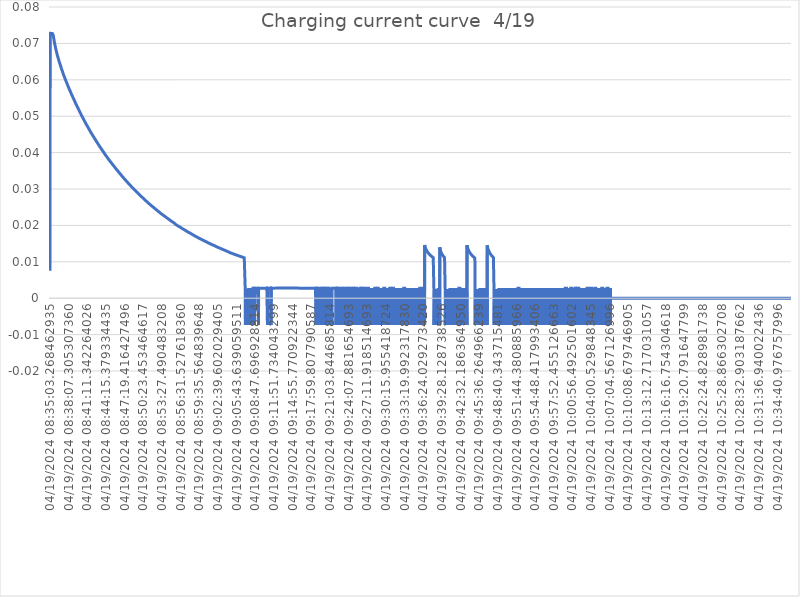
| Category | Series 0 |
|---|---|
| 04/19/2024 08:35:03.268462935 | 0.008 |
| 04/19/2024 08:35:04.285254481 | 0.073 |
| 04/19/2024 08:35:05.302024708 | 0.073 |
| 04/19/2024 08:35:06.318793132 | 0.073 |
| 04/19/2024 08:35:07.335560950 | 0.073 |
| 04/19/2024 08:35:08.352336647 | 0.073 |
| 04/19/2024 08:35:09.369111435 | 0.073 |
| 04/19/2024 08:35:10.385884587 | 0.073 |
| 04/19/2024 08:35:11.402660829 | 0.073 |
| 04/19/2024 08:35:12.419437223 | 0.073 |
| 04/19/2024 08:35:13.436207678 | 0.073 |
| 04/19/2024 08:35:14.452979950 | 0.073 |
| 04/19/2024 08:35:15.469751526 | 0.073 |
| 04/19/2024 08:35:16.486524617 | 0.073 |
| 04/19/2024 08:35:17.503297011 | 0.073 |
| 04/19/2024 08:35:18.520073799 | 0.073 |
| 04/19/2024 08:35:19.536838405 | 0.073 |
| 04/19/2024 08:35:20.553617041 | 0.073 |
| 04/19/2024 08:35:21.570386647 | 0.073 |
| 04/19/2024 08:35:22.587162102 | 0.073 |
| 04/19/2024 08:35:23.603941284 | 0.073 |
| 04/19/2024 08:35:24.620717738 | 0.073 |
| 04/19/2024 08:35:25.637512526 | 0.073 |
| 04/19/2024 08:35:26.654300950 | 0.073 |
| 04/19/2024 08:35:27.671077769 | 0.073 |
| 04/19/2024 08:35:28.687862496 | 0.073 |
| 04/19/2024 08:35:29.704645496 | 0.073 |
| 04/19/2024 08:35:30.721424193 | 0.073 |
| 04/19/2024 08:35:31.738205011 | 0.073 |
| 04/19/2024 08:35:32.754984072 | 0.073 |
| 04/19/2024 08:35:33.771765011 | 0.072 |
| 04/19/2024 08:35:34.788544405 | 0.072 |
| 04/19/2024 08:35:35.805323753 | 0.072 |
| 04/19/2024 08:35:36.822105874 | 0.072 |
| 04/19/2024 08:35:37.838877420 | 0.072 |
| 04/19/2024 08:35:38.855656480 | 0.072 |
| 04/19/2024 08:35:39.872435844 | 0.071 |
| 04/19/2024 08:35:40.889208996 | 0.071 |
| 04/19/2024 08:35:41.905987693 | 0.071 |
| 04/19/2024 08:35:42.922769268 | 0.071 |
| 04/19/2024 08:35:43.939541662 | 0.071 |
| 04/19/2024 08:35:44.956319390 | 0.07 |
| 04/19/2024 08:35:45.973093814 | 0.07 |
| 04/19/2024 08:35:46.989871420 | 0.07 |
| 04/19/2024 08:35:48.006648874 | 0.07 |
| 04/19/2024 08:35:49.023427723 | 0.07 |
| 04/19/2024 08:35:50.040206147 | 0.07 |
| 04/19/2024 08:35:51.056984511 | 0.07 |
| 04/19/2024 08:35:52.073766693 | 0.07 |
| 04/19/2024 08:35:53.090551783 | 0.069 |
| 04/19/2024 08:35:54.107332541 | 0.069 |
| 04/19/2024 08:35:55.124113814 | 0.069 |
| 04/19/2024 08:35:56.140887996 | 0.069 |
| 04/19/2024 08:35:57.157663420 | 0.069 |
| 04/19/2024 08:35:58.174444632 | 0.069 |
| 04/19/2024 08:35:59.191221935 | 0.069 |
| 04/19/2024 08:36:00.208007753 | 0.068 |
| 04/19/2024 08:36:01.224790086 | 0.068 |
| 04/19/2024 08:36:02.241565996 | 0.068 |
| 04/19/2024 08:36:03.258343420 | 0.068 |
| 04/19/2024 08:36:04.275117935 | 0.068 |
| 04/19/2024 08:36:05.291903193 | 0.068 |
| 04/19/2024 08:36:06.308674466 | 0.068 |
| 04/19/2024 08:36:07.325444466 | 0.068 |
| 04/19/2024 08:36:08.342216405 | 0.068 |
| 04/19/2024 08:36:09.358993678 | 0.067 |
| 04/19/2024 08:36:10.375769587 | 0.067 |
| 04/19/2024 08:36:11.392550951 | 0.067 |
| 04/19/2024 08:36:12.409332557 | 0.067 |
| 04/19/2024 08:36:13.426110042 | 0.067 |
| 04/19/2024 08:36:14.442882617 | 0.067 |
| 04/19/2024 08:36:15.459662678 | 0.067 |
| 04/19/2024 08:36:16.476443739 | 0.067 |
| 04/19/2024 08:36:17.493215345 | 0.067 |
| 04/19/2024 08:36:18.509994193 | 0.066 |
| 04/19/2024 08:36:19.526775405 | 0.066 |
| 04/19/2024 08:36:20.543556254 | 0.066 |
| 04/19/2024 08:36:21.560335314 | 0.066 |
| 04/19/2024 08:36:22.577110739 | 0.066 |
| 04/19/2024 08:36:23.593901133 | 0.066 |
| 04/19/2024 08:36:24.610684163 | 0.066 |
| 04/19/2024 08:36:25.627459799 | 0.066 |
| 04/19/2024 08:36:26.644245557 | 0.066 |
| 04/19/2024 08:36:27.661019314 | 0.066 |
| 04/19/2024 08:36:28.677795314 | 0.065 |
| 04/19/2024 08:36:29.694581890 | 0.065 |
| 04/19/2024 08:36:30.711358739 | 0.065 |
| 04/19/2024 08:36:31.728139284 | 0.065 |
| 04/19/2024 08:36:32.744916648 | 0.065 |
| 04/19/2024 08:36:33.761690708 | 0.065 |
| 04/19/2024 08:36:34.778468254 | 0.065 |
| 04/19/2024 08:36:35.795249571 | 0.065 |
| 04/19/2024 08:36:36.812031662 | 0.065 |
| 04/19/2024 08:36:37.828813420 | 0.065 |
| 04/19/2024 08:36:38.845588723 | 0.065 |
| 04/19/2024 08:36:39.862369480 | 0.064 |
| 04/19/2024 08:36:40.879144208 | 0.064 |
| 04/19/2024 08:36:41.895924662 | 0.064 |
| 04/19/2024 08:36:42.912706783 | 0.064 |
| 04/19/2024 08:36:43.929485753 | 0.064 |
| 04/19/2024 08:36:44.946273056 | 0.064 |
| 04/19/2024 08:36:45.963045753 | 0.064 |
| 04/19/2024 08:36:46.979824935 | 0.064 |
| 04/19/2024 08:36:47.996604905 | 0.064 |
| 04/19/2024 08:36:49.013381753 | 0.064 |
| 04/19/2024 08:36:50.030161783 | 0.064 |
| 04/19/2024 08:36:51.046947420 | 0.063 |
| 04/19/2024 08:36:52.063728480 | 0.063 |
| 04/19/2024 08:36:53.080519450 | 0.063 |
| 04/19/2024 08:36:54.097301905 | 0.063 |
| 04/19/2024 08:36:55.114085965 | 0.063 |
| 04/19/2024 08:36:56.130867783 | 0.063 |
| 04/19/2024 08:36:57.147643632 | 0.063 |
| 04/19/2024 08:36:58.164429208 | 0.063 |
| 04/19/2024 08:36:59.181203086 | 0.063 |
| 04/19/2024 08:37:00.197979693 | 0.063 |
| 04/19/2024 08:37:01.214759662 | 0.063 |
| 04/19/2024 08:37:02.231533874 | 0.063 |
| 04/19/2024 08:37:03.248314420 | 0.062 |
| 04/19/2024 08:37:04.265088359 | 0.062 |
| 04/19/2024 08:37:05.281863571 | 0.062 |
| 04/19/2024 08:37:06.298648965 | 0.062 |
| 04/19/2024 08:37:07.315421329 | 0.062 |
| 04/19/2024 08:37:08.332199147 | 0.062 |
| 04/19/2024 08:37:09.348975299 | 0.062 |
| 04/19/2024 08:37:10.365755844 | 0.062 |
| 04/19/2024 08:37:11.382533753 | 0.062 |
| 04/19/2024 08:37:12.399315511 | 0.062 |
| 04/19/2024 08:37:13.416092571 | 0.062 |
| 04/19/2024 08:37:14.432863602 | 0.062 |
| 04/19/2024 08:37:15.449641299 | 0.061 |
| 04/19/2024 08:37:16.466418935 | 0.061 |
| 04/19/2024 08:37:17.483193208 | 0.061 |
| 04/19/2024 08:37:18.499974359 | 0.061 |
| 04/19/2024 08:37:19.516751571 | 0.061 |
| 04/19/2024 08:37:20.533522965 | 0.061 |
| 04/19/2024 08:37:21.550304632 | 0.061 |
| 04/19/2024 08:37:22.567076056 | 0.061 |
| 04/19/2024 08:37:23.583856511 | 0.061 |
| 04/19/2024 08:37:24.600646026 | 0.061 |
| 04/19/2024 08:37:25.617424147 | 0.061 |
| 04/19/2024 08:37:26.634208602 | 0.061 |
| 04/19/2024 08:37:27.650992299 | 0.061 |
| 04/19/2024 08:37:28.667769874 | 0.061 |
| 04/19/2024 08:37:29.684552783 | 0.06 |
| 04/19/2024 08:37:30.701329420 | 0.06 |
| 04/19/2024 08:37:31.718103844 | 0.06 |
| 04/19/2024 08:37:32.734886783 | 0.06 |
| 04/19/2024 08:37:33.751663420 | 0.06 |
| 04/19/2024 08:37:34.768442026 | 0.06 |
| 04/19/2024 08:37:35.785215572 | 0.06 |
| 04/19/2024 08:37:36.801998875 | 0.06 |
| 04/19/2024 08:37:37.818778632 | 0.06 |
| 04/19/2024 08:37:38.835553663 | 0.06 |
| 04/19/2024 08:37:39.852333935 | 0.06 |
| 04/19/2024 08:37:40.869107541 | 0.06 |
| 04/19/2024 08:37:41.885877996 | 0.06 |
| 04/19/2024 08:37:42.902658602 | 0.06 |
| 04/19/2024 08:37:43.919430056 | 0.059 |
| 04/19/2024 08:37:44.936204875 | 0.059 |
| 04/19/2024 08:37:45.952990905 | 0.059 |
| 04/19/2024 08:37:46.969764420 | 0.059 |
| 04/19/2024 08:37:47.986543087 | 0.059 |
| 04/19/2024 08:37:49.003314390 | 0.059 |
| 04/19/2024 08:37:50.020092481 | 0.059 |
| 04/19/2024 08:37:51.036870935 | 0.059 |
| 04/19/2024 08:37:52.053650238 | 0.059 |
| 04/19/2024 08:37:53.070430905 | 0.059 |
| 04/19/2024 08:37:54.087205056 | 0.059 |
| 04/19/2024 08:37:55.103983026 | 0.059 |
| 04/19/2024 08:37:56.120762390 | 0.059 |
| 04/19/2024 08:37:57.137538511 | 0.058 |
| 04/19/2024 08:37:58.154319996 | 0.058 |
| 04/19/2024 08:37:59.171095147 | 0.058 |
| 04/19/2024 08:38:00.187867996 | 0.058 |
| 04/19/2024 08:38:01.204649875 | 0.058 |
| 04/19/2024 08:38:02.221423844 | 0.058 |
| 04/19/2024 08:38:03.238199632 | 0.058 |
| 04/19/2024 08:38:04.254980784 | 0.058 |
| 04/19/2024 08:38:05.271758178 | 0.058 |
| 04/19/2024 08:38:06.288534693 | 0.058 |
| 04/19/2024 08:38:07.305307360 | 0.058 |
| 04/19/2024 08:38:08.322081572 | 0.058 |
| 04/19/2024 08:38:09.338854754 | 0.058 |
| 04/19/2024 08:38:10.355625602 | 0.058 |
| 04/19/2024 08:38:11.372399148 | 0.058 |
| 04/19/2024 08:38:12.389174905 | 0.057 |
| 04/19/2024 08:38:13.405953724 | 0.057 |
| 04/19/2024 08:38:14.422733451 | 0.057 |
| 04/19/2024 08:38:15.439504724 | 0.057 |
| 04/19/2024 08:38:16.456286057 | 0.057 |
| 04/19/2024 08:38:17.473059118 | 0.057 |
| 04/19/2024 08:38:18.489836360 | 0.057 |
| 04/19/2024 08:38:19.506619996 | 0.057 |
| 04/19/2024 08:38:20.523394633 | 0.057 |
| 04/19/2024 08:38:21.540173239 | 0.057 |
| 04/19/2024 08:38:22.556955633 | 0.057 |
| 04/19/2024 08:38:23.573736360 | 0.057 |
| 04/19/2024 08:38:24.590521027 | 0.057 |
| 04/19/2024 08:38:25.607297269 | 0.057 |
| 04/19/2024 08:38:26.624078390 | 0.057 |
| 04/19/2024 08:38:27.640856511 | 0.056 |
| 04/19/2024 08:38:28.657632542 | 0.056 |
| 04/19/2024 08:38:29.674414693 | 0.056 |
| 04/19/2024 08:38:30.691189724 | 0.056 |
| 04/19/2024 08:38:31.707966118 | 0.056 |
| 04/19/2024 08:38:32.724745845 | 0.056 |
| 04/19/2024 08:38:33.741519845 | 0.056 |
| 04/19/2024 08:38:34.758293724 | 0.056 |
| 04/19/2024 08:38:35.775066860 | 0.056 |
| 04/19/2024 08:38:36.791843678 | 0.056 |
| 04/19/2024 08:38:37.808628254 | 0.056 |
| 04/19/2024 08:38:38.825399738 | 0.056 |
| 04/19/2024 08:38:39.842178223 | 0.056 |
| 04/19/2024 08:38:40.858961738 | 0.056 |
| 04/19/2024 08:38:41.875735254 | 0.056 |
| 04/19/2024 08:38:42.892517678 | 0.056 |
| 04/19/2024 08:38:43.909294890 | 0.055 |
| 04/19/2024 08:38:44.926072284 | 0.055 |
| 04/19/2024 08:38:45.942853829 | 0.055 |
| 04/19/2024 08:38:46.959629466 | 0.055 |
| 04/19/2024 08:38:47.976404102 | 0.055 |
| 04/19/2024 08:38:48.993178951 | 0.055 |
| 04/19/2024 08:38:50.009965223 | 0.055 |
| 04/19/2024 08:38:51.026745163 | 0.055 |
| 04/19/2024 08:38:52.043518890 | 0.055 |
| 04/19/2024 08:38:53.060299132 | 0.055 |
| 04/19/2024 08:38:54.077070284 | 0.055 |
| 04/19/2024 08:38:55.093853254 | 0.055 |
| 04/19/2024 08:38:56.110641314 | 0.055 |
| 04/19/2024 08:38:57.127420223 | 0.055 |
| 04/19/2024 08:38:58.144202951 | 0.055 |
| 04/19/2024 08:38:59.160985708 | 0.055 |
| 04/19/2024 08:39:00.177763920 | 0.055 |
| 04/19/2024 08:39:01.194545496 | 0.054 |
| 04/19/2024 08:39:02.211323284 | 0.054 |
| 04/19/2024 08:39:03.228102223 | 0.054 |
| 04/19/2024 08:39:04.244886011 | 0.054 |
| 04/19/2024 08:39:05.261660829 | 0.054 |
| 04/19/2024 08:39:06.278437981 | 0.054 |
| 04/19/2024 08:39:07.295218071 | 0.054 |
| 04/19/2024 08:39:08.311992617 | 0.054 |
| 04/19/2024 08:39:09.328766435 | 0.054 |
| 04/19/2024 08:39:10.345543799 | 0.054 |
| 04/19/2024 08:39:11.362318253 | 0.054 |
| 04/19/2024 08:39:12.379093556 | 0.054 |
| 04/19/2024 08:39:13.395872738 | 0.054 |
| 04/19/2024 08:39:14.412646981 | 0.054 |
| 04/19/2024 08:39:15.429422920 | 0.054 |
| 04/19/2024 08:39:16.446200647 | 0.053 |
| 04/19/2024 08:39:17.462982799 | 0.053 |
| 04/19/2024 08:39:18.479756617 | 0.053 |
| 04/19/2024 08:39:19.496539587 | 0.053 |
| 04/19/2024 08:39:20.513314435 | 0.053 |
| 04/19/2024 08:39:21.530096708 | 0.053 |
| 04/19/2024 08:39:22.546879950 | 0.053 |
| 04/19/2024 08:39:23.563663465 | 0.053 |
| 04/19/2024 08:39:24.580446768 | 0.053 |
| 04/19/2024 08:39:25.597226587 | 0.053 |
| 04/19/2024 08:39:26.614012768 | 0.053 |
| 04/19/2024 08:39:27.630795799 | 0.053 |
| 04/19/2024 08:39:28.647573344 | 0.053 |
| 04/19/2024 08:39:29.664354102 | 0.053 |
| 04/19/2024 08:39:30.681124284 | 0.053 |
| 04/19/2024 08:39:31.697907859 | 0.053 |
| 04/19/2024 08:39:32.714688647 | 0.053 |
| 04/19/2024 08:39:33.731468162 | 0.053 |
| 04/19/2024 08:39:34.748244405 | 0.052 |
| 04/19/2024 08:39:35.765027980 | 0.052 |
| 04/19/2024 08:39:36.781802314 | 0.052 |
| 04/19/2024 08:39:37.798579859 | 0.052 |
| 04/19/2024 08:39:38.815357738 | 0.052 |
| 04/19/2024 08:39:39.832133011 | 0.052 |
| 04/19/2024 08:39:40.848914587 | 0.052 |
| 04/19/2024 08:39:41.865695344 | 0.052 |
| 04/19/2024 08:39:42.882477677 | 0.052 |
| 04/19/2024 08:39:43.899256496 | 0.052 |
| 04/19/2024 08:39:44.916034405 | 0.052 |
| 04/19/2024 08:39:45.932813890 | 0.052 |
| 04/19/2024 08:39:46.949593708 | 0.052 |
| 04/19/2024 08:39:47.966374708 | 0.052 |
| 04/19/2024 08:39:48.983150556 | 0.052 |
| 04/19/2024 08:39:49.999930374 | 0.052 |
| 04/19/2024 08:39:51.016711496 | 0.052 |
| 04/19/2024 08:39:52.033483374 | 0.051 |
| 04/19/2024 08:39:53.050269890 | 0.051 |
| 04/19/2024 08:39:54.067050496 | 0.051 |
| 04/19/2024 08:39:55.083833496 | 0.051 |
| 04/19/2024 08:39:56.100622526 | 0.051 |
| 04/19/2024 08:39:57.117395587 | 0.051 |
| 04/19/2024 08:39:58.134177526 | 0.051 |
| 04/19/2024 08:39:59.150963102 | 0.051 |
| 04/19/2024 08:40:00.167756768 | 0.051 |
| 04/19/2024 08:40:01.184541617 | 0.051 |
| 04/19/2024 08:40:02.201317647 | 0.051 |
| 04/19/2024 08:40:03.218090102 | 0.051 |
| 04/19/2024 08:40:04.234872435 | 0.051 |
| 04/19/2024 08:40:05.251649087 | 0.051 |
| 04/19/2024 08:40:06.268428632 | 0.051 |
| 04/19/2024 08:40:07.285204723 | 0.051 |
| 04/19/2024 08:40:08.301983996 | 0.051 |
| 04/19/2024 08:40:09.318767238 | 0.05 |
| 04/19/2024 08:40:10.335545693 | 0.05 |
| 04/19/2024 08:40:11.352327602 | 0.05 |
| 04/19/2024 08:40:12.369111329 | 0.05 |
| 04/19/2024 08:40:13.385892965 | 0.05 |
| 04/19/2024 08:40:14.402677117 | 0.05 |
| 04/19/2024 08:40:15.419448875 | 0.05 |
| 04/19/2024 08:40:16.436233178 | 0.05 |
| 04/19/2024 08:40:17.453019178 | 0.05 |
| 04/19/2024 08:40:18.469793753 | 0.05 |
| 04/19/2024 08:40:19.486573541 | 0.05 |
| 04/19/2024 08:40:20.503354026 | 0.05 |
| 04/19/2024 08:40:21.520130693 | 0.05 |
| 04/19/2024 08:40:22.536913117 | 0.05 |
| 04/19/2024 08:40:23.553689965 | 0.05 |
| 04/19/2024 08:40:24.570470632 | 0.05 |
| 04/19/2024 08:40:25.587244147 | 0.05 |
| 04/19/2024 08:40:26.604027056 | 0.05 |
| 04/19/2024 08:40:27.620809087 | 0.049 |
| 04/19/2024 08:40:28.637581056 | 0.049 |
| 04/19/2024 08:40:29.654361541 | 0.049 |
| 04/19/2024 08:40:30.671140875 | 0.049 |
| 04/19/2024 08:40:31.687917905 | 0.049 |
| 04/19/2024 08:40:32.704696935 | 0.049 |
| 04/19/2024 08:40:33.721467147 | 0.049 |
| 04/19/2024 08:40:34.738244147 | 0.049 |
| 04/19/2024 08:40:35.755031799 | 0.049 |
| 04/19/2024 08:40:36.771807950 | 0.049 |
| 04/19/2024 08:40:37.788580769 | 0.049 |
| 04/19/2024 08:40:38.805358375 | 0.049 |
| 04/19/2024 08:40:39.822133678 | 0.049 |
| 04/19/2024 08:40:40.838914647 | 0.049 |
| 04/19/2024 08:40:41.855692375 | 0.049 |
| 04/19/2024 08:40:42.872469708 | 0.049 |
| 04/19/2024 08:40:43.889241526 | 0.049 |
| 04/19/2024 08:40:44.906022405 | 0.049 |
| 04/19/2024 08:40:45.922801193 | 0.049 |
| 04/19/2024 08:40:46.939573496 | 0.048 |
| 04/19/2024 08:40:47.956353193 | 0.048 |
| 04/19/2024 08:40:48.973134950 | 0.048 |
| 04/19/2024 08:40:49.989913920 | 0.048 |
| 04/19/2024 08:40:51.006697496 | 0.048 |
| 04/19/2024 08:40:52.023470102 | 0.048 |
| 04/19/2024 08:40:53.040253284 | 0.048 |
| 04/19/2024 08:40:54.057033678 | 0.048 |
| 04/19/2024 08:40:55.073805193 | 0.048 |
| 04/19/2024 08:40:56.090590647 | 0.048 |
| 04/19/2024 08:40:57.107366253 | 0.048 |
| 04/19/2024 08:40:58.124149223 | 0.048 |
| 04/19/2024 08:40:59.140929314 | 0.048 |
| 04/19/2024 08:41:00.157704617 | 0.048 |
| 04/19/2024 08:41:01.174484526 | 0.048 |
| 04/19/2024 08:41:02.191259344 | 0.048 |
| 04/19/2024 08:41:03.208034950 | 0.048 |
| 04/19/2024 08:41:04.224817405 | 0.048 |
| 04/19/2024 08:41:05.241593148 | 0.048 |
| 04/19/2024 08:41:06.258372693 | 0.047 |
| 04/19/2024 08:41:07.275155360 | 0.047 |
| 04/19/2024 08:41:08.291933814 | 0.047 |
| 04/19/2024 08:41:09.308710602 | 0.047 |
| 04/19/2024 08:41:10.325482542 | 0.047 |
| 04/19/2024 08:41:11.342264026 | 0.047 |
| 04/19/2024 08:41:12.359044663 | 0.047 |
| 04/19/2024 08:41:13.375822754 | 0.047 |
| 04/19/2024 08:41:14.392609572 | 0.047 |
| 04/19/2024 08:41:15.409388572 | 0.047 |
| 04/19/2024 08:41:16.426168542 | 0.047 |
| 04/19/2024 08:41:17.442954057 | 0.047 |
| 04/19/2024 08:41:18.459727178 | 0.047 |
| 04/19/2024 08:41:19.476510360 | 0.047 |
| 04/19/2024 08:41:20.493296360 | 0.047 |
| 04/19/2024 08:41:21.510077481 | 0.047 |
| 04/19/2024 08:41:22.526860996 | 0.047 |
| 04/19/2024 08:41:23.543634723 | 0.047 |
| 04/19/2024 08:41:24.560412117 | 0.047 |
| 04/19/2024 08:41:25.577192996 | 0.047 |
| 04/19/2024 08:41:26.593978026 | 0.047 |
| 04/19/2024 08:41:27.610761966 | 0.046 |
| 04/19/2024 08:41:28.627536905 | 0.046 |
| 04/19/2024 08:41:29.644322329 | 0.046 |
| 04/19/2024 08:41:30.661104087 | 0.046 |
| 04/19/2024 08:41:31.677878178 | 0.046 |
| 04/19/2024 08:41:32.694659511 | 0.046 |
| 04/19/2024 08:41:33.711433360 | 0.046 |
| 04/19/2024 08:41:34.728210178 | 0.046 |
| 04/19/2024 08:41:35.744995193 | 0.046 |
| 04/19/2024 08:41:36.761768647 | 0.046 |
| 04/19/2024 08:41:37.778545860 | 0.046 |
| 04/19/2024 08:41:38.795325132 | 0.046 |
| 04/19/2024 08:41:39.812100860 | 0.046 |
| 04/19/2024 08:41:40.828881375 | 0.046 |
| 04/19/2024 08:41:41.845665132 | 0.046 |
| 04/19/2024 08:41:42.862446314 | 0.046 |
| 04/19/2024 08:41:43.879229405 | 0.046 |
| 04/19/2024 08:41:44.896011647 | 0.046 |
| 04/19/2024 08:41:45.912789647 | 0.046 |
| 04/19/2024 08:41:46.929564041 | 0.046 |
| 04/19/2024 08:41:47.946350011 | 0.045 |
| 04/19/2024 08:41:48.963130163 | 0.045 |
| 04/19/2024 08:41:49.979904678 | 0.045 |
| 04/19/2024 08:41:50.996691496 | 0.045 |
| 04/19/2024 08:41:52.013461920 | 0.045 |
| 04/19/2024 08:41:53.030251102 | 0.045 |
| 04/19/2024 08:41:54.047037072 | 0.045 |
| 04/19/2024 08:41:55.063808799 | 0.045 |
| 04/19/2024 08:41:56.080588890 | 0.045 |
| 04/19/2024 08:41:57.097364102 | 0.045 |
| 04/19/2024 08:41:58.114147738 | 0.045 |
| 04/19/2024 08:41:59.130931163 | 0.045 |
| 04/19/2024 08:42:00.147721405 | 0.045 |
| 04/19/2024 08:42:01.164502496 | 0.045 |
| 04/19/2024 08:42:02.181281132 | 0.045 |
| 04/19/2024 08:42:03.198057223 | 0.045 |
| 04/19/2024 08:42:04.214841102 | 0.045 |
| 04/19/2024 08:42:05.231614936 | 0.045 |
| 04/19/2024 08:42:06.248391572 | 0.045 |
| 04/19/2024 08:42:07.265172814 | 0.045 |
| 04/19/2024 08:42:08.281949663 | 0.045 |
| 04/19/2024 08:42:09.298726966 | 0.044 |
| 04/19/2024 08:42:10.315502784 | 0.044 |
| 04/19/2024 08:42:11.332276693 | 0.044 |
| 04/19/2024 08:42:12.349063602 | 0.044 |
| 04/19/2024 08:42:13.365845148 | 0.044 |
| 04/19/2024 08:42:14.382622784 | 0.044 |
| 04/19/2024 08:42:15.399399814 | 0.044 |
| 04/19/2024 08:42:16.416178754 | 0.044 |
| 04/19/2024 08:42:17.432960572 | 0.044 |
| 04/19/2024 08:42:18.449738996 | 0.044 |
| 04/19/2024 08:42:19.466522178 | 0.044 |
| 04/19/2024 08:42:20.483301420 | 0.044 |
| 04/19/2024 08:42:21.500079966 | 0.044 |
| 04/19/2024 08:42:22.516859875 | 0.044 |
| 04/19/2024 08:42:23.533635269 | 0.044 |
| 04/19/2024 08:42:24.550413905 | 0.044 |
| 04/19/2024 08:42:25.567193329 | 0.044 |
| 04/19/2024 08:42:26.583968329 | 0.044 |
| 04/19/2024 08:42:27.600752269 | 0.044 |
| 04/19/2024 08:42:28.617525754 | 0.044 |
| 04/19/2024 08:42:29.634302936 | 0.044 |
| 04/19/2024 08:42:30.651083784 | 0.044 |
| 04/19/2024 08:42:31.667860905 | 0.043 |
| 04/19/2024 08:42:32.684640178 | 0.043 |
| 04/19/2024 08:42:33.701413239 | 0.043 |
| 04/19/2024 08:42:34.718185239 | 0.043 |
| 04/19/2024 08:42:35.734969071 | 0.043 |
| 04/19/2024 08:42:36.751747556 | 0.043 |
| 04/19/2024 08:42:37.768522768 | 0.043 |
| 04/19/2024 08:42:38.785306950 | 0.043 |
| 04/19/2024 08:42:39.802084193 | 0.043 |
| 04/19/2024 08:42:40.818857496 | 0.043 |
| 04/19/2024 08:42:41.835630859 | 0.043 |
| 04/19/2024 08:42:42.852415011 | 0.043 |
| 04/19/2024 08:42:43.869197617 | 0.043 |
| 04/19/2024 08:42:44.885978950 | 0.043 |
| 04/19/2024 08:42:45.902759738 | 0.043 |
| 04/19/2024 08:42:46.919533223 | 0.043 |
| 04/19/2024 08:42:47.936315102 | 0.043 |
| 04/19/2024 08:42:48.953098283 | 0.043 |
| 04/19/2024 08:42:49.969873314 | 0.043 |
| 04/19/2024 08:42:50.986652102 | 0.043 |
| 04/19/2024 08:42:52.003429465 | 0.043 |
| 04/19/2024 08:42:53.020211374 | 0.043 |
| 04/19/2024 08:42:54.036993132 | 0.042 |
| 04/19/2024 08:42:55.053768374 | 0.042 |
| 04/19/2024 08:42:56.070544132 | 0.042 |
| 04/19/2024 08:42:57.087327980 | 0.042 |
| 04/19/2024 08:42:58.104110253 | 0.042 |
| 04/19/2024 08:42:59.120889344 | 0.042 |
| 04/19/2024 08:43:00.137664223 | 0.042 |
| 04/19/2024 08:43:01.154448253 | 0.042 |
| 04/19/2024 08:43:02.171226283 | 0.042 |
| 04/19/2024 08:43:03.187999859 | 0.042 |
| 04/19/2024 08:43:04.204782223 | 0.042 |
| 04/19/2024 08:43:05.221555709 | 0.042 |
| 04/19/2024 08:43:06.238329375 | 0.042 |
| 04/19/2024 08:43:07.255112466 | 0.042 |
| 04/19/2024 08:43:08.271888193 | 0.042 |
| 04/19/2024 08:43:09.288673496 | 0.042 |
| 04/19/2024 08:43:10.305448830 | 0.042 |
| 04/19/2024 08:43:11.322217921 | 0.042 |
| 04/19/2024 08:43:12.338991648 | 0.042 |
| 04/19/2024 08:43:13.355770103 | 0.042 |
| 04/19/2024 08:43:14.372549830 | 0.042 |
| 04/19/2024 08:43:15.389333284 | 0.042 |
| 04/19/2024 08:43:16.406111406 | 0.042 |
| 04/19/2024 08:43:17.422889860 | 0.042 |
| 04/19/2024 08:43:18.439665315 | 0.041 |
| 04/19/2024 08:43:19.456452012 | 0.041 |
| 04/19/2024 08:43:20.473238042 | 0.041 |
| 04/19/2024 08:43:21.490014042 | 0.041 |
| 04/19/2024 08:43:22.506796648 | 0.041 |
| 04/19/2024 08:43:23.523571436 | 0.041 |
| 04/19/2024 08:43:24.540351981 | 0.041 |
| 04/19/2024 08:43:25.557137042 | 0.041 |
| 04/19/2024 08:43:26.573907860 | 0.041 |
| 04/19/2024 08:43:27.590685345 | 0.041 |
| 04/19/2024 08:43:28.607475951 | 0.041 |
| 04/19/2024 08:43:29.624254496 | 0.041 |
| 04/19/2024 08:43:30.641035193 | 0.041 |
| 04/19/2024 08:43:31.657810224 | 0.041 |
| 04/19/2024 08:43:32.674591769 | 0.041 |
| 04/19/2024 08:43:33.691373709 | 0.041 |
| 04/19/2024 08:43:34.708149890 | 0.041 |
| 04/19/2024 08:43:35.724930344 | 0.041 |
| 04/19/2024 08:43:36.741703829 | 0.041 |
| 04/19/2024 08:43:37.758481617 | 0.041 |
| 04/19/2024 08:43:38.775261102 | 0.041 |
| 04/19/2024 08:43:39.792037678 | 0.041 |
| 04/19/2024 08:43:40.808815102 | 0.041 |
| 04/19/2024 08:43:41.825589920 | 0.041 |
| 04/19/2024 08:43:42.842366738 | 0.04 |
| 04/19/2024 08:43:43.859153011 | 0.04 |
| 04/19/2024 08:43:44.875933587 | 0.04 |
| 04/19/2024 08:43:45.892718587 | 0.04 |
| 04/19/2024 08:43:46.909500860 | 0.04 |
| 04/19/2024 08:43:47.926280375 | 0.04 |
| 04/19/2024 08:43:48.943064890 | 0.04 |
| 04/19/2024 08:43:49.959838647 | 0.04 |
| 04/19/2024 08:43:50.976633799 | 0.04 |
| 04/19/2024 08:43:51.993421496 | 0.04 |
| 04/19/2024 08:43:53.010201587 | 0.04 |
| 04/19/2024 08:43:54.026981678 | 0.04 |
| 04/19/2024 08:43:55.043760708 | 0.04 |
| 04/19/2024 08:43:56.060537769 | 0.04 |
| 04/19/2024 08:43:57.077319890 | 0.04 |
| 04/19/2024 08:43:58.094095556 | 0.04 |
| 04/19/2024 08:43:59.110876890 | 0.04 |
| 04/19/2024 08:44:00.127651011 | 0.04 |
| 04/19/2024 08:44:01.144431829 | 0.04 |
| 04/19/2024 08:44:02.161210920 | 0.04 |
| 04/19/2024 08:44:03.177985526 | 0.04 |
| 04/19/2024 08:44:04.194771314 | 0.04 |
| 04/19/2024 08:44:05.211556102 | 0.04 |
| 04/19/2024 08:44:06.228336708 | 0.04 |
| 04/19/2024 08:44:07.245118981 | 0.039 |
| 04/19/2024 08:44:08.261895647 | 0.039 |
| 04/19/2024 08:44:09.278670496 | 0.039 |
| 04/19/2024 08:44:10.295455284 | 0.039 |
| 04/19/2024 08:44:11.312230344 | 0.039 |
| 04/19/2024 08:44:12.329001526 | 0.039 |
| 04/19/2024 08:44:13.345773799 | 0.039 |
| 04/19/2024 08:44:14.362551162 | 0.039 |
| 04/19/2024 08:44:15.379334435 | 0.039 |
| 04/19/2024 08:44:16.396120526 | 0.039 |
| 04/19/2024 08:44:17.412904920 | 0.039 |
| 04/19/2024 08:44:18.429680556 | 0.039 |
| 04/19/2024 08:44:19.446467284 | 0.039 |
| 04/19/2024 08:44:20.463252072 | 0.039 |
| 04/19/2024 08:44:21.480030496 | 0.039 |
| 04/19/2024 08:44:22.496814587 | 0.039 |
| 04/19/2024 08:44:23.513598102 | 0.039 |
| 04/19/2024 08:44:24.530378465 | 0.039 |
| 04/19/2024 08:44:25.547159981 | 0.039 |
| 04/19/2024 08:44:26.563933314 | 0.039 |
| 04/19/2024 08:44:27.580709465 | 0.039 |
| 04/19/2024 08:44:28.597494799 | 0.039 |
| 04/19/2024 08:44:29.614277920 | 0.039 |
| 04/19/2024 08:44:30.631056193 | 0.039 |
| 04/19/2024 08:44:31.647831890 | 0.039 |
| 04/19/2024 08:44:32.664613102 | 0.038 |
| 04/19/2024 08:44:33.681395950 | 0.038 |
| 04/19/2024 08:44:34.698174162 | 0.038 |
| 04/19/2024 08:44:35.714952814 | 0.038 |
| 04/19/2024 08:44:36.731727451 | 0.038 |
| 04/19/2024 08:44:37.748504511 | 0.038 |
| 04/19/2024 08:44:38.765284996 | 0.038 |
| 04/19/2024 08:44:39.782060966 | 0.038 |
| 04/19/2024 08:44:40.798840663 | 0.038 |
| 04/19/2024 08:44:41.815620814 | 0.038 |
| 04/19/2024 08:44:42.832397481 | 0.038 |
| 04/19/2024 08:44:43.849178178 | 0.038 |
| 04/19/2024 08:44:44.865958723 | 0.038 |
| 04/19/2024 08:44:45.882739542 | 0.038 |
| 04/19/2024 08:44:46.899525511 | 0.038 |
| 04/19/2024 08:44:47.916306905 | 0.038 |
| 04/19/2024 08:44:48.933087269 | 0.038 |
| 04/19/2024 08:44:49.949862299 | 0.038 |
| 04/19/2024 08:44:50.966645208 | 0.038 |
| 04/19/2024 08:44:51.983424481 | 0.038 |
| 04/19/2024 08:44:53.000212148 | 0.038 |
| 04/19/2024 08:44:54.016992632 | 0.038 |
| 04/19/2024 08:44:55.033768329 | 0.038 |
| 04/19/2024 08:44:56.050546905 | 0.038 |
| 04/19/2024 08:44:57.067324238 | 0.038 |
| 04/19/2024 08:44:58.084101238 | 0.038 |
| 04/19/2024 08:44:59.100882238 | 0.038 |
| 04/19/2024 08:45:00.117661784 | 0.037 |
| 04/19/2024 08:45:01.134442542 | 0.037 |
| 04/19/2024 08:45:02.151227814 | 0.037 |
| 04/19/2024 08:45:03.168003117 | 0.037 |
| 04/19/2024 08:45:04.184780148 | 0.037 |
| 04/19/2024 08:45:05.201564057 | 0.037 |
| 04/19/2024 08:45:06.218344238 | 0.037 |
| 04/19/2024 08:45:07.235124602 | 0.037 |
| 04/19/2024 08:45:08.251898420 | 0.037 |
| 04/19/2024 08:45:09.268674996 | 0.037 |
| 04/19/2024 08:45:10.285457147 | 0.037 |
| 04/19/2024 08:45:11.302235481 | 0.037 |
| 04/19/2024 08:45:12.319010632 | 0.037 |
| 04/19/2024 08:45:13.335783663 | 0.037 |
| 04/19/2024 08:45:14.352561178 | 0.037 |
| 04/19/2024 08:45:15.369334451 | 0.037 |
| 04/19/2024 08:45:16.386116511 | 0.037 |
| 04/19/2024 08:45:17.402900693 | 0.037 |
| 04/19/2024 08:45:18.419683693 | 0.037 |
| 04/19/2024 08:45:19.436467693 | 0.037 |
| 04/19/2024 08:45:20.453249299 | 0.037 |
| 04/19/2024 08:45:21.470025269 | 0.037 |
| 04/19/2024 08:45:22.486807390 | 0.037 |
| 04/19/2024 08:45:23.503593723 | 0.037 |
| 04/19/2024 08:45:24.520373844 | 0.037 |
| 04/19/2024 08:45:25.537154117 | 0.037 |
| 04/19/2024 08:45:26.553926814 | 0.037 |
| 04/19/2024 08:45:27.570702723 | 0.036 |
| 04/19/2024 08:45:28.587486269 | 0.036 |
| 04/19/2024 08:45:29.604262451 | 0.036 |
| 04/19/2024 08:45:30.621041451 | 0.036 |
| 04/19/2024 08:45:31.637817632 | 0.036 |
| 04/19/2024 08:45:32.654600723 | 0.036 |
| 04/19/2024 08:45:33.671382390 | 0.036 |
| 04/19/2024 08:45:34.688156663 | 0.036 |
| 04/19/2024 08:45:35.704942193 | 0.036 |
| 04/19/2024 08:45:36.721725314 | 0.036 |
| 04/19/2024 08:45:37.738497678 | 0.036 |
| 04/19/2024 08:45:38.755278132 | 0.036 |
| 04/19/2024 08:45:39.772050647 | 0.036 |
| 04/19/2024 08:45:40.788827981 | 0.036 |
| 04/19/2024 08:45:41.805610162 | 0.036 |
| 04/19/2024 08:45:42.822387768 | 0.036 |
| 04/19/2024 08:45:43.839169162 | 0.036 |
| 04/19/2024 08:45:44.855941890 | 0.036 |
| 04/19/2024 08:45:45.872719405 | 0.036 |
| 04/19/2024 08:45:46.889504950 | 0.036 |
| 04/19/2024 08:45:47.906287526 | 0.036 |
| 04/19/2024 08:45:48.923066496 | 0.036 |
| 04/19/2024 08:45:49.939838132 | 0.036 |
| 04/19/2024 08:45:50.956614253 | 0.036 |
| 04/19/2024 08:45:51.973393890 | 0.036 |
| 04/19/2024 08:45:52.990169041 | 0.036 |
| 04/19/2024 08:45:54.006954526 | 0.036 |
| 04/19/2024 08:45:55.023733768 | 0.036 |
| 04/19/2024 08:45:56.040511465 | 0.035 |
| 04/19/2024 08:45:57.057294890 | 0.035 |
| 04/19/2024 08:45:58.074070102 | 0.035 |
| 04/19/2024 08:45:59.090848314 | 0.035 |
| 04/19/2024 08:46:00.107628920 | 0.035 |
| 04/19/2024 08:46:01.124402253 | 0.035 |
| 04/19/2024 08:46:02.141183435 | 0.035 |
| 04/19/2024 08:46:03.157959678 | 0.035 |
| 04/19/2024 08:46:04.174739435 | 0.035 |
| 04/19/2024 08:46:05.191517905 | 0.035 |
| 04/19/2024 08:46:06.208296572 | 0.035 |
| 04/19/2024 08:46:07.225077754 | 0.035 |
| 04/19/2024 08:46:08.241850784 | 0.035 |
| 04/19/2024 08:46:09.258630542 | 0.035 |
| 04/19/2024 08:46:10.275412784 | 0.035 |
| 04/19/2024 08:46:11.292188845 | 0.035 |
| 04/19/2024 08:46:12.308963724 | 0.035 |
| 04/19/2024 08:46:13.325744087 | 0.035 |
| 04/19/2024 08:46:14.342519299 | 0.035 |
| 04/19/2024 08:46:15.359293542 | 0.035 |
| 04/19/2024 08:46:16.376064996 | 0.035 |
| 04/19/2024 08:46:17.392848299 | 0.035 |
| 04/19/2024 08:46:18.409629542 | 0.035 |
| 04/19/2024 08:46:19.426411451 | 0.035 |
| 04/19/2024 08:46:20.443191754 | 0.035 |
| 04/19/2024 08:46:21.459969693 | 0.035 |
| 04/19/2024 08:46:22.476750057 | 0.035 |
| 04/19/2024 08:46:23.493538390 | 0.035 |
| 04/19/2024 08:46:24.510327269 | 0.035 |
| 04/19/2024 08:46:25.527110057 | 0.034 |
| 04/19/2024 08:46:26.543886451 | 0.034 |
| 04/19/2024 08:46:27.560665239 | 0.034 |
| 04/19/2024 08:46:28.577459633 | 0.034 |
| 04/19/2024 08:46:29.594238724 | 0.034 |
| 04/19/2024 08:46:30.611019815 | 0.034 |
| 04/19/2024 08:46:31.627808239 | 0.034 |
| 04/19/2024 08:46:32.644589299 | 0.034 |
| 04/19/2024 08:46:33.661370996 | 0.034 |
| 04/19/2024 08:46:34.678147481 | 0.034 |
| 04/19/2024 08:46:35.694930617 | 0.034 |
| 04/19/2024 08:46:36.711715950 | 0.034 |
| 04/19/2024 08:46:37.728495829 | 0.034 |
| 04/19/2024 08:46:38.745279193 | 0.034 |
| 04/19/2024 08:46:39.762049829 | 0.034 |
| 04/19/2024 08:46:40.778829011 | 0.034 |
| 04/19/2024 08:46:41.795613405 | 0.034 |
| 04/19/2024 08:46:42.812389890 | 0.034 |
| 04/19/2024 08:46:43.829170708 | 0.034 |
| 04/19/2024 08:46:44.845945041 | 0.034 |
| 04/19/2024 08:46:45.862720193 | 0.034 |
| 04/19/2024 08:46:46.879496981 | 0.034 |
| 04/19/2024 08:46:47.896281829 | 0.034 |
| 04/19/2024 08:46:48.913060920 | 0.034 |
| 04/19/2024 08:46:49.929838193 | 0.034 |
| 04/19/2024 08:46:50.946622284 | 0.034 |
| 04/19/2024 08:46:51.963401890 | 0.034 |
| 04/19/2024 08:46:52.980174799 | 0.034 |
| 04/19/2024 08:46:53.996957102 | 0.034 |
| 04/19/2024 08:46:55.013741284 | 0.033 |
| 04/19/2024 08:46:56.030520041 | 0.033 |
| 04/19/2024 08:46:57.047304071 | 0.033 |
| 04/19/2024 08:46:58.064077556 | 0.033 |
| 04/19/2024 08:46:59.080851374 | 0.033 |
| 04/19/2024 08:47:00.097634526 | 0.033 |
| 04/19/2024 08:47:01.114406465 | 0.033 |
| 04/19/2024 08:47:02.131184981 | 0.033 |
| 04/19/2024 08:47:03.147959768 | 0.033 |
| 04/19/2024 08:47:04.164739890 | 0.033 |
| 04/19/2024 08:47:05.181518981 | 0.033 |
| 04/19/2024 08:47:06.198294496 | 0.033 |
| 04/19/2024 08:47:07.215073618 | 0.033 |
| 04/19/2024 08:47:08.231855163 | 0.033 |
| 04/19/2024 08:47:09.248631254 | 0.033 |
| 04/19/2024 08:47:10.265421375 | 0.033 |
| 04/19/2024 08:47:11.282198769 | 0.033 |
| 04/19/2024 08:47:12.298979042 | 0.033 |
| 04/19/2024 08:47:13.315763466 | 0.033 |
| 04/19/2024 08:47:14.332535284 | 0.033 |
| 04/19/2024 08:47:15.349312224 | 0.033 |
| 04/19/2024 08:47:16.366084981 | 0.033 |
| 04/19/2024 08:47:17.382859921 | 0.033 |
| 04/19/2024 08:47:18.399644072 | 0.033 |
| 04/19/2024 08:47:19.416427496 | 0.033 |
| 04/19/2024 08:47:20.433208769 | 0.033 |
| 04/19/2024 08:47:21.449987163 | 0.033 |
| 04/19/2024 08:47:22.466768133 | 0.033 |
| 04/19/2024 08:47:23.483555678 | 0.033 |
| 04/19/2024 08:47:24.500338163 | 0.033 |
| 04/19/2024 08:47:25.517121921 | 0.032 |
| 04/19/2024 08:47:26.533901557 | 0.032 |
| 04/19/2024 08:47:27.550684254 | 0.032 |
| 04/19/2024 08:47:28.567465951 | 0.032 |
| 04/19/2024 08:47:29.584237527 | 0.032 |
| 04/19/2024 08:47:30.601018284 | 0.032 |
| 04/19/2024 08:47:31.617803587 | 0.032 |
| 04/19/2024 08:47:32.634580527 | 0.032 |
| 04/19/2024 08:47:33.651364769 | 0.032 |
| 04/19/2024 08:47:34.668134708 | 0.032 |
| 04/19/2024 08:47:35.684913496 | 0.032 |
| 04/19/2024 08:47:36.701698618 | 0.032 |
| 04/19/2024 08:47:37.718475375 | 0.032 |
| 04/19/2024 08:47:38.735258163 | 0.032 |
| 04/19/2024 08:47:39.752032496 | 0.032 |
| 04/19/2024 08:47:40.768807405 | 0.032 |
| 04/19/2024 08:47:41.785587830 | 0.032 |
| 04/19/2024 08:47:42.802368799 | 0.032 |
| 04/19/2024 08:47:43.819145739 | 0.032 |
| 04/19/2024 08:47:44.835925921 | 0.032 |
| 04/19/2024 08:47:45.852705254 | 0.032 |
| 04/19/2024 08:47:46.869483557 | 0.032 |
| 04/19/2024 08:47:47.886254860 | 0.032 |
| 04/19/2024 08:47:48.903039102 | 0.032 |
| 04/19/2024 08:47:49.919816769 | 0.032 |
| 04/19/2024 08:47:50.936596769 | 0.032 |
| 04/19/2024 08:47:51.953377860 | 0.032 |
| 04/19/2024 08:47:52.970151072 | 0.032 |
| 04/19/2024 08:47:53.986930466 | 0.032 |
| 04/19/2024 08:47:55.003711618 | 0.032 |
| 04/19/2024 08:47:56.020491769 | 0.032 |
| 04/19/2024 08:47:57.037271678 | 0.032 |
| 04/19/2024 08:47:58.054046739 | 0.032 |
| 04/19/2024 08:47:59.070823254 | 0.031 |
| 04/19/2024 08:48:00.087601951 | 0.031 |
| 04/19/2024 08:48:01.104379345 | 0.031 |
| 04/19/2024 08:48:02.121155799 | 0.031 |
| 04/19/2024 08:48:03.137938345 | 0.031 |
| 04/19/2024 08:48:04.154721315 | 0.031 |
| 04/19/2024 08:48:05.171501662 | 0.031 |
| 04/19/2024 08:48:06.188276087 | 0.031 |
| 04/19/2024 08:48:07.205058056 | 0.031 |
| 04/19/2024 08:48:08.221837572 | 0.031 |
| 04/19/2024 08:48:09.238611814 | 0.031 |
| 04/19/2024 08:48:10.255396935 | 0.031 |
| 04/19/2024 08:48:11.272168662 | 0.031 |
| 04/19/2024 08:48:12.288943602 | 0.031 |
| 04/19/2024 08:48:13.305725662 | 0.031 |
| 04/19/2024 08:48:14.322497450 | 0.031 |
| 04/19/2024 08:48:15.339270390 | 0.031 |
| 04/19/2024 08:48:16.356043087 | 0.031 |
| 04/19/2024 08:48:17.372817905 | 0.031 |
| 04/19/2024 08:48:18.389594875 | 0.031 |
| 04/19/2024 08:48:19.406383268 | 0.031 |
| 04/19/2024 08:48:20.423163329 | 0.031 |
| 04/19/2024 08:48:21.439943390 | 0.031 |
| 04/19/2024 08:48:22.456723693 | 0.031 |
| 04/19/2024 08:48:23.473508905 | 0.031 |
| 04/19/2024 08:48:24.490284329 | 0.031 |
| 04/19/2024 08:48:25.507067965 | 0.031 |
| 04/19/2024 08:48:26.523849602 | 0.031 |
| 04/19/2024 08:48:27.540626238 | 0.031 |
| 04/19/2024 08:48:28.557407390 | 0.031 |
| 04/19/2024 08:48:29.574177450 | 0.031 |
| 04/19/2024 08:48:30.590954662 | 0.031 |
| 04/19/2024 08:48:31.607744572 | 0.031 |
| 04/19/2024 08:48:32.624519632 | 0.03 |
| 04/19/2024 08:48:33.641295450 | 0.03 |
| 04/19/2024 08:48:34.658075056 | 0.03 |
| 04/19/2024 08:48:35.674851072 | 0.03 |
| 04/19/2024 08:48:36.691632254 | 0.03 |
| 04/19/2024 08:48:37.708411345 | 0.03 |
| 04/19/2024 08:48:38.725192193 | 0.03 |
| 04/19/2024 08:48:39.741979890 | 0.03 |
| 04/19/2024 08:48:40.758755193 | 0.03 |
| 04/19/2024 08:48:41.775539617 | 0.03 |
| 04/19/2024 08:48:42.792318102 | 0.03 |
| 04/19/2024 08:48:43.809094739 | 0.03 |
| 04/19/2024 08:48:44.825877557 | 0.03 |
| 04/19/2024 08:48:45.842652223 | 0.03 |
| 04/19/2024 08:48:46.859429557 | 0.03 |
| 04/19/2024 08:48:47.876199375 | 0.03 |
| 04/19/2024 08:48:48.892977435 | 0.03 |
| 04/19/2024 08:48:49.909763678 | 0.03 |
| 04/19/2024 08:48:50.926543223 | 0.03 |
| 04/19/2024 08:48:51.943328072 | 0.03 |
| 04/19/2024 08:48:52.960103193 | 0.03 |
| 04/19/2024 08:48:53.976884799 | 0.03 |
| 04/19/2024 08:48:54.993669526 | 0.03 |
| 04/19/2024 08:48:56.010448011 | 0.03 |
| 04/19/2024 08:48:57.027228526 | 0.03 |
| 04/19/2024 08:48:58.044016223 | 0.03 |
| 04/19/2024 08:48:59.060795587 | 0.03 |
| 04/19/2024 08:49:00.077580981 | 0.03 |
| 04/19/2024 08:49:01.094361163 | 0.03 |
| 04/19/2024 08:49:02.111141617 | 0.03 |
| 04/19/2024 08:49:03.127924678 | 0.03 |
| 04/19/2024 08:49:04.144706557 | 0.03 |
| 04/19/2024 08:49:05.161485360 | 0.03 |
| 04/19/2024 08:49:06.178261148 | 0.03 |
| 04/19/2024 08:49:07.195043875 | 0.029 |
| 04/19/2024 08:49:08.211824996 | 0.029 |
| 04/19/2024 08:49:09.228603875 | 0.029 |
| 04/19/2024 08:49:10.245391572 | 0.029 |
| 04/19/2024 08:49:11.262161572 | 0.029 |
| 04/19/2024 08:49:12.278937330 | 0.029 |
| 04/19/2024 08:49:13.295723754 | 0.029 |
| 04/19/2024 08:49:14.312498572 | 0.029 |
| 04/19/2024 08:49:15.329274148 | 0.029 |
| 04/19/2024 08:49:16.346045784 | 0.029 |
| 04/19/2024 08:49:17.362821208 | 0.029 |
| 04/19/2024 08:49:18.379593996 | 0.029 |
| 04/19/2024 08:49:19.396376511 | 0.029 |
| 04/19/2024 08:49:20.413154208 | 0.029 |
| 04/19/2024 08:49:21.429937633 | 0.029 |
| 04/19/2024 08:49:22.446722057 | 0.029 |
| 04/19/2024 08:49:23.463505330 | 0.029 |
| 04/19/2024 08:49:24.480275117 | 0.029 |
| 04/19/2024 08:49:25.497059542 | 0.029 |
| 04/19/2024 08:49:26.513844754 | 0.029 |
| 04/19/2024 08:49:27.530624178 | 0.029 |
| 04/19/2024 08:49:28.547404178 | 0.029 |
| 04/19/2024 08:49:29.564174966 | 0.029 |
| 04/19/2024 08:49:30.580951420 | 0.029 |
| 04/19/2024 08:49:31.597738784 | 0.029 |
| 04/19/2024 08:49:32.614516936 | 0.029 |
| 04/19/2024 08:49:33.631297148 | 0.029 |
| 04/19/2024 08:49:34.648082239 | 0.029 |
| 04/19/2024 08:49:35.664859421 | 0.029 |
| 04/19/2024 08:49:36.681641330 | 0.029 |
| 04/19/2024 08:49:37.698421542 | 0.029 |
| 04/19/2024 08:49:38.715201542 | 0.029 |
| 04/19/2024 08:49:39.731982542 | 0.029 |
| 04/19/2024 08:49:40.748761511 | 0.029 |
| 04/19/2024 08:49:41.765544602 | 0.029 |
| 04/19/2024 08:49:42.782316239 | 0.028 |
| 04/19/2024 08:49:43.799095754 | 0.028 |
| 04/19/2024 08:49:44.815875511 | 0.028 |
| 04/19/2024 08:49:45.832651299 | 0.028 |
| 04/19/2024 08:49:46.849426966 | 0.028 |
| 04/19/2024 08:49:47.866201390 | 0.028 |
| 04/19/2024 08:49:48.882974542 | 0.028 |
| 04/19/2024 08:49:49.899756239 | 0.028 |
| 04/19/2024 08:49:50.916529784 | 0.028 |
| 04/19/2024 08:49:51.933311269 | 0.028 |
| 04/19/2024 08:49:52.950096663 | 0.028 |
| 04/19/2024 08:49:53.966876724 | 0.028 |
| 04/19/2024 08:49:54.983657481 | 0.028 |
| 04/19/2024 08:49:56.000433875 | 0.028 |
| 04/19/2024 08:49:57.017217663 | 0.028 |
| 04/19/2024 08:49:58.033998360 | 0.028 |
| 04/19/2024 08:49:59.050777299 | 0.028 |
| 04/19/2024 08:50:00.067557875 | 0.028 |
| 04/19/2024 08:50:01.084331663 | 0.028 |
| 04/19/2024 08:50:02.101110239 | 0.028 |
| 04/19/2024 08:50:03.117889724 | 0.028 |
| 04/19/2024 08:50:04.134668814 | 0.028 |
| 04/19/2024 08:50:05.151450132 | 0.028 |
| 04/19/2024 08:50:06.168220163 | 0.028 |
| 04/19/2024 08:50:07.185004253 | 0.028 |
| 04/19/2024 08:50:08.201788375 | 0.028 |
| 04/19/2024 08:50:09.218562466 | 0.028 |
| 04/19/2024 08:50:10.235340769 | 0.028 |
| 04/19/2024 08:50:11.252126041 | 0.028 |
| 04/19/2024 08:50:12.268899344 | 0.028 |
| 04/19/2024 08:50:13.285681253 | 0.028 |
| 04/19/2024 08:50:14.302456799 | 0.028 |
| 04/19/2024 08:50:15.319233375 | 0.028 |
| 04/19/2024 08:50:16.336016102 | 0.028 |
| 04/19/2024 08:50:17.352791708 | 0.028 |
| 04/19/2024 08:50:18.369563466 | 0.028 |
| 04/19/2024 08:50:19.386338647 | 0.028 |
| 04/19/2024 08:50:20.403120072 | 0.027 |
| 04/19/2024 08:50:21.419898193 | 0.027 |
| 04/19/2024 08:50:22.436679253 | 0.027 |
| 04/19/2024 08:50:23.453464617 | 0.027 |
| 04/19/2024 08:50:24.470252678 | 0.027 |
| 04/19/2024 08:50:25.487030617 | 0.027 |
| 04/19/2024 08:50:26.503814253 | 0.027 |
| 04/19/2024 08:50:27.520594435 | 0.027 |
| 04/19/2024 08:50:28.537377556 | 0.027 |
| 04/19/2024 08:50:29.554159193 | 0.027 |
| 04/19/2024 08:50:30.570936041 | 0.027 |
| 04/19/2024 08:50:31.587719860 | 0.027 |
| 04/19/2024 08:50:32.604497617 | 0.027 |
| 04/19/2024 08:50:33.621273253 | 0.027 |
| 04/19/2024 08:50:34.638055132 | 0.027 |
| 04/19/2024 08:50:35.654832845 | 0.027 |
| 04/19/2024 08:50:36.671609724 | 0.027 |
| 04/19/2024 08:50:37.688392360 | 0.027 |
| 04/19/2024 08:50:38.705172542 | 0.027 |
| 04/19/2024 08:50:39.721957390 | 0.027 |
| 04/19/2024 08:50:40.738733208 | 0.027 |
| 04/19/2024 08:50:41.755514421 | 0.027 |
| 04/19/2024 08:50:42.772295815 | 0.027 |
| 04/19/2024 08:50:43.789074693 | 0.027 |
| 04/19/2024 08:50:44.805857936 | 0.027 |
| 04/19/2024 08:50:45.822632239 | 0.027 |
| 04/19/2024 08:50:46.839410875 | 0.027 |
| 04/19/2024 08:50:47.856193512 | 0.027 |
| 04/19/2024 08:50:48.872968512 | 0.027 |
| 04/19/2024 08:50:49.889745027 | 0.027 |
| 04/19/2024 08:50:50.906519754 | 0.027 |
| 04/19/2024 08:50:51.923295087 | 0.027 |
| 04/19/2024 08:50:52.940080966 | 0.027 |
| 04/19/2024 08:50:53.956858663 | 0.027 |
| 04/19/2024 08:50:54.973640845 | 0.027 |
| 04/19/2024 08:50:55.990418784 | 0.027 |
| 04/19/2024 08:50:57.007201118 | 0.027 |
| 04/19/2024 08:50:58.023982421 | 0.027 |
| 04/19/2024 08:50:59.040753633 | 0.027 |
| 04/19/2024 08:51:00.057536724 | 0.026 |
| 04/19/2024 08:51:01.074322057 | 0.026 |
| 04/19/2024 08:51:02.091099693 | 0.026 |
| 04/19/2024 08:51:03.107880663 | 0.026 |
| 04/19/2024 08:51:04.124650996 | 0.026 |
| 04/19/2024 08:51:05.141436193 | 0.026 |
| 04/19/2024 08:51:06.158219163 | 0.026 |
| 04/19/2024 08:51:07.174990103 | 0.026 |
| 04/19/2024 08:51:08.191778648 | 0.026 |
| 04/19/2024 08:51:09.208553830 | 0.026 |
| 04/19/2024 08:51:10.225335587 | 0.026 |
| 04/19/2024 08:51:11.242117163 | 0.026 |
| 04/19/2024 08:51:12.258891254 | 0.026 |
| 04/19/2024 08:51:13.275674436 | 0.026 |
| 04/19/2024 08:51:14.292450072 | 0.026 |
| 04/19/2024 08:51:15.309224921 | 0.026 |
| 04/19/2024 08:51:16.326006466 | 0.026 |
| 04/19/2024 08:51:17.342779436 | 0.026 |
| 04/19/2024 08:51:18.359552224 | 0.026 |
| 04/19/2024 08:51:19.376327284 | 0.026 |
| 04/19/2024 08:51:20.393104830 | 0.026 |
| 04/19/2024 08:51:21.409883224 | 0.026 |
| 04/19/2024 08:51:22.426658951 | 0.026 |
| 04/19/2024 08:51:23.443449375 | 0.026 |
| 04/19/2024 08:51:24.460238527 | 0.026 |
| 04/19/2024 08:51:25.477018527 | 0.026 |
| 04/19/2024 08:51:26.493801618 | 0.026 |
| 04/19/2024 08:51:27.510581284 | 0.026 |
| 04/19/2024 08:51:28.527363587 | 0.026 |
| 04/19/2024 08:51:29.544149739 | 0.026 |
| 04/19/2024 08:51:30.560924193 | 0.026 |
| 04/19/2024 08:51:31.577708345 | 0.026 |
| 04/19/2024 08:51:32.594487799 | 0.026 |
| 04/19/2024 08:51:33.611268103 | 0.026 |
| 04/19/2024 08:51:34.628048678 | 0.026 |
| 04/19/2024 08:51:35.644825178 | 0.026 |
| 04/19/2024 08:51:36.661601936 | 0.026 |
| 04/19/2024 08:51:37.678381905 | 0.026 |
| 04/19/2024 08:51:38.695168633 | 0.026 |
| 04/19/2024 08:51:39.711949178 | 0.026 |
| 04/19/2024 08:51:40.728725451 | 0.025 |
| 04/19/2024 08:51:41.745509814 | 0.025 |
| 04/19/2024 08:51:42.762293996 | 0.025 |
| 04/19/2024 08:51:43.779069875 | 0.025 |
| 04/19/2024 08:51:44.795853330 | 0.025 |
| 04/19/2024 08:51:45.812628754 | 0.025 |
| 04/19/2024 08:51:46.829414299 | 0.025 |
| 04/19/2024 08:51:47.846200784 | 0.025 |
| 04/19/2024 08:51:48.862971966 | 0.025 |
| 04/19/2024 08:51:49.879749420 | 0.025 |
| 04/19/2024 08:51:50.896530784 | 0.025 |
| 04/19/2024 08:51:51.913306602 | 0.025 |
| 04/19/2024 08:51:52.930087481 | 0.025 |
| 04/19/2024 08:51:53.946873117 | 0.025 |
| 04/19/2024 08:51:54.963649208 | 0.025 |
| 04/19/2024 08:51:55.980429299 | 0.025 |
| 04/19/2024 08:51:56.997213875 | 0.025 |
| 04/19/2024 08:51:58.013992057 | 0.025 |
| 04/19/2024 08:51:59.030764178 | 0.025 |
| 04/19/2024 08:52:00.047549542 | 0.025 |
| 04/19/2024 08:52:01.064333784 | 0.025 |
| 04/19/2024 08:52:02.081106269 | 0.025 |
| 04/19/2024 08:52:03.097888390 | 0.025 |
| 04/19/2024 08:52:04.114660390 | 0.025 |
| 04/19/2024 08:52:05.131437769 | 0.025 |
| 04/19/2024 08:52:06.148220981 | 0.025 |
| 04/19/2024 08:52:07.164993830 | 0.025 |
| 04/19/2024 08:52:08.181766557 | 0.025 |
| 04/19/2024 08:52:09.198555102 | 0.025 |
| 04/19/2024 08:52:10.215334436 | 0.025 |
| 04/19/2024 08:52:11.232115193 | 0.025 |
| 04/19/2024 08:52:12.248889314 | 0.025 |
| 04/19/2024 08:52:13.265671254 | 0.025 |
| 04/19/2024 08:52:14.282454617 | 0.025 |
| 04/19/2024 08:52:15.299234769 | 0.025 |
| 04/19/2024 08:52:16.316014072 | 0.025 |
| 04/19/2024 08:52:17.332786345 | 0.025 |
| 04/19/2024 08:52:18.349559436 | 0.025 |
| 04/19/2024 08:52:19.366330133 | 0.025 |
| 04/19/2024 08:52:20.383101102 | 0.025 |
| 04/19/2024 08:52:21.399882496 | 0.025 |
| 04/19/2024 08:52:22.416659739 | 0.025 |
| 04/19/2024 08:52:23.433435921 | 0.024 |
| 04/19/2024 08:52:24.450230011 | 0.024 |
| 04/19/2024 08:52:25.467007375 | 0.024 |
| 04/19/2024 08:52:26.483785830 | 0.024 |
| 04/19/2024 08:52:27.500567951 | 0.024 |
| 04/19/2024 08:52:28.517348799 | 0.024 |
| 04/19/2024 08:52:29.534130436 | 0.024 |
| 04/19/2024 08:52:30.550904193 | 0.024 |
| 04/19/2024 08:52:31.567685678 | 0.024 |
| 04/19/2024 08:52:32.584468617 | 0.024 |
| 04/19/2024 08:52:33.601246860 | 0.024 |
| 04/19/2024 08:52:34.618026921 | 0.024 |
| 04/19/2024 08:52:35.634798057 | 0.024 |
| 04/19/2024 08:52:36.651573269 | 0.024 |
| 04/19/2024 08:52:37.668356360 | 0.024 |
| 04/19/2024 08:52:38.685130451 | 0.024 |
| 04/19/2024 08:52:39.701914724 | 0.024 |
| 04/19/2024 08:52:40.718689845 | 0.024 |
| 04/19/2024 08:52:41.735470390 | 0.024 |
| 04/19/2024 08:52:42.752255390 | 0.024 |
| 04/19/2024 08:52:43.769029208 | 0.024 |
| 04/19/2024 08:52:44.785812845 | 0.024 |
| 04/19/2024 08:52:45.802592724 | 0.024 |
| 04/19/2024 08:52:46.819367390 | 0.024 |
| 04/19/2024 08:52:47.836147148 | 0.024 |
| 04/19/2024 08:52:48.852924966 | 0.024 |
| 04/19/2024 08:52:49.869701754 | 0.024 |
| 04/19/2024 08:52:50.886485269 | 0.024 |
| 04/19/2024 08:52:51.903262693 | 0.024 |
| 04/19/2024 08:52:52.920057117 | 0.024 |
| 04/19/2024 08:52:53.936829996 | 0.024 |
| 04/19/2024 08:52:54.953606057 | 0.024 |
| 04/19/2024 08:52:55.970386693 | 0.024 |
| 04/19/2024 08:52:56.987165875 | 0.024 |
| 04/19/2024 08:52:58.003946057 | 0.024 |
| 04/19/2024 08:52:59.020719784 | 0.024 |
| 04/19/2024 08:53:00.037501027 | 0.024 |
| 04/19/2024 08:53:01.054283299 | 0.024 |
| 04/19/2024 08:53:02.071055451 | 0.024 |
| 04/19/2024 08:53:03.087836996 | 0.024 |
| 04/19/2024 08:53:04.104607481 | 0.024 |
| 04/19/2024 08:53:05.121383966 | 0.024 |
| 04/19/2024 08:53:06.138162905 | 0.024 |
| 04/19/2024 08:53:07.154935875 | 0.024 |
| 04/19/2024 08:53:08.171713330 | 0.023 |
| 04/19/2024 08:53:09.188492602 | 0.023 |
| 04/19/2024 08:53:10.205271330 | 0.023 |
| 04/19/2024 08:53:11.222051542 | 0.023 |
| 04/19/2024 08:53:12.238826754 | 0.023 |
| 04/19/2024 08:53:13.255606269 | 0.023 |
| 04/19/2024 08:53:14.272386905 | 0.023 |
| 04/19/2024 08:53:15.289163602 | 0.023 |
| 04/19/2024 08:53:16.305946057 | 0.023 |
| 04/19/2024 08:53:17.322720421 | 0.023 |
| 04/19/2024 08:53:18.339495905 | 0.023 |
| 04/19/2024 08:53:19.356266299 | 0.023 |
| 04/19/2024 08:53:20.373035875 | 0.023 |
| 04/19/2024 08:53:21.389812451 | 0.023 |
| 04/19/2024 08:53:22.406587784 | 0.023 |
| 04/19/2024 08:53:23.423367663 | 0.023 |
| 04/19/2024 08:53:24.440141451 | 0.023 |
| 04/19/2024 08:53:25.456914936 | 0.023 |
| 04/19/2024 08:53:26.473697208 | 0.023 |
| 04/19/2024 08:53:27.490483208 | 0.023 |
| 04/19/2024 08:53:28.507263602 | 0.023 |
| 04/19/2024 08:53:29.524048299 | 0.023 |
| 04/19/2024 08:53:30.540822117 | 0.023 |
| 04/19/2024 08:53:31.557607814 | 0.023 |
| 04/19/2024 08:53:32.574391875 | 0.023 |
| 04/19/2024 08:53:33.591171784 | 0.023 |
| 04/19/2024 08:53:34.607959451 | 0.023 |
| 04/19/2024 08:53:35.624733162 | 0.023 |
| 04/19/2024 08:53:36.641508344 | 0.023 |
| 04/19/2024 08:53:37.658295223 | 0.023 |
| 04/19/2024 08:53:38.675082980 | 0.023 |
| 04/19/2024 08:53:39.691861738 | 0.023 |
| 04/19/2024 08:53:40.708638647 | 0.023 |
| 04/19/2024 08:53:41.725421829 | 0.023 |
| 04/19/2024 08:53:42.742205253 | 0.023 |
| 04/19/2024 08:53:43.758986041 | 0.023 |
| 04/19/2024 08:53:44.775767799 | 0.023 |
| 04/19/2024 08:53:45.792551708 | 0.023 |
| 04/19/2024 08:53:46.809329556 | 0.023 |
| 04/19/2024 08:53:47.826109011 | 0.023 |
| 04/19/2024 08:53:48.842879556 | 0.023 |
| 04/19/2024 08:53:49.859662314 | 0.023 |
| 04/19/2024 08:53:50.876443011 | 0.023 |
| 04/19/2024 08:53:51.893220586 | 0.023 |
| 04/19/2024 08:53:52.910008344 | 0.023 |
| 04/19/2024 08:53:53.926782586 | 0.023 |
| 04/19/2024 08:53:54.943564647 | 0.022 |
| 04/19/2024 08:53:55.960347223 | 0.022 |
| 04/19/2024 08:53:56.977132283 | 0.022 |
| 04/19/2024 08:53:57.993918496 | 0.022 |
| 04/19/2024 08:53:59.010692011 | 0.022 |
| 04/19/2024 08:54:00.027476132 | 0.022 |
| 04/19/2024 08:54:01.044262465 | 0.022 |
| 04/19/2024 08:54:02.061038465 | 0.022 |
| 04/19/2024 08:54:03.077818132 | 0.022 |
| 04/19/2024 08:54:04.094599799 | 0.022 |
| 04/19/2024 08:54:05.111378451 | 0.022 |
| 04/19/2024 08:54:06.128160329 | 0.022 |
| 04/19/2024 08:54:07.144935238 | 0.022 |
| 04/19/2024 08:54:08.161710784 | 0.022 |
| 04/19/2024 08:54:09.178490632 | 0.022 |
| 04/19/2024 08:54:10.195266329 | 0.022 |
| 04/19/2024 08:54:11.212046784 | 0.022 |
| 04/19/2024 08:54:12.228826663 | 0.022 |
| 04/19/2024 08:54:13.245605451 | 0.022 |
| 04/19/2024 08:54:14.262383905 | 0.022 |
| 04/19/2024 08:54:15.279164420 | 0.022 |
| 04/19/2024 08:54:16.295950784 | 0.022 |
| 04/19/2024 08:54:17.312725845 | 0.022 |
| 04/19/2024 08:54:18.329510602 | 0.022 |
| 04/19/2024 08:54:19.346294087 | 0.022 |
| 04/19/2024 08:54:20.363070299 | 0.022 |
| 04/19/2024 08:54:21.379843481 | 0.022 |
| 04/19/2024 08:54:22.396620511 | 0.022 |
| 04/19/2024 08:54:23.413400814 | 0.022 |
| 04/19/2024 08:54:24.430182481 | 0.022 |
| 04/19/2024 08:54:25.446959572 | 0.022 |
| 04/19/2024 08:54:26.463733329 | 0.022 |
| 04/19/2024 08:54:27.480521905 | 0.022 |
| 04/19/2024 08:54:28.497307845 | 0.022 |
| 04/19/2024 08:54:29.514088420 | 0.022 |
| 04/19/2024 08:54:30.530857935 | 0.022 |
| 04/19/2024 08:54:31.547646117 | 0.022 |
| 04/19/2024 08:54:32.564431299 | 0.022 |
| 04/19/2024 08:54:33.581205966 | 0.022 |
| 04/19/2024 08:54:34.597990632 | 0.022 |
| 04/19/2024 08:54:35.614761329 | 0.022 |
| 04/19/2024 08:54:36.631538148 | 0.022 |
| 04/19/2024 08:54:37.648321542 | 0.022 |
| 04/19/2024 08:54:38.665097026 | 0.022 |
| 04/19/2024 08:54:39.681872026 | 0.022 |
| 04/19/2024 08:54:40.698655117 | 0.022 |
| 04/19/2024 08:54:41.715434632 | 0.022 |
| 04/19/2024 08:54:42.732215299 | 0.022 |
| 04/19/2024 08:54:43.748997420 | 0.022 |
| 04/19/2024 08:54:44.765778026 | 0.021 |
| 04/19/2024 08:54:45.782559026 | 0.021 |
| 04/19/2024 08:54:46.799343238 | 0.021 |
| 04/19/2024 08:54:47.816124784 | 0.021 |
| 04/19/2024 08:54:48.832896693 | 0.021 |
| 04/19/2024 08:54:49.849682754 | 0.021 |
| 04/19/2024 08:54:50.866462784 | 0.021 |
| 04/19/2024 08:54:51.883237451 | 0.021 |
| 04/19/2024 08:54:52.900023754 | 0.021 |
| 04/19/2024 08:54:53.916798996 | 0.021 |
| 04/19/2024 08:54:54.933574451 | 0.021 |
| 04/19/2024 08:54:55.950364511 | 0.021 |
| 04/19/2024 08:54:56.967139784 | 0.021 |
| 04/19/2024 08:54:57.983924754 | 0.021 |
| 04/19/2024 08:54:59.000706996 | 0.021 |
| 04/19/2024 08:55:00.017487329 | 0.021 |
| 04/19/2024 08:55:01.034267572 | 0.021 |
| 04/19/2024 08:55:02.051040663 | 0.021 |
| 04/19/2024 08:55:03.067820632 | 0.021 |
| 04/19/2024 08:55:04.084601754 | 0.021 |
| 04/19/2024 08:55:05.101380633 | 0.021 |
| 04/19/2024 08:55:06.118159845 | 0.021 |
| 04/19/2024 08:55:07.134931087 | 0.021 |
| 04/19/2024 08:55:08.151707057 | 0.021 |
| 04/19/2024 08:55:09.168487754 | 0.021 |
| 04/19/2024 08:55:10.185259451 | 0.021 |
| 04/19/2024 08:55:11.202035269 | 0.021 |
| 04/19/2024 08:55:12.218810875 | 0.021 |
| 04/19/2024 08:55:13.235591572 | 0.021 |
| 04/19/2024 08:55:14.252372208 | 0.021 |
| 04/19/2024 08:55:15.269153390 | 0.021 |
| 04/19/2024 08:55:16.285934269 | 0.021 |
| 04/19/2024 08:55:17.302719208 | 0.021 |
| 04/19/2024 08:55:18.319497057 | 0.021 |
| 04/19/2024 08:55:19.336279875 | 0.021 |
| 04/19/2024 08:55:20.353058511 | 0.021 |
| 04/19/2024 08:55:21.369829390 | 0.021 |
| 04/19/2024 08:55:22.386600845 | 0.021 |
| 04/19/2024 08:55:23.403379118 | 0.021 |
| 04/19/2024 08:55:24.420154572 | 0.021 |
| 04/19/2024 08:55:25.436928784 | 0.021 |
| 04/19/2024 08:55:26.453708148 | 0.021 |
| 04/19/2024 08:55:27.470482784 | 0.021 |
| 04/19/2024 08:55:28.487266633 | 0.021 |
| 04/19/2024 08:55:29.504046754 | 0.021 |
| 04/19/2024 08:55:30.520816936 | 0.021 |
| 04/19/2024 08:55:31.537602875 | 0.021 |
| 04/19/2024 08:55:32.554384451 | 0.02 |
| 04/19/2024 08:55:33.571154784 | 0.02 |
| 04/19/2024 08:55:34.587936693 | 0.02 |
| 04/19/2024 08:55:35.604720360 | 0.02 |
| 04/19/2024 08:55:36.621496208 | 0.02 |
| 04/19/2024 08:55:37.638282723 | 0.02 |
| 04/19/2024 08:55:38.655062905 | 0.02 |
| 04/19/2024 08:55:39.671837451 | 0.02 |
| 04/19/2024 08:55:40.688619935 | 0.02 |
| 04/19/2024 08:55:41.705396087 | 0.02 |
| 04/19/2024 08:55:42.722176602 | 0.02 |
| 04/19/2024 08:55:43.738957966 | 0.02 |
| 04/19/2024 08:55:44.755737875 | 0.02 |
| 04/19/2024 08:55:45.772518087 | 0.02 |
| 04/19/2024 08:55:46.789301784 | 0.02 |
| 04/19/2024 08:55:47.806083754 | 0.02 |
| 04/19/2024 08:55:48.822857663 | 0.02 |
| 04/19/2024 08:55:49.839641935 | 0.02 |
| 04/19/2024 08:55:50.856422329 | 0.02 |
| 04/19/2024 08:55:51.873195602 | 0.02 |
| 04/19/2024 08:55:52.889977208 | 0.02 |
| 04/19/2024 08:55:53.906762178 | 0.02 |
| 04/19/2024 08:55:54.923536057 | 0.02 |
| 04/19/2024 08:55:55.940318208 | 0.02 |
| 04/19/2024 08:55:56.957095845 | 0.02 |
| 04/19/2024 08:55:57.973870966 | 0.02 |
| 04/19/2024 08:55:58.990657238 | 0.02 |
| 04/19/2024 08:56:00.007441208 | 0.02 |
| 04/19/2024 08:56:01.024224693 | 0.02 |
| 04/19/2024 08:56:02.040997117 | 0.02 |
| 04/19/2024 08:56:03.057782602 | 0.02 |
| 04/19/2024 08:56:04.074564663 | 0.02 |
| 04/19/2024 08:56:05.091342087 | 0.02 |
| 04/19/2024 08:56:06.108128299 | 0.02 |
| 04/19/2024 08:56:07.124901572 | 0.02 |
| 04/19/2024 08:56:08.141677966 | 0.02 |
| 04/19/2024 08:56:09.158461178 | 0.02 |
| 04/19/2024 08:56:10.175234542 | 0.02 |
| 04/19/2024 08:56:11.192011723 | 0.02 |
| 04/19/2024 08:56:12.208796360 | 0.02 |
| 04/19/2024 08:56:13.225574299 | 0.02 |
| 04/19/2024 08:56:14.242357814 | 0.02 |
| 04/19/2024 08:56:15.259138663 | 0.02 |
| 04/19/2024 08:56:16.275920572 | 0.02 |
| 04/19/2024 08:56:17.292702057 | 0.02 |
| 04/19/2024 08:56:18.309485087 | 0.02 |
| 04/19/2024 08:56:19.326268814 | 0.02 |
| 04/19/2024 08:56:20.343043845 | 0.02 |
| 04/19/2024 08:56:21.359820996 | 0.02 |
| 04/19/2024 08:56:22.376600602 | 0.02 |
| 04/19/2024 08:56:23.393384239 | 0.02 |
| 04/19/2024 08:56:24.410165936 | 0.02 |
| 04/19/2024 08:56:25.426943087 | 0.02 |
| 04/19/2024 08:56:26.443722360 | 0.02 |
| 04/19/2024 08:56:27.460496905 | 0.019 |
| 04/19/2024 08:56:28.477266360 | 0.019 |
| 04/19/2024 08:56:29.494057451 | 0.019 |
| 04/19/2024 08:56:30.510835693 | 0.019 |
| 04/19/2024 08:56:31.527618360 | 0.019 |
| 04/19/2024 08:56:32.544401420 | 0.019 |
| 04/19/2024 08:56:33.561175542 | 0.019 |
| 04/19/2024 08:56:34.577955117 | 0.019 |
| 04/19/2024 08:56:35.594744254 | 0.019 |
| 04/19/2024 08:56:36.611520102 | 0.019 |
| 04/19/2024 08:56:37.628300405 | 0.019 |
| 04/19/2024 08:56:38.645073284 | 0.019 |
| 04/19/2024 08:56:39.661850011 | 0.019 |
| 04/19/2024 08:56:40.678635102 | 0.019 |
| 04/19/2024 08:56:41.695415193 | 0.019 |
| 04/19/2024 08:56:42.712189587 | 0.019 |
| 04/19/2024 08:56:43.728960981 | 0.019 |
| 04/19/2024 08:56:44.745747466 | 0.019 |
| 04/19/2024 08:56:45.762529617 | 0.019 |
| 04/19/2024 08:56:46.779311617 | 0.019 |
| 04/19/2024 08:56:47.796096193 | 0.019 |
| 04/19/2024 08:56:48.812875981 | 0.019 |
| 04/19/2024 08:56:49.829655829 | 0.019 |
| 04/19/2024 08:56:50.846437920 | 0.019 |
| 04/19/2024 08:56:51.863214557 | 0.019 |
| 04/19/2024 08:56:52.879996678 | 0.019 |
| 04/19/2024 08:56:53.896778920 | 0.019 |
| 04/19/2024 08:56:54.913553072 | 0.019 |
| 04/19/2024 08:56:55.930338193 | 0.019 |
| 04/19/2024 08:56:56.947114193 | 0.019 |
| 04/19/2024 08:56:57.963887435 | 0.019 |
| 04/19/2024 08:56:58.980668375 | 0.019 |
| 04/19/2024 08:56:59.997451617 | 0.019 |
| 04/19/2024 08:57:01.014231981 | 0.019 |
| 04/19/2024 08:57:02.031004072 | 0.019 |
| 04/19/2024 08:57:03.047787193 | 0.019 |
| 04/19/2024 08:57:04.064566769 | 0.019 |
| 04/19/2024 08:57:05.081340042 | 0.019 |
| 04/19/2024 08:57:06.098125436 | 0.019 |
| 04/19/2024 08:57:07.114913163 | 0.019 |
| 04/19/2024 08:57:08.131686254 | 0.019 |
| 04/19/2024 08:57:09.148471799 | 0.019 |
| 04/19/2024 08:57:10.165246436 | 0.019 |
| 04/19/2024 08:57:11.182019284 | 0.019 |
| 04/19/2024 08:57:12.198803224 | 0.019 |
| 04/19/2024 08:57:13.215578951 | 0.019 |
| 04/19/2024 08:57:14.232353830 | 0.019 |
| 04/19/2024 08:57:15.249139011 | 0.019 |
| 04/19/2024 08:57:16.265923072 | 0.019 |
| 04/19/2024 08:57:17.282707011 | 0.019 |
| 04/19/2024 08:57:18.299489951 | 0.019 |
| 04/19/2024 08:57:19.316270405 | 0.019 |
| 04/19/2024 08:57:20.333052739 | 0.019 |
| 04/19/2024 08:57:21.349833527 | 0.019 |
| 04/19/2024 08:57:22.366602496 | 0.019 |
| 04/19/2024 08:57:23.383374951 | 0.019 |
| 04/19/2024 08:57:24.400158890 | 0.019 |
| 04/19/2024 08:57:25.416938102 | 0.019 |
| 04/19/2024 08:57:26.433715890 | 0.018 |
| 04/19/2024 08:57:27.450495375 | 0.018 |
| 04/19/2024 08:57:28.467270557 | 0.018 |
| 04/19/2024 08:57:29.484054981 | 0.018 |
| 04/19/2024 08:57:30.500836799 | 0.018 |
| 04/19/2024 08:57:31.517620648 | 0.018 |
| 04/19/2024 08:57:32.534403739 | 0.018 |
| 04/19/2024 08:57:33.551176284 | 0.018 |
| 04/19/2024 08:57:34.567955133 | 0.018 |
| 04/19/2024 08:57:35.584735072 | 0.018 |
| 04/19/2024 08:57:36.601512648 | 0.018 |
| 04/19/2024 08:57:37.618292496 | 0.018 |
| 04/19/2024 08:57:38.635077527 | 0.018 |
| 04/19/2024 08:57:39.651851284 | 0.018 |
| 04/19/2024 08:57:40.668631951 | 0.018 |
| 04/19/2024 08:57:41.685407102 | 0.018 |
| 04/19/2024 08:57:42.702182799 | 0.018 |
| 04/19/2024 08:57:43.718961678 | 0.018 |
| 04/19/2024 08:57:44.735745072 | 0.018 |
| 04/19/2024 08:57:45.752527648 | 0.018 |
| 04/19/2024 08:57:46.769305284 | 0.018 |
| 04/19/2024 08:57:47.786084678 | 0.018 |
| 04/19/2024 08:57:48.802869284 | 0.018 |
| 04/19/2024 08:57:49.819648648 | 0.018 |
| 04/19/2024 08:57:50.836430951 | 0.018 |
| 04/19/2024 08:57:51.853205133 | 0.018 |
| 04/19/2024 08:57:52.869986951 | 0.018 |
| 04/19/2024 08:57:53.886770496 | 0.018 |
| 04/19/2024 08:57:54.903546314 | 0.018 |
| 04/19/2024 08:57:55.920328102 | 0.018 |
| 04/19/2024 08:57:56.937111163 | 0.018 |
| 04/19/2024 08:57:57.953886163 | 0.018 |
| 04/19/2024 08:57:58.970669890 | 0.018 |
| 04/19/2024 08:57:59.987444557 | 0.018 |
| 04/19/2024 08:58:01.004225587 | 0.018 |
| 04/19/2024 08:58:02.021010739 | 0.018 |
| 04/19/2024 08:58:03.037795042 | 0.018 |
| 04/19/2024 08:58:04.054580011 | 0.018 |
| 04/19/2024 08:58:05.071357299 | 0.018 |
| 04/19/2024 08:58:06.088135875 | 0.018 |
| 04/19/2024 08:58:07.104917996 | 0.018 |
| 04/19/2024 08:58:08.121694662 | 0.018 |
| 04/19/2024 08:58:09.138473996 | 0.018 |
| 04/19/2024 08:58:10.155248329 | 0.018 |
| 04/19/2024 08:58:11.172034935 | 0.018 |
| 04/19/2024 08:58:12.188819420 | 0.018 |
| 04/19/2024 08:58:13.205594905 | 0.018 |
| 04/19/2024 08:58:14.222374299 | 0.018 |
| 04/19/2024 08:58:15.239161693 | 0.018 |
| 04/19/2024 08:58:16.255944238 | 0.018 |
| 04/19/2024 08:58:17.272728784 | 0.018 |
| 04/19/2024 08:58:18.289511693 | 0.018 |
| 04/19/2024 08:58:19.306296450 | 0.018 |
| 04/19/2024 08:58:20.323078450 | 0.018 |
| 04/19/2024 08:58:21.339861056 | 0.018 |
| 04/19/2024 08:58:22.356644571 | 0.018 |
| 04/19/2024 08:58:23.373417965 | 0.018 |
| 04/19/2024 08:58:24.390197299 | 0.018 |
| 04/19/2024 08:58:25.406973723 | 0.018 |
| 04/19/2024 08:58:26.423752632 | 0.018 |
| 04/19/2024 08:58:27.440540268 | 0.018 |
| 04/19/2024 08:58:28.457315268 | 0.017 |
| 04/19/2024 08:58:29.474093208 | 0.017 |
| 04/19/2024 08:58:30.490873329 | 0.017 |
| 04/19/2024 08:58:31.507650905 | 0.017 |
| 04/19/2024 08:58:32.524439268 | 0.017 |
| 04/19/2024 08:58:33.541219784 | 0.017 |
| 04/19/2024 08:58:34.558001056 | 0.017 |
| 04/19/2024 08:58:35.574781875 | 0.017 |
| 04/19/2024 08:58:36.591557784 | 0.017 |
| 04/19/2024 08:58:37.608340117 | 0.017 |
| 04/19/2024 08:58:38.625121208 | 0.017 |
| 04/19/2024 08:58:39.641900238 | 0.017 |
| 04/19/2024 08:58:40.658680299 | 0.017 |
| 04/19/2024 08:58:41.675450026 | 0.017 |
| 04/19/2024 08:58:42.692228814 | 0.017 |
| 04/19/2024 08:58:43.709013511 | 0.017 |
| 04/19/2024 08:58:44.725790572 | 0.017 |
| 04/19/2024 08:58:45.742568238 | 0.017 |
| 04/19/2024 08:58:46.759342784 | 0.017 |
| 04/19/2024 08:58:47.776125602 | 0.017 |
| 04/19/2024 08:58:48.792911541 | 0.017 |
| 04/19/2024 08:58:49.809694572 | 0.017 |
| 04/19/2024 08:58:50.826470602 | 0.017 |
| 04/19/2024 08:58:51.843254632 | 0.017 |
| 04/19/2024 08:58:52.860036844 | 0.017 |
| 04/19/2024 08:58:53.876819178 | 0.017 |
| 04/19/2024 08:58:54.893599662 | 0.017 |
| 04/19/2024 08:58:55.910378117 | 0.017 |
| 04/19/2024 08:58:56.927169117 | 0.017 |
| 04/19/2024 08:58:57.943947541 | 0.017 |
| 04/19/2024 08:58:58.960725117 | 0.017 |
| 04/19/2024 08:58:59.977499541 | 0.017 |
| 04/19/2024 08:59:00.994278632 | 0.017 |
| 04/19/2024 08:59:02.011058359 | 0.017 |
| 04/19/2024 08:59:03.027844966 | 0.017 |
| 04/19/2024 08:59:04.044627753 | 0.017 |
| 04/19/2024 08:59:05.061402632 | 0.017 |
| 04/19/2024 08:59:06.078183117 | 0.017 |
| 04/19/2024 08:59:07.094968480 | 0.017 |
| 04/19/2024 08:59:08.111746177 | 0.017 |
| 04/19/2024 08:59:09.128532935 | 0.017 |
| 04/19/2024 08:59:10.145321905 | 0.017 |
| 04/19/2024 08:59:11.162097571 | 0.017 |
| 04/19/2024 08:59:12.178882268 | 0.017 |
| 04/19/2024 08:59:13.195664965 | 0.017 |
| 04/19/2024 08:59:14.212443571 | 0.017 |
| 04/19/2024 08:59:15.229231299 | 0.017 |
| 04/19/2024 08:59:16.246014965 | 0.017 |
| 04/19/2024 08:59:17.262793632 | 0.017 |
| 04/19/2024 08:59:18.279575086 | 0.017 |
| 04/19/2024 08:59:19.296360844 | 0.017 |
| 04/19/2024 08:59:20.313142996 | 0.017 |
| 04/19/2024 08:59:21.329923177 | 0.017 |
| 04/19/2024 08:59:22.346705026 | 0.017 |
| 04/19/2024 08:59:23.363477965 | 0.017 |
| 04/19/2024 08:59:24.380254450 | 0.017 |
| 04/19/2024 08:59:25.397036329 | 0.017 |
| 04/19/2024 08:59:26.413813238 | 0.017 |
| 04/19/2024 08:59:27.430596874 | 0.017 |
| 04/19/2024 08:59:28.447374056 | 0.017 |
| 04/19/2024 08:59:29.464154086 | 0.017 |
| 04/19/2024 08:59:30.480933147 | 0.017 |
| 04/19/2024 08:59:31.497714420 | 0.016 |
| 04/19/2024 08:59:32.514495086 | 0.017 |
| 04/19/2024 08:59:33.531275844 | 0.016 |
| 04/19/2024 08:59:34.548058814 | 0.016 |
| 04/19/2024 08:59:35.564839648 | 0.016 |
| 04/19/2024 08:59:36.581612314 | 0.016 |
| 04/19/2024 08:59:37.598394496 | 0.016 |
| 04/19/2024 08:59:38.615175314 | 0.016 |
| 04/19/2024 08:59:39.631950223 | 0.016 |
| 04/19/2024 08:59:40.648734799 | 0.016 |
| 04/19/2024 08:59:41.665511678 | 0.016 |
| 04/19/2024 08:59:42.682288466 | 0.016 |
| 04/19/2024 08:59:43.699070436 | 0.016 |
| 04/19/2024 08:59:44.715848345 | 0.016 |
| 04/19/2024 08:59:45.732624829 | 0.016 |
| 04/19/2024 08:59:46.749407193 | 0.016 |
| 04/19/2024 08:59:47.766184739 | 0.016 |
| 04/19/2024 08:59:48.782967436 | 0.016 |
| 04/19/2024 08:59:49.799748163 | 0.016 |
| 04/19/2024 08:59:50.816531072 | 0.016 |
| 04/19/2024 08:59:51.833312163 | 0.016 |
| 04/19/2024 08:59:52.850097254 | 0.016 |
| 04/19/2024 08:59:53.866879496 | 0.016 |
| 04/19/2024 08:59:54.883655981 | 0.016 |
| 04/19/2024 08:59:55.900436466 | 0.016 |
| 04/19/2024 08:59:56.917217526 | 0.016 |
| 04/19/2024 08:59:57.933991436 | 0.016 |
| 04/19/2024 08:59:58.950771526 | 0.016 |
| 04/19/2024 08:59:59.967546769 | 0.016 |
| 04/19/2024 09:00:00.984320375 | 0.016 |
| 04/19/2024 09:00:02.001097769 | 0.016 |
| 04/19/2024 09:00:03.017883132 | 0.016 |
| 04/19/2024 09:00:04.034666526 | 0.016 |
| 04/19/2024 09:00:05.051450511 | 0.016 |
| 04/19/2024 09:00:06.068226905 | 0.016 |
| 04/19/2024 09:00:07.085010966 | 0.016 |
| 04/19/2024 09:00:08.101787875 | 0.016 |
| 04/19/2024 09:00:09.118566723 | 0.016 |
| 04/19/2024 09:00:10.135348481 | 0.016 |
| 04/19/2024 09:00:11.152126451 | 0.016 |
| 04/19/2024 09:00:12.168907087 | 0.016 |
| 04/19/2024 09:00:13.185682784 | 0.016 |
| 04/19/2024 09:00:14.202462754 | 0.016 |
| 04/19/2024 09:00:15.219245057 | 0.016 |
| 04/19/2024 09:00:16.236021238 | 0.016 |
| 04/19/2024 09:00:17.252802420 | 0.016 |
| 04/19/2024 09:00:18.269573602 | 0.016 |
| 04/19/2024 09:00:19.286356935 | 0.016 |
| 04/19/2024 09:00:20.303139178 | 0.016 |
| 04/19/2024 09:00:21.319915996 | 0.016 |
| 04/19/2024 09:00:22.336697814 | 0.016 |
| 04/19/2024 09:00:23.353484026 | 0.016 |
| 04/19/2024 09:00:24.370256511 | 0.016 |
| 04/19/2024 09:00:25.387028208 | 0.016 |
| 04/19/2024 09:00:26.403807269 | 0.016 |
| 04/19/2024 09:00:27.420588875 | 0.016 |
| 04/19/2024 09:00:28.437366147 | 0.016 |
| 04/19/2024 09:00:29.454150147 | 0.016 |
| 04/19/2024 09:00:30.470928178 | 0.016 |
| 04/19/2024 09:00:31.487703087 | 0.016 |
| 04/19/2024 09:00:32.504482117 | 0.016 |
| 04/19/2024 09:00:33.521261269 | 0.016 |
| 04/19/2024 09:00:34.538044602 | 0.016 |
| 04/19/2024 09:00:35.554826951 | 0.016 |
| 04/19/2024 09:00:36.571600617 | 0.016 |
| 04/19/2024 09:00:37.588378193 | 0.016 |
| 04/19/2024 09:00:38.605159981 | 0.016 |
| 04/19/2024 09:00:39.621938223 | 0.016 |
| 04/19/2024 09:00:40.638720254 | 0.016 |
| 04/19/2024 09:00:41.655501648 | 0.016 |
| 04/19/2024 09:00:42.672277648 | 0.015 |
| 04/19/2024 09:00:43.689060617 | 0.015 |
| 04/19/2024 09:00:44.705841466 | 0.015 |
| 04/19/2024 09:00:45.722615375 | 0.015 |
| 04/19/2024 09:00:46.739398163 | 0.015 |
| 04/19/2024 09:00:47.756178011 | 0.015 |
| 04/19/2024 09:00:48.772963617 | 0.015 |
| 04/19/2024 09:00:49.789742223 | 0.015 |
| 04/19/2024 09:00:50.806523951 | 0.015 |
| 04/19/2024 09:00:51.823302951 | 0.015 |
| 04/19/2024 09:00:52.840085890 | 0.015 |
| 04/19/2024 09:00:53.856870405 | 0.015 |
| 04/19/2024 09:00:54.873642678 | 0.015 |
| 04/19/2024 09:00:55.890425375 | 0.015 |
| 04/19/2024 09:00:56.907216375 | 0.015 |
| 04/19/2024 09:00:57.923995496 | 0.015 |
| 04/19/2024 09:00:58.940779072 | 0.015 |
| 04/19/2024 09:00:59.957569678 | 0.015 |
| 04/19/2024 09:01:00.974345890 | 0.015 |
| 04/19/2024 09:01:01.991129739 | 0.015 |
| 04/19/2024 09:01:03.007908163 | 0.015 |
| 04/19/2024 09:01:04.024684739 | 0.015 |
| 04/19/2024 09:01:05.041470889 | 0.015 |
| 04/19/2024 09:01:06.058251859 | 0.015 |
| 04/19/2024 09:01:07.075033708 | 0.015 |
| 04/19/2024 09:01:08.091812405 | 0.015 |
| 04/19/2024 09:01:09.108596920 | 0.015 |
| 04/19/2024 09:01:10.125377496 | 0.015 |
| 04/19/2024 09:01:11.142156799 | 0.015 |
| 04/19/2024 09:01:12.158939677 | 0.015 |
| 04/19/2024 09:01:13.175708405 | 0.015 |
| 04/19/2024 09:01:14.192486071 | 0.015 |
| 04/19/2024 09:01:15.209269647 | 0.015 |
| 04/19/2024 09:01:16.226041708 | 0.015 |
| 04/19/2024 09:01:17.242816829 | 0.015 |
| 04/19/2024 09:01:18.259603192 | 0.015 |
| 04/19/2024 09:01:19.276380132 | 0.015 |
| 04/19/2024 09:01:20.293162041 | 0.015 |
| 04/19/2024 09:01:21.309948677 | 0.015 |
| 04/19/2024 09:01:22.326731192 | 0.015 |
| 04/19/2024 09:01:23.343518556 | 0.015 |
| 04/19/2024 09:01:24.360300980 | 0.015 |
| 04/19/2024 09:01:25.377071617 | 0.015 |
| 04/19/2024 09:01:26.393854889 | 0.015 |
| 04/19/2024 09:01:27.410633465 | 0.015 |
| 04/19/2024 09:01:28.427412617 | 0.015 |
| 04/19/2024 09:01:29.444191435 | 0.015 |
| 04/19/2024 09:01:30.460977465 | 0.015 |
| 04/19/2024 09:01:31.477751283 | 0.015 |
| 04/19/2024 09:01:32.494528647 | 0.015 |
| 04/19/2024 09:01:33.511306283 | 0.015 |
| 04/19/2024 09:01:34.528086223 | 0.015 |
| 04/19/2024 09:01:35.544872541 | 0.015 |
| 04/19/2024 09:01:36.561650511 | 0.015 |
| 04/19/2024 09:01:37.578430026 | 0.015 |
| 04/19/2024 09:01:38.595212905 | 0.015 |
| 04/19/2024 09:01:39.611986814 | 0.015 |
| 04/19/2024 09:01:40.628765935 | 0.015 |
| 04/19/2024 09:01:41.645547450 | 0.015 |
| 04/19/2024 09:01:42.662323299 | 0.015 |
| 04/19/2024 09:01:43.679112602 | 0.015 |
| 04/19/2024 09:01:44.695893390 | 0.015 |
| 04/19/2024 09:01:45.712672208 | 0.015 |
| 04/19/2024 09:01:46.729455208 | 0.015 |
| 04/19/2024 09:01:47.746233117 | 0.015 |
| 04/19/2024 09:01:48.763012087 | 0.015 |
| 04/19/2024 09:01:49.779791087 | 0.015 |
| 04/19/2024 09:01:50.796577511 | 0.015 |
| 04/19/2024 09:01:51.813358360 | 0.015 |
| 04/19/2024 09:01:52.830140693 | 0.015 |
| 04/19/2024 09:01:53.846925329 | 0.015 |
| 04/19/2024 09:01:54.863707087 | 0.015 |
| 04/19/2024 09:01:55.880485723 | 0.015 |
| 04/19/2024 09:01:56.897270753 | 0.015 |
| 04/19/2024 09:01:57.914047511 | 0.015 |
| 04/19/2024 09:01:58.930826057 | 0.014 |
| 04/19/2024 09:01:59.947610420 | 0.014 |
| 04/19/2024 09:02:00.964387087 | 0.014 |
| 04/19/2024 09:02:01.981165087 | 0.014 |
| 04/19/2024 09:02:02.997941693 | 0.014 |
| 04/19/2024 09:02:04.014720450 | 0.014 |
| 04/19/2024 09:02:05.031500450 | 0.014 |
| 04/19/2024 09:02:06.048287571 | 0.014 |
| 04/19/2024 09:02:07.065071753 | 0.014 |
| 04/19/2024 09:02:08.081855571 | 0.014 |
| 04/19/2024 09:02:09.098637965 | 0.014 |
| 04/19/2024 09:02:10.115417632 | 0.014 |
| 04/19/2024 09:02:11.132192208 | 0.014 |
| 04/19/2024 09:02:12.148977359 | 0.014 |
| 04/19/2024 09:02:13.165757026 | 0.014 |
| 04/19/2024 09:02:14.182533511 | 0.014 |
| 04/19/2024 09:02:15.199321996 | 0.014 |
| 04/19/2024 09:02:16.216100359 | 0.014 |
| 04/19/2024 09:02:17.232880208 | 0.014 |
| 04/19/2024 09:02:18.249662178 | 0.014 |
| 04/19/2024 09:02:19.266444238 | 0.014 |
| 04/19/2024 09:02:20.283225693 | 0.014 |
| 04/19/2024 09:02:21.300005268 | 0.014 |
| 04/19/2024 09:02:22.316789087 | 0.014 |
| 04/19/2024 09:02:23.333571511 | 0.014 |
| 04/19/2024 09:02:24.350356481 | 0.014 |
| 04/19/2024 09:02:25.367138056 | 0.014 |
| 04/19/2024 09:02:26.383914026 | 0.014 |
| 04/19/2024 09:02:27.400692329 | 0.014 |
| 04/19/2024 09:02:28.417471056 | 0.014 |
| 04/19/2024 09:02:29.434247268 | 0.014 |
| 04/19/2024 09:02:30.451026329 | 0.014 |
| 04/19/2024 09:02:31.467806662 | 0.014 |
| 04/19/2024 09:02:32.484584147 | 0.014 |
| 04/19/2024 09:02:33.501362935 | 0.014 |
| 04/19/2024 09:02:34.518136844 | 0.014 |
| 04/19/2024 09:02:35.534916253 | 0.014 |
| 04/19/2024 09:02:36.551693102 | 0.014 |
| 04/19/2024 09:02:37.568472587 | 0.014 |
| 04/19/2024 09:02:38.585252496 | 0.014 |
| 04/19/2024 09:02:39.602029405 | 0.014 |
| 04/19/2024 09:02:40.618810950 | 0.014 |
| 04/19/2024 09:02:41.635593071 | 0.014 |
| 04/19/2024 09:02:42.652368405 | 0.014 |
| 04/19/2024 09:02:43.669145647 | 0.014 |
| 04/19/2024 09:02:44.685927314 | 0.014 |
| 04/19/2024 09:02:45.702705829 | 0.014 |
| 04/19/2024 09:02:46.719487678 | 0.014 |
| 04/19/2024 09:02:47.736260162 | 0.014 |
| 04/19/2024 09:02:48.753034920 | 0.014 |
| 04/19/2024 09:02:49.769815738 | 0.014 |
| 04/19/2024 09:02:50.786594647 | 0.014 |
| 04/19/2024 09:02:51.803383071 | 0.014 |
| 04/19/2024 09:02:52.820162102 | 0.014 |
| 04/19/2024 09:02:53.836940102 | 0.014 |
| 04/19/2024 09:02:54.853722859 | 0.014 |
| 04/19/2024 09:02:55.870499950 | 0.014 |
| 04/19/2024 09:02:56.887282223 | 0.014 |
| 04/19/2024 09:02:57.904054859 | 0.014 |
| 04/19/2024 09:02:58.920832799 | 0.014 |
| 04/19/2024 09:02:59.937617041 | 0.014 |
| 04/19/2024 09:03:00.954394011 | 0.014 |
| 04/19/2024 09:03:01.971173374 | 0.014 |
| 04/19/2024 09:03:02.987954314 | 0.014 |
| 04/19/2024 09:03:04.004733496 | 0.014 |
| 04/19/2024 09:03:05.021511708 | 0.014 |
| 04/19/2024 09:03:06.038280223 | 0.014 |
| 04/19/2024 09:03:07.055058829 | 0.014 |
| 04/19/2024 09:03:08.071846799 | 0.014 |
| 04/19/2024 09:03:09.088625526 | 0.014 |
| 04/19/2024 09:03:10.105410284 | 0.014 |
| 04/19/2024 09:03:11.122183042 | 0.014 |
| 04/19/2024 09:03:12.138963345 | 0.014 |
| 04/19/2024 09:03:13.155747042 | 0.014 |
| 04/19/2024 09:03:14.172520557 | 0.014 |
| 04/19/2024 09:03:15.189305072 | 0.014 |
| 04/19/2024 09:03:16.206078708 | 0.014 |
| 04/19/2024 09:03:17.222855042 | 0.014 |
| 04/19/2024 09:03:18.239635769 | 0.014 |
| 04/19/2024 09:03:19.256414345 | 0.013 |
| 04/19/2024 09:03:20.273192254 | 0.013 |
| 04/19/2024 09:03:21.289973193 | 0.013 |
| 04/19/2024 09:03:22.306752617 | 0.013 |
| 04/19/2024 09:03:23.323533708 | 0.013 |
| 04/19/2024 09:03:24.340310435 | 0.013 |
| 04/19/2024 09:03:25.357094526 | 0.013 |
| 04/19/2024 09:03:26.373874345 | 0.013 |
| 04/19/2024 09:03:27.390648254 | 0.013 |
| 04/19/2024 09:03:28.407428648 | 0.013 |
| 04/19/2024 09:03:29.424202617 | 0.013 |
| 04/19/2024 09:03:30.440981587 | 0.013 |
| 04/19/2024 09:03:31.457760557 | 0.013 |
| 04/19/2024 09:03:32.474536708 | 0.013 |
| 04/19/2024 09:03:33.491316648 | 0.013 |
| 04/19/2024 09:03:34.508089920 | 0.013 |
| 04/19/2024 09:03:35.524869314 | 0.013 |
| 04/19/2024 09:03:36.541650284 | 0.013 |
| 04/19/2024 09:03:37.558427648 | 0.013 |
| 04/19/2024 09:03:38.575212436 | 0.013 |
| 04/19/2024 09:03:39.591992466 | 0.013 |
| 04/19/2024 09:03:40.608771163 | 0.013 |
| 04/19/2024 09:03:41.625548254 | 0.013 |
| 04/19/2024 09:03:42.642322042 | 0.013 |
| 04/19/2024 09:03:43.659104830 | 0.013 |
| 04/19/2024 09:03:44.675884860 | 0.013 |
| 04/19/2024 09:03:45.692661102 | 0.013 |
| 04/19/2024 09:03:46.709444284 | 0.013 |
| 04/19/2024 09:03:47.726220254 | 0.013 |
| 04/19/2024 09:03:48.742993284 | 0.013 |
| 04/19/2024 09:03:49.759775496 | 0.013 |
| 04/19/2024 09:03:50.776553436 | 0.013 |
| 04/19/2024 09:03:51.793333224 | 0.013 |
| 04/19/2024 09:03:52.810108284 | 0.013 |
| 04/19/2024 09:03:53.826893708 | 0.013 |
| 04/19/2024 09:03:54.843676102 | 0.013 |
| 04/19/2024 09:03:55.860452890 | 0.013 |
| 04/19/2024 09:03:56.877233466 | 0.013 |
| 04/19/2024 09:03:57.894017648 | 0.013 |
| 04/19/2024 09:03:58.910800102 | 0.013 |
| 04/19/2024 09:03:59.927582708 | 0.013 |
| 04/19/2024 09:04:00.944361224 | 0.013 |
| 04/19/2024 09:04:01.961139466 | 0.013 |
| 04/19/2024 09:04:02.977923163 | 0.013 |
| 04/19/2024 09:04:03.994703042 | 0.013 |
| 04/19/2024 09:04:05.011488163 | 0.013 |
| 04/19/2024 09:04:06.028263087 | 0.013 |
| 04/19/2024 09:04:07.045044117 | 0.013 |
| 04/19/2024 09:04:08.061823117 | 0.013 |
| 04/19/2024 09:04:09.078604330 | 0.013 |
| 04/19/2024 09:04:10.095385633 | 0.013 |
| 04/19/2024 09:04:11.112157117 | 0.013 |
| 04/19/2024 09:04:12.128936814 | 0.013 |
| 04/19/2024 09:04:13.145720572 | 0.013 |
| 04/19/2024 09:04:14.162491724 | 0.013 |
| 04/19/2024 09:04:15.179276936 | 0.013 |
| 04/19/2024 09:04:16.196062420 | 0.013 |
| 04/19/2024 09:04:17.212849269 | 0.013 |
| 04/19/2024 09:04:18.229635905 | 0.013 |
| 04/19/2024 09:04:19.246414542 | 0.013 |
| 04/19/2024 09:04:20.263193299 | 0.013 |
| 04/19/2024 09:04:21.279976936 | 0.013 |
| 04/19/2024 09:04:22.296755663 | 0.013 |
| 04/19/2024 09:04:23.313532663 | 0.013 |
| 04/19/2024 09:04:24.330312905 | 0.013 |
| 04/19/2024 09:04:25.347098693 | 0.013 |
| 04/19/2024 09:04:26.363881845 | 0.013 |
| 04/19/2024 09:04:27.380650875 | 0.013 |
| 04/19/2024 09:04:28.397434330 | 0.013 |
| 04/19/2024 09:04:29.414208966 | 0.013 |
| 04/19/2024 09:04:30.430986330 | 0.013 |
| 04/19/2024 09:04:31.447763330 | 0.013 |
| 04/19/2024 09:04:32.464536481 | 0.013 |
| 04/19/2024 09:04:33.481316299 | 0.013 |
| 04/19/2024 09:04:34.498098451 | 0.013 |
| 04/19/2024 09:04:35.514877693 | 0.013 |
| 04/19/2024 09:04:36.531656602 | 0.013 |
| 04/19/2024 09:04:37.548431147 | 0.013 |
| 04/19/2024 09:04:38.565207572 | 0.012 |
| 04/19/2024 09:04:39.581995875 | 0.012 |
| 04/19/2024 09:04:40.598780299 | 0.012 |
| 04/19/2024 09:04:41.615559450 | 0.012 |
| 04/19/2024 09:04:42.632334541 | 0.012 |
| 04/19/2024 09:04:43.649113450 | 0.012 |
| 04/19/2024 09:04:44.665891147 | 0.012 |
| 04/19/2024 09:04:45.682663026 | 0.012 |
| 04/19/2024 09:04:46.699446935 | 0.012 |
| 04/19/2024 09:04:47.716216420 | 0.012 |
| 04/19/2024 09:04:48.732994117 | 0.012 |
| 04/19/2024 09:04:49.749776117 | 0.012 |
| 04/19/2024 09:04:50.766552602 | 0.012 |
| 04/19/2024 09:04:51.783328117 | 0.012 |
| 04/19/2024 09:04:52.800111087 | 0.012 |
| 04/19/2024 09:04:53.816887208 | 0.012 |
| 04/19/2024 09:04:54.833671935 | 0.012 |
| 04/19/2024 09:04:55.850452753 | 0.012 |
| 04/19/2024 09:04:56.867232056 | 0.012 |
| 04/19/2024 09:04:57.884011481 | 0.012 |
| 04/19/2024 09:04:58.900793784 | 0.012 |
| 04/19/2024 09:04:59.917575178 | 0.012 |
| 04/19/2024 09:05:00.934349511 | 0.012 |
| 04/19/2024 09:05:01.951129299 | 0.012 |
| 04/19/2024 09:05:02.967913935 | 0.012 |
| 04/19/2024 09:05:03.984689481 | 0.012 |
| 04/19/2024 09:05:05.001469208 | 0.012 |
| 04/19/2024 09:05:06.018240299 | 0.012 |
| 04/19/2024 09:05:07.035020117 | 0.012 |
| 04/19/2024 09:05:08.051801784 | 0.012 |
| 04/19/2024 09:05:09.068575844 | 0.012 |
| 04/19/2024 09:05:10.085359087 | 0.012 |
| 04/19/2024 09:05:11.102142541 | 0.012 |
| 04/19/2024 09:05:12.118922147 | 0.012 |
| 04/19/2024 09:05:13.135703965 | 0.012 |
| 04/19/2024 09:05:14.152481390 | 0.012 |
| 04/19/2024 09:05:15.169262602 | 0.012 |
| 04/19/2024 09:05:16.186046632 | 0.012 |
| 04/19/2024 09:05:17.202826905 | 0.012 |
| 04/19/2024 09:05:18.219606996 | 0.012 |
| 04/19/2024 09:05:19.236379875 | 0.012 |
| 04/19/2024 09:05:20.253158693 | 0.012 |
| 04/19/2024 09:05:21.269947844 | 0.012 |
| 04/19/2024 09:05:22.286729026 | 0.012 |
| 04/19/2024 09:05:23.303506965 | 0.012 |
| 04/19/2024 09:05:24.320276996 | 0.012 |
| 04/19/2024 09:05:25.337059390 | 0.012 |
| 04/19/2024 09:05:26.353844147 | 0.012 |
| 04/19/2024 09:05:27.370624541 | 0.012 |
| 04/19/2024 09:05:28.387395965 | 0.012 |
| 04/19/2024 09:05:29.404176299 | 0.012 |
| 04/19/2024 09:05:30.420952965 | 0.012 |
| 04/19/2024 09:05:31.437728875 | 0.012 |
| 04/19/2024 09:05:32.454505814 | 0.012 |
| 04/19/2024 09:05:33.471281844 | 0.012 |
| 04/19/2024 09:05:34.488061602 | 0.012 |
| 04/19/2024 09:05:35.504840117 | 0.012 |
| 04/19/2024 09:05:36.521617966 | 0.012 |
| 04/19/2024 09:05:37.538391754 | 0.012 |
| 04/19/2024 09:05:38.555169087 | 0.012 |
| 04/19/2024 09:05:39.571948511 | 0.012 |
| 04/19/2024 09:05:40.588730663 | 0.012 |
| 04/19/2024 09:05:41.605510026 | 0.012 |
| 04/19/2024 09:05:42.622281935 | 0.012 |
| 04/19/2024 09:05:43.639059511 | 0.012 |
| 04/19/2024 09:05:44.655842299 | 0.012 |
| 04/19/2024 09:05:45.672616966 | 0.012 |
| 04/19/2024 09:05:46.689402026 | 0.012 |
| 04/19/2024 09:05:47.706187299 | 0.012 |
| 04/19/2024 09:05:48.722963420 | 0.012 |
| 04/19/2024 09:05:49.739740905 | 0.012 |
| 04/19/2024 09:05:50.756514390 | 0.012 |
| 04/19/2024 09:05:51.773292754 | 0.012 |
| 04/19/2024 09:05:52.790077360 | 0.012 |
| 04/19/2024 09:05:53.806860420 | 0.012 |
| 04/19/2024 09:05:54.823637663 | 0.012 |
| 04/19/2024 09:05:55.840416329 | 0.012 |
| 04/19/2024 09:05:56.857197754 | 0.012 |
| 04/19/2024 09:05:57.873977208 | 0.012 |
| 04/19/2024 09:05:58.890755602 | 0.012 |
| 04/19/2024 09:05:59.907541845 | 0.012 |
| 04/19/2024 09:06:00.924313390 | 0.012 |
| 04/19/2024 09:06:01.941092269 | 0.012 |
| 04/19/2024 09:06:02.957876420 | 0.012 |
| 04/19/2024 09:06:03.974669026 | 0.012 |
| 04/19/2024 09:06:04.991451996 | 0.012 |
| 04/19/2024 09:06:06.008233481 | 0.012 |
| 04/19/2024 09:06:07.025009723 | 0.012 |
| 04/19/2024 09:06:08.041790208 | 0.012 |
| 04/19/2024 09:06:09.058565875 | 0.012 |
| 04/19/2024 09:06:10.075342875 | 0.012 |
| 04/19/2024 09:06:11.092127662 | 0.012 |
| 04/19/2024 09:06:12.108912723 | 0.012 |
| 04/19/2024 09:06:13.125693329 | 0.012 |
| 04/19/2024 09:06:14.142466329 | 0.012 |
| 04/19/2024 09:06:15.159248026 | 0.012 |
| 04/19/2024 09:06:16.176029814 | 0.012 |
| 04/19/2024 09:06:17.192807662 | 0.012 |
| 04/19/2024 09:06:18.209589208 | 0.011 |
| 04/19/2024 09:06:19.226373814 | 0.011 |
| 04/19/2024 09:06:20.243155481 | 0.011 |
| 04/19/2024 09:06:21.259943875 | 0.011 |
| 04/19/2024 09:06:22.276718511 | 0.011 |
| 04/19/2024 09:06:23.293502299 | 0.011 |
| 04/19/2024 09:06:24.310283996 | 0.011 |
| 04/19/2024 09:06:25.327067087 | 0.011 |
| 04/19/2024 09:06:26.343852572 | 0.011 |
| 04/19/2024 09:06:27.360632390 | 0.011 |
| 04/19/2024 09:06:28.377411269 | 0.011 |
| 04/19/2024 09:06:29.394190269 | 0.011 |
| 04/19/2024 09:06:30.410965814 | 0.011 |
| 04/19/2024 09:06:31.427742269 | 0.011 |
| 04/19/2024 09:06:32.444518208 | 0.011 |
| 04/19/2024 09:06:33.461296602 | 0.011 |
| 04/19/2024 09:06:34.478073935 | 0.011 |
| 04/19/2024 09:06:35.494856768 | 0.011 |
| 04/19/2024 09:06:36.511632768 | 0.011 |
| 04/19/2024 09:06:37.528410647 | 0.011 |
| 04/19/2024 09:06:38.545191890 | 0.011 |
| 04/19/2024 09:06:39.561970223 | 0.011 |
| 04/19/2024 09:06:40.578748950 | 0.011 |
| 04/19/2024 09:06:41.595527526 | 0.011 |
| 04/19/2024 09:06:42.612315253 | 0.011 |
| 04/19/2024 09:06:43.629096102 | 0.011 |
| 04/19/2024 09:06:44.645876587 | 0.011 |
| 04/19/2024 09:06:45.662649890 | 0.011 |
| 04/19/2024 09:06:46.679432223 | 0.011 |
| 04/19/2024 09:06:47.696218374 | 0.011 |
| 04/19/2024 09:06:48.712993799 | 0.011 |
| 04/19/2024 09:06:49.729773102 | 0.011 |
| 04/19/2024 09:06:50.746550041 | 0.011 |
| 04/19/2024 09:06:51.763324314 | 0.011 |
| 04/19/2024 09:06:52.780103405 | 0.011 |
| 04/19/2024 09:06:53.796883920 | 0.011 |
| 04/19/2024 09:06:54.813663738 | 0.011 |
| 04/19/2024 09:06:55.830449283 | 0.011 |
| 04/19/2024 09:06:56.847229738 | 0.011 |
| 04/19/2024 09:06:57.864011071 | 0.011 |
| 04/19/2024 09:06:58.880791223 | 0.011 |
| 04/19/2024 09:06:59.897572011 | 0.011 |
| 04/19/2024 09:07:00.914354647 | 0.011 |
| 04/19/2024 09:07:01.931138132 | 0.011 |
| 04/19/2024 09:07:02.947926132 | 0.011 |
| 04/19/2024 09:07:03.964702526 | 0.011 |
| 04/19/2024 09:07:04.981481859 | 0.011 |
| 04/19/2024 09:07:05.998269208 | 0.011 |
| 04/19/2024 09:07:07.015044571 | 0.011 |
| 04/19/2024 09:07:08.031824359 | 0.011 |
| 04/19/2024 09:07:09.069332693 | 0.002 |
| 04/19/2024 09:07:10.086123693 | -0.007 |
| 04/19/2024 09:07:11.102911814 | -0.007 |
| 04/19/2024 09:07:12.119692147 | -0.007 |
| 04/19/2024 09:07:13.136478329 | -0.007 |
| 04/19/2024 09:07:14.153250723 | 0.002 |
| 04/19/2024 09:07:15.170035208 | -0.007 |
| 04/19/2024 09:07:16.186817753 | -0.007 |
| 04/19/2024 09:07:17.203596329 | -0.007 |
| 04/19/2024 09:07:18.220375571 | -0.007 |
| 04/19/2024 09:07:19.237150602 | 0.002 |
| 04/19/2024 09:07:20.253926268 | -0.007 |
| 04/19/2024 09:07:21.270706056 | -0.007 |
| 04/19/2024 09:07:22.287483996 | -0.007 |
| 04/19/2024 09:07:23.304261359 | -0.007 |
| 04/19/2024 09:07:24.321045268 | 0.002 |
| 04/19/2024 09:07:25.337824935 | -0.007 |
| 04/19/2024 09:07:26.354608965 | -0.007 |
| 04/19/2024 09:07:27.371384935 | -0.007 |
| 04/19/2024 09:07:28.388165208 | -0.007 |
| 04/19/2024 09:07:29.404942299 | 0.002 |
| 04/19/2024 09:07:30.421716723 | -0.007 |
| 04/19/2024 09:07:31.438491935 | -0.007 |
| 04/19/2024 09:07:32.455265874 | -0.007 |
| 04/19/2024 09:07:33.472039268 | -0.007 |
| 04/19/2024 09:07:34.488814723 | 0.003 |
| 04/19/2024 09:07:35.505593572 | -0.007 |
| 04/19/2024 09:07:36.522370451 | -0.007 |
| 04/19/2024 09:07:37.539150360 | -0.007 |
| 04/19/2024 09:07:38.555927390 | -0.007 |
| 04/19/2024 09:07:39.572704511 | 0.003 |
| 04/19/2024 09:07:40.589480633 | -0.007 |
| 04/19/2024 09:07:41.606259208 | -0.007 |
| 04/19/2024 09:07:42.623042511 | -0.007 |
| 04/19/2024 09:07:43.639824996 | -0.007 |
| 04/19/2024 09:07:44.656606723 | 0.003 |
| 04/19/2024 09:07:45.673379633 | -0.007 |
| 04/19/2024 09:07:46.690159390 | -0.007 |
| 04/19/2024 09:07:47.706942784 | -0.007 |
| 04/19/2024 09:07:48.723716390 | -0.007 |
| 04/19/2024 09:07:49.740494511 | 0.003 |
| 04/19/2024 09:07:50.757271633 | -0.007 |
| 04/19/2024 09:07:51.774047481 | -0.007 |
| 04/19/2024 09:07:52.790830693 | -0.007 |
| 04/19/2024 09:07:53.807611602 | -0.002 |
| 04/19/2024 09:07:54.824397026 | -0.007 |
| 04/19/2024 09:07:55.841180572 | -0.007 |
| 04/19/2024 09:07:56.857959360 | 0.003 |
| 04/19/2024 09:07:57.874745936 | -0.007 |
| 04/19/2024 09:07:58.891523330 | -0.007 |
| 04/19/2024 09:07:59.908303420 | 0.003 |
| 04/19/2024 09:08:00.925084572 | 0.003 |
| 04/19/2024 09:08:01.941863966 | 0.003 |
| 04/19/2024 09:08:02.958645996 | -0.007 |
| 04/19/2024 09:08:03.975418360 | 0.003 |
| 04/19/2024 09:08:04.992197148 | -0.007 |
| 04/19/2024 09:08:06.008982405 | -0.007 |
| 04/19/2024 09:08:07.025762102 | -0.007 |
| 04/19/2024 09:08:08.042543405 | -0.007 |
| 04/19/2024 09:08:09.059317465 | 0.003 |
| 04/19/2024 09:08:10.076092738 | -0.007 |
| 04/19/2024 09:08:11.092872314 | 0.003 |
| 04/19/2024 09:08:12.109650708 | 0.003 |
| 04/19/2024 09:08:13.126432617 | 0.003 |
| 04/19/2024 09:08:14.143213647 | -0.007 |
| 04/19/2024 09:08:15.159999799 | 0.003 |
| 04/19/2024 09:08:16.176785041 | -0.007 |
| 04/19/2024 09:08:17.193564072 | -0.007 |
| 04/19/2024 09:08:18.210348405 | 0.003 |
| 04/19/2024 09:08:19.227132284 | -0.007 |
| 04/19/2024 09:08:20.243912132 | 0.003 |
| 04/19/2024 09:08:21.260693072 | 0.003 |
| 04/19/2024 09:08:22.277467647 | 0.003 |
| 04/19/2024 09:08:23.294250768 | 0.003 |
| 04/19/2024 09:08:24.311031768 | 0.003 |
| 04/19/2024 09:08:25.327811496 | -0.007 |
| 04/19/2024 09:08:26.344590132 | 0.003 |
| 04/19/2024 09:08:27.361362799 | 0.003 |
| 04/19/2024 09:08:28.378148799 | 0.003 |
| 04/19/2024 09:08:29.394928223 | 0.003 |
| 04/19/2024 09:08:30.411702617 | 0.003 |
| 04/19/2024 09:08:31.428471617 | 0.003 |
| 04/19/2024 09:08:32.445246647 | 0.003 |
| 04/19/2024 09:08:33.462020587 | 0.003 |
| 04/19/2024 09:08:34.478794375 | 0.003 |
| 04/19/2024 09:08:35.495578541 | 0.003 |
| 04/19/2024 09:08:36.512357571 | 0.003 |
| 04/19/2024 09:08:37.529136208 | -0.007 |
| 04/19/2024 09:08:38.545914086 | 0.003 |
| 04/19/2024 09:08:39.562694359 | 0.003 |
| 04/19/2024 09:08:40.579466693 | 0.003 |
| 04/19/2024 09:08:41.596247511 | 0.003 |
| 04/19/2024 09:08:42.613025056 | 0.003 |
| 04/19/2024 09:08:43.629806905 | 0.003 |
| 04/19/2024 09:08:44.646586874 | 0.003 |
| 04/19/2024 09:08:45.663361147 | 0.003 |
| 04/19/2024 09:08:46.680144389 | 0.003 |
| 04/19/2024 09:08:47.696928814 | 0.003 |
| 04/19/2024 09:08:48.713705238 | 0.003 |
| 04/19/2024 09:08:49.730483965 | 0.003 |
| 04/19/2024 09:08:50.747269753 | 0.003 |
| 04/19/2024 09:08:51.764045844 | 0.003 |
| 04/19/2024 09:08:52.780825268 | 0.003 |
| 04/19/2024 09:08:53.797606177 | 0.003 |
| 04/19/2024 09:08:54.814384844 | 0.003 |
| 04/19/2024 09:08:55.831167359 | 0.003 |
| 04/19/2024 09:08:56.847950329 | 0.003 |
| 04/19/2024 09:08:57.864730086 | 0.003 |
| 04/19/2024 09:08:58.881511299 | 0.003 |
| 04/19/2024 09:08:59.898293602 | 0.003 |
| 04/19/2024 09:09:00.915076056 | 0.003 |
| 04/19/2024 09:09:01.931858329 | 0.003 |
| 04/19/2024 09:09:02.948644086 | 0.003 |
| 04/19/2024 09:09:03.965415632 | 0.003 |
| 04/19/2024 09:09:04.982196723 | 0.003 |
| 04/19/2024 09:09:05.998979769 | 0.003 |
| 04/19/2024 09:09:07.015759435 | 0.003 |
| 04/19/2024 09:09:08.032538132 | 0.003 |
| 04/19/2024 09:09:09.049320799 | 0.003 |
| 04/19/2024 09:09:10.066103193 | 0.003 |
| 04/19/2024 09:09:11.082886587 | 0.003 |
| 04/19/2024 09:09:12.099664223 | 0.003 |
| 04/19/2024 09:09:13.116443708 | 0.003 |
| 04/19/2024 09:09:14.133229647 | 0.003 |
| 04/19/2024 09:09:15.150012223 | 0.003 |
| 04/19/2024 09:09:16.166795617 | 0.003 |
| 04/19/2024 09:09:17.183571041 | 0.003 |
| 04/19/2024 09:09:18.200353405 | 0.003 |
| 04/19/2024 09:09:19.217135526 | -0.007 |
| 04/19/2024 09:09:20.233912769 | 0.003 |
| 04/19/2024 09:09:21.250691496 | 0.003 |
| 04/19/2024 09:09:22.267463223 | 0.003 |
| 04/19/2024 09:09:23.284241708 | 0.003 |
| 04/19/2024 09:09:24.301026860 | 0.003 |
| 04/19/2024 09:09:25.317803496 | 0.003 |
| 04/19/2024 09:09:26.334582375 | 0.003 |
| 04/19/2024 09:09:27.351373314 | 0.003 |
| 04/19/2024 09:09:28.368154769 | 0.003 |
| 04/19/2024 09:09:29.384937405 | 0.003 |
| 04/19/2024 09:09:30.401709132 | 0.003 |
| 04/19/2024 09:09:31.418484557 | 0.003 |
| 04/19/2024 09:09:32.435255223 | 0.003 |
| 04/19/2024 09:09:33.452028314 | 0.003 |
| 04/19/2024 09:09:34.468798708 | 0.003 |
| 04/19/2024 09:09:35.485575768 | 0.003 |
| 04/19/2024 09:09:36.502355011 | 0.003 |
| 04/19/2024 09:09:37.519134041 | 0.003 |
| 04/19/2024 09:09:38.535912799 | 0.003 |
| 04/19/2024 09:09:39.552693677 | 0.003 |
| 04/19/2024 09:09:40.569463981 | 0.003 |
| 04/19/2024 09:09:41.586241496 | 0.003 |
| 04/19/2024 09:09:42.603021556 | 0.003 |
| 04/19/2024 09:09:43.619794587 | 0.003 |
| 04/19/2024 09:09:44.636578071 | 0.003 |
| 04/19/2024 09:09:45.653364677 | 0.003 |
| 04/19/2024 09:09:46.670137768 | 0.003 |
| 04/19/2024 09:09:47.686930768 | 0.003 |
| 04/19/2024 09:09:48.703717587 | 0.003 |
| 04/19/2024 09:09:49.720508859 | 0.003 |
| 04/19/2024 09:09:50.737299768 | 0.003 |
| 04/19/2024 09:09:51.754083344 | 0.003 |
| 04/19/2024 09:09:52.770881102 | 0.003 |
| 04/19/2024 09:09:53.787684829 | 0.003 |
| 04/19/2024 09:09:54.804465253 | 0.003 |
| 04/19/2024 09:09:55.821241465 | 0.003 |
| 04/19/2024 09:09:56.838023223 | 0.003 |
| 04/19/2024 09:09:57.854798344 | 0.003 |
| 04/19/2024 09:09:58.871570556 | 0.003 |
| 04/19/2024 09:09:59.888350768 | 0.003 |
| 04/19/2024 09:10:00.905135950 | 0.003 |
| 04/19/2024 09:10:01.921917102 | 0.003 |
| 04/19/2024 09:10:02.938697768 | 0.003 |
| 04/19/2024 09:10:03.955478223 | 0.003 |
| 04/19/2024 09:10:04.972258465 | 0.003 |
| 04/19/2024 09:10:05.989034678 | 0.003 |
| 04/19/2024 09:10:07.005818132 | 0.003 |
| 04/19/2024 09:10:08.022602102 | 0.003 |
| 04/19/2024 09:10:09.039383314 | 0.003 |
| 04/19/2024 09:10:10.056163496 | 0.003 |
| 04/19/2024 09:10:11.072940011 | 0.003 |
| 04/19/2024 09:10:12.089712314 | 0.003 |
| 04/19/2024 09:10:13.106494314 | 0.003 |
| 04/19/2024 09:10:14.123270314 | 0.003 |
| 04/19/2024 09:10:15.140054981 | 0.003 |
| 04/19/2024 09:10:16.156830617 | 0.003 |
| 04/19/2024 09:10:17.173602769 | 0.003 |
| 04/19/2024 09:10:18.190382496 | 0.003 |
| 04/19/2024 09:10:19.207157647 | 0.003 |
| 04/19/2024 09:10:20.223934678 | 0.003 |
| 04/19/2024 09:10:21.240717314 | 0.003 |
| 04/19/2024 09:10:22.257493920 | 0.003 |
| 04/19/2024 09:10:23.274270617 | 0.003 |
| 04/19/2024 09:10:24.291049738 | 0.003 |
| 04/19/2024 09:10:25.307831526 | 0.003 |
| 04/19/2024 09:10:26.324609162 | 0.003 |
| 04/19/2024 09:10:27.341391738 | 0.003 |
| 04/19/2024 09:10:28.358179556 | 0.003 |
| 04/19/2024 09:10:29.374953678 | 0.003 |
| 04/19/2024 09:10:30.391742284 | 0.003 |
| 04/19/2024 09:10:31.408515738 | 0.003 |
| 04/19/2024 09:10:32.425299799 | 0.003 |
| 04/19/2024 09:10:33.442071647 | 0.003 |
| 04/19/2024 09:10:34.458847344 | 0.003 |
| 04/19/2024 09:10:35.475619587 | 0.003 |
| 04/19/2024 09:10:36.492401436 | 0.003 |
| 04/19/2024 09:10:37.509184284 | 0.003 |
| 04/19/2024 09:10:38.525959405 | 0.003 |
| 04/19/2024 09:10:39.542740314 | 0.003 |
| 04/19/2024 09:10:40.559519133 | 0.003 |
| 04/19/2024 09:10:41.576295193 | 0.003 |
| 04/19/2024 09:10:42.593068587 | 0.003 |
| 04/19/2024 09:10:43.609844254 | 0.003 |
| 04/19/2024 09:10:44.626630436 | 0.003 |
| 04/19/2024 09:10:45.643415587 | 0.003 |
| 04/19/2024 09:10:46.660201254 | 0.003 |
| 04/19/2024 09:10:47.676974072 | -0.007 |
| 04/19/2024 09:10:48.693751254 | 0.003 |
| 04/19/2024 09:10:49.710538618 | 0.003 |
| 04/19/2024 09:10:50.727321405 | 0.003 |
| 04/19/2024 09:10:51.744102496 | 0.003 |
| 04/19/2024 09:10:52.760877708 | 0.003 |
| 04/19/2024 09:10:53.777658527 | 0.003 |
| 04/19/2024 09:10:54.794438527 | 0.003 |
| 04/19/2024 09:10:55.811213496 | 0.003 |
| 04/19/2024 09:10:56.827989042 | 0.003 |
| 04/19/2024 09:10:57.844772739 | 0.003 |
| 04/19/2024 09:10:58.861547618 | 0.003 |
| 04/19/2024 09:10:59.878323405 | 0.003 |
| 04/19/2024 09:11:00.895104345 | 0.003 |
| 04/19/2024 09:11:01.911885405 | 0.003 |
| 04/19/2024 09:11:02.928670527 | 0.003 |
| 04/19/2024 09:11:03.945456618 | 0.003 |
| 04/19/2024 09:11:04.962239587 | 0.003 |
| 04/19/2024 09:11:05.979012557 | 0.003 |
| 04/19/2024 09:11:06.995793496 | 0.003 |
| 04/19/2024 09:11:08.012574041 | 0.003 |
| 04/19/2024 09:11:09.029357041 | 0.003 |
| 04/19/2024 09:11:10.046138708 | 0.003 |
| 04/19/2024 09:11:11.062907951 | 0.003 |
| 04/19/2024 09:11:12.079679951 | 0.003 |
| 04/19/2024 09:11:13.096463193 | 0.003 |
| 04/19/2024 09:11:14.113248860 | 0.003 |
| 04/19/2024 09:11:15.130024708 | 0.003 |
| 04/19/2024 09:11:16.146812405 | 0.003 |
| 04/19/2024 09:11:17.163589981 | 0.003 |
| 04/19/2024 09:11:18.180372254 | 0.003 |
| 04/19/2024 09:11:19.197150526 | 0.003 |
| 04/19/2024 09:11:20.213924951 | 0.003 |
| 04/19/2024 09:11:21.230707617 | 0.003 |
| 04/19/2024 09:11:22.247487132 | 0.003 |
| 04/19/2024 09:11:23.264264708 | -0.007 |
| 04/19/2024 09:11:24.281038193 | 0.003 |
| 04/19/2024 09:11:25.297818557 | 0.003 |
| 04/19/2024 09:11:26.314597284 | 0.003 |
| 04/19/2024 09:11:27.331375829 | 0.003 |
| 04/19/2024 09:11:28.348158072 | 0.003 |
| 04/19/2024 09:11:29.364940890 | 0.003 |
| 04/19/2024 09:11:30.381713163 | 0.003 |
| 04/19/2024 09:11:31.398498890 | 0.003 |
| 04/19/2024 09:11:32.415271526 | 0.003 |
| 04/19/2024 09:11:33.432046011 | 0.003 |
| 04/19/2024 09:11:34.448822769 | 0.003 |
| 04/19/2024 09:11:35.465595874 | 0.003 |
| 04/19/2024 09:11:36.482372359 | 0.003 |
| 04/19/2024 09:11:37.499154268 | 0.003 |
| 04/19/2024 09:11:38.515931723 | 0.003 |
| 04/19/2024 09:11:39.532707662 | 0.003 |
| 04/19/2024 09:11:40.549488117 | 0.003 |
| 04/19/2024 09:11:41.566264268 | 0.003 |
| 04/19/2024 09:11:42.583039420 | 0.003 |
| 04/19/2024 09:11:43.599817814 | 0.003 |
| 04/19/2024 09:11:44.616595086 | 0.003 |
| 04/19/2024 09:11:45.633371329 | 0.003 |
| 04/19/2024 09:11:46.650154511 | 0.003 |
| 04/19/2024 09:11:47.666932844 | 0.003 |
| 04/19/2024 09:11:48.683705056 | 0.003 |
| 04/19/2024 09:11:49.700489935 | 0.003 |
| 04/19/2024 09:11:50.717265571 | 0.003 |
| 04/19/2024 09:11:51.734043299 | 0.003 |
| 04/19/2024 09:11:52.750823086 | 0.003 |
| 04/19/2024 09:11:53.767599056 | 0.003 |
| 04/19/2024 09:11:54.784375329 | 0.003 |
| 04/19/2024 09:11:55.801151662 | 0.003 |
| 04/19/2024 09:11:56.817928086 | 0.003 |
| 04/19/2024 09:11:57.834704480 | 0.003 |
| 04/19/2024 09:11:58.851482480 | 0.003 |
| 04/19/2024 09:11:59.868260480 | 0.003 |
| 04/19/2024 09:12:00.885034450 | 0.003 |
| 04/19/2024 09:12:01.901812056 | 0.003 |
| 04/19/2024 09:12:02.918592692 | 0.003 |
| 04/19/2024 09:12:03.935373783 | 0.003 |
| 04/19/2024 09:12:04.952157299 | 0.003 |
| 04/19/2024 09:12:05.968937814 | 0.003 |
| 04/19/2024 09:12:06.985708117 | 0.003 |
| 04/19/2024 09:12:08.002491905 | 0.003 |
| 04/19/2024 09:12:09.019268844 | 0.003 |
| 04/19/2024 09:12:10.036042632 | 0.003 |
| 04/19/2024 09:12:11.052825026 | 0.003 |
| 04/19/2024 09:12:12.069599693 | 0.003 |
| 04/19/2024 09:12:13.086374814 | 0.003 |
| 04/19/2024 09:12:14.103151632 | 0.003 |
| 04/19/2024 09:12:15.119927693 | 0.003 |
| 04/19/2024 09:12:16.136707268 | 0.003 |
| 04/19/2024 09:12:17.153485905 | 0.003 |
| 04/19/2024 09:12:18.170271117 | 0.003 |
| 04/19/2024 09:12:19.187042359 | 0.003 |
| 04/19/2024 09:12:20.203821299 | 0.003 |
| 04/19/2024 09:12:21.220605420 | 0.003 |
| 04/19/2024 09:12:22.237379662 | 0.003 |
| 04/19/2024 09:12:23.254158844 | 0.003 |
| 04/19/2024 09:12:24.270944450 | 0.003 |
| 04/19/2024 09:12:25.287719420 | 0.003 |
| 04/19/2024 09:12:26.304499026 | 0.003 |
| 04/19/2024 09:12:27.321277087 | 0.003 |
| 04/19/2024 09:12:28.338055480 | 0.003 |
| 04/19/2024 09:12:29.354836117 | 0.003 |
| 04/19/2024 09:12:30.371613723 | 0.003 |
| 04/19/2024 09:12:31.388390147 | 0.003 |
| 04/19/2024 09:12:32.405171450 | 0.003 |
| 04/19/2024 09:12:33.421953450 | 0.003 |
| 04/19/2024 09:12:34.438729299 | 0.003 |
| 04/19/2024 09:12:35.455511041 | 0.003 |
| 04/19/2024 09:12:36.472287950 | 0.003 |
| 04/19/2024 09:12:37.489063435 | 0.003 |
| 04/19/2024 09:12:38.505836708 | 0.003 |
| 04/19/2024 09:12:39.522616314 | 0.003 |
| 04/19/2024 09:12:40.539398466 | 0.003 |
| 04/19/2024 09:12:41.556175132 | 0.003 |
| 04/19/2024 09:12:42.572957011 | 0.003 |
| 04/19/2024 09:12:43.589731435 | 0.003 |
| 04/19/2024 09:12:44.606509860 | 0.003 |
| 04/19/2024 09:12:45.623284435 | 0.003 |
| 04/19/2024 09:12:46.640060557 | 0.003 |
| 04/19/2024 09:12:47.656836132 | 0.003 |
| 04/19/2024 09:12:48.673617102 | 0.003 |
| 04/19/2024 09:12:49.690401678 | 0.003 |
| 04/19/2024 09:12:50.707180435 | 0.003 |
| 04/19/2024 09:12:51.723954860 | 0.003 |
| 04/19/2024 09:12:52.740738102 | 0.003 |
| 04/19/2024 09:12:53.757518829 | 0.003 |
| 04/19/2024 09:12:54.774290981 | 0.003 |
| 04/19/2024 09:12:55.791067284 | 0.003 |
| 04/19/2024 09:12:56.807843223 | 0.003 |
| 04/19/2024 09:12:57.824623375 | 0.003 |
| 04/19/2024 09:12:58.841403738 | 0.003 |
| 04/19/2024 09:12:59.858185496 | 0.003 |
| 04/19/2024 09:13:00.874968344 | 0.003 |
| 04/19/2024 09:13:01.891740223 | 0.003 |
| 04/19/2024 09:13:02.908520284 | 0.003 |
| 04/19/2024 09:13:03.925303011 | 0.003 |
| 04/19/2024 09:13:04.942081678 | 0.003 |
| 04/19/2024 09:13:05.958864042 | 0.003 |
| 04/19/2024 09:13:06.975645163 | 0.003 |
| 04/19/2024 09:13:07.992425314 | 0.003 |
| 04/19/2024 09:13:09.009202254 | 0.003 |
| 04/19/2024 09:13:10.025978072 | 0.003 |
| 04/19/2024 09:13:11.042761224 | 0.003 |
| 04/19/2024 09:13:12.059540739 | 0.003 |
| 04/19/2024 09:13:13.076319557 | 0.003 |
| 04/19/2024 09:13:14.093094739 | 0.003 |
| 04/19/2024 09:13:15.109872587 | 0.003 |
| 04/19/2024 09:13:16.126655133 | 0.003 |
| 04/19/2024 09:13:17.143435920 | 0.003 |
| 04/19/2024 09:13:18.160211799 | 0.003 |
| 04/19/2024 09:13:19.176997739 | 0.003 |
| 04/19/2024 09:13:20.193773920 | 0.003 |
| 04/19/2024 09:13:21.210558314 | 0.003 |
| 04/19/2024 09:13:22.227336920 | 0.003 |
| 04/19/2024 09:13:23.244116648 | 0.003 |
| 04/19/2024 09:13:24.260897739 | 0.003 |
| 04/19/2024 09:13:25.277674436 | 0.003 |
| 04/19/2024 09:13:26.294453254 | 0.003 |
| 04/19/2024 09:13:27.311232951 | 0.003 |
| 04/19/2024 09:13:28.328007496 | 0.003 |
| 04/19/2024 09:13:29.344787011 | 0.003 |
| 04/19/2024 09:13:30.361560951 | 0.003 |
| 04/19/2024 09:13:31.378337405 | 0.003 |
| 04/19/2024 09:13:32.395116193 | 0.003 |
| 04/19/2024 09:13:33.411890617 | 0.003 |
| 04/19/2024 09:13:34.428669951 | 0.003 |
| 04/19/2024 09:13:35.445453344 | 0.003 |
| 04/19/2024 09:13:36.462232617 | 0.003 |
| 04/19/2024 09:13:37.479013011 | 0.003 |
| 04/19/2024 09:13:38.495789314 | 0.003 |
| 04/19/2024 09:13:39.512570526 | 0.003 |
| 04/19/2024 09:13:40.529346496 | 0.003 |
| 04/19/2024 09:13:41.546125617 | 0.003 |
| 04/19/2024 09:13:42.562904102 | 0.003 |
| 04/19/2024 09:13:43.579677132 | 0.003 |
| 04/19/2024 09:13:44.596452132 | 0.003 |
| 04/19/2024 09:13:45.613228435 | 0.003 |
| 04/19/2024 09:13:46.630005011 | 0.003 |
| 04/19/2024 09:13:47.646782435 | 0.003 |
| 04/19/2024 09:13:48.663559193 | 0.003 |
| 04/19/2024 09:13:49.680341829 | 0.003 |
| 04/19/2024 09:13:50.697120405 | 0.003 |
| 04/19/2024 09:13:51.713894435 | 0.003 |
| 04/19/2024 09:13:52.730673738 | 0.003 |
| 04/19/2024 09:13:53.747452799 | 0.003 |
| 04/19/2024 09:13:54.764228344 | 0.003 |
| 04/19/2024 09:13:55.781007284 | 0.003 |
| 04/19/2024 09:13:56.797785223 | 0.003 |
| 04/19/2024 09:13:57.814564253 | 0.003 |
| 04/19/2024 09:13:58.831345314 | 0.003 |
| 04/19/2024 09:13:59.848123223 | 0.003 |
| 04/19/2024 09:14:00.864907556 | 0.003 |
| 04/19/2024 09:14:01.881684647 | 0.003 |
| 04/19/2024 09:14:02.898469132 | 0.003 |
| 04/19/2024 09:14:03.915241981 | 0.003 |
| 04/19/2024 09:14:04.932025981 | 0.003 |
| 04/19/2024 09:14:05.948808269 | 0.003 |
| 04/19/2024 09:14:06.965584602 | 0.003 |
| 04/19/2024 09:14:07.982364330 | 0.003 |
| 04/19/2024 09:14:08.999139754 | 0.003 |
| 04/19/2024 09:14:10.015913087 | 0.003 |
| 04/19/2024 09:14:11.032694451 | 0.003 |
| 04/19/2024 09:14:12.049471087 | 0.003 |
| 04/19/2024 09:14:13.066242754 | 0.003 |
| 04/19/2024 09:14:14.083024208 | 0.003 |
| 04/19/2024 09:14:15.099801966 | 0.003 |
| 04/19/2024 09:14:16.116580511 | 0.003 |
| 04/19/2024 09:14:17.133353087 | 0.003 |
| 04/19/2024 09:14:18.150129754 | 0.003 |
| 04/19/2024 09:14:19.166908602 | 0.003 |
| 04/19/2024 09:14:20.183693633 | 0.003 |
| 04/19/2024 09:14:21.200476875 | 0.003 |
| 04/19/2024 09:14:22.217252693 | 0.003 |
| 04/19/2024 09:14:23.234027572 | 0.003 |
| 04/19/2024 09:14:24.250811572 | 0.003 |
| 04/19/2024 09:14:25.267587208 | 0.003 |
| 04/19/2024 09:14:26.284362996 | 0.003 |
| 04/19/2024 09:14:27.301135996 | 0.003 |
| 04/19/2024 09:14:28.317909693 | 0.003 |
| 04/19/2024 09:14:29.334686451 | 0.003 |
| 04/19/2024 09:14:30.351465420 | 0.003 |
| 04/19/2024 09:14:31.368243269 | 0.003 |
| 04/19/2024 09:14:32.385022633 | 0.003 |
| 04/19/2024 09:14:33.401804693 | 0.003 |
| 04/19/2024 09:14:34.418576330 | 0.003 |
| 04/19/2024 09:14:35.435357405 | 0.003 |
| 04/19/2024 09:14:36.452137041 | 0.003 |
| 04/19/2024 09:14:37.468917314 | 0.003 |
| 04/19/2024 09:14:38.485697890 | 0.003 |
| 04/19/2024 09:14:39.502479738 | 0.003 |
| 04/19/2024 09:14:40.519253859 | 0.003 |
| 04/19/2024 09:14:41.536030193 | 0.003 |
| 04/19/2024 09:14:42.552811435 | 0.003 |
| 04/19/2024 09:14:43.569585193 | 0.003 |
| 04/19/2024 09:14:44.586359465 | 0.003 |
| 04/19/2024 09:14:45.603132980 | 0.003 |
| 04/19/2024 09:14:46.619909223 | 0.003 |
| 04/19/2024 09:14:47.636683799 | 0.003 |
| 04/19/2024 09:14:48.653459829 | 0.003 |
| 04/19/2024 09:14:49.670237102 | 0.003 |
| 04/19/2024 09:14:50.687019980 | 0.003 |
| 04/19/2024 09:14:51.703798768 | 0.003 |
| 04/19/2024 09:14:52.720586617 | 0.003 |
| 04/19/2024 09:14:53.737364041 | 0.003 |
| 04/19/2024 09:14:54.754140950 | 0.003 |
| 04/19/2024 09:14:55.770922344 | 0.003 |
| 04/19/2024 09:14:56.787700132 | 0.003 |
| 04/19/2024 09:14:57.804475102 | 0.003 |
| 04/19/2024 09:14:58.821250405 | 0.003 |
| 04/19/2024 09:14:59.838026435 | 0.003 |
| 04/19/2024 09:15:00.854807132 | 0.003 |
| 04/19/2024 09:15:01.871584405 | 0.003 |
| 04/19/2024 09:15:02.888366586 | 0.003 |
| 04/19/2024 09:15:03.905141283 | 0.003 |
| 04/19/2024 09:15:04.921912526 | 0.003 |
| 04/19/2024 09:15:05.938698420 | 0.003 |
| 04/19/2024 09:15:06.955480420 | 0.003 |
| 04/19/2024 09:15:07.972256723 | 0.003 |
| 04/19/2024 09:15:08.989044693 | 0.003 |
| 04/19/2024 09:15:10.005823693 | 0.003 |
| 04/19/2024 09:15:11.022606238 | 0.003 |
| 04/19/2024 09:15:12.039382723 | 0.003 |
| 04/19/2024 09:15:13.056157269 | 0.003 |
| 04/19/2024 09:15:14.072933723 | 0.003 |
| 04/19/2024 09:15:15.089706602 | 0.003 |
| 04/19/2024 09:15:16.106486844 | 0.003 |
| 04/19/2024 09:15:17.123261360 | 0.003 |
| 04/19/2024 09:15:18.140033057 | 0.003 |
| 04/19/2024 09:15:19.156809147 | 0.003 |
| 04/19/2024 09:15:20.173583481 | 0.003 |
| 04/19/2024 09:15:21.190367208 | 0.003 |
| 04/19/2024 09:15:22.207139541 | 0.003 |
| 04/19/2024 09:15:23.223908814 | 0.003 |
| 04/19/2024 09:15:24.240689329 | 0.003 |
| 04/19/2024 09:15:25.257466784 | 0.003 |
| 04/19/2024 09:15:26.274239057 | 0.003 |
| 04/19/2024 09:15:27.291023541 | 0.003 |
| 04/19/2024 09:15:28.307798451 | 0.003 |
| 04/19/2024 09:15:29.324577057 | 0.003 |
| 04/19/2024 09:15:30.341352208 | 0.003 |
| 04/19/2024 09:15:31.358129602 | 0.003 |
| 04/19/2024 09:15:32.374906875 | 0.003 |
| 04/19/2024 09:15:33.391686329 | 0.003 |
| 04/19/2024 09:15:34.408469238 | 0.003 |
| 04/19/2024 09:15:35.425241541 | 0.003 |
| 04/19/2024 09:15:36.442011693 | 0.003 |
| 04/19/2024 09:15:37.458794874 | 0.003 |
| 04/19/2024 09:15:38.475573147 | 0.003 |
| 04/19/2024 09:15:39.492355238 | 0.003 |
| 04/19/2024 09:15:40.509126329 | 0.003 |
| 04/19/2024 09:15:41.525904632 | 0.003 |
| 04/19/2024 09:15:42.542684480 | 0.003 |
| 04/19/2024 09:15:43.559458965 | 0.003 |
| 04/19/2024 09:15:44.576227117 | 0.003 |
| 04/19/2024 09:15:45.593011662 | 0.003 |
| 04/19/2024 09:15:46.609787480 | 0.003 |
| 04/19/2024 09:15:47.626567844 | 0.003 |
| 04/19/2024 09:15:48.643344299 | 0.003 |
| 04/19/2024 09:15:49.660115996 | 0.003 |
| 04/19/2024 09:15:50.676903450 | 0.003 |
| 04/19/2024 09:15:51.693681723 | 0.003 |
| 04/19/2024 09:15:52.710465056 | 0.003 |
| 04/19/2024 09:15:53.727236420 | 0.003 |
| 04/19/2024 09:15:54.744013541 | 0.003 |
| 04/19/2024 09:15:55.760791480 | 0.003 |
| 04/19/2024 09:15:56.777565390 | 0.003 |
| 04/19/2024 09:15:57.794346814 | 0.003 |
| 04/19/2024 09:15:58.811120814 | 0.003 |
| 04/19/2024 09:15:59.827897208 | 0.003 |
| 04/19/2024 09:16:00.844680359 | 0.003 |
| 04/19/2024 09:16:01.861457965 | 0.003 |
| 04/19/2024 09:16:02.878235874 | 0.003 |
| 04/19/2024 09:16:03.895019390 | 0.003 |
| 04/19/2024 09:16:04.911798329 | 0.003 |
| 04/19/2024 09:16:05.928580314 | 0.003 |
| 04/19/2024 09:16:06.945354527 | 0.003 |
| 04/19/2024 09:16:07.962135739 | 0.003 |
| 04/19/2024 09:16:08.978918284 | 0.003 |
| 04/19/2024 09:16:09.995703769 | 0.003 |
| 04/19/2024 09:16:11.012483072 | 0.003 |
| 04/19/2024 09:16:12.029260527 | 0.003 |
| 04/19/2024 09:16:13.046037011 | 0.003 |
| 04/19/2024 09:16:14.062815921 | 0.003 |
| 04/19/2024 09:16:15.079590193 | 0.003 |
| 04/19/2024 09:16:16.096368527 | 0.003 |
| 04/19/2024 09:16:17.113154072 | 0.003 |
| 04/19/2024 09:16:18.129926648 | 0.003 |
| 04/19/2024 09:16:19.146702830 | 0.003 |
| 04/19/2024 09:16:20.163478133 | 0.003 |
| 04/19/2024 09:16:21.180251496 | 0.003 |
| 04/19/2024 09:16:22.197029951 | 0.003 |
| 04/19/2024 09:16:23.213819011 | 0.003 |
| 04/19/2024 09:16:24.230602102 | 0.003 |
| 04/19/2024 09:16:25.247379587 | 0.003 |
| 04/19/2024 09:16:26.264152254 | 0.003 |
| 04/19/2024 09:16:27.280939678 | 0.003 |
| 04/19/2024 09:16:28.297718860 | 0.003 |
| 04/19/2024 09:16:29.314493254 | 0.003 |
| 04/19/2024 09:16:30.331270072 | 0.003 |
| 04/19/2024 09:16:31.348047678 | 0.003 |
| 04/19/2024 09:16:32.364824102 | 0.003 |
| 04/19/2024 09:16:33.381603254 | 0.003 |
| 04/19/2024 09:16:34.398387587 | 0.003 |
| 04/19/2024 09:16:35.415169587 | 0.003 |
| 04/19/2024 09:16:36.431946708 | 0.003 |
| 04/19/2024 09:16:37.448721193 | 0.003 |
| 04/19/2024 09:16:38.465501162 | 0.003 |
| 04/19/2024 09:16:39.482282981 | 0.003 |
| 04/19/2024 09:16:40.499070496 | 0.003 |
| 04/19/2024 09:16:41.515852132 | 0.003 |
| 04/19/2024 09:16:42.532632526 | 0.003 |
| 04/19/2024 09:16:43.549411556 | 0.003 |
| 04/19/2024 09:16:44.566186435 | 0.003 |
| 04/19/2024 09:16:45.582969556 | 0.003 |
| 04/19/2024 09:16:46.599747799 | 0.003 |
| 04/19/2024 09:16:47.616522193 | 0.003 |
| 04/19/2024 09:16:48.633293344 | 0.003 |
| 04/19/2024 09:16:49.650069223 | 0.003 |
| 04/19/2024 09:16:50.666841465 | 0.003 |
| 04/19/2024 09:16:51.683615617 | 0.003 |
| 04/19/2024 09:16:52.700392678 | 0.003 |
| 04/19/2024 09:16:53.717175799 | 0.003 |
| 04/19/2024 09:16:54.733947920 | 0.003 |
| 04/19/2024 09:16:55.750733526 | 0.003 |
| 04/19/2024 09:16:56.767519738 | 0.003 |
| 04/19/2024 09:16:57.784294041 | 0.003 |
| 04/19/2024 09:16:58.801080041 | 0.003 |
| 04/19/2024 09:16:59.817855132 | 0.003 |
| 04/19/2024 09:17:00.834629617 | 0.003 |
| 04/19/2024 09:17:01.851408102 | 0.003 |
| 04/19/2024 09:17:02.868184526 | 0.003 |
| 04/19/2024 09:17:03.884959587 | 0.003 |
| 04/19/2024 09:17:04.901741920 | 0.003 |
| 04/19/2024 09:17:05.918521648 | 0.003 |
| 04/19/2024 09:17:06.935296769 | 0.003 |
| 04/19/2024 09:17:07.952072041 | 0.003 |
| 04/19/2024 09:17:08.968856405 | 0.003 |
| 04/19/2024 09:17:09.985635345 | 0.003 |
| 04/19/2024 09:17:11.002416587 | 0.003 |
| 04/19/2024 09:17:12.019197617 | 0.003 |
| 04/19/2024 09:17:13.035973951 | 0.003 |
| 04/19/2024 09:17:14.052758041 | 0.003 |
| 04/19/2024 09:17:15.069530981 | 0.003 |
| 04/19/2024 09:17:16.086305223 | 0.003 |
| 04/19/2024 09:17:17.103084920 | 0.003 |
| 04/19/2024 09:17:18.119861587 | 0.003 |
| 04/19/2024 09:17:19.136639405 | 0.003 |
| 04/19/2024 09:17:20.153418102 | 0.003 |
| 04/19/2024 09:17:21.170198345 | 0.003 |
| 04/19/2024 09:17:22.186978587 | 0.003 |
| 04/19/2024 09:17:23.203758375 | 0.003 |
| 04/19/2024 09:17:24.220547435 | 0.003 |
| 04/19/2024 09:17:25.237317678 | 0.003 |
| 04/19/2024 09:17:26.254092648 | 0.003 |
| 04/19/2024 09:17:27.270874375 | 0.003 |
| 04/19/2024 09:17:28.287652799 | 0.003 |
| 04/19/2024 09:17:29.304431496 | 0.003 |
| 04/19/2024 09:17:30.321212557 | 0.003 |
| 04/19/2024 09:17:31.337985466 | 0.003 |
| 04/19/2024 09:17:32.354764223 | 0.003 |
| 04/19/2024 09:17:33.371543496 | 0.003 |
| 04/19/2024 09:17:34.388321041 | 0.003 |
| 04/19/2024 09:17:35.405106708 | 0.003 |
| 04/19/2024 09:17:36.421878496 | 0.003 |
| 04/19/2024 09:17:37.438654920 | 0.003 |
| 04/19/2024 09:17:38.455432102 | 0.003 |
| 04/19/2024 09:17:39.472216223 | 0.003 |
| 04/19/2024 09:17:40.489000920 | 0.003 |
| 04/19/2024 09:17:41.505783708 | 0.003 |
| 04/19/2024 09:17:42.522571799 | 0.003 |
| 04/19/2024 09:17:43.539346375 | 0.003 |
| 04/19/2024 09:17:44.556123041 | 0.003 |
| 04/19/2024 09:17:45.572902193 | 0.003 |
| 04/19/2024 09:17:46.589678011 | 0.003 |
| 04/19/2024 09:17:47.606457435 | 0.003 |
| 04/19/2024 09:17:48.623240981 | 0.003 |
| 04/19/2024 09:17:49.640013799 | 0.003 |
| 04/19/2024 09:17:50.656791951 | 0.003 |
| 04/19/2024 09:17:51.673563981 | 0.003 |
| 04/19/2024 09:17:52.690340163 | 0.003 |
| 04/19/2024 09:17:53.707119829 | 0.003 |
| 04/19/2024 09:17:54.723903102 | 0.003 |
| 04/19/2024 09:17:55.740686132 | 0.003 |
| 04/19/2024 09:17:56.757460526 | 0.003 |
| 04/19/2024 09:17:57.774233557 | 0.003 |
| 04/19/2024 09:17:58.791011526 | 0.003 |
| 04/19/2024 09:17:59.807790587 | 0.003 |
| 04/19/2024 09:18:00.824568223 | 0.003 |
| 04/19/2024 09:18:01.841342375 | 0.003 |
| 04/19/2024 09:18:02.858120132 | 0.003 |
| 04/19/2024 09:18:03.874896951 | 0.003 |
| 04/19/2024 09:18:04.891676617 | 0.003 |
| 04/19/2024 09:18:05.908459950 | 0.003 |
| 04/19/2024 09:18:06.925238223 | 0.003 |
| 04/19/2024 09:18:07.942010314 | 0.003 |
| 04/19/2024 09:18:08.958785950 | 0.003 |
| 04/19/2024 09:18:09.975565435 | 0.003 |
| 04/19/2024 09:18:10.992344950 | 0.003 |
| 04/19/2024 09:18:12.009128738 | 0.003 |
| 04/19/2024 09:18:13.025911283 | 0.003 |
| 04/19/2024 09:18:14.042693435 | 0.003 |
| 04/19/2024 09:18:15.059468859 | 0.003 |
| 04/19/2024 09:18:16.076244162 | 0.003 |
| 04/19/2024 09:18:17.093028193 | 0.003 |
| 04/19/2024 09:18:18.109804708 | 0.003 |
| 04/19/2024 09:18:19.126582708 | 0.003 |
| 04/19/2024 09:18:20.143359465 | 0.003 |
| 04/19/2024 09:18:21.160135344 | 0.003 |
| 04/19/2024 09:18:22.176910526 | 0.003 |
| 04/19/2024 09:18:23.193688465 | 0.003 |
| 04/19/2024 09:18:24.210477193 | 0.003 |
| 04/19/2024 09:18:25.227264435 | 0.003 |
| 04/19/2024 09:18:26.244044041 | 0.003 |
| 04/19/2024 09:18:27.260828162 | 0.003 |
| 04/19/2024 09:18:28.277601283 | 0.003 |
| 04/19/2024 09:18:29.294379253 | 0.003 |
| 04/19/2024 09:18:30.311162132 | 0.003 |
| 04/19/2024 09:18:31.327939768 | 0.003 |
| 04/19/2024 09:18:32.344721344 | 0.003 |
| 04/19/2024 09:18:33.361498465 | 0.003 |
| 04/19/2024 09:18:34.378277314 | 0.003 |
| 04/19/2024 09:18:35.395059208 | 0.003 |
| 04/19/2024 09:18:36.411841087 | 0.003 |
| 04/19/2024 09:18:37.428617966 | 0.003 |
| 04/19/2024 09:18:38.445394542 | 0.003 |
| 04/19/2024 09:18:39.462166451 | 0.003 |
| 04/19/2024 09:18:40.478946936 | 0.003 |
| 04/19/2024 09:18:41.495730118 | 0.003 |
| 04/19/2024 09:18:42.512511633 | 0.003 |
| 04/19/2024 09:18:43.529293269 | 0.003 |
| 04/19/2024 09:18:44.546068784 | 0.003 |
| 04/19/2024 09:18:45.562851693 | 0.003 |
| 04/19/2024 09:18:46.579624572 | 0.003 |
| 04/19/2024 09:18:47.596405087 | -0.007 |
| 04/19/2024 09:18:48.613188299 | 0.003 |
| 04/19/2024 09:18:49.629962754 | 0.003 |
| 04/19/2024 09:18:50.646742481 | 0.003 |
| 04/19/2024 09:18:51.663519451 | 0.003 |
| 04/19/2024 09:18:52.680296875 | 0.003 |
| 04/19/2024 09:18:53.697077542 | 0.003 |
| 04/19/2024 09:18:54.713854057 | 0.003 |
| 04/19/2024 09:18:55.730638299 | 0.003 |
| 04/19/2024 09:18:56.747416572 | 0.003 |
| 04/19/2024 09:18:57.764186815 | 0.003 |
| 04/19/2024 09:18:58.780966602 | 0.003 |
| 04/19/2024 09:18:59.797746602 | 0.003 |
| 04/19/2024 09:19:00.814523451 | 0.003 |
| 04/19/2024 09:19:01.831305542 | 0.003 |
| 04/19/2024 09:19:02.848082299 | 0.003 |
| 04/19/2024 09:19:03.864858936 | -0.007 |
| 04/19/2024 09:19:04.881634542 | 0.003 |
| 04/19/2024 09:19:05.898415678 | 0.003 |
| 04/19/2024 09:19:06.915198769 | 0.003 |
| 04/19/2024 09:19:07.931978072 | 0.003 |
| 04/19/2024 09:19:08.948758254 | 0.003 |
| 04/19/2024 09:19:09.965530708 | 0.003 |
| 04/19/2024 09:19:10.982311981 | 0.003 |
| 04/19/2024 09:19:11.999102981 | 0.003 |
| 04/19/2024 09:19:13.015886648 | 0.003 |
| 04/19/2024 09:19:14.032667254 | 0.003 |
| 04/19/2024 09:19:15.049443829 | 0.003 |
| 04/19/2024 09:19:16.066220648 | 0.003 |
| 04/19/2024 09:19:17.083000405 | 0.003 |
| 04/19/2024 09:19:18.099779344 | 0.003 |
| 04/19/2024 09:19:19.116555708 | 0.003 |
| 04/19/2024 09:19:20.133333557 | 0.003 |
| 04/19/2024 09:19:21.150107375 | 0.003 |
| 04/19/2024 09:19:22.166884860 | 0.003 |
| 04/19/2024 09:19:23.183660799 | 0.003 |
| 04/19/2024 09:19:24.200437435 | 0.003 |
| 04/19/2024 09:19:25.217213254 | 0.003 |
| 04/19/2024 09:19:26.233995132 | 0.003 |
| 04/19/2024 09:19:27.250779860 | 0.003 |
| 04/19/2024 09:19:28.267552860 | 0.003 |
| 04/19/2024 09:19:29.284323738 | 0.003 |
| 04/19/2024 09:19:30.301106981 | 0.003 |
| 04/19/2024 09:19:31.317886951 | 0.003 |
| 04/19/2024 09:19:32.334662617 | 0.003 |
| 04/19/2024 09:19:33.351436435 | 0.003 |
| 04/19/2024 09:19:34.368216102 | 0.003 |
| 04/19/2024 09:19:35.384993799 | -0.007 |
| 04/19/2024 09:19:36.401776920 | 0.003 |
| 04/19/2024 09:19:37.418557950 | 0.003 |
| 04/19/2024 09:19:38.435332829 | 0.003 |
| 04/19/2024 09:19:39.452107768 | 0.003 |
| 04/19/2024 09:19:40.468883162 | 0.003 |
| 04/19/2024 09:19:41.485659647 | -0.007 |
| 04/19/2024 09:19:42.502445859 | 0.003 |
| 04/19/2024 09:19:43.519226496 | 0.003 |
| 04/19/2024 09:19:44.536008314 | 0.003 |
| 04/19/2024 09:19:45.552790193 | 0.003 |
| 04/19/2024 09:19:46.569562496 | 0.003 |
| 04/19/2024 09:19:47.586339344 | 0.003 |
| 04/19/2024 09:19:48.603123374 | 0.003 |
| 04/19/2024 09:19:49.619895374 | 0.003 |
| 04/19/2024 09:19:50.636674344 | 0.003 |
| 04/19/2024 09:19:51.653446374 | 0.003 |
| 04/19/2024 09:19:52.670225223 | 0.003 |
| 04/19/2024 09:19:53.687003496 | 0.003 |
| 04/19/2024 09:19:54.703783102 | 0.003 |
| 04/19/2024 09:19:55.720563041 | 0.003 |
| 04/19/2024 09:19:56.737338708 | 0.003 |
| 04/19/2024 09:19:57.754113344 | 0.003 |
| 04/19/2024 09:19:58.770893980 | 0.003 |
| 04/19/2024 09:19:59.787667708 | -0.007 |
| 04/19/2024 09:20:00.804444556 | 0.003 |
| 04/19/2024 09:20:01.821225799 | 0.003 |
| 04/19/2024 09:20:02.837998768 | 0.003 |
| 04/19/2024 09:20:03.854778314 | 0.003 |
| 04/19/2024 09:20:04.871554617 | 0.003 |
| 04/19/2024 09:20:05.888329239 | 0.003 |
| 04/19/2024 09:20:06.905110572 | 0.003 |
| 04/19/2024 09:20:07.921890390 | 0.003 |
| 04/19/2024 09:20:08.938667905 | 0.003 |
| 04/19/2024 09:20:09.955445602 | 0.003 |
| 04/19/2024 09:20:10.972218815 | 0.003 |
| 04/19/2024 09:20:11.988999239 | 0.003 |
| 04/19/2024 09:20:13.005782966 | 0.003 |
| 04/19/2024 09:20:14.022561118 | 0.003 |
| 04/19/2024 09:20:15.039345572 | 0.003 |
| 04/19/2024 09:20:16.056116693 | 0.003 |
| 04/19/2024 09:20:17.072898966 | 0.003 |
| 04/19/2024 09:20:18.089676057 | 0.003 |
| 04/19/2024 09:20:19.106453057 | 0.003 |
| 04/19/2024 09:20:20.123237754 | -0.007 |
| 04/19/2024 09:20:21.140012239 | 0.003 |
| 04/19/2024 09:20:22.156789905 | 0.003 |
| 04/19/2024 09:20:23.173562905 | 0.003 |
| 04/19/2024 09:20:24.190335815 | 0.003 |
| 04/19/2024 09:20:25.207115815 | 0.003 |
| 04/19/2024 09:20:26.223894693 | 0.003 |
| 04/19/2024 09:20:27.240672602 | 0.003 |
| 04/19/2024 09:20:28.257449360 | 0.003 |
| 04/19/2024 09:20:29.274226724 | 0.003 |
| 04/19/2024 09:20:30.291007360 | 0.003 |
| 04/19/2024 09:20:31.307782905 | 0.003 |
| 04/19/2024 09:20:32.324552633 | 0.003 |
| 04/19/2024 09:20:33.341332209 | 0.003 |
| 04/19/2024 09:20:34.358104815 | 0.003 |
| 04/19/2024 09:20:35.374879390 | 0.003 |
| 04/19/2024 09:20:36.391662329 | 0.003 |
| 04/19/2024 09:20:37.408444784 | 0.003 |
| 04/19/2024 09:20:38.425228329 | 0.003 |
| 04/19/2024 09:20:39.442002117 | 0.003 |
| 04/19/2024 09:20:40.458776965 | 0.003 |
| 04/19/2024 09:20:41.475548662 | 0.003 |
| 04/19/2024 09:20:42.492328299 | 0.003 |
| 04/19/2024 09:20:43.509112905 | 0.003 |
| 04/19/2024 09:20:44.525894420 | -0.007 |
| 04/19/2024 09:20:45.542675844 | 0.003 |
| 04/19/2024 09:20:46.559450965 | 0.003 |
| 04/19/2024 09:20:47.576225541 | 0.003 |
| 04/19/2024 09:20:48.593008026 | 0.003 |
| 04/19/2024 09:20:49.609786087 | 0.003 |
| 04/19/2024 09:20:50.626564238 | 0.003 |
| 04/19/2024 09:20:51.643346753 | 0.003 |
| 04/19/2024 09:20:52.660120965 | 0.003 |
| 04/19/2024 09:20:53.676897662 | 0.003 |
| 04/19/2024 09:20:54.693677147 | 0.003 |
| 04/19/2024 09:20:55.710449965 | 0.003 |
| 04/19/2024 09:20:56.727230390 | 0.003 |
| 04/19/2024 09:20:57.744009511 | 0.003 |
| 04/19/2024 09:20:58.760796693 | 0.003 |
| 04/19/2024 09:20:59.777569269 | 0.003 |
| 04/19/2024 09:21:00.794349481 | 0.003 |
| 04/19/2024 09:21:01.811127662 | -0.007 |
| 04/19/2024 09:21:02.827905602 | 0.003 |
| 04/19/2024 09:21:03.844685814 | 0.003 |
| 04/19/2024 09:21:04.861460814 | 0.003 |
| 04/19/2024 09:21:05.878235981 | 0.003 |
| 04/19/2024 09:21:06.895017163 | 0.003 |
| 04/19/2024 09:21:07.911796526 | 0.003 |
| 04/19/2024 09:21:08.928578769 | 0.003 |
| 04/19/2024 09:21:09.945361102 | 0.003 |
| 04/19/2024 09:21:10.962132708 | -0.007 |
| 04/19/2024 09:21:11.978913466 | 0.003 |
| 04/19/2024 09:21:12.995691648 | 0.003 |
| 04/19/2024 09:21:14.012473254 | 0.003 |
| 04/19/2024 09:21:15.029256314 | 0.003 |
| 04/19/2024 09:21:16.046037769 | 0.003 |
| 04/19/2024 09:21:17.062819769 | 0.003 |
| 04/19/2024 09:21:18.079597466 | 0.003 |
| 04/19/2024 09:21:19.096375890 | 0.003 |
| 04/19/2024 09:21:20.113156526 | 0.003 |
| 04/19/2024 09:21:21.129935223 | 0.003 |
| 04/19/2024 09:21:22.146713860 | -0.007 |
| 04/19/2024 09:21:23.163495951 | 0.003 |
| 04/19/2024 09:21:24.180271496 | 0.003 |
| 04/19/2024 09:21:25.197051890 | 0.003 |
| 04/19/2024 09:21:26.213827102 | 0.003 |
| 04/19/2024 09:21:27.230604405 | 0.003 |
| 04/19/2024 09:21:28.247383132 | 0.003 |
| 04/19/2024 09:21:29.264157587 | 0.003 |
| 04/19/2024 09:21:30.280937254 | 0.003 |
| 04/19/2024 09:21:31.297717375 | 0.003 |
| 04/19/2024 09:21:32.314492587 | 0.003 |
| 04/19/2024 09:21:33.331280920 | 0.003 |
| 04/19/2024 09:21:34.348059254 | 0.003 |
| 04/19/2024 09:21:35.364833662 | 0.003 |
| 04/19/2024 09:21:36.381614269 | 0.003 |
| 04/19/2024 09:21:37.398398905 | 0.003 |
| 04/19/2024 09:21:38.415177238 | 0.003 |
| 04/19/2024 09:21:39.431948723 | 0.003 |
| 04/19/2024 09:21:40.448729269 | 0.003 |
| 04/19/2024 09:21:41.465506693 | 0.003 |
| 04/19/2024 09:21:42.482282662 | 0.003 |
| 04/19/2024 09:21:43.499063238 | 0.003 |
| 04/19/2024 09:21:44.515847511 | 0.003 |
| 04/19/2024 09:21:45.532629178 | 0.003 |
| 04/19/2024 09:21:46.549412723 | 0.003 |
| 04/19/2024 09:21:47.566186632 | 0.003 |
| 04/19/2024 09:21:48.582967905 | 0.003 |
| 04/19/2024 09:21:49.599744511 | 0.003 |
| 04/19/2024 09:21:50.616520481 | 0.003 |
| 04/19/2024 09:21:51.633300147 | 0.003 |
| 04/19/2024 09:21:52.650075662 | 0.003 |
| 04/19/2024 09:21:53.666853511 | 0.003 |
| 04/19/2024 09:21:54.683626147 | 0.003 |
| 04/19/2024 09:21:55.700401753 | 0.003 |
| 04/19/2024 09:21:56.717179299 | 0.003 |
| 04/19/2024 09:21:57.733956935 | 0.003 |
| 04/19/2024 09:21:58.750734026 | 0.003 |
| 04/19/2024 09:21:59.767517117 | 0.003 |
| 04/19/2024 09:22:00.784293723 | 0.003 |
| 04/19/2024 09:22:01.801076784 | 0.003 |
| 04/19/2024 09:22:02.817854935 | 0.003 |
| 04/19/2024 09:22:03.834631875 | 0.003 |
| 04/19/2024 09:22:04.851414784 | -0.007 |
| 04/19/2024 09:22:05.868191027 | 0.003 |
| 04/19/2024 09:22:06.884974269 | 0.003 |
| 04/19/2024 09:22:07.901755057 | 0.003 |
| 04/19/2024 09:22:08.918536299 | 0.003 |
| 04/19/2024 09:22:09.935314148 | 0.003 |
| 04/19/2024 09:22:10.952092784 | 0.003 |
| 04/19/2024 09:22:11.968872360 | 0.003 |
| 04/19/2024 09:22:12.985648936 | 0.003 |
| 04/19/2024 09:22:14.002426027 | 0.003 |
| 04/19/2024 09:22:15.019211815 | 0.003 |
| 04/19/2024 09:22:16.035994451 | 0.003 |
| 04/19/2024 09:22:17.052779815 | 0.003 |
| 04/19/2024 09:22:18.069562996 | 0.003 |
| 04/19/2024 09:22:19.086339269 | 0.003 |
| 04/19/2024 09:22:20.103124572 | -0.007 |
| 04/19/2024 09:22:21.119902208 | 0.003 |
| 04/19/2024 09:22:22.136681178 | 0.003 |
| 04/19/2024 09:22:23.153466511 | 0.003 |
| 04/19/2024 09:22:24.170240784 | 0.003 |
| 04/19/2024 09:22:25.187014057 | 0.003 |
| 04/19/2024 09:22:26.203789693 | 0.003 |
| 04/19/2024 09:22:27.220571027 | 0.003 |
| 04/19/2024 09:22:28.237345724 | 0.003 |
| 04/19/2024 09:22:29.254124269 | 0.003 |
| 04/19/2024 09:22:30.270908905 | 0.003 |
| 04/19/2024 09:22:31.287682845 | 0.003 |
| 04/19/2024 09:22:32.304459633 | 0.003 |
| 04/19/2024 09:22:33.321240087 | 0.003 |
| 04/19/2024 09:22:34.338018208 | 0.003 |
| 04/19/2024 09:22:35.354797905 | 0.003 |
| 04/19/2024 09:22:36.371581390 | 0.003 |
| 04/19/2024 09:22:37.388354299 | 0.003 |
| 04/19/2024 09:22:38.405139632 | 0.003 |
| 04/19/2024 09:22:39.421917874 | 0.003 |
| 04/19/2024 09:22:40.438687905 | 0.003 |
| 04/19/2024 09:22:41.455462450 | -0.007 |
| 04/19/2024 09:22:42.472234329 | 0.003 |
| 04/19/2024 09:22:43.489012753 | 0.003 |
| 04/19/2024 09:22:44.505790996 | 0.003 |
| 04/19/2024 09:22:45.522574480 | 0.003 |
| 04/19/2024 09:22:46.539352753 | 0.003 |
| 04/19/2024 09:22:47.556133723 | 0.003 |
| 04/19/2024 09:22:48.572916450 | 0.003 |
| 04/19/2024 09:22:49.589688602 | 0.003 |
| 04/19/2024 09:22:50.606467965 | -0.002 |
| 04/19/2024 09:22:51.623246480 | 0.003 |
| 04/19/2024 09:22:52.640018935 | 0.003 |
| 04/19/2024 09:22:53.656798147 | 0.003 |
| 04/19/2024 09:22:54.673577480 | 0.003 |
| 04/19/2024 09:22:55.690353238 | -0.007 |
| 04/19/2024 09:22:56.707125935 | 0.003 |
| 04/19/2024 09:22:57.723901087 | 0.003 |
| 04/19/2024 09:22:58.740679056 | 0.003 |
| 04/19/2024 09:22:59.757458844 | 0.003 |
| 04/19/2024 09:23:00.774231299 | 0.003 |
| 04/19/2024 09:23:01.791015996 | 0.003 |
| 04/19/2024 09:23:02.807794511 | 0.003 |
| 04/19/2024 09:23:03.824571238 | 0.003 |
| 04/19/2024 09:23:04.841351420 | 0.003 |
| 04/19/2024 09:23:05.858128269 | 0.003 |
| 04/19/2024 09:23:06.874903148 | 0.003 |
| 04/19/2024 09:23:07.891680663 | 0.003 |
| 04/19/2024 09:23:08.908459299 | 0.003 |
| 04/19/2024 09:23:09.925234330 | 0.003 |
| 04/19/2024 09:23:10.942009421 | 0.003 |
| 04/19/2024 09:23:11.958789299 | 0.003 |
| 04/19/2024 09:23:12.975568542 | 0.003 |
| 04/19/2024 09:23:13.992346148 | 0.003 |
| 04/19/2024 09:23:15.009125966 | -0.007 |
| 04/19/2024 09:23:16.025908572 | 0.003 |
| 04/19/2024 09:23:17.042691815 | 0.003 |
| 04/19/2024 09:23:18.059477178 | -0.007 |
| 04/19/2024 09:23:19.076251360 | 0.003 |
| 04/19/2024 09:23:20.093033269 | 0.003 |
| 04/19/2024 09:23:21.109812451 | 0.003 |
| 04/19/2024 09:23:22.126589209 | 0.003 |
| 04/19/2024 09:23:23.143374784 | 0.003 |
| 04/19/2024 09:23:24.160160209 | 0.003 |
| 04/19/2024 09:23:25.176932239 | 0.003 |
| 04/19/2024 09:23:26.193711936 | 0.003 |
| 04/19/2024 09:23:27.210485845 | 0.003 |
| 04/19/2024 09:23:28.227262542 | 0.003 |
| 04/19/2024 09:23:29.244042481 | 0.003 |
| 04/19/2024 09:23:30.260817178 | 0.003 |
| 04/19/2024 09:23:31.277605421 | 0.003 |
| 04/19/2024 09:23:32.294383815 | 0.003 |
| 04/19/2024 09:23:33.311161299 | 0.003 |
| 04/19/2024 09:23:34.327938209 | 0.003 |
| 04/19/2024 09:23:35.344716162 | 0.003 |
| 04/19/2024 09:23:36.361497768 | 0.003 |
| 04/19/2024 09:23:37.378276617 | 0.003 |
| 04/19/2024 09:23:38.395062284 | 0.003 |
| 04/19/2024 09:23:39.411841102 | 0.003 |
| 04/19/2024 09:23:40.428624435 | 0.003 |
| 04/19/2024 09:23:41.445402344 | 0.003 |
| 04/19/2024 09:23:42.462175950 | 0.003 |
| 04/19/2024 09:23:43.478949890 | 0.003 |
| 04/19/2024 09:23:44.495744071 | -0.007 |
| 04/19/2024 09:23:45.512522011 | 0.003 |
| 04/19/2024 09:23:46.529304193 | 0.003 |
| 04/19/2024 09:23:47.546085344 | 0.003 |
| 04/19/2024 09:23:48.562863859 | 0.003 |
| 04/19/2024 09:23:49.579642011 | 0.003 |
| 04/19/2024 09:23:50.596419829 | 0.003 |
| 04/19/2024 09:23:51.613201768 | 0.003 |
| 04/19/2024 09:23:52.629980041 | -0.003 |
| 04/19/2024 09:23:53.646757041 | 0.003 |
| 04/19/2024 09:23:54.663535011 | 0.003 |
| 04/19/2024 09:23:55.680309950 | 0.003 |
| 04/19/2024 09:23:56.697089859 | 0.003 |
| 04/19/2024 09:23:57.713867102 | 0.003 |
| 04/19/2024 09:23:58.730640314 | 0.003 |
| 04/19/2024 09:23:59.747418738 | 0.003 |
| 04/19/2024 09:24:00.764192344 | 0.003 |
| 04/19/2024 09:24:01.780971920 | 0.003 |
| 04/19/2024 09:24:02.797750768 | 0.003 |
| 04/19/2024 09:24:03.814524890 | 0.003 |
| 04/19/2024 09:24:04.831306950 | 0.003 |
| 04/19/2024 09:24:05.848081814 | 0.003 |
| 04/19/2024 09:24:06.864870542 | 0.003 |
| 04/19/2024 09:24:07.881654693 | 0.003 |
| 04/19/2024 09:24:08.898429693 | 0.003 |
| 04/19/2024 09:24:09.915211511 | -0.004 |
| 04/19/2024 09:24:10.931987390 | 0.003 |
| 04/19/2024 09:24:11.948769845 | 0.003 |
| 04/19/2024 09:24:12.965549814 | -0.007 |
| 04/19/2024 09:24:13.982325936 | 0.003 |
| 04/19/2024 09:24:14.999109511 | 0.003 |
| 04/19/2024 09:24:16.015882087 | 0.003 |
| 04/19/2024 09:24:17.032655572 | 0.003 |
| 04/19/2024 09:24:18.049442481 | 0.003 |
| 04/19/2024 09:24:19.066223936 | 0.003 |
| 04/19/2024 09:24:20.083002027 | 0.003 |
| 04/19/2024 09:24:21.099777208 | 0.003 |
| 04/19/2024 09:24:22.116552451 | 0.003 |
| 04/19/2024 09:24:23.133333208 | 0.003 |
| 04/19/2024 09:24:24.150106693 | 0.003 |
| 04/19/2024 09:24:25.166879814 | 0.003 |
| 04/19/2024 09:24:26.183661754 | 0.003 |
| 04/19/2024 09:24:27.200439087 | 0.003 |
| 04/19/2024 09:24:28.217214451 | 0.003 |
| 04/19/2024 09:24:29.233991269 | 0.003 |
| 04/19/2024 09:24:30.250768451 | 0.003 |
| 04/19/2024 09:24:31.267545966 | 0.003 |
| 04/19/2024 09:24:32.284319117 | 0.003 |
| 04/19/2024 09:24:33.301104420 | 0.003 |
| 04/19/2024 09:24:34.317878633 | 0.003 |
| 04/19/2024 09:24:35.334652753 | 0.003 |
| 04/19/2024 09:24:36.351436481 | 0.003 |
| 04/19/2024 09:24:37.368209965 | 0.003 |
| 04/19/2024 09:24:38.384987905 | 0.003 |
| 04/19/2024 09:24:39.401762087 | 0.003 |
| 04/19/2024 09:24:40.418541844 | 0.003 |
| 04/19/2024 09:24:41.435319511 | 0.003 |
| 04/19/2024 09:24:42.452096450 | 0.003 |
| 04/19/2024 09:24:43.468870996 | 0.003 |
| 04/19/2024 09:24:44.485647935 | 0.003 |
| 04/19/2024 09:24:45.502424723 | -0.007 |
| 04/19/2024 09:24:46.519204571 | 0.003 |
| 04/19/2024 09:24:47.535975056 | 0.003 |
| 04/19/2024 09:24:48.552763390 | -0.007 |
| 04/19/2024 09:24:49.569545087 | 0.003 |
| 04/19/2024 09:24:50.586322875 | 0.003 |
| 04/19/2024 09:24:51.603104268 | 0.003 |
| 04/19/2024 09:24:52.619879602 | 0.003 |
| 04/19/2024 09:24:53.636654420 | 0.003 |
| 04/19/2024 09:24:54.653440753 | 0.003 |
| 04/19/2024 09:24:55.670219299 | 0.003 |
| 04/19/2024 09:24:56.686992844 | 0.003 |
| 04/19/2024 09:24:57.703766571 | 0.003 |
| 04/19/2024 09:24:58.720544450 | 0.003 |
| 04/19/2024 09:24:59.737323390 | 0.003 |
| 04/19/2024 09:25:00.754097481 | 0.003 |
| 04/19/2024 09:25:01.770874420 | 0.003 |
| 04/19/2024 09:25:02.787650359 | 0.003 |
| 04/19/2024 09:25:03.804428693 | 0.003 |
| 04/19/2024 09:25:04.821212238 | 0.003 |
| 04/19/2024 09:25:05.837982284 | 0.003 |
| 04/19/2024 09:25:06.854762435 | -0.007 |
| 04/19/2024 09:25:07.871544011 | 0.003 |
| 04/19/2024 09:25:08.888320678 | 0.003 |
| 04/19/2024 09:25:09.905105981 | 0.003 |
| 04/19/2024 09:25:10.921881738 | 0.003 |
| 04/19/2024 09:25:11.938658556 | 0.003 |
| 04/19/2024 09:25:12.955440859 | 0.003 |
| 04/19/2024 09:25:13.972215526 | 0.003 |
| 04/19/2024 09:25:14.988996556 | 0.003 |
| 04/19/2024 09:25:16.005773071 | 0.003 |
| 04/19/2024 09:25:17.022547708 | -0.007 |
| 04/19/2024 09:25:18.039327162 | 0.003 |
| 04/19/2024 09:25:19.056106587 | 0.003 |
| 04/19/2024 09:25:20.072882981 | 0.003 |
| 04/19/2024 09:25:21.089661950 | 0.003 |
| 04/19/2024 09:25:22.106429768 | 0.003 |
| 04/19/2024 09:25:23.123209768 | 0.003 |
| 04/19/2024 09:25:24.139986223 | 0.003 |
| 04/19/2024 09:25:25.156762071 | 0.003 |
| 04/19/2024 09:25:26.173540193 | 0.003 |
| 04/19/2024 09:25:27.190313496 | 0.003 |
| 04/19/2024 09:25:28.207092465 | 0.003 |
| 04/19/2024 09:25:29.223866829 | 0.003 |
| 04/19/2024 09:25:30.240638799 | -0.007 |
| 04/19/2024 09:25:31.257413617 | 0.003 |
| 04/19/2024 09:25:32.274187344 | -0.007 |
| 04/19/2024 09:25:33.290961284 | 0.003 |
| 04/19/2024 09:25:34.307735465 | 0.003 |
| 04/19/2024 09:25:35.324515618 | 0.003 |
| 04/19/2024 09:25:36.341296799 | -0.004 |
| 04/19/2024 09:25:37.358075648 | 0.003 |
| 04/19/2024 09:25:38.374855648 | 0.003 |
| 04/19/2024 09:25:39.391674708 | 0.003 |
| 04/19/2024 09:25:40.408452951 | 0.003 |
| 04/19/2024 09:25:41.425232466 | 0.003 |
| 04/19/2024 09:25:42.442007163 | 0.003 |
| 04/19/2024 09:25:43.458783708 | 0.003 |
| 04/19/2024 09:25:44.475558072 | 0.003 |
| 04/19/2024 09:25:45.492338254 | 0.003 |
| 04/19/2024 09:25:46.509116618 | -0.007 |
| 04/19/2024 09:25:47.525889527 | 0.003 |
| 04/19/2024 09:25:48.542661436 | 0.003 |
| 04/19/2024 09:25:49.559445739 | 0.003 |
| 04/19/2024 09:25:50.576223799 | -0.007 |
| 04/19/2024 09:25:51.593005951 | 0.003 |
| 04/19/2024 09:25:52.609797921 | 0.003 |
| 04/19/2024 09:25:53.626576314 | 0.003 |
| 04/19/2024 09:25:54.643359072 | 0.003 |
| 04/19/2024 09:25:55.660136739 | 0.003 |
| 04/19/2024 09:25:56.676912648 | 0.003 |
| 04/19/2024 09:25:57.693694921 | 0.003 |
| 04/19/2024 09:25:58.710465739 | -0.007 |
| 04/19/2024 09:25:59.727241769 | 0.003 |
| 04/19/2024 09:26:00.744017254 | 0.003 |
| 04/19/2024 09:26:01.760794436 | 0.003 |
| 04/19/2024 09:26:02.777572981 | 0.003 |
| 04/19/2024 09:26:03.794352769 | 0.003 |
| 04/19/2024 09:26:04.811133011 | 0.003 |
| 04/19/2024 09:26:05.827904935 | 0.003 |
| 04/19/2024 09:26:06.844686511 | 0.003 |
| 04/19/2024 09:26:07.861465147 | 0.003 |
| 04/19/2024 09:26:08.878240814 | 0.003 |
| 04/19/2024 09:26:09.895024723 | 0.003 |
| 04/19/2024 09:26:10.911808966 | 0.003 |
| 04/19/2024 09:26:11.928585966 | 0.003 |
| 04/19/2024 09:26:12.945371572 | 0.003 |
| 04/19/2024 09:26:13.962147996 | -0.007 |
| 04/19/2024 09:26:14.978923602 | 0.003 |
| 04/19/2024 09:26:15.995709390 | 0.003 |
| 04/19/2024 09:26:17.012480299 | 0.003 |
| 04/19/2024 09:26:18.029258329 | 0.003 |
| 04/19/2024 09:26:19.046036208 | 0.003 |
| 04/19/2024 09:26:20.062815450 | 0.003 |
| 04/19/2024 09:26:21.079597238 | 0.003 |
| 04/19/2024 09:26:22.096382420 | 0.003 |
| 04/19/2024 09:26:23.113165450 | 0.003 |
| 04/19/2024 09:26:24.129940390 | 0.003 |
| 04/19/2024 09:26:25.146719966 | 0.003 |
| 04/19/2024 09:26:26.163502632 | 0.003 |
| 04/19/2024 09:26:27.180275269 | 0.003 |
| 04/19/2024 09:26:28.197054117 | 0.003 |
| 04/19/2024 09:26:29.213834117 | 0.003 |
| 04/19/2024 09:26:30.230606602 | 0.003 |
| 04/19/2024 09:26:31.247381026 | 0.003 |
| 04/19/2024 09:26:32.264156723 | 0.003 |
| 04/19/2024 09:26:33.280931511 | 0.003 |
| 04/19/2024 09:26:34.297707511 | 0.003 |
| 04/19/2024 09:26:35.314489481 | 0.003 |
| 04/19/2024 09:26:36.331271814 | -0.007 |
| 04/19/2024 09:26:37.348044814 | 0.003 |
| 04/19/2024 09:26:38.364825359 | 0.003 |
| 04/19/2024 09:26:39.381606238 | 0.003 |
| 04/19/2024 09:26:40.398388602 | 0.003 |
| 04/19/2024 09:26:41.415174814 | 0.003 |
| 04/19/2024 09:26:42.431949602 | 0.003 |
| 04/19/2024 09:26:43.448722511 | -0.007 |
| 04/19/2024 09:26:44.465497208 | 0.003 |
| 04/19/2024 09:26:45.482274056 | 0.003 |
| 04/19/2024 09:26:46.499057753 | 0.003 |
| 04/19/2024 09:26:47.515837026 | 0.003 |
| 04/19/2024 09:26:48.532608390 | 0.003 |
| 04/19/2024 09:26:49.549390390 | 0.003 |
| 04/19/2024 09:26:50.566167087 | 0.003 |
| 04/19/2024 09:26:51.582949208 | -0.007 |
| 04/19/2024 09:26:52.599731511 | 0.003 |
| 04/19/2024 09:26:53.616506844 | 0.003 |
| 04/19/2024 09:26:54.633289874 | 0.003 |
| 04/19/2024 09:26:55.650066693 | 0.003 |
| 04/19/2024 09:26:56.666841571 | 0.003 |
| 04/19/2024 09:26:57.683622359 | 0.003 |
| 04/19/2024 09:26:58.700400390 | -0.007 |
| 04/19/2024 09:26:59.717173571 | 0.003 |
| 04/19/2024 09:27:00.733947632 | 0.003 |
| 04/19/2024 09:27:01.750722511 | 0.003 |
| 04/19/2024 09:27:02.767498056 | -0.007 |
| 04/19/2024 09:27:03.784271693 | 0.003 |
| 04/19/2024 09:27:04.801051056 | 0.003 |
| 04/19/2024 09:27:05.817833117 | 0.003 |
| 04/19/2024 09:27:06.834616269 | 0.003 |
| 04/19/2024 09:27:07.851398390 | 0.003 |
| 04/19/2024 09:27:08.868173451 | 0.003 |
| 04/19/2024 09:27:09.884950905 | 0.003 |
| 04/19/2024 09:27:10.901739360 | 0.003 |
| 04/19/2024 09:27:11.918514693 | 0.003 |
| 04/19/2024 09:27:12.935298481 | 0.003 |
| 04/19/2024 09:27:13.952077087 | 0.003 |
| 04/19/2024 09:27:14.968851541 | 0.003 |
| 04/19/2024 09:27:15.985631451 | 0.003 |
| 04/19/2024 09:27:17.002413663 | 0.003 |
| 04/19/2024 09:27:18.019194299 | 0.003 |
| 04/19/2024 09:27:19.035967057 | 0.003 |
| 04/19/2024 09:27:20.052743117 | 0.003 |
| 04/19/2024 09:27:21.069526269 | 0.003 |
| 04/19/2024 09:27:22.086306602 | 0.003 |
| 04/19/2024 09:27:23.103091451 | 0.003 |
| 04/19/2024 09:27:24.119874360 | 0.003 |
| 04/19/2024 09:27:25.136649511 | 0.003 |
| 04/19/2024 09:27:26.153433208 | 0.003 |
| 04/19/2024 09:27:27.170215420 | -0.003 |
| 04/19/2024 09:27:28.186990329 | 0.003 |
| 04/19/2024 09:27:29.203775147 | 0.003 |
| 04/19/2024 09:27:30.220552360 | 0.003 |
| 04/19/2024 09:27:31.237327147 | 0.003 |
| 04/19/2024 09:27:32.254104269 | 0.003 |
| 04/19/2024 09:27:33.270878511 | -0.007 |
| 04/19/2024 09:27:34.287666147 | 0.003 |
| 04/19/2024 09:27:35.304448344 | 0.003 |
| 04/19/2024 09:27:36.321228375 | 0.003 |
| 04/19/2024 09:27:37.338000071 | 0.003 |
| 04/19/2024 09:27:38.354784314 | 0.003 |
| 04/19/2024 09:27:39.371564405 | 0.003 |
| 04/19/2024 09:27:40.388340162 | -0.007 |
| 04/19/2024 09:27:41.405127465 | 0.003 |
| 04/19/2024 09:27:42.421912496 | 0.003 |
| 04/19/2024 09:27:43.438686193 | 0.003 |
| 04/19/2024 09:27:44.455461920 | 0.003 |
| 04/19/2024 09:27:45.472232920 | -0.007 |
| 04/19/2024 09:27:46.489009223 | -0.007 |
| 04/19/2024 09:27:47.505789829 | 0.003 |
| 04/19/2024 09:27:48.522563981 | 0.003 |
| 04/19/2024 09:27:49.539344162 | 0.003 |
| 04/19/2024 09:27:50.556118678 | 0.003 |
| 04/19/2024 09:27:51.572901314 | 0.003 |
| 04/19/2024 09:27:52.589681708 | 0.003 |
| 04/19/2024 09:27:53.606461465 | 0.003 |
| 04/19/2024 09:27:54.623241920 | -0.007 |
| 04/19/2024 09:27:55.640016314 | 0.003 |
| 04/19/2024 09:27:56.656790981 | 0.003 |
| 04/19/2024 09:27:57.673572799 | 0.003 |
| 04/19/2024 09:27:58.690347071 | 0.003 |
| 04/19/2024 09:27:59.707126223 | 0.003 |
| 04/19/2024 09:28:00.723906375 | 0.003 |
| 04/19/2024 09:28:01.740679738 | -0.007 |
| 04/19/2024 09:28:02.757455738 | 0.003 |
| 04/19/2024 09:28:03.774229859 | 0.003 |
| 04/19/2024 09:28:04.791003405 | 0.003 |
| 04/19/2024 09:28:05.807779708 | 0.003 |
| 04/19/2024 09:28:06.824559465 | 0.003 |
| 04/19/2024 09:28:07.841348829 | 0.003 |
| 04/19/2024 09:28:08.858124374 | 0.003 |
| 04/19/2024 09:28:09.874907526 | 0.003 |
| 04/19/2024 09:28:10.891688950 | 0.003 |
| 04/19/2024 09:28:11.908464344 | 0.003 |
| 04/19/2024 09:28:12.925246890 | -0.007 |
| 04/19/2024 09:28:13.942015981 | 0.003 |
| 04/19/2024 09:28:14.958789859 | -0.007 |
| 04/19/2024 09:28:15.975570738 | 0.003 |
| 04/19/2024 09:28:16.992348587 | 0.003 |
| 04/19/2024 09:28:18.009126253 | 0.003 |
| 04/19/2024 09:28:19.025906768 | 0.003 |
| 04/19/2024 09:28:20.042678981 | 0.003 |
| 04/19/2024 09:28:21.059463041 | 0.003 |
| 04/19/2024 09:28:22.076243708 | 0.003 |
| 04/19/2024 09:28:23.093022981 | 0.003 |
| 04/19/2024 09:28:24.109807344 | -0.007 |
| 04/19/2024 09:28:25.126585223 | 0.003 |
| 04/19/2024 09:28:26.143365981 | 0.003 |
| 04/19/2024 09:28:27.160140859 | 0.003 |
| 04/19/2024 09:28:28.176916435 | 0.003 |
| 04/19/2024 09:28:29.193699465 | 0.003 |
| 04/19/2024 09:28:30.210478708 | 0.003 |
| 04/19/2024 09:28:31.227253738 | 0.003 |
| 04/19/2024 09:28:32.244029284 | 0.003 |
| 04/19/2024 09:28:33.260801647 | 0.003 |
| 04/19/2024 09:28:34.277575587 | 0.003 |
| 04/19/2024 09:28:35.294354647 | 0.003 |
| 04/19/2024 09:28:36.311130344 | 0.003 |
| 04/19/2024 09:28:37.327904375 | 0.003 |
| 04/19/2024 09:28:38.344687496 | 0.003 |
| 04/19/2024 09:28:39.361467556 | 0.003 |
| 04/19/2024 09:28:40.378241253 | 0.003 |
| 04/19/2024 09:28:41.395028011 | 0.003 |
| 04/19/2024 09:28:42.411812647 | 0.003 |
| 04/19/2024 09:28:43.428589920 | 0.003 |
| 04/19/2024 09:28:44.445372890 | 0.003 |
| 04/19/2024 09:28:45.462143920 | -0.007 |
| 04/19/2024 09:28:46.478915890 | 0.003 |
| 04/19/2024 09:28:47.495695466 | 0.003 |
| 04/19/2024 09:28:48.512473344 | -0.007 |
| 04/19/2024 09:28:49.529251435 | 0.003 |
| 04/19/2024 09:28:50.546028496 | 0.003 |
| 04/19/2024 09:28:51.562802344 | 0.003 |
| 04/19/2024 09:28:52.579584223 | 0.003 |
| 04/19/2024 09:28:53.596367981 | 0.003 |
| 04/19/2024 09:28:54.613146708 | 0.003 |
| 04/19/2024 09:28:55.629928799 | 0.003 |
| 04/19/2024 09:28:56.646705011 | 0.003 |
| 04/19/2024 09:28:57.663484314 | 0.003 |
| 04/19/2024 09:28:58.680256799 | 0.003 |
| 04/19/2024 09:28:59.697036284 | 0.003 |
| 04/19/2024 09:29:00.713818496 | 0.003 |
| 04/19/2024 09:29:01.730593799 | -0.007 |
| 04/19/2024 09:29:02.747368041 | 0.003 |
| 04/19/2024 09:29:03.764140647 | 0.003 |
| 04/19/2024 09:29:04.780913193 | 0.003 |
| 04/19/2024 09:29:05.797689072 | 0.003 |
| 04/19/2024 09:29:06.814465041 | -0.007 |
| 04/19/2024 09:29:07.831240072 | 0.003 |
| 04/19/2024 09:29:08.848018435 | 0.003 |
| 04/19/2024 09:29:09.864794708 | 0.003 |
| 04/19/2024 09:29:10.881576011 | 0.003 |
| 04/19/2024 09:29:11.898353738 | 0.003 |
| 04/19/2024 09:29:12.915135860 | 0.003 |
| 04/19/2024 09:29:13.931916708 | 0.003 |
| 04/19/2024 09:29:14.948691708 | -0.007 |
| 04/19/2024 09:29:15.965475738 | 0.003 |
| 04/19/2024 09:29:16.982253284 | 0.003 |
| 04/19/2024 09:29:17.999033890 | 0.003 |
| 04/19/2024 09:29:19.015815132 | 0.003 |
| 04/19/2024 09:29:20.032590829 | 0.003 |
| 04/19/2024 09:29:21.049372860 | 0.003 |
| 04/19/2024 09:29:22.066144981 | 0.003 |
| 04/19/2024 09:29:23.082920556 | 0.003 |
| 04/19/2024 09:29:24.099704163 | -0.007 |
| 04/19/2024 09:29:25.116487799 | 0.003 |
| 04/19/2024 09:29:26.133269647 | 0.003 |
| 04/19/2024 09:29:27.150040223 | 0.003 |
| 04/19/2024 09:29:28.166811435 | 0.003 |
| 04/19/2024 09:29:29.183601344 | 0.003 |
| 04/19/2024 09:29:30.200384587 | 0.003 |
| 04/19/2024 09:29:31.217158617 | 0.003 |
| 04/19/2024 09:29:32.233937890 | -0.007 |
| 04/19/2024 09:29:33.250712860 | 0.003 |
| 04/19/2024 09:29:34.267488253 | 0.003 |
| 04/19/2024 09:29:35.284261905 | 0.003 |
| 04/19/2024 09:29:36.301043450 | 0.003 |
| 04/19/2024 09:29:37.317822935 | 0.003 |
| 04/19/2024 09:29:38.334596996 | 0.003 |
| 04/19/2024 09:29:39.351384844 | -0.007 |
| 04/19/2024 09:29:40.368157784 | 0.003 |
| 04/19/2024 09:29:41.384936208 | 0.003 |
| 04/19/2024 09:29:42.401722844 | -0.007 |
| 04/19/2024 09:29:43.418500238 | 0.003 |
| 04/19/2024 09:29:44.435279844 | 0.003 |
| 04/19/2024 09:29:45.452057814 | 0.003 |
| 04/19/2024 09:29:46.468831147 | 0.003 |
| 04/19/2024 09:29:47.485607541 | 0.003 |
| 04/19/2024 09:29:48.502387269 | 0.003 |
| 04/19/2024 09:29:49.519167329 | 0.003 |
| 04/19/2024 09:29:50.535944026 | 0.003 |
| 04/19/2024 09:29:51.552717966 | -0.007 |
| 04/19/2024 09:29:52.569497147 | -0.007 |
| 04/19/2024 09:29:53.586272057 | 0.003 |
| 04/19/2024 09:29:54.603052572 | 0.003 |
| 04/19/2024 09:29:55.619836784 | 0.003 |
| 04/19/2024 09:29:56.636612208 | 0.003 |
| 04/19/2024 09:29:57.653396541 | 0.003 |
| 04/19/2024 09:29:58.670177178 | 0.003 |
| 04/19/2024 09:29:59.686953693 | 0.003 |
| 04/19/2024 09:30:00.703737238 | 0.003 |
| 04/19/2024 09:30:01.720520087 | 0.003 |
| 04/19/2024 09:30:02.737295814 | 0.003 |
| 04/19/2024 09:30:03.754069602 | 0.003 |
| 04/19/2024 09:30:04.770847117 | 0.003 |
| 04/19/2024 09:30:05.787622663 | 0.003 |
| 04/19/2024 09:30:06.804406784 | 0.003 |
| 04/19/2024 09:30:07.821190602 | -0.007 |
| 04/19/2024 09:30:08.837964542 | 0.003 |
| 04/19/2024 09:30:09.854741239 | 0.003 |
| 04/19/2024 09:30:10.871523754 | 0.003 |
| 04/19/2024 09:30:11.888298572 | 0.003 |
| 04/19/2024 09:30:12.905081208 | 0.003 |
| 04/19/2024 09:30:13.921866148 | -0.007 |
| 04/19/2024 09:30:14.938637239 | 0.003 |
| 04/19/2024 09:30:15.955418724 | 0.003 |
| 04/19/2024 09:30:16.972193481 | 0.003 |
| 04/19/2024 09:30:17.988969875 | -0.007 |
| 04/19/2024 09:30:19.005754269 | 0.003 |
| 04/19/2024 09:30:20.022532451 | 0.003 |
| 04/19/2024 09:30:21.039309936 | 0.003 |
| 04/19/2024 09:30:22.056085269 | 0.003 |
| 04/19/2024 09:30:23.072855208 | 0.003 |
| 04/19/2024 09:30:24.089634572 | 0.003 |
| 04/19/2024 09:30:25.106415845 | 0.003 |
| 04/19/2024 09:30:26.123192360 | -0.007 |
| 04/19/2024 09:30:27.139974845 | 0.003 |
| 04/19/2024 09:30:28.156747663 | -0.007 |
| 04/19/2024 09:30:29.173525421 | 0.003 |
| 04/19/2024 09:30:30.190301784 | 0.003 |
| 04/19/2024 09:30:31.207080481 | 0.003 |
| 04/19/2024 09:30:32.223860602 | 0.003 |
| 04/19/2024 09:30:33.240634178 | -0.007 |
| 04/19/2024 09:30:34.257411602 | 0.003 |
| 04/19/2024 09:30:35.274183147 | 0.003 |
| 04/19/2024 09:30:36.290963360 | 0.003 |
| 04/19/2024 09:30:37.307740360 | -0.007 |
| 04/19/2024 09:30:38.324516269 | 0.003 |
| 04/19/2024 09:30:39.341293935 | 0.003 |
| 04/19/2024 09:30:40.358078814 | -0.007 |
| 04/19/2024 09:30:41.374860117 | 0.003 |
| 04/19/2024 09:30:42.391670784 | -0.007 |
| 04/19/2024 09:30:43.408445996 | 0.003 |
| 04/19/2024 09:30:44.425231390 | 0.003 |
| 04/19/2024 09:30:45.442015147 | 0.003 |
| 04/19/2024 09:30:46.458787632 | 0.003 |
| 04/19/2024 09:30:47.475565450 | 0.003 |
| 04/19/2024 09:30:48.492344602 | 0.003 |
| 04/19/2024 09:30:49.509124208 | 0.003 |
| 04/19/2024 09:30:50.525904360 | 0.003 |
| 04/19/2024 09:30:51.542672572 | 0.003 |
| 04/19/2024 09:30:52.559450329 | -0.007 |
| 04/19/2024 09:30:53.576217753 | 0.003 |
| 04/19/2024 09:30:54.593007632 | 0.003 |
| 04/19/2024 09:30:55.609790753 | 0.003 |
| 04/19/2024 09:30:56.626572299 | 0.003 |
| 04/19/2024 09:30:57.643353844 | 0.003 |
| 04/19/2024 09:30:58.660132663 | 0.003 |
| 04/19/2024 09:30:59.676908723 | 0.003 |
| 04/19/2024 09:31:00.693692663 | 0.003 |
| 04/19/2024 09:31:01.710470632 | 0.003 |
| 04/19/2024 09:31:02.727246572 | 0.003 |
| 04/19/2024 09:31:03.744028905 | 0.003 |
| 04/19/2024 09:31:04.760804208 | 0.003 |
| 04/19/2024 09:31:05.777578360 | 0.003 |
| 04/19/2024 09:31:06.794356330 | 0.003 |
| 04/19/2024 09:31:07.811131451 | 0.003 |
| 04/19/2024 09:31:08.827909512 | 0.003 |
| 04/19/2024 09:31:09.844683633 | -0.007 |
| 04/19/2024 09:31:10.861466360 | 0.003 |
| 04/19/2024 09:31:11.878241512 | 0.003 |
| 04/19/2024 09:31:12.895026572 | -0.007 |
| 04/19/2024 09:31:13.911811178 | 0.003 |
| 04/19/2024 09:31:14.928586178 | 0.003 |
| 04/19/2024 09:31:15.945367996 | 0.003 |
| 04/19/2024 09:31:16.962156542 | -0.007 |
| 04/19/2024 09:31:17.978930027 | 0.003 |
| 04/19/2024 09:31:18.995712754 | -0.007 |
| 04/19/2024 09:31:20.012492633 | 0.003 |
| 04/19/2024 09:31:21.029268390 | 0.003 |
| 04/19/2024 09:31:22.046054754 | 0.003 |
| 04/19/2024 09:31:23.062827239 | 0.003 |
| 04/19/2024 09:31:24.079605451 | 0.003 |
| 04/19/2024 09:31:25.096381784 | 0.003 |
| 04/19/2024 09:31:26.113164633 | 0.003 |
| 04/19/2024 09:31:27.129946451 | 0.003 |
| 04/19/2024 09:31:28.146722148 | 0.003 |
| 04/19/2024 09:31:29.163504208 | 0.003 |
| 04/19/2024 09:31:30.180279724 | 0.003 |
| 04/19/2024 09:31:31.197060602 | 0.003 |
| 04/19/2024 09:31:32.213841118 | 0.003 |
| 04/19/2024 09:31:33.230619148 | 0.003 |
| 04/19/2024 09:31:34.247397663 | 0.003 |
| 04/19/2024 09:31:35.264179057 | 0.003 |
| 04/19/2024 09:31:36.280955633 | 0.003 |
| 04/19/2024 09:31:37.297733360 | 0.003 |
| 04/19/2024 09:31:38.314508572 | -0.007 |
| 04/19/2024 09:31:39.331285269 | 0.003 |
| 04/19/2024 09:31:40.348061905 | 0.003 |
| 04/19/2024 09:31:41.364841390 | 0.003 |
| 04/19/2024 09:31:42.381620360 | 0.003 |
| 04/19/2024 09:31:43.398400027 | 0.003 |
| 04/19/2024 09:31:44.415182178 | 0.003 |
| 04/19/2024 09:31:45.431967027 | 0.003 |
| 04/19/2024 09:31:46.448744663 | -0.007 |
| 04/19/2024 09:31:47.465516390 | 0.003 |
| 04/19/2024 09:31:48.482291602 | 0.003 |
| 04/19/2024 09:31:49.499075087 | 0.003 |
| 04/19/2024 09:31:50.515854572 | -0.007 |
| 04/19/2024 09:31:51.532634481 | 0.003 |
| 04/19/2024 09:31:52.549415572 | 0.003 |
| 04/19/2024 09:31:53.566194572 | 0.003 |
| 04/19/2024 09:31:54.582971511 | -0.007 |
| 04/19/2024 09:31:55.599753239 | 0.003 |
| 04/19/2024 09:31:56.616532269 | 0.003 |
| 04/19/2024 09:31:57.633312117 | -0.007 |
| 04/19/2024 09:31:58.650102178 | 0.003 |
| 04/19/2024 09:31:59.666878027 | 0.003 |
| 04/19/2024 09:32:00.683660451 | -0.007 |
| 04/19/2024 09:32:01.700440451 | 0.003 |
| 04/19/2024 09:32:02.717225421 | 0.003 |
| 04/19/2024 09:32:03.734006057 | 0.003 |
| 04/19/2024 09:32:04.750783421 | 0.003 |
| 04/19/2024 09:32:05.767557360 | -0.007 |
| 04/19/2024 09:32:06.784330663 | 0.003 |
| 04/19/2024 09:32:07.801109481 | 0.003 |
| 04/19/2024 09:32:08.817890027 | 0.003 |
| 04/19/2024 09:32:09.834662269 | 0.003 |
| 04/19/2024 09:32:10.851438451 | 0.003 |
| 04/19/2024 09:32:11.868224087 | 0.003 |
| 04/19/2024 09:32:12.885001481 | 0.003 |
| 04/19/2024 09:32:13.901785542 | 0.003 |
| 04/19/2024 09:32:14.918558572 | 0.003 |
| 04/19/2024 09:32:15.935340663 | -0.007 |
| 04/19/2024 09:32:16.952123299 | 0.003 |
| 04/19/2024 09:32:17.968895330 | 0.003 |
| 04/19/2024 09:32:18.985676239 | 0.003 |
| 04/19/2024 09:32:20.002458754 | 0.003 |
| 04/19/2024 09:32:21.019238178 | 0.003 |
| 04/19/2024 09:32:22.036018057 | 0.003 |
| 04/19/2024 09:32:23.052788512 | 0.003 |
| 04/19/2024 09:32:24.069569845 | 0.003 |
| 04/19/2024 09:32:25.086345087 | 0.003 |
| 04/19/2024 09:32:26.103122663 | -0.007 |
| 04/19/2024 09:32:27.119902360 | 0.003 |
| 04/19/2024 09:32:28.136684481 | 0.003 |
| 04/19/2024 09:32:29.153463633 | 0.003 |
| 04/19/2024 09:32:30.170243481 | 0.003 |
| 04/19/2024 09:32:31.187021906 | -0.007 |
| 04/19/2024 09:32:32.203801299 | 0.003 |
| 04/19/2024 09:32:33.220571602 | 0.003 |
| 04/19/2024 09:32:34.237343572 | 0.003 |
| 04/19/2024 09:32:35.254125648 | 0.003 |
| 04/19/2024 09:32:36.270897436 | 0.003 |
| 04/19/2024 09:32:37.287673587 | 0.003 |
| 04/19/2024 09:32:38.304453224 | 0.003 |
| 04/19/2024 09:32:39.321228375 | 0.003 |
| 04/19/2024 09:32:40.338000678 | -0.007 |
| 04/19/2024 09:32:41.354774739 | 0.003 |
| 04/19/2024 09:32:42.371551072 | 0.003 |
| 04/19/2024 09:32:43.388326072 | 0.003 |
| 04/19/2024 09:32:44.405112527 | -0.007 |
| 04/19/2024 09:32:45.421895678 | 0.003 |
| 04/19/2024 09:32:46.438671133 | 0.003 |
| 04/19/2024 09:32:47.455452890 | 0.003 |
| 04/19/2024 09:32:48.472225405 | -0.007 |
| 04/19/2024 09:32:49.489000799 | 0.003 |
| 04/19/2024 09:32:50.505776951 | 0.003 |
| 04/19/2024 09:32:51.522555193 | 0.003 |
| 04/19/2024 09:32:52.539331496 | 0.003 |
| 04/19/2024 09:32:53.556112102 | 0.003 |
| 04/19/2024 09:32:54.572886193 | 0.003 |
| 04/19/2024 09:32:55.589665405 | 0.003 |
| 04/19/2024 09:32:56.606443254 | 0.003 |
| 04/19/2024 09:32:57.623219284 | 0.003 |
| 04/19/2024 09:32:58.640001436 | 0.003 |
| 04/19/2024 09:32:59.656772345 | -0.007 |
| 04/19/2024 09:33:00.673549951 | 0.003 |
| 04/19/2024 09:33:01.690318708 | 0.003 |
| 04/19/2024 09:33:02.707094042 | 0.003 |
| 04/19/2024 09:33:03.723877436 | 0.003 |
| 04/19/2024 09:33:04.740654587 | -0.007 |
| 04/19/2024 09:33:05.757428739 | 0.003 |
| 04/19/2024 09:33:06.774207496 | 0.003 |
| 04/19/2024 09:33:07.790983042 | 0.003 |
| 04/19/2024 09:33:08.807759163 | 0.003 |
| 04/19/2024 09:33:09.824534799 | 0.003 |
| 04/19/2024 09:33:10.841310375 | -0.007 |
| 04/19/2024 09:33:11.858089042 | 0.003 |
| 04/19/2024 09:33:12.874862011 | 0.003 |
| 04/19/2024 09:33:13.891649617 | 0.003 |
| 04/19/2024 09:33:14.908423587 | 0.003 |
| 04/19/2024 09:33:15.925205920 | 0.003 |
| 04/19/2024 09:33:16.941988557 | 0.003 |
| 04/19/2024 09:33:17.958760830 | 0.003 |
| 04/19/2024 09:33:18.975542254 | 0.003 |
| 04/19/2024 09:33:19.992317830 | 0.003 |
| 04/19/2024 09:33:21.009099951 | 0.003 |
| 04/19/2024 09:33:22.025879072 | 0.003 |
| 04/19/2024 09:33:23.042654587 | 0.003 |
| 04/19/2024 09:33:24.059434708 | 0.003 |
| 04/19/2024 09:33:25.076215436 | 0.003 |
| 04/19/2024 09:33:26.092993072 | 0.003 |
| 04/19/2024 09:33:27.109774890 | 0.003 |
| 04/19/2024 09:33:28.126547436 | -0.007 |
| 04/19/2024 09:33:29.143331648 | 0.003 |
| 04/19/2024 09:33:30.160112345 | 0.003 |
| 04/19/2024 09:33:31.176884284 | 0.003 |
| 04/19/2024 09:33:32.193664981 | 0.003 |
| 04/19/2024 09:33:33.210441739 | 0.003 |
| 04/19/2024 09:33:34.227217163 | 0.003 |
| 04/19/2024 09:33:35.243998830 | 0.003 |
| 04/19/2024 09:33:36.260771769 | 0.003 |
| 04/19/2024 09:33:37.277546799 | 0.003 |
| 04/19/2024 09:33:38.294322830 | 0.003 |
| 04/19/2024 09:33:39.311100012 | -0.007 |
| 04/19/2024 09:33:40.327878405 | 0.003 |
| 04/19/2024 09:33:41.344657769 | -0.007 |
| 04/19/2024 09:33:42.361433163 | 0.003 |
| 04/19/2024 09:33:43.378214012 | -0.007 |
| 04/19/2024 09:33:44.395001951 | 0.003 |
| 04/19/2024 09:33:45.411783587 | 0.003 |
| 04/19/2024 09:33:46.428560678 | 0.003 |
| 04/19/2024 09:33:47.445345799 | -0.007 |
| 04/19/2024 09:33:48.462131102 | 0.003 |
| 04/19/2024 09:33:49.478907587 | 0.003 |
| 04/19/2024 09:33:50.495690739 | 0.003 |
| 04/19/2024 09:33:51.512464375 | 0.003 |
| 04/19/2024 09:33:52.529244133 | 0.003 |
| 04/19/2024 09:33:53.546023405 | -0.007 |
| 04/19/2024 09:33:54.562797981 | 0.003 |
| 04/19/2024 09:33:55.579575527 | 0.003 |
| 04/19/2024 09:33:56.596353799 | 0.003 |
| 04/19/2024 09:33:57.613132224 | 0.003 |
| 04/19/2024 09:33:58.629911436 | 0.003 |
| 04/19/2024 09:33:59.646694527 | 0.003 |
| 04/19/2024 09:34:00.663470618 | 0.003 |
| 04/19/2024 09:34:01.680251405 | 0.003 |
| 04/19/2024 09:34:02.697031527 | -0.007 |
| 04/19/2024 09:34:03.713811133 | 0.003 |
| 04/19/2024 09:34:04.730584254 | 0.003 |
| 04/19/2024 09:34:05.747363071 | -0.007 |
| 04/19/2024 09:34:06.764141253 | 0.003 |
| 04/19/2024 09:34:07.780916435 | -0.007 |
| 04/19/2024 09:34:08.797693405 | 0.003 |
| 04/19/2024 09:34:09.814463435 | 0.003 |
| 04/19/2024 09:34:10.831236071 | 0.003 |
| 04/19/2024 09:34:11.848016132 | -0.007 |
| 04/19/2024 09:34:12.864792859 | -0.007 |
| 04/19/2024 09:34:13.881570405 | 0.003 |
| 04/19/2024 09:34:14.898345556 | 0.003 |
| 04/19/2024 09:34:15.915124617 | -0.007 |
| 04/19/2024 09:34:16.931907586 | 0.003 |
| 04/19/2024 09:34:17.948682405 | 0.003 |
| 04/19/2024 09:34:18.965466859 | 0.003 |
| 04/19/2024 09:34:19.982248102 | -0.007 |
| 04/19/2024 09:34:20.999026102 | 0.003 |
| 04/19/2024 09:34:22.015805465 | 0.003 |
| 04/19/2024 09:34:23.032578920 | 0.003 |
| 04/19/2024 09:34:24.049360405 | 0.003 |
| 04/19/2024 09:34:25.066140859 | 0.003 |
| 04/19/2024 09:34:26.082914738 | 0.003 |
| 04/19/2024 09:34:27.099693586 | -0.007 |
| 04/19/2024 09:34:28.116464890 | 0.003 |
| 04/19/2024 09:34:29.133240253 | 0.003 |
| 04/19/2024 09:34:30.150028374 | 0.003 |
| 04/19/2024 09:34:31.166809223 | 0.003 |
| 04/19/2024 09:34:32.183604102 | 0.003 |
| 04/19/2024 09:34:33.200377405 | -0.007 |
| 04/19/2024 09:34:34.217152617 | 0.003 |
| 04/19/2024 09:34:35.233933875 | 0.003 |
| 04/19/2024 09:34:36.250729571 | 0.003 |
| 04/19/2024 09:34:37.267504450 | -0.007 |
| 04/19/2024 09:34:38.284284693 | 0.003 |
| 04/19/2024 09:34:39.301060268 | 0.003 |
| 04/19/2024 09:34:40.317839481 | 0.003 |
| 04/19/2024 09:34:41.334610026 | -0.007 |
| 04/19/2024 09:34:42.351386844 | 0.003 |
| 04/19/2024 09:34:43.368162329 | -0.002 |
| 04/19/2024 09:34:44.384935541 | 0.003 |
| 04/19/2024 09:34:45.401721905 | 0.003 |
| 04/19/2024 09:34:46.418494511 | 0.003 |
| 04/19/2024 09:34:47.435275844 | -0.007 |
| 04/19/2024 09:34:48.452061208 | 0.003 |
| 04/19/2024 09:34:49.468833723 | -0.007 |
| 04/19/2024 09:34:50.485608268 | 0.003 |
| 04/19/2024 09:34:51.502378723 | 0.003 |
| 04/19/2024 09:34:52.519158511 | -0.004 |
| 04/19/2024 09:34:53.535936814 | 0.003 |
| 04/19/2024 09:34:54.552714602 | 0.003 |
| 04/19/2024 09:34:55.569492087 | 0.003 |
| 04/19/2024 09:34:56.586266996 | 0.003 |
| 04/19/2024 09:34:57.603040420 | 0.003 |
| 04/19/2024 09:34:58.619816329 | -0.007 |
| 04/19/2024 09:34:59.636589481 | 0.003 |
| 04/19/2024 09:35:00.653374632 | 0.003 |
| 04/19/2024 09:35:01.670161450 | 0.003 |
| 04/19/2024 09:35:02.686932087 | 0.003 |
| 04/19/2024 09:35:03.703715087 | 0.003 |
| 04/19/2024 09:35:04.720493056 | -0.002 |
| 04/19/2024 09:35:05.737265103 | 0.003 |
| 04/19/2024 09:35:06.754049345 | 0.003 |
| 04/19/2024 09:35:07.770824527 | -0.007 |
| 04/19/2024 09:35:08.787599739 | 0.003 |
| 04/19/2024 09:35:09.804375587 | 0.003 |
| 04/19/2024 09:35:10.821148254 | 0.003 |
| 04/19/2024 09:35:11.837922587 | -0.007 |
| 04/19/2024 09:35:12.854700709 | 0.003 |
| 04/19/2024 09:35:13.871471921 | 0.003 |
| 04/19/2024 09:35:14.888246163 | 0.003 |
| 04/19/2024 09:35:15.905026254 | -0.007 |
| 04/19/2024 09:35:16.921805739 | 0.003 |
| 04/19/2024 09:35:17.938590406 | 0.003 |
| 04/19/2024 09:35:18.955371769 | 0.003 |
| 04/19/2024 09:35:19.972155406 | 0.003 |
| 04/19/2024 09:35:20.988937466 | 0.003 |
| 04/19/2024 09:35:22.005718890 | -0.007 |
| 04/19/2024 09:35:23.022492890 | 0.003 |
| 04/19/2024 09:35:24.039274466 | 0.003 |
| 04/19/2024 09:35:25.056058163 | 0.003 |
| 04/19/2024 09:35:26.072830830 | -0.007 |
| 04/19/2024 09:35:27.089608163 | 0.003 |
| 04/19/2024 09:35:28.106388860 | 0.003 |
| 04/19/2024 09:35:29.123165739 | 0.003 |
| 04/19/2024 09:35:30.139942496 | 0.003 |
| 04/19/2024 09:35:31.156726042 | 0.003 |
| 04/19/2024 09:35:32.173505951 | -0.007 |
| 04/19/2024 09:35:33.190287678 | 0.003 |
| 04/19/2024 09:35:34.207063709 | 0.003 |
| 04/19/2024 09:35:35.223842162 | 0.003 |
| 04/19/2024 09:35:36.240615859 | 0.003 |
| 04/19/2024 09:35:37.257393041 | 0.003 |
| 04/19/2024 09:35:38.274173374 | 0.003 |
| 04/19/2024 09:35:39.290950162 | -0.007 |
| 04/19/2024 09:35:40.307728556 | -0.007 |
| 04/19/2024 09:35:41.324504708 | 0.003 |
| 04/19/2024 09:35:42.341281799 | 0.003 |
| 04/19/2024 09:35:43.358058102 | 0.003 |
| 04/19/2024 09:35:44.374831011 | 0.003 |
| 04/19/2024 09:35:45.391648465 | 0.003 |
| 04/19/2024 09:35:46.408432011 | 0.003 |
| 04/19/2024 09:35:47.425216374 | -0.007 |
| 04/19/2024 09:35:48.441999193 | 0.003 |
| 04/19/2024 09:35:49.458774708 | -0.007 |
| 04/19/2024 09:35:50.475551435 | 0.003 |
| 04/19/2024 09:35:51.492328859 | 0.003 |
| 04/19/2024 09:35:52.509107829 | 0.003 |
| 04/19/2024 09:35:53.525887677 | 0.003 |
| 04/19/2024 09:35:54.542661071 | 0.003 |
| 04/19/2024 09:35:55.559439102 | 0.003 |
| 04/19/2024 09:35:56.576215617 | 0.003 |
| 04/19/2024 09:35:57.592988556 | 0.003 |
| 04/19/2024 09:35:58.609769890 | 0.003 |
| 04/19/2024 09:35:59.626539193 | 0.003 |
| 04/19/2024 09:36:00.643319132 | 0.003 |
| 04/19/2024 09:36:01.660106829 | 0.003 |
| 04/19/2024 09:36:02.676887465 | 0.003 |
| 04/19/2024 09:36:03.693668465 | 0.003 |
| 04/19/2024 09:36:04.710452617 | 0.003 |
| 04/19/2024 09:36:05.727228330 | 0.003 |
| 04/19/2024 09:36:06.744011451 | 0.003 |
| 04/19/2024 09:36:07.760785269 | 0.003 |
| 04/19/2024 09:36:08.777563420 | 0.003 |
| 04/19/2024 09:36:09.794344087 | 0.003 |
| 04/19/2024 09:36:10.811119420 | 0.003 |
| 04/19/2024 09:36:11.827901572 | 0.003 |
| 04/19/2024 09:36:12.844681754 | 0.003 |
| 04/19/2024 09:36:13.861460239 | 0.003 |
| 04/19/2024 09:36:14.878240208 | 0.003 |
| 04/19/2024 09:36:15.895020663 | 0.003 |
| 04/19/2024 09:36:16.911806633 | 0.003 |
| 04/19/2024 09:36:17.928580542 | 0.003 |
| 04/19/2024 09:36:18.945364542 | 0.003 |
| 04/19/2024 09:36:19.962147572 | -0.007 |
| 04/19/2024 09:36:20.978928572 | 0.003 |
| 04/19/2024 09:36:21.995711936 | 0.003 |
| 04/19/2024 09:36:23.012497360 | 0.003 |
| 04/19/2024 09:36:24.029273420 | 0.003 |
| 04/19/2024 09:36:25.046061269 | -0.007 |
| 04/19/2024 09:36:26.062832784 | 0.003 |
| 04/19/2024 09:36:27.079608117 | 0.003 |
| 04/19/2024 09:36:28.096394330 | 0.003 |
| 04/19/2024 09:36:29.113171572 | -0.007 |
| 04/19/2024 09:36:30.129952057 | 0.003 |
| 04/19/2024 09:36:31.146727936 | 0.003 |
| 04/19/2024 09:36:32.163510451 | -0.007 |
| 04/19/2024 09:36:33.180289299 | 0.003 |
| 04/19/2024 09:36:34.197067420 | 0.003 |
| 04/19/2024 09:36:35.213852451 | 0.003 |
| 04/19/2024 09:36:36.247379148 | 0 |
| 04/19/2024 09:36:37.268322148 | -0.007 |
| 04/19/2024 09:36:38.285116845 | 0.015 |
| 04/19/2024 09:36:39.301895966 | 0.014 |
| 04/19/2024 09:36:40.318673784 | 0.014 |
| 04/19/2024 09:36:41.335449057 | 0.014 |
| 04/19/2024 09:36:42.352227633 | 0.014 |
| 04/19/2024 09:36:43.369004572 | 0.014 |
| 04/19/2024 09:36:44.385779966 | 0.014 |
| 04/19/2024 09:36:45.402561087 | 0.014 |
| 04/19/2024 09:36:46.419344845 | 0.014 |
| 04/19/2024 09:36:47.436132663 | 0.014 |
| 04/19/2024 09:36:48.452916905 | 0.014 |
| 04/19/2024 09:36:49.469696178 | 0.014 |
| 04/19/2024 09:36:50.486472633 | 0.014 |
| 04/19/2024 09:36:51.503252875 | 0.013 |
| 04/19/2024 09:36:52.520029390 | 0.013 |
| 04/19/2024 09:36:53.536811360 | 0.013 |
| 04/19/2024 09:36:54.553585905 | 0.013 |
| 04/19/2024 09:36:55.570362239 | 0.013 |
| 04/19/2024 09:36:56.587138178 | 0.013 |
| 04/19/2024 09:36:57.603915815 | 0.013 |
| 04/19/2024 09:36:58.620690996 | 0.013 |
| 04/19/2024 09:36:59.637465087 | 0.013 |
| 04/19/2024 09:37:00.654243118 | 0.013 |
| 04/19/2024 09:37:01.671022481 | 0.013 |
| 04/19/2024 09:37:02.687790299 | 0.013 |
| 04/19/2024 09:37:03.704575693 | 0.013 |
| 04/19/2024 09:37:04.721356875 | 0.013 |
| 04/19/2024 09:37:05.738132906 | 0.013 |
| 04/19/2024 09:37:06.754916178 | 0.013 |
| 04/19/2024 09:37:07.771686724 | 0.013 |
| 04/19/2024 09:37:08.788464906 | 0.013 |
| 04/19/2024 09:37:09.805247784 | 0.013 |
| 04/19/2024 09:37:10.822024542 | 0.013 |
| 04/19/2024 09:37:11.838801299 | 0.013 |
| 04/19/2024 09:37:12.855575906 | 0.012 |
| 04/19/2024 09:37:13.872353724 | 0.012 |
| 04/19/2024 09:37:14.889131815 | 0.012 |
| 04/19/2024 09:37:15.905909512 | 0.012 |
| 04/19/2024 09:37:16.922692178 | 0.012 |
| 04/19/2024 09:37:17.939463299 | 0.012 |
| 04/19/2024 09:37:18.956246481 | 0.012 |
| 04/19/2024 09:37:19.973030451 | 0.012 |
| 04/19/2024 09:37:20.989801118 | 0.012 |
| 04/19/2024 09:37:22.006588330 | 0.012 |
| 04/19/2024 09:37:23.023370481 | 0.012 |
| 04/19/2024 09:37:24.040150724 | 0.012 |
| 04/19/2024 09:37:25.056928269 | 0.012 |
| 04/19/2024 09:37:26.073702057 | 0.012 |
| 04/19/2024 09:37:27.090479148 | 0.012 |
| 04/19/2024 09:37:28.107263057 | 0.012 |
| 04/19/2024 09:37:29.124038451 | 0.012 |
| 04/19/2024 09:37:30.140817754 | 0.012 |
| 04/19/2024 09:37:31.157594330 | 0.012 |
| 04/19/2024 09:37:32.174376724 | 0.012 |
| 04/19/2024 09:37:33.191159602 | 0.012 |
| 04/19/2024 09:37:34.207938663 | 0.012 |
| 04/19/2024 09:37:35.224720405 | 0.012 |
| 04/19/2024 09:37:36.241491042 | 0.012 |
| 04/19/2024 09:37:37.258268345 | 0.012 |
| 04/19/2024 09:37:38.275046526 | 0.012 |
| 04/19/2024 09:37:39.291821375 | 0.012 |
| 04/19/2024 09:37:40.308598102 | 0.012 |
| 04/19/2024 09:37:41.325379193 | 0.012 |
| 04/19/2024 09:37:42.342154860 | 0.012 |
| 04/19/2024 09:37:43.358929405 | 0.012 |
| 04/19/2024 09:37:44.375704617 | 0.012 |
| 04/19/2024 09:37:45.392481405 | 0.012 |
| 04/19/2024 09:37:46.409258769 | 0.012 |
| 04/19/2024 09:37:47.426031799 | 0.011 |
| 04/19/2024 09:37:48.442818617 | 0.011 |
| 04/19/2024 09:37:49.459591648 | 0.011 |
| 04/19/2024 09:37:50.476359648 | 0.011 |
| 04/19/2024 09:37:51.493136617 | 0.011 |
| 04/19/2024 09:37:52.509919799 | 0.011 |
| 04/19/2024 09:37:53.526700769 | 0.011 |
| 04/19/2024 09:37:54.543481860 | 0.011 |
| 04/19/2024 09:37:55.560252042 | 0.011 |
| 04/19/2024 09:37:56.577030102 | 0.011 |
| 04/19/2024 09:37:57.593808193 | 0.011 |
| 04/19/2024 09:37:58.610581951 | 0.011 |
| 04/19/2024 09:37:59.627360890 | 0.011 |
| 04/19/2024 09:38:00.644133829 | 0.011 |
| 04/19/2024 09:38:01.660910102 | 0.011 |
| 04/19/2024 09:38:02.677685132 | 0.011 |
| 04/19/2024 09:38:03.694470314 | 0.011 |
| 04/19/2024 09:38:04.711258345 | 0.011 |
| 04/19/2024 09:38:05.728031708 | 0.011 |
| 04/19/2024 09:38:06.744812678 | 0.011 |
| 04/19/2024 09:38:07.761584708 | 0.011 |
| 04/19/2024 09:38:08.778358375 | 0.011 |
| 04/19/2024 09:38:09.815872223 | 0.002 |
| 04/19/2024 09:38:10.832658526 | -0.007 |
| 04/19/2024 09:38:11.849437920 | -0.007 |
| 04/19/2024 09:38:12.866214829 | -0.007 |
| 04/19/2024 09:38:13.882991375 | -0.007 |
| 04/19/2024 09:38:14.899768739 | 0.002 |
| 04/19/2024 09:38:15.916540435 | -0.007 |
| 04/19/2024 09:38:16.933324678 | -0.007 |
| 04/19/2024 09:38:17.950104557 | -0.007 |
| 04/19/2024 09:38:18.966881314 | -0.007 |
| 04/19/2024 09:38:19.983662102 | 0.002 |
| 04/19/2024 09:38:21.000434557 | -0.007 |
| 04/19/2024 09:38:22.017213708 | -0.007 |
| 04/19/2024 09:38:23.033995769 | -0.007 |
| 04/19/2024 09:38:24.050773193 | -0.007 |
| 04/19/2024 09:38:25.067552284 | 0.002 |
| 04/19/2024 09:38:26.084325163 | -0.007 |
| 04/19/2024 09:38:27.101104102 | -0.007 |
| 04/19/2024 09:38:28.117886860 | -0.007 |
| 04/19/2024 09:38:29.134656860 | -0.007 |
| 04/19/2024 09:38:30.151438466 | 0.002 |
| 04/19/2024 09:38:31.168211617 | -0.007 |
| 04/19/2024 09:38:32.184985981 | -0.007 |
| 04/19/2024 09:38:33.201770617 | -0.007 |
| 04/19/2024 09:38:34.218544526 | -0.007 |
| 04/19/2024 09:38:35.235322814 | 0.002 |
| 04/19/2024 09:38:36.252101481 | -0.007 |
| 04/19/2024 09:38:37.268878451 | -0.007 |
| 04/19/2024 09:38:38.285658966 | -0.007 |
| 04/19/2024 09:38:39.302429723 | -0.007 |
| 04/19/2024 09:38:40.319204814 | 0.003 |
| 04/19/2024 09:38:41.335987875 | -0.007 |
| 04/19/2024 09:38:42.352764723 | -0.007 |
| 04/19/2024 09:38:43.369542451 | -0.007 |
| 04/19/2024 09:38:44.386317390 | -0.007 |
| 04/19/2024 09:38:45.403095511 | 0.003 |
| 04/19/2024 09:38:46.419873602 | -0.007 |
| 04/19/2024 09:38:47.436649087 | -0.007 |
| 04/19/2024 09:38:48.453431481 | -0.007 |
| 04/19/2024 09:38:49.470207269 | -0.007 |
| 04/19/2024 09:38:50.486981814 | 0.003 |
| 04/19/2024 09:38:51.503761269 | -0.007 |
| 04/19/2024 09:38:52.520539602 | -0.007 |
| 04/19/2024 09:38:53.537316542 | -0.007 |
| 04/19/2024 09:38:54.554091208 | -0.007 |
| 04/19/2024 09:38:55.570863966 | 0.003 |
| 04/19/2024 09:38:56.587641511 | -0.007 |
| 04/19/2024 09:38:57.604415602 | -0.007 |
| 04/19/2024 09:38:58.621191784 | -0.007 |
| 04/19/2024 09:38:59.637973451 | -0.007 |
| 04/19/2024 09:39:00.654750663 | 0.003 |
| 04/19/2024 09:39:01.671525693 | -0.007 |
| 04/19/2024 09:39:02.688299602 | -0.007 |
| 04/19/2024 09:39:03.705081936 | -0.007 |
| 04/19/2024 09:39:04.721862117 | -0.007 |
| 04/19/2024 09:39:05.755386223 | 0 |
| 04/19/2024 09:39:06.776334223 | -0.007 |
| 04/19/2024 09:39:07.793124556 | 0.014 |
| 04/19/2024 09:39:08.809904405 | 0.014 |
| 04/19/2024 09:39:09.826688223 | 0.014 |
| 04/19/2024 09:39:10.843467890 | 0.013 |
| 04/19/2024 09:39:11.860242738 | 0.013 |
| 04/19/2024 09:39:12.877019405 | 0.013 |
| 04/19/2024 09:39:13.893798981 | 0.013 |
| 04/19/2024 09:39:14.910579132 | 0.013 |
| 04/19/2024 09:39:15.927356950 | 0.013 |
| 04/19/2024 09:39:16.944147465 | 0.013 |
| 04/19/2024 09:39:17.960922344 | 0.013 |
| 04/19/2024 09:39:18.977704344 | 0.013 |
| 04/19/2024 09:39:19.994489890 | 0.013 |
| 04/19/2024 09:39:21.011264072 | 0.013 |
| 04/19/2024 09:39:22.028051253 | 0.013 |
| 04/19/2024 09:39:23.044836587 | 0.012 |
| 04/19/2024 09:39:24.061612556 | 0.012 |
| 04/19/2024 09:39:25.078397132 | 0.012 |
| 04/19/2024 09:39:26.095179041 | 0.012 |
| 04/19/2024 09:39:27.111956496 | 0.012 |
| 04/19/2024 09:39:28.128738526 | 0.012 |
| 04/19/2024 09:39:29.145514435 | 0.012 |
| 04/19/2024 09:39:30.162293193 | 0.012 |
| 04/19/2024 09:39:31.179069859 | 0.012 |
| 04/19/2024 09:39:32.195847162 | 0.012 |
| 04/19/2024 09:39:33.212628526 | 0.012 |
| 04/19/2024 09:39:34.229402405 | 0.012 |
| 04/19/2024 09:39:35.246189799 | 0.012 |
| 04/19/2024 09:39:36.262962708 | 0.012 |
| 04/19/2024 09:39:37.279736526 | 0.012 |
| 04/19/2024 09:39:38.296521223 | 0.012 |
| 04/19/2024 09:39:39.313291526 | 0.012 |
| 04/19/2024 09:39:40.330074041 | 0.012 |
| 04/19/2024 09:39:41.346859799 | 0.012 |
| 04/19/2024 09:39:42.363636253 | 0.012 |
| 04/19/2024 09:39:43.380413011 | 0.012 |
| 04/19/2024 09:39:44.397194223 | 0.011 |
| 04/19/2024 09:39:45.413973223 | 0.011 |
| 04/19/2024 09:39:46.430751465 | 0.011 |
| 04/19/2024 09:39:47.447529011 | 0.011 |
| 04/19/2024 09:39:48.464314920 | 0.011 |
| 04/19/2024 09:39:49.481120677 | 0.011 |
| 04/19/2024 09:39:50.497899374 | 0.011 |
| 04/19/2024 09:39:51.514683768 | 0.011 |
| 04/19/2024 09:39:52.531460374 | 0.011 |
| 04/19/2024 09:39:53.548241162 | 0.011 |
| 04/19/2024 09:39:54.565013374 | 0.011 |
| 04/19/2024 09:39:55.581783920 | 0.011 |
| 04/19/2024 09:39:56.598558374 | 0.011 |
| 04/19/2024 09:39:57.615328526 | 0.011 |
| 04/19/2024 09:39:58.632104041 | 0.011 |
| 04/19/2024 09:39:59.648886041 | 0.011 |
| 04/19/2024 09:40:00.686387223 | 0.002 |
| 04/19/2024 09:40:01.703184920 | -0.007 |
| 04/19/2024 09:40:02.719952768 | -0.007 |
| 04/19/2024 09:40:03.736733647 | -0.007 |
| 04/19/2024 09:40:04.753518162 | -0.007 |
| 04/19/2024 09:40:05.770290102 | 0.002 |
| 04/19/2024 09:40:06.787072435 | -0.007 |
| 04/19/2024 09:40:07.803852405 | -0.007 |
| 04/19/2024 09:40:08.820627738 | -0.007 |
| 04/19/2024 09:40:09.837405981 | -0.007 |
| 04/19/2024 09:40:10.854185011 | 0.002 |
| 04/19/2024 09:40:11.870962375 | -0.007 |
| 04/19/2024 09:40:12.887736405 | -0.007 |
| 04/19/2024 09:40:13.904511496 | -0.007 |
| 04/19/2024 09:40:14.921287526 | -0.007 |
| 04/19/2024 09:40:15.938061829 | 0.002 |
| 04/19/2024 09:40:16.954845162 | -0.007 |
| 04/19/2024 09:40:17.971616738 | -0.007 |
| 04/19/2024 09:40:18.988393799 | -0.007 |
| 04/19/2024 09:40:20.005176375 | -0.007 |
| 04/19/2024 09:40:21.021950829 | 0.002 |
| 04/19/2024 09:40:22.038731253 | -0.007 |
| 04/19/2024 09:40:23.055516193 | -0.007 |
| 04/19/2024 09:40:24.072291829 | -0.007 |
| 04/19/2024 09:40:25.089073981 | -0.007 |
| 04/19/2024 09:40:26.105849829 | 0.002 |
| 04/19/2024 09:40:27.122629496 | -0.007 |
| 04/19/2024 09:40:28.139412708 | -0.007 |
| 04/19/2024 09:40:29.156186647 | -0.007 |
| 04/19/2024 09:40:30.172960132 | -0.007 |
| 04/19/2024 09:40:31.189736072 | 0.002 |
| 04/19/2024 09:40:32.206513738 | -0.007 |
| 04/19/2024 09:40:33.223298162 | -0.007 |
| 04/19/2024 09:40:34.240071041 | -0.007 |
| 04/19/2024 09:40:35.256850072 | -0.007 |
| 04/19/2024 09:40:36.273622102 | 0.003 |
| 04/19/2024 09:40:37.290399436 | -0.007 |
| 04/19/2024 09:40:38.307187102 | -0.007 |
| 04/19/2024 09:40:39.323957860 | -0.007 |
| 04/19/2024 09:40:40.340731951 | -0.007 |
| 04/19/2024 09:40:41.357513769 | 0.003 |
| 04/19/2024 09:40:42.374289345 | -0.007 |
| 04/19/2024 09:40:43.391064587 | -0.007 |
| 04/19/2024 09:40:44.407843981 | -0.007 |
| 04/19/2024 09:40:45.424621284 | -0.007 |
| 04/19/2024 09:40:46.441398981 | 0.003 |
| 04/19/2024 09:40:47.458176830 | -0.007 |
| 04/19/2024 09:40:48.474962375 | -0.007 |
| 04/19/2024 09:40:49.491738830 | -0.007 |
| 04/19/2024 09:40:50.508518072 | -0.007 |
| 04/19/2024 09:40:51.525291254 | 0.003 |
| 04/19/2024 09:40:52.542062981 | -0.007 |
| 04/19/2024 09:40:53.558839224 | -0.007 |
| 04/19/2024 09:40:54.575611951 | -0.007 |
| 04/19/2024 09:40:55.592385284 | -0.007 |
| 04/19/2024 09:40:56.609162557 | 0.003 |
| 04/19/2024 09:40:57.625932345 | -0.007 |
| 04/19/2024 09:40:58.642707527 | -0.007 |
| 04/19/2024 09:40:59.659485102 | -0.007 |
| 04/19/2024 09:41:00.676261739 | -0.007 |
| 04/19/2024 09:41:01.693036557 | 0.002 |
| 04/19/2024 09:41:02.709815345 | -0.007 |
| 04/19/2024 09:41:03.726603618 | -0.007 |
| 04/19/2024 09:41:04.743387496 | -0.007 |
| 04/19/2024 09:41:05.760167648 | -0.007 |
| 04/19/2024 09:41:06.776950133 | -0.003 |
| 04/19/2024 09:41:07.793729830 | -0.007 |
| 04/19/2024 09:41:08.810509405 | -0.007 |
| 04/19/2024 09:41:09.827293830 | -0.007 |
| 04/19/2024 09:41:10.844074133 | -0.007 |
| 04/19/2024 09:41:11.860849739 | -0.007 |
| 04/19/2024 09:41:12.877628708 | -0.007 |
| 04/19/2024 09:41:13.894407254 | -0.007 |
| 04/19/2024 09:41:14.911185739 | 0.003 |
| 04/19/2024 09:41:15.927962466 | -0.007 |
| 04/19/2024 09:41:16.944741254 | -0.007 |
| 04/19/2024 09:41:17.961519072 | 0.003 |
| 04/19/2024 09:41:18.978299830 | -0.007 |
| 04/19/2024 09:41:19.995086890 | -0.007 |
| 04/19/2024 09:41:21.011866860 | 0.003 |
| 04/19/2024 09:41:22.028647617 | -0.007 |
| 04/19/2024 09:41:23.045434193 | -0.007 |
| 04/19/2024 09:41:24.062206254 | -0.007 |
| 04/19/2024 09:41:25.078988042 | 0.003 |
| 04/19/2024 09:41:26.095765860 | -0.007 |
| 04/19/2024 09:41:27.112539102 | 0.003 |
| 04/19/2024 09:41:28.129324314 | -0.007 |
| 04/19/2024 09:41:29.146100708 | -0.007 |
| 04/19/2024 09:41:30.162875345 | -0.007 |
| 04/19/2024 09:41:31.179652739 | -0.007 |
| 04/19/2024 09:41:32.196432648 | -0.007 |
| 04/19/2024 09:41:33.213208496 | 0.003 |
| 04/19/2024 09:41:34.229986708 | 0.003 |
| 04/19/2024 09:41:35.246774330 | -0.007 |
| 04/19/2024 09:41:36.263553572 | -0.007 |
| 04/19/2024 09:41:37.280328724 | 0.003 |
| 04/19/2024 09:41:38.297114481 | -0.007 |
| 04/19/2024 09:41:39.313887572 | -0.007 |
| 04/19/2024 09:41:40.330665936 | 0.003 |
| 04/19/2024 09:41:41.347449633 | 0.003 |
| 04/19/2024 09:41:42.364221693 | 0.003 |
| 04/19/2024 09:41:43.381000451 | 0.003 |
| 04/19/2024 09:41:44.397782724 | -0.005 |
| 04/19/2024 09:41:45.414559936 | 0.003 |
| 04/19/2024 09:41:46.431349542 | -0.007 |
| 04/19/2024 09:41:47.448128118 | -0.007 |
| 04/19/2024 09:41:48.464904451 | -0.007 |
| 04/19/2024 09:41:49.481678875 | -0.007 |
| 04/19/2024 09:41:50.498454754 | 0.003 |
| 04/19/2024 09:41:51.515230148 | -0.007 |
| 04/19/2024 09:41:52.532000208 | -0.007 |
| 04/19/2024 09:41:53.548778602 | 0.003 |
| 04/19/2024 09:41:54.565554693 | 0.003 |
| 04/19/2024 09:41:55.582331511 | -0.007 |
| 04/19/2024 09:41:56.599107693 | -0.007 |
| 04/19/2024 09:41:57.615882118 | 0.003 |
| 04/19/2024 09:41:58.632660875 | -0.007 |
| 04/19/2024 09:41:59.649442936 | 0.003 |
| 04/19/2024 09:42:00.666214875 | -0.007 |
| 04/19/2024 09:42:01.682992390 | 0.003 |
| 04/19/2024 09:42:02.699772269 | 0.003 |
| 04/19/2024 09:42:03.716547905 | -0.007 |
| 04/19/2024 09:42:04.733330421 | 0.003 |
| 04/19/2024 09:42:05.750107859 | -0.007 |
| 04/19/2024 09:42:06.766889496 | 0.003 |
| 04/19/2024 09:42:07.783666496 | 0.003 |
| 04/19/2024 09:42:08.800442162 | 0.003 |
| 04/19/2024 09:42:09.817225072 | 0.003 |
| 04/19/2024 09:42:10.834002253 | 0.003 |
| 04/19/2024 09:42:11.850782223 | 0.003 |
| 04/19/2024 09:42:12.867565617 | -0.007 |
| 04/19/2024 09:42:13.884345708 | -0.007 |
| 04/19/2024 09:42:14.901126435 | -0.007 |
| 04/19/2024 09:42:15.917902435 | 0.003 |
| 04/19/2024 09:42:16.934684011 | 0.003 |
| 04/19/2024 09:42:17.951458708 | 0.003 |
| 04/19/2024 09:42:18.968236041 | 0.003 |
| 04/19/2024 09:42:19.985019526 | 0.003 |
| 04/19/2024 09:42:21.001800465 | 0.003 |
| 04/19/2024 09:42:22.018581132 | 0.003 |
| 04/19/2024 09:42:23.035361859 | 0.003 |
| 04/19/2024 09:42:24.052136738 | 0.003 |
| 04/19/2024 09:42:25.068918193 | 0.003 |
| 04/19/2024 09:42:26.085689132 | 0.003 |
| 04/19/2024 09:42:27.102467950 | 0.003 |
| 04/19/2024 09:42:28.119255314 | 0.003 |
| 04/19/2024 09:42:29.136030102 | -0.007 |
| 04/19/2024 09:42:30.152806223 | 0.003 |
| 04/19/2024 09:42:31.169589496 | 0.003 |
| 04/19/2024 09:42:32.186364950 | 0.003 |
| 04/19/2024 09:42:33.203142102 | 0.003 |
| 04/19/2024 09:42:34.219916405 | 0.003 |
| 04/19/2024 09:42:35.236697314 | 0.003 |
| 04/19/2024 09:42:36.253477647 | 0.003 |
| 04/19/2024 09:42:37.270247556 | 0.001 |
| 04/19/2024 09:42:38.287031072 | -0.007 |
| 04/19/2024 09:42:39.303809435 | -0.007 |
| 04/19/2024 09:42:40.320586890 | 0.003 |
| 04/19/2024 09:42:41.337367799 | 0.003 |
| 04/19/2024 09:42:42.354142011 | -0.007 |
| 04/19/2024 09:42:43.370916314 | 0.003 |
| 04/19/2024 09:42:44.387689769 | 0.003 |
| 04/19/2024 09:42:45.404467708 | 0.003 |
| 04/19/2024 09:42:46.421244981 | -0.007 |
| 04/19/2024 09:42:47.438017829 | 0.003 |
| 04/19/2024 09:42:48.454793859 | 0.003 |
| 04/19/2024 09:42:49.471575132 | -0.007 |
| 04/19/2024 09:42:50.488358708 | 0.003 |
| 04/19/2024 09:42:51.505136072 | -0.007 |
| 04/19/2024 09:42:52.521911102 | -0.007 |
| 04/19/2024 09:42:53.538686859 | 0.003 |
| 04/19/2024 09:42:54.555467072 | -0.007 |
| 04/19/2024 09:42:55.572238041 | 0.003 |
| 04/19/2024 09:42:56.589018253 | -0.007 |
| 04/19/2024 09:42:57.605791799 | -0.007 |
| 04/19/2024 09:42:58.622567193 | 0.003 |
| 04/19/2024 09:42:59.639347799 | 0.003 |
| 04/19/2024 09:43:00.656124678 | 0.003 |
| 04/19/2024 09:43:01.672901223 | -0.007 |
| 04/19/2024 09:43:02.689673859 | -0.007 |
| 04/19/2024 09:43:03.706451041 | -0.007 |
| 04/19/2024 09:43:04.723226678 | 0.003 |
| 04/19/2024 09:43:05.739996769 | -0.007 |
| 04/19/2024 09:43:06.756775951 | 0.003 |
| 04/19/2024 09:43:07.773556284 | -0.007 |
| 04/19/2024 09:43:08.790329254 | -0.007 |
| 04/19/2024 09:43:09.807108890 | -0.007 |
| 04/19/2024 09:43:10.823882708 | 0.003 |
| 04/19/2024 09:43:11.840660557 | -0.007 |
| 04/19/2024 09:43:12.857446042 | 0.003 |
| 04/19/2024 09:43:13.874221890 | 0.003 |
| 04/19/2024 09:43:14.890996314 | 0.003 |
| 04/19/2024 09:43:15.907776254 | 0.003 |
| 04/19/2024 09:43:16.924553981 | -0.007 |
| 04/19/2024 09:43:17.941331163 | 0.003 |
| 04/19/2024 09:43:18.958108738 | 0.003 |
| 04/19/2024 09:43:19.974885223 | 0.003 |
| 04/19/2024 09:43:20.991665829 | -0.007 |
| 04/19/2024 09:43:22.008448738 | 0.003 |
| 04/19/2024 09:43:23.025229345 | -0.007 |
| 04/19/2024 09:43:24.042002829 | 0.003 |
| 04/19/2024 09:43:25.058785769 | 0.003 |
| 04/19/2024 09:43:26.075566466 | 0.003 |
| 04/19/2024 09:43:27.092346072 | -0.007 |
| 04/19/2024 09:43:28.109128920 | 0.003 |
| 04/19/2024 09:43:29.125904799 | 0.003 |
| 04/19/2024 09:43:30.142680799 | -0.007 |
| 04/19/2024 09:43:31.159465920 | 0.003 |
| 04/19/2024 09:43:32.176242526 | 0.003 |
| 04/19/2024 09:43:33.193019011 | 0.003 |
| 04/19/2024 09:43:34.226557223 | 0 |
| 04/19/2024 09:43:35.247511223 | -0.007 |
| 04/19/2024 09:43:36.264300981 | 0.015 |
| 04/19/2024 09:43:37.281080253 | 0.014 |
| 04/19/2024 09:43:38.297865647 | 0.014 |
| 04/19/2024 09:43:39.314639647 | 0.014 |
| 04/19/2024 09:43:40.331421859 | 0.014 |
| 04/19/2024 09:43:41.348204405 | 0.014 |
| 04/19/2024 09:43:42.364980162 | 0.014 |
| 04/19/2024 09:43:43.381759223 | 0.014 |
| 04/19/2024 09:43:44.398537526 | 0.014 |
| 04/19/2024 09:43:45.415317859 | 0.014 |
| 04/19/2024 09:43:46.432100314 | 0.013 |
| 04/19/2024 09:43:47.448875496 | 0.013 |
| 04/19/2024 09:43:48.465650981 | 0.013 |
| 04/19/2024 09:43:49.482430314 | 0.013 |
| 04/19/2024 09:43:50.499205041 | 0.013 |
| 04/19/2024 09:43:51.515983102 | 0.013 |
| 04/19/2024 09:43:52.532757253 | 0.013 |
| 04/19/2024 09:43:53.549535556 | 0.013 |
| 04/19/2024 09:43:54.566315041 | 0.013 |
| 04/19/2024 09:43:55.583091405 | 0.013 |
| 04/19/2024 09:43:56.599872647 | 0.013 |
| 04/19/2024 09:43:57.616646162 | 0.013 |
| 04/19/2024 09:43:58.633425162 | 0.013 |
| 04/19/2024 09:43:59.650208193 | 0.013 |
| 04/19/2024 09:44:00.666986314 | 0.013 |
| 04/19/2024 09:44:01.683765041 | 0.013 |
| 04/19/2024 09:44:02.700542102 | 0.013 |
| 04/19/2024 09:44:03.717317162 | 0.013 |
| 04/19/2024 09:44:04.734094284 | 0.012 |
| 04/19/2024 09:44:05.750872420 | 0.012 |
| 04/19/2024 09:44:06.767654541 | 0.012 |
| 04/19/2024 09:44:07.784433087 | 0.012 |
| 04/19/2024 09:44:08.801211238 | 0.012 |
| 04/19/2024 09:44:09.817994481 | 0.012 |
| 04/19/2024 09:44:10.834767844 | 0.012 |
| 04/19/2024 09:44:11.851549420 | 0.012 |
| 04/19/2024 09:44:12.868333238 | 0.012 |
| 04/19/2024 09:44:13.885110178 | 0.012 |
| 04/19/2024 09:44:14.901896481 | 0.012 |
| 04/19/2024 09:44:15.918668572 | 0.012 |
| 04/19/2024 09:44:16.935447784 | 0.012 |
| 04/19/2024 09:44:17.952231178 | 0.012 |
| 04/19/2024 09:44:18.969006814 | 0.012 |
| 04/19/2024 09:44:19.985789238 | 0.012 |
| 04/19/2024 09:44:21.002568935 | 0.012 |
| 04/19/2024 09:44:22.019351178 | 0.012 |
| 04/19/2024 09:44:23.036136935 | 0.012 |
| 04/19/2024 09:44:24.052908420 | 0.012 |
| 04/19/2024 09:44:25.069692057 | 0.012 |
| 04/19/2024 09:44:26.086473905 | 0.012 |
| 04/19/2024 09:44:27.103249602 | 0.012 |
| 04/19/2024 09:44:28.120038481 | 0.012 |
| 04/19/2024 09:44:29.136816784 | 0.012 |
| 04/19/2024 09:44:30.153596784 | 0.012 |
| 04/19/2024 09:44:31.170382360 | 0.012 |
| 04/19/2024 09:44:32.187159269 | 0.012 |
| 04/19/2024 09:44:33.203938935 | 0.012 |
| 04/19/2024 09:44:34.220711117 | 0.011 |
| 04/19/2024 09:44:35.237488026 | 0.011 |
| 04/19/2024 09:44:36.254273299 | 0.011 |
| 04/19/2024 09:44:37.271048238 | 0.011 |
| 04/19/2024 09:44:38.287827026 | 0.011 |
| 04/19/2024 09:44:39.304602117 | 0.011 |
| 04/19/2024 09:44:40.321382814 | 0.011 |
| 04/19/2024 09:44:41.338166784 | 0.011 |
| 04/19/2024 09:44:42.354941360 | 0.011 |
| 04/19/2024 09:44:43.371719117 | 0.011 |
| 04/19/2024 09:44:44.388498602 | 0.011 |
| 04/19/2024 09:44:45.405275057 | 0.011 |
| 04/19/2024 09:44:46.422060057 | 0.011 |
| 04/19/2024 09:44:47.438832087 | 0.011 |
| 04/19/2024 09:44:48.455611693 | 0.011 |
| 04/19/2024 09:44:49.472389905 | 0.011 |
| 04/19/2024 09:44:50.489166844 | 0.011 |
| 04/19/2024 09:44:51.505945572 | 0.011 |
| 04/19/2024 09:44:52.522720511 | 0.011 |
| 04/19/2024 09:44:53.539500420 | 0.011 |
| 04/19/2024 09:44:54.556285178 | 0.011 |
| 04/19/2024 09:44:55.593784238 | 0.002 |
| 04/19/2024 09:44:56.610583208 | -0.007 |
| 04/19/2024 09:44:57.627361875 | -0.007 |
| 04/19/2024 09:44:58.644140420 | -0.007 |
| 04/19/2024 09:44:59.660923178 | -0.007 |
| 04/19/2024 09:45:00.677696602 | 0.002 |
| 04/19/2024 09:45:01.694485996 | -0.007 |
| 04/19/2024 09:45:02.711258390 | -0.007 |
| 04/19/2024 09:45:03.728033360 | -0.007 |
| 04/19/2024 09:45:04.744809905 | -0.007 |
| 04/19/2024 09:45:05.761587768 | 0.002 |
| 04/19/2024 09:45:06.778371738 | -0.007 |
| 04/19/2024 09:45:07.795154587 | -0.007 |
| 04/19/2024 09:45:08.811933617 | -0.007 |
| 04/19/2024 09:45:09.828716647 | -0.007 |
| 04/19/2024 09:45:10.845494556 | 0.002 |
| 04/19/2024 09:45:11.862275011 | -0.007 |
| 04/19/2024 09:45:12.879054647 | -0.007 |
| 04/19/2024 09:45:13.895829496 | -0.007 |
| 04/19/2024 09:45:14.912612980 | -0.007 |
| 04/19/2024 09:45:15.929390374 | 0.002 |
| 04/19/2024 09:45:16.946164465 | -0.007 |
| 04/19/2024 09:45:17.962944102 | -0.007 |
| 04/19/2024 09:45:18.979719405 | -0.007 |
| 04/19/2024 09:45:19.996502284 | -0.007 |
| 04/19/2024 09:45:21.013279071 | 0.002 |
| 04/19/2024 09:45:22.030062193 | -0.007 |
| 04/19/2024 09:45:23.046848496 | -0.007 |
| 04/19/2024 09:45:24.063619708 | -0.007 |
| 04/19/2024 09:45:25.080404465 | -0.007 |
| 04/19/2024 09:45:26.097189708 | 0.002 |
| 04/19/2024 09:45:27.113963496 | -0.007 |
| 04/19/2024 09:45:28.130746132 | -0.007 |
| 04/19/2024 09:45:29.147523132 | -0.007 |
| 04/19/2024 09:45:30.164296859 | -0.007 |
| 04/19/2024 09:45:31.181079587 | 0.003 |
| 04/19/2024 09:45:32.197859496 | -0.007 |
| 04/19/2024 09:45:33.214631768 | -0.007 |
| 04/19/2024 09:45:34.231405738 | -0.007 |
| 04/19/2024 09:45:35.248185451 | -0.007 |
| 04/19/2024 09:45:36.264966239 | 0.003 |
| 04/19/2024 09:45:37.281746451 | -0.007 |
| 04/19/2024 09:45:38.298528420 | -0.007 |
| 04/19/2024 09:45:39.315302178 | -0.007 |
| 04/19/2024 09:45:40.332082390 | -0.007 |
| 04/19/2024 09:45:41.348865299 | 0.003 |
| 04/19/2024 09:45:42.365640239 | -0.007 |
| 04/19/2024 09:45:43.382420572 | -0.007 |
| 04/19/2024 09:45:44.399207299 | -0.007 |
| 04/19/2024 09:45:45.415985936 | -0.007 |
| 04/19/2024 09:45:46.432765299 | 0.003 |
| 04/19/2024 09:45:47.449543966 | -0.007 |
| 04/19/2024 09:45:48.466321723 | -0.007 |
| 04/19/2024 09:45:49.483103420 | -0.007 |
| 04/19/2024 09:45:50.499887117 | -0.007 |
| 04/19/2024 09:45:51.516667693 | 0.003 |
| 04/19/2024 09:45:52.533439875 | -0.007 |
| 04/19/2024 09:45:53.550225329 | -0.007 |
| 04/19/2024 09:45:54.567003723 | -0.007 |
| 04/19/2024 09:45:55.583776087 | -0.007 |
| 04/19/2024 09:45:56.600559632 | 0.003 |
| 04/19/2024 09:45:57.617334663 | -0.007 |
| 04/19/2024 09:45:58.634107239 | -0.007 |
| 04/19/2024 09:45:59.650889057 | -0.007 |
| 04/19/2024 09:46:00.667660663 | -0.007 |
| 04/19/2024 09:46:01.684437481 | 0.003 |
| 04/19/2024 09:46:02.701224511 | -0.007 |
| 04/19/2024 09:46:03.718000390 | -0.007 |
| 04/19/2024 09:46:04.734777057 | -0.007 |
| 04/19/2024 09:46:05.751555754 | 0.003 |
| 04/19/2024 09:46:06.768340329 | -0.007 |
| 04/19/2024 09:46:07.785119996 | -0.007 |
| 04/19/2024 09:46:08.801906178 | 0.003 |
| 04/19/2024 09:46:09.818687329 | -0.007 |
| 04/19/2024 09:46:10.835460057 | -0.007 |
| 04/19/2024 09:46:11.852243269 | 0.003 |
| 04/19/2024 09:46:12.869025572 | -0.007 |
| 04/19/2024 09:46:13.885799299 | 0.003 |
| 04/19/2024 09:46:14.902584057 | -0.007 |
| 04/19/2024 09:46:15.919358178 | -0.007 |
| 04/19/2024 09:46:16.936132996 | -0.007 |
| 04/19/2024 09:46:17.952914875 | -0.007 |
| 04/19/2024 09:46:18.969691117 | -0.007 |
| 04/19/2024 09:46:19.986469511 | -0.007 |
| 04/19/2024 09:46:21.003247905 | 0.003 |
| 04/19/2024 09:46:22.020030541 | 0.003 |
| 04/19/2024 09:46:23.036817541 | -0.007 |
| 04/19/2024 09:46:24.053592360 | -0.007 |
| 04/19/2024 09:46:25.070376390 | -0.007 |
| 04/19/2024 09:46:26.087159784 | -0.007 |
| 04/19/2024 09:46:27.103934481 | 0.003 |
| 04/19/2024 09:46:28.120719996 | -0.007 |
| 04/19/2024 09:46:29.137494117 | -0.007 |
| 04/19/2024 09:46:30.154269905 | -0.007 |
| 04/19/2024 09:46:31.171054905 | -0.007 |
| 04/19/2024 09:46:32.187829208 | 0.003 |
| 04/19/2024 09:46:33.204606420 | 0.003 |
| 04/19/2024 09:46:34.221376572 | 0.002 |
| 04/19/2024 09:46:35.238148209 | -0.007 |
| 04/19/2024 09:46:36.254923481 | -0.007 |
| 04/19/2024 09:46:37.271699754 | -0.007 |
| 04/19/2024 09:46:38.288479815 | 0.003 |
| 04/19/2024 09:46:39.305263209 | 0.003 |
| 04/19/2024 09:46:40.322043845 | 0.003 |
| 04/19/2024 09:46:41.338820603 | 0.003 |
| 04/19/2024 09:46:42.355599299 | 0.003 |
| 04/19/2024 09:46:43.372381269 | -0.007 |
| 04/19/2024 09:46:44.389163633 | -0.007 |
| 04/19/2024 09:46:45.405940239 | -0.007 |
| 04/19/2024 09:46:46.422722754 | 0.003 |
| 04/19/2024 09:46:47.439496390 | -0.007 |
| 04/19/2024 09:46:48.456276542 | -0.007 |
| 04/19/2024 09:46:49.473064784 | -0.007 |
| 04/19/2024 09:46:50.489839178 | -0.007 |
| 04/19/2024 09:46:51.506609512 | -0.007 |
| 04/19/2024 09:46:52.523386148 | -0.007 |
| 04/19/2024 09:46:53.556934209 | 0 |
| 04/19/2024 09:46:54.577884209 | -0.007 |
| 04/19/2024 09:46:55.594676572 | 0.014 |
| 04/19/2024 09:46:56.611459057 | 0.014 |
| 04/19/2024 09:46:57.628234087 | 0.014 |
| 04/19/2024 09:46:58.645014754 | 0.014 |
| 04/19/2024 09:46:59.661799815 | 0.014 |
| 04/19/2024 09:47:00.678572693 | 0.014 |
| 04/19/2024 09:47:01.695363724 | 0.014 |
| 04/19/2024 09:47:02.712147572 | 0.014 |
| 04/19/2024 09:47:03.728921299 | 0.014 |
| 04/19/2024 09:47:04.745704118 | 0.013 |
| 04/19/2024 09:47:05.762476224 | 0.013 |
| 04/19/2024 09:47:06.779261254 | 0.013 |
| 04/19/2024 09:47:07.796043618 | 0.013 |
| 04/19/2024 09:47:08.812821739 | 0.013 |
| 04/19/2024 09:47:09.829601557 | 0.013 |
| 04/19/2024 09:47:10.846379709 | 0.013 |
| 04/19/2024 09:47:11.863162799 | 0.013 |
| 04/19/2024 09:47:12.879945284 | 0.013 |
| 04/19/2024 09:47:13.896723860 | 0.013 |
| 04/19/2024 09:47:14.913502557 | 0.013 |
| 04/19/2024 09:47:15.930269406 | 0.013 |
| 04/19/2024 09:47:16.947048769 | 0.013 |
| 04/19/2024 09:47:17.963832072 | 0.013 |
| 04/19/2024 09:47:18.980607527 | 0.013 |
| 04/19/2024 09:47:19.997386102 | 0.012 |
| 04/19/2024 09:47:21.014167224 | 0.012 |
| 04/19/2024 09:47:22.030946496 | 0.012 |
| 04/19/2024 09:47:23.047733496 | 0.012 |
| 04/19/2024 09:47:24.064512587 | 0.012 |
| 04/19/2024 09:47:25.081296769 | 0.012 |
| 04/19/2024 09:47:26.098082254 | 0.012 |
| 04/19/2024 09:47:27.114857496 | 0.012 |
| 04/19/2024 09:47:28.131638618 | 0.012 |
| 04/19/2024 09:47:29.148415890 | 0.012 |
| 04/19/2024 09:47:30.165191739 | 0.012 |
| 04/19/2024 09:47:31.181976163 | 0.012 |
| 04/19/2024 09:47:32.198755193 | 0.012 |
| 04/19/2024 09:47:33.215533890 | 0.012 |
| 04/19/2024 09:47:34.232307042 | 0.012 |
| 04/19/2024 09:47:35.249097041 | 0.012 |
| 04/19/2024 09:47:36.265871647 | 0.012 |
| 04/19/2024 09:47:37.282653162 | 0.012 |
| 04/19/2024 09:47:38.299437768 | 0.012 |
| 04/19/2024 09:47:39.316217768 | 0.012 |
| 04/19/2024 09:47:40.332995011 | 0.012 |
| 04/19/2024 09:47:41.349774284 | 0.012 |
| 04/19/2024 09:47:42.366550011 | 0.012 |
| 04/19/2024 09:47:43.383331253 | 0.012 |
| 04/19/2024 09:47:44.400126465 | 0.012 |
| 04/19/2024 09:47:45.416906253 | 0.011 |
| 04/19/2024 09:47:46.433687647 | 0.011 |
| 04/19/2024 09:47:47.450466799 | 0.011 |
| 04/19/2024 09:47:48.467241253 | 0.011 |
| 04/19/2024 09:47:49.484020678 | 0.011 |
| 04/19/2024 09:47:50.500801890 | 0.011 |
| 04/19/2024 09:47:51.517577162 | 0.011 |
| 04/19/2024 09:47:52.534360617 | 0.011 |
| 04/19/2024 09:47:53.551143465 | 0.011 |
| 04/19/2024 09:47:54.567922465 | 0.011 |
| 04/19/2024 09:47:55.584696162 | 0.011 |
| 04/19/2024 09:47:56.601479647 | 0.011 |
| 04/19/2024 09:47:57.618264374 | 0.011 |
| 04/19/2024 09:47:58.635037920 | 0.011 |
| 04/19/2024 09:47:59.651822132 | 0.011 |
| 04/19/2024 09:48:00.668598799 | 0.011 |
| 04/19/2024 09:48:01.685376981 | 0.011 |
| 04/19/2024 09:48:02.722890223 | 0.002 |
| 04/19/2024 09:48:03.739677344 | -0.007 |
| 04/19/2024 09:48:04.756455647 | -0.007 |
| 04/19/2024 09:48:05.773227132 | -0.007 |
| 04/19/2024 09:48:06.790008587 | -0.007 |
| 04/19/2024 09:48:07.806787587 | 0.002 |
| 04/19/2024 09:48:08.823567981 | -0.007 |
| 04/19/2024 09:48:09.840351557 | -0.007 |
| 04/19/2024 09:48:10.857128223 | -0.007 |
| 04/19/2024 09:48:11.873903284 | -0.007 |
| 04/19/2024 09:48:12.890684920 | 0.002 |
| 04/19/2024 09:48:13.907460041 | -0.007 |
| 04/19/2024 09:48:14.924236647 | -0.007 |
| 04/19/2024 09:48:15.941007102 | -0.007 |
| 04/19/2024 09:48:16.957782617 | -0.007 |
| 04/19/2024 09:48:17.974561526 | 0.002 |
| 04/19/2024 09:48:18.991340829 | -0.007 |
| 04/19/2024 09:48:20.008118920 | -0.007 |
| 04/19/2024 09:48:21.024901799 | -0.007 |
| 04/19/2024 09:48:22.041684284 | -0.007 |
| 04/19/2024 09:48:23.058471647 | 0.002 |
| 04/19/2024 09:48:24.075244526 | -0.007 |
| 04/19/2024 09:48:25.092026072 | -0.007 |
| 04/19/2024 09:48:26.108807890 | -0.007 |
| 04/19/2024 09:48:27.125580041 | -0.007 |
| 04/19/2024 09:48:28.142363223 | 0.002 |
| 04/19/2024 09:48:29.159139799 | -0.007 |
| 04/19/2024 09:48:30.175911314 | -0.007 |
| 04/19/2024 09:48:31.192697708 | -0.007 |
| 04/19/2024 09:48:32.209477557 | -0.007 |
| 04/19/2024 09:48:33.226255829 | 0.002 |
| 04/19/2024 09:48:34.243027829 | -0.007 |
| 04/19/2024 09:48:35.259803390 | -0.007 |
| 04/19/2024 09:48:36.276586390 | -0.007 |
| 04/19/2024 09:48:37.293369420 | -0.007 |
| 04/19/2024 09:48:38.310152996 | 0.003 |
| 04/19/2024 09:48:39.326936693 | -0.007 |
| 04/19/2024 09:48:40.343715481 | -0.007 |
| 04/19/2024 09:48:41.360499451 | -0.007 |
| 04/19/2024 09:48:42.377272784 | -0.007 |
| 04/19/2024 09:48:43.394058026 | 0.003 |
| 04/19/2024 09:48:44.410840723 | -0.007 |
| 04/19/2024 09:48:45.427622360 | -0.007 |
| 04/19/2024 09:48:46.444407966 | -0.007 |
| 04/19/2024 09:48:47.461181390 | -0.007 |
| 04/19/2024 09:48:48.477962117 | 0.003 |
| 04/19/2024 09:48:49.494748663 | -0.007 |
| 04/19/2024 09:48:50.511521723 | -0.007 |
| 04/19/2024 09:48:51.528300996 | -0.007 |
| 04/19/2024 09:48:52.545074178 | -0.007 |
| 04/19/2024 09:48:53.561855239 | 0.003 |
| 04/19/2024 09:48:54.578638299 | -0.007 |
| 04/19/2024 09:48:55.595418481 | -0.007 |
| 04/19/2024 09:48:56.612198481 | -0.007 |
| 04/19/2024 09:48:57.628980451 | -0.007 |
| 04/19/2024 09:48:58.645757269 | 0.003 |
| 04/19/2024 09:48:59.662536178 | -0.007 |
| 04/19/2024 09:49:00.679310754 | -0.007 |
| 04/19/2024 09:49:01.696086996 | -0.007 |
| 04/19/2024 09:49:02.712867663 | -0.007 |
| 04/19/2024 09:49:03.729645360 | 0.003 |
| 04/19/2024 09:49:04.746423420 | -0.007 |
| 04/19/2024 09:49:05.763199450 | -0.007 |
| 04/19/2024 09:49:06.779975875 | -0.007 |
| 04/19/2024 09:49:07.796758026 | -0.007 |
| 04/19/2024 09:49:08.813542208 | 0.003 |
| 04/19/2024 09:49:09.830321875 | -0.007 |
| 04/19/2024 09:49:10.847106693 | -0.007 |
| 04/19/2024 09:49:11.863887632 | -0.007 |
| 04/19/2024 09:49:12.880668026 | -0.007 |
| 04/19/2024 09:49:13.897446905 | -0.007 |
| 04/19/2024 09:49:14.914228844 | -0.007 |
| 04/19/2024 09:49:15.931011693 | -0.007 |
| 04/19/2024 09:49:16.947786572 | -0.001 |
| 04/19/2024 09:49:17.964570511 | -0.007 |
| 04/19/2024 09:49:18.981347208 | -0.007 |
| 04/19/2024 09:49:19.998127238 | -0.007 |
| 04/19/2024 09:49:21.014911117 | -0.007 |
| 04/19/2024 09:49:22.031685753 | -0.007 |
| 04/19/2024 09:49:23.048466178 | -0.007 |
| 04/19/2024 09:49:24.065250269 | -0.004 |
| 04/19/2024 09:49:25.082032026 | -0.007 |
| 04/19/2024 09:49:26.098817329 | 0.003 |
| 04/19/2024 09:49:27.115594753 | -0.007 |
| 04/19/2024 09:49:28.132380935 | 0.003 |
| 04/19/2024 09:49:29.149164117 | -0.007 |
| 04/19/2024 09:49:30.165941147 | -0.007 |
| 04/19/2024 09:49:31.182724905 | -0.007 |
| 04/19/2024 09:49:32.199503784 | -0.002 |
| 04/19/2024 09:49:33.216282299 | -0.007 |
| 04/19/2024 09:49:34.233065481 | 0.003 |
| 04/19/2024 09:49:35.249843920 | 0.003 |
| 04/19/2024 09:49:36.266624890 | -0.007 |
| 04/19/2024 09:49:37.283396375 | -0.007 |
| 04/19/2024 09:49:38.300183405 | 0.003 |
| 04/19/2024 09:49:39.316967344 | 0.003 |
| 04/19/2024 09:49:40.333750102 | -0.007 |
| 04/19/2024 09:49:41.350538708 | -0.007 |
| 04/19/2024 09:49:42.367315193 | 0.003 |
| 04/19/2024 09:49:43.384095193 | 0.003 |
| 04/19/2024 09:49:44.400882950 | 0.003 |
| 04/19/2024 09:49:45.417657617 | 0.003 |
| 04/19/2024 09:49:46.434438041 | -0.007 |
| 04/19/2024 09:49:47.451219557 | -0.007 |
| 04/19/2024 09:49:48.467997284 | -0.007 |
| 04/19/2024 09:49:49.484780163 | 0.003 |
| 04/19/2024 09:49:50.501556708 | -0.007 |
| 04/19/2024 09:49:51.518329557 | -0.007 |
| 04/19/2024 09:49:52.535106526 | -0.007 |
| 04/19/2024 09:49:53.551884920 | -0.007 |
| 04/19/2024 09:49:54.568666284 | 0.003 |
| 04/19/2024 09:49:55.585447375 | 0.003 |
| 04/19/2024 09:49:56.602230526 | 0.003 |
| 04/19/2024 09:49:57.619011102 | 0.003 |
| 04/19/2024 09:49:58.635783678 | -0.007 |
| 04/19/2024 09:49:59.652570041 | 0.003 |
| 04/19/2024 09:50:00.669342557 | 0.003 |
| 04/19/2024 09:50:01.686118193 | 0.003 |
| 04/19/2024 09:50:02.702902466 | 0.003 |
| 04/19/2024 09:50:03.719675920 | 0.003 |
| 04/19/2024 09:50:04.736449314 | 0.003 |
| 04/19/2024 09:50:05.753231632 | -0.007 |
| 04/19/2024 09:50:06.770009783 | -0.007 |
| 04/19/2024 09:50:07.786783511 | -0.007 |
| 04/19/2024 09:50:08.803577814 | 0.003 |
| 04/19/2024 09:50:09.820363329 | 0.003 |
| 04/19/2024 09:50:10.837144905 | 0.003 |
| 04/19/2024 09:50:11.853926996 | -0.007 |
| 04/19/2024 09:50:12.870708117 | 0.003 |
| 04/19/2024 09:50:13.887480359 | -0.007 |
| 04/19/2024 09:50:14.904265147 | -0.007 |
| 04/19/2024 09:50:15.921046056 | 0.003 |
| 04/19/2024 09:50:16.937823389 | -0.007 |
| 04/19/2024 09:50:17.954603450 | 0.003 |
| 04/19/2024 09:50:18.971380753 | 0.003 |
| 04/19/2024 09:50:19.988157844 | 0.003 |
| 04/19/2024 09:50:21.004936844 | 0.003 |
| 04/19/2024 09:50:22.021714086 | 0.003 |
| 04/19/2024 09:50:23.038494511 | 0.003 |
| 04/19/2024 09:50:24.055277814 | -0.007 |
| 04/19/2024 09:50:25.072061692 | 0.003 |
| 04/19/2024 09:50:26.088842359 | -0.007 |
| 04/19/2024 09:50:27.105617238 | -0.007 |
| 04/19/2024 09:50:28.122398329 | 0.003 |
| 04/19/2024 09:50:29.139180480 | 0.003 |
| 04/19/2024 09:50:30.155955935 | 0.003 |
| 04/19/2024 09:50:31.172737299 | 0.003 |
| 04/19/2024 09:50:32.189512935 | 0.003 |
| 04/19/2024 09:50:33.206289814 | 0.003 |
| 04/19/2024 09:50:34.223071783 | -0.007 |
| 04/19/2024 09:50:35.239847466 | 0.003 |
| 04/19/2024 09:50:36.256622314 | -0.007 |
| 04/19/2024 09:50:37.273393860 | -0.007 |
| 04/19/2024 09:50:38.290175314 | -0.007 |
| 04/19/2024 09:50:39.306951648 | -0.007 |
| 04/19/2024 09:50:40.323736345 | -0.007 |
| 04/19/2024 09:50:41.340520102 | 0.003 |
| 04/19/2024 09:50:42.357302799 | -0.007 |
| 04/19/2024 09:50:43.374084132 | 0.003 |
| 04/19/2024 09:50:44.390873193 | 0.003 |
| 04/19/2024 09:50:45.407650314 | -0.007 |
| 04/19/2024 09:50:46.424433587 | 0.003 |
| 04/19/2024 09:50:47.441215678 | 0.003 |
| 04/19/2024 09:50:48.457994254 | 0.003 |
| 04/19/2024 09:50:49.474773163 | -0.007 |
| 04/19/2024 09:50:50.491548951 | 0.003 |
| 04/19/2024 09:50:51.508331102 | -0.002 |
| 04/19/2024 09:50:52.525102072 | 0.003 |
| 04/19/2024 09:50:53.541878436 | 0.003 |
| 04/19/2024 09:50:54.558659860 | 0.003 |
| 04/19/2024 09:50:55.575440708 | 0.003 |
| 04/19/2024 09:50:56.592222072 | -0.007 |
| 04/19/2024 09:50:57.609002617 | 0.003 |
| 04/19/2024 09:50:58.625776375 | 0.003 |
| 04/19/2024 09:50:59.642560829 | 0.003 |
| 04/19/2024 09:51:00.659348011 | 0.003 |
| 04/19/2024 09:51:01.676125466 | -0.007 |
| 04/19/2024 09:51:02.692905739 | 0.003 |
| 04/19/2024 09:51:03.709679072 | -0.007 |
| 04/19/2024 09:51:04.726452496 | 0.003 |
| 04/19/2024 09:51:05.743238314 | -0.007 |
| 04/19/2024 09:51:06.760014859 | -0.007 |
| 04/19/2024 09:51:07.776791072 | 0.003 |
| 04/19/2024 09:51:08.793571587 | -0.007 |
| 04/19/2024 09:51:09.810345981 | -0.007 |
| 04/19/2024 09:51:10.827129920 | 0.003 |
| 04/19/2024 09:51:11.843910041 | -0.007 |
| 04/19/2024 09:51:12.860687435 | 0.001 |
| 04/19/2024 09:51:13.877461829 | 0.003 |
| 04/19/2024 09:51:14.894246102 | 0.003 |
| 04/19/2024 09:51:15.911023072 | 0.003 |
| 04/19/2024 09:51:16.927799829 | 0.003 |
| 04/19/2024 09:51:17.944581314 | -0.007 |
| 04/19/2024 09:51:18.961360859 | -0.007 |
| 04/19/2024 09:51:19.978136890 | 0.003 |
| 04/19/2024 09:51:20.994923253 | 0.003 |
| 04/19/2024 09:51:22.011699799 | 0.003 |
| 04/19/2024 09:51:23.028481405 | 0.003 |
| 04/19/2024 09:51:24.045266465 | 0.003 |
| 04/19/2024 09:51:25.062041344 | -0.007 |
| 04/19/2024 09:51:26.078833465 | 0.003 |
| 04/19/2024 09:51:27.095621253 | 0.003 |
| 04/19/2024 09:51:28.112408011 | 0.003 |
| 04/19/2024 09:51:29.129193587 | 0.003 |
| 04/19/2024 09:51:30.145971526 | -0.004 |
| 04/19/2024 09:51:31.162757072 | 0.002 |
| 04/19/2024 09:51:32.179531496 | 0.003 |
| 04/19/2024 09:51:33.196312375 | 0.003 |
| 04/19/2024 09:51:34.213092375 | -0.007 |
| 04/19/2024 09:51:35.229866693 | -0.007 |
| 04/19/2024 09:51:36.246646027 | 0.003 |
| 04/19/2024 09:51:37.263429784 | 0.003 |
| 04/19/2024 09:51:38.280205996 | -0.007 |
| 04/19/2024 09:51:39.296982330 | -0.007 |
| 04/19/2024 09:51:40.313756481 | 0.003 |
| 04/19/2024 09:51:41.330544209 | 0.003 |
| 04/19/2024 09:51:42.347327815 | 0.003 |
| 04/19/2024 09:51:43.364108209 | 0.003 |
| 04/19/2024 09:51:44.380885966 | 0.003 |
| 04/19/2024 09:51:45.397665875 | 0.003 |
| 04/19/2024 09:51:46.414447087 | 0.003 |
| 04/19/2024 09:51:47.431230269 | 0.003 |
| 04/19/2024 09:51:48.448007936 | -0.007 |
| 04/19/2024 09:51:49.464791118 | 0.003 |
| 04/19/2024 09:51:50.481567572 | 0.003 |
| 04/19/2024 09:51:51.498346421 | 0.003 |
| 04/19/2024 09:51:52.515124845 | -0.007 |
| 04/19/2024 09:51:53.531896724 | -0.007 |
| 04/19/2024 09:51:54.548674299 | -0.004 |
| 04/19/2024 09:51:55.565453572 | 0.003 |
| 04/19/2024 09:51:56.582237481 | 0.003 |
| 04/19/2024 09:51:57.599025390 | -0.007 |
| 04/19/2024 09:51:58.615795602 | -0.007 |
| 04/19/2024 09:51:59.632578481 | 0.003 |
| 04/19/2024 09:52:00.649364724 | 0.003 |
| 04/19/2024 09:52:01.666140330 | 0.003 |
| 04/19/2024 09:52:02.682922905 | 0.003 |
| 04/19/2024 09:52:03.699700754 | 0.003 |
| 04/19/2024 09:52:04.716475996 | 0.003 |
| 04/19/2024 09:52:05.733258890 | 0.003 |
| 04/19/2024 09:52:06.750036739 | 0.003 |
| 04/19/2024 09:52:07.766815193 | 0.003 |
| 04/19/2024 09:52:08.783584012 | 0.003 |
| 04/19/2024 09:52:09.800362769 | 0.003 |
| 04/19/2024 09:52:10.817138254 | 0.003 |
| 04/19/2024 09:52:11.833917830 | -0.007 |
| 04/19/2024 09:52:12.850698406 | -0.007 |
| 04/19/2024 09:52:13.867479799 | 0.003 |
| 04/19/2024 09:52:14.884259618 | 0.003 |
| 04/19/2024 09:52:15.901042042 | 0.003 |
| 04/19/2024 09:52:16.917816799 | 0.003 |
| 04/19/2024 09:52:17.934596981 | 0.003 |
| 04/19/2024 09:52:18.951378981 | 0.003 |
| 04/19/2024 09:52:19.968150193 | -0.007 |
| 04/19/2024 09:52:20.984930133 | 0.003 |
| 04/19/2024 09:52:22.001712254 | 0.003 |
| 04/19/2024 09:52:23.018489557 | 0.003 |
| 04/19/2024 09:52:24.035268769 | 0.003 |
| 04/19/2024 09:52:25.052049466 | -0.007 |
| 04/19/2024 09:52:26.068830587 | 0.003 |
| 04/19/2024 09:52:27.085618648 | -0.007 |
| 04/19/2024 09:52:28.102400133 | 0.003 |
| 04/19/2024 09:52:29.119185890 | 0.003 |
| 04/19/2024 09:52:30.135957042 | -0.007 |
| 04/19/2024 09:52:31.152743284 | -0.007 |
| 04/19/2024 09:52:32.169526466 | 0.003 |
| 04/19/2024 09:52:33.186301284 | 0.003 |
| 04/19/2024 09:52:34.203087193 | 0.003 |
| 04/19/2024 09:52:35.219860754 | 0.003 |
| 04/19/2024 09:52:36.236638511 | 0.003 |
| 04/19/2024 09:52:37.253421935 | 0.003 |
| 04/19/2024 09:52:38.270196996 | 0.003 |
| 04/19/2024 09:52:39.286972239 | -0.007 |
| 04/19/2024 09:52:40.303748875 | 0.003 |
| 04/19/2024 09:52:41.320528178 | 0.003 |
| 04/19/2024 09:52:42.337312754 | 0.003 |
| 04/19/2024 09:52:43.354092814 | 0.003 |
| 04/19/2024 09:52:44.370868420 | -0.007 |
| 04/19/2024 09:52:45.387640148 | 0.003 |
| 04/19/2024 09:52:46.404420511 | -0.007 |
| 04/19/2024 09:52:47.421201117 | 0.003 |
| 04/19/2024 09:52:48.437979693 | 0.003 |
| 04/19/2024 09:52:49.454758481 | -0.007 |
| 04/19/2024 09:52:50.471540481 | 0.003 |
| 04/19/2024 09:52:51.488319026 | -0.007 |
| 04/19/2024 09:52:52.505102026 | -0.007 |
| 04/19/2024 09:52:53.521872784 | 0.003 |
| 04/19/2024 09:52:54.538649905 | 0.003 |
| 04/19/2024 09:52:55.555436996 | 0.003 |
| 04/19/2024 09:52:56.572213511 | -0.007 |
| 04/19/2024 09:52:57.588990632 | 0.003 |
| 04/19/2024 09:52:58.605772905 | -0.007 |
| 04/19/2024 09:52:59.622554935 | 0.003 |
| 04/19/2024 09:53:00.639335239 | 0.003 |
| 04/19/2024 09:53:01.656110693 | 0.003 |
| 04/19/2024 09:53:02.672893299 | 0.003 |
| 04/19/2024 09:53:03.689668935 | -0.007 |
| 04/19/2024 09:53:04.706448693 | 0.003 |
| 04/19/2024 09:53:05.723227026 | -0.007 |
| 04/19/2024 09:53:06.740002935 | 0.003 |
| 04/19/2024 09:53:07.756781542 | 0.003 |
| 04/19/2024 09:53:08.773564420 | 0.003 |
| 04/19/2024 09:53:09.790338966 | 0.003 |
| 04/19/2024 09:53:10.807115602 | 0.003 |
| 04/19/2024 09:53:11.823889511 | -0.007 |
| 04/19/2024 09:53:12.840664784 | 0.003 |
| 04/19/2024 09:53:13.857449057 | -0.007 |
| 04/19/2024 09:53:14.874225420 | 0.003 |
| 04/19/2024 09:53:15.891005966 | -0.007 |
| 04/19/2024 09:53:16.907784693 | 0.003 |
| 04/19/2024 09:53:17.924574481 | -0.007 |
| 04/19/2024 09:53:18.941355693 | 0.003 |
| 04/19/2024 09:53:19.958133693 | 0.003 |
| 04/19/2024 09:53:20.974915148 | 0.003 |
| 04/19/2024 09:53:21.991688572 | -0.007 |
| 04/19/2024 09:53:23.008468420 | 0.003 |
| 04/19/2024 09:53:24.025251935 | -0.007 |
| 04/19/2024 09:53:25.042023966 | -0.007 |
| 04/19/2024 09:53:26.058802117 | 0.003 |
| 04/19/2024 09:53:27.075582814 | 0.003 |
| 04/19/2024 09:53:28.092357966 | 0.003 |
| 04/19/2024 09:53:29.109142178 | 0.003 |
| 04/19/2024 09:53:30.125912481 | 0.003 |
| 04/19/2024 09:53:31.142693117 | 0.003 |
| 04/19/2024 09:53:32.159475329 | 0.003 |
| 04/19/2024 09:53:33.176249026 | -0.007 |
| 04/19/2024 09:53:34.193030026 | 0.003 |
| 04/19/2024 09:53:35.209804890 | 0.003 |
| 04/19/2024 09:53:36.226586284 | -0.007 |
| 04/19/2024 09:53:37.243372587 | 0.003 |
| 04/19/2024 09:53:38.260156375 | 0.003 |
| 04/19/2024 09:53:39.276937405 | 0.003 |
| 04/19/2024 09:53:40.293723496 | 0.003 |
| 04/19/2024 09:53:41.310507829 | -0.007 |
| 04/19/2024 09:53:42.327284890 | 0.003 |
| 04/19/2024 09:53:43.344062890 | 0.003 |
| 04/19/2024 09:53:44.360845223 | -0.007 |
| 04/19/2024 09:53:45.377624708 | 0.003 |
| 04/19/2024 09:53:46.394409526 | 0.003 |
| 04/19/2024 09:53:47.411193345 | -0.007 |
| 04/19/2024 09:53:48.427966072 | 0.003 |
| 04/19/2024 09:53:49.444751587 | 0.003 |
| 04/19/2024 09:53:50.461535254 | 0.003 |
| 04/19/2024 09:53:51.478312981 | -0.007 |
| 04/19/2024 09:53:52.495100102 | -0.007 |
| 04/19/2024 09:53:53.511871951 | 0.003 |
| 04/19/2024 09:53:54.528648738 | 0.003 |
| 04/19/2024 09:53:55.545428466 | 0.003 |
| 04/19/2024 09:53:56.562205587 | -0.007 |
| 04/19/2024 09:53:57.578983860 | 0.003 |
| 04/19/2024 09:53:58.595765314 | 0.003 |
| 04/19/2024 09:53:59.612555587 | -0.007 |
| 04/19/2024 09:54:00.629336314 | 0.003 |
| 04/19/2024 09:54:01.646112829 | 0.003 |
| 04/19/2024 09:54:02.662892920 | 0.003 |
| 04/19/2024 09:54:03.679679951 | 0.003 |
| 04/19/2024 09:54:04.696458163 | 0.003 |
| 04/19/2024 09:54:05.713244845 | 0.003 |
| 04/19/2024 09:54:06.730020966 | 0.003 |
| 04/19/2024 09:54:07.746798996 | 0.003 |
| 04/19/2024 09:54:08.763585148 | -0.007 |
| 04/19/2024 09:54:09.780361511 | 0.003 |
| 04/19/2024 09:54:10.797140208 | -0.007 |
| 04/19/2024 09:54:11.813914420 | 0.003 |
| 04/19/2024 09:54:12.830691117 | -0.007 |
| 04/19/2024 09:54:13.847470026 | 0.003 |
| 04/19/2024 09:54:14.864252057 | -0.007 |
| 04/19/2024 09:54:15.881033117 | 0.003 |
| 04/19/2024 09:54:16.897815390 | -0.007 |
| 04/19/2024 09:54:17.914594814 | -0.007 |
| 04/19/2024 09:54:18.931378299 | 0.003 |
| 04/19/2024 09:54:19.948153178 | 0.003 |
| 04/19/2024 09:54:20.964936390 | 0.003 |
| 04/19/2024 09:54:21.981719087 | -0.007 |
| 04/19/2024 09:54:22.998499420 | 0.003 |
| 04/19/2024 09:54:24.015277935 | -0.007 |
| 04/19/2024 09:54:25.032055329 | 0.003 |
| 04/19/2024 09:54:26.048837935 | 0.003 |
| 04/19/2024 09:54:27.065621117 | 0.003 |
| 04/19/2024 09:54:28.082399754 | 0.003 |
| 04/19/2024 09:54:29.099184208 | -0.007 |
| 04/19/2024 09:54:30.115965329 | 0.003 |
| 04/19/2024 09:54:31.132752057 | 0.003 |
| 04/19/2024 09:54:32.149538420 | 0.003 |
| 04/19/2024 09:54:33.166309632 | 0.003 |
| 04/19/2024 09:54:34.183088723 | 0.003 |
| 04/19/2024 09:54:35.199873012 | -0.007 |
| 04/19/2024 09:54:36.216648224 | 0.003 |
| 04/19/2024 09:54:37.233428739 | 0.003 |
| 04/19/2024 09:54:38.250203648 | 0.003 |
| 04/19/2024 09:54:39.266976890 | -0.007 |
| 04/19/2024 09:54:40.283758042 | 0.003 |
| 04/19/2024 09:54:41.300539618 | 0.003 |
| 04/19/2024 09:54:42.317314012 | 0.003 |
| 04/19/2024 09:54:43.334086527 | 0.003 |
| 04/19/2024 09:54:44.350867284 | -0.004 |
| 04/19/2024 09:54:45.367651921 | -0.007 |
| 04/19/2024 09:54:46.384434436 | 0.003 |
| 04/19/2024 09:54:47.401218133 | 0.003 |
| 04/19/2024 09:54:48.417993406 | -0.007 |
| 04/19/2024 09:54:49.434774769 | 0.003 |
| 04/19/2024 09:54:50.451558284 | 0.003 |
| 04/19/2024 09:54:51.468332436 | -0.005 |
| 04/19/2024 09:54:52.485112466 | 0.003 |
| 04/19/2024 09:54:53.501895648 | 0.003 |
| 04/19/2024 09:54:54.518674133 | 0.003 |
| 04/19/2024 09:54:55.535447163 | -0.007 |
| 04/19/2024 09:54:56.552219284 | 0.003 |
| 04/19/2024 09:54:57.568996254 | 0.003 |
| 04/19/2024 09:54:58.585773193 | 0.003 |
| 04/19/2024 09:54:59.602553163 | 0.003 |
| 04/19/2024 09:55:00.619337193 | 0.003 |
| 04/19/2024 09:55:01.636110496 | 0.003 |
| 04/19/2024 09:55:02.652891951 | 0.003 |
| 04/19/2024 09:55:03.669676739 | -0.007 |
| 04/19/2024 09:55:04.686448345 | -0.007 |
| 04/19/2024 09:55:05.703233844 | -0.007 |
| 04/19/2024 09:55:06.720007784 | 0.003 |
| 04/19/2024 09:55:07.736788238 | -0.007 |
| 04/19/2024 09:55:08.753571753 | 0.003 |
| 04/19/2024 09:55:09.770347269 | 0.003 |
| 04/19/2024 09:55:10.787122541 | 0.003 |
| 04/19/2024 09:55:11.803904723 | 0.003 |
| 04/19/2024 09:55:12.820678329 | 0.003 |
| 04/19/2024 09:55:13.837458450 | 0.003 |
| 04/19/2024 09:55:14.854234481 | 0.003 |
| 04/19/2024 09:55:15.871018541 | 0.003 |
| 04/19/2024 09:55:16.887799663 | 0.003 |
| 04/19/2024 09:55:17.904578299 | -0.007 |
| 04/19/2024 09:55:18.921358723 | 0.003 |
| 04/19/2024 09:55:19.938136602 | 0.003 |
| 04/19/2024 09:55:20.954918602 | 0.003 |
| 04/19/2024 09:55:21.971696663 | 0.003 |
| 04/19/2024 09:55:22.988472238 | 0.003 |
| 04/19/2024 09:55:24.005255753 | 0.003 |
| 04/19/2024 09:55:25.022027238 | -0.007 |
| 04/19/2024 09:55:26.038804026 | 0.003 |
| 04/19/2024 09:55:27.055589753 | 0.003 |
| 04/19/2024 09:55:28.072364753 | -0.007 |
| 04/19/2024 09:55:29.089147966 | 0.003 |
| 04/19/2024 09:55:30.105930299 | 0.003 |
| 04/19/2024 09:55:31.122716360 | -0.007 |
| 04/19/2024 09:55:32.139497602 | 0.003 |
| 04/19/2024 09:55:33.156273269 | 0.003 |
| 04/19/2024 09:55:34.173052056 | 0.003 |
| 04/19/2024 09:55:35.189835572 | 0.003 |
| 04/19/2024 09:55:36.206615330 | -0.007 |
| 04/19/2024 09:55:37.223398512 | 0.003 |
| 04/19/2024 09:55:38.240177966 | 0.003 |
| 04/19/2024 09:55:39.256955299 | -0.007 |
| 04/19/2024 09:55:40.273738936 | 0.003 |
| 04/19/2024 09:55:41.290521148 | -0.007 |
| 04/19/2024 09:55:42.307296330 | 0.003 |
| 04/19/2024 09:55:43.324069269 | 0.003 |
| 04/19/2024 09:55:44.340846178 | -0.007 |
| 04/19/2024 09:55:45.357625390 | 0.003 |
| 04/19/2024 09:55:46.374406845 | 0.003 |
| 04/19/2024 09:55:47.391187693 | -0.007 |
| 04/19/2024 09:55:48.407973663 | 0.003 |
| 04/19/2024 09:55:49.424755663 | -0.007 |
| 04/19/2024 09:55:50.441538239 | 0.003 |
| 04/19/2024 09:55:51.458315330 | -0.007 |
| 04/19/2024 09:55:52.475102724 | 0.003 |
| 04/19/2024 09:55:53.491884542 | -0.007 |
| 04/19/2024 09:55:54.508662118 | 0.003 |
| 04/19/2024 09:55:55.525443724 | -0.007 |
| 04/19/2024 09:55:56.542215178 | 0.003 |
| 04/19/2024 09:55:57.558991693 | 0.003 |
| 04/19/2024 09:55:58.575767057 | 0.003 |
| 04/19/2024 09:55:59.592545087 | 0.003 |
| 04/19/2024 09:56:00.609322754 | -0.007 |
| 04/19/2024 09:56:01.626101481 | 0.003 |
| 04/19/2024 09:56:02.642883421 | 0.003 |
| 04/19/2024 09:56:03.659666057 | -0.007 |
| 04/19/2024 09:56:04.676439996 | 0.003 |
| 04/19/2024 09:56:05.693223420 | -0.007 |
| 04/19/2024 09:56:06.710012996 | 0.003 |
| 04/19/2024 09:56:07.726790875 | 0.003 |
| 04/19/2024 09:56:08.743579087 | 0.003 |
| 04/19/2024 09:56:09.760351329 | -0.007 |
| 04/19/2024 09:56:10.777127481 | -0.007 |
| 04/19/2024 09:56:11.793911451 | 0.003 |
| 04/19/2024 09:56:12.810687329 | -0.007 |
| 04/19/2024 09:56:13.827461542 | 0.003 |
| 04/19/2024 09:56:14.844240572 | 0.003 |
| 04/19/2024 09:56:15.861014511 | 0.003 |
| 04/19/2024 09:56:16.877802208 | 0.003 |
| 04/19/2024 09:56:17.894585329 | 0.003 |
| 04/19/2024 09:56:18.911364329 | 0.003 |
| 04/19/2024 09:56:19.928137451 | 0.003 |
| 04/19/2024 09:56:20.944920693 | -0.007 |
| 04/19/2024 09:56:21.961702754 | 0.003 |
| 04/19/2024 09:56:22.978479269 | 0.003 |
| 04/19/2024 09:56:23.995265814 | 0.003 |
| 04/19/2024 09:56:25.012049057 | 0.003 |
| 04/19/2024 09:56:26.028824239 | -0.007 |
| 04/19/2024 09:56:27.045605299 | 0.003 |
| 04/19/2024 09:56:28.062379299 | -0.007 |
| 04/19/2024 09:56:29.079160845 | 0.003 |
| 04/19/2024 09:56:30.095945026 | 0.003 |
| 04/19/2024 09:56:31.112724087 | 0.003 |
| 04/19/2024 09:56:32.129512814 | 0.003 |
| 04/19/2024 09:56:33.146307057 | -0.007 |
| 04/19/2024 09:56:34.163088966 | 0.003 |
| 04/19/2024 09:56:35.179878784 | 0.003 |
| 04/19/2024 09:56:36.196657027 | 0.003 |
| 04/19/2024 09:56:37.213452481 | -0.007 |
| 04/19/2024 09:56:38.230222724 | 0.003 |
| 04/19/2024 09:56:39.247001936 | 0.003 |
| 04/19/2024 09:56:40.263780815 | 0.003 |
| 04/19/2024 09:56:41.280556633 | 0.003 |
| 04/19/2024 09:56:42.297337421 | 0.003 |
| 04/19/2024 09:56:43.314117996 | -0.007 |
| 04/19/2024 09:56:44.330896239 | 0.003 |
| 04/19/2024 09:56:45.347684208 | 0.003 |
| 04/19/2024 09:56:46.364457693 | -0.007 |
| 04/19/2024 09:56:47.381241996 | -0.007 |
| 04/19/2024 09:56:48.398033239 | 0.003 |
| 04/19/2024 09:56:49.414813602 | 0.003 |
| 04/19/2024 09:56:50.431596966 | 0.003 |
| 04/19/2024 09:56:51.448377057 | -0.007 |
| 04/19/2024 09:56:52.465158390 | 0.003 |
| 04/19/2024 09:56:53.481939148 | 0.003 |
| 04/19/2024 09:56:54.498719087 | -0.007 |
| 04/19/2024 09:56:55.515502481 | 0.003 |
| 04/19/2024 09:56:56.532276633 | 0.003 |
| 04/19/2024 09:56:57.549053663 | -0.007 |
| 04/19/2024 09:56:58.565825027 | 0.003 |
| 04/19/2024 09:56:59.582598087 | -0.007 |
| 04/19/2024 09:57:00.599378390 | 0.003 |
| 04/19/2024 09:57:01.616158239 | 0.003 |
| 04/19/2024 09:57:02.632934481 | 0.003 |
| 04/19/2024 09:57:03.649720996 | 0.003 |
| 04/19/2024 09:57:04.666497087 | 0.003 |
| 04/19/2024 09:57:05.683279890 | -0.007 |
| 04/19/2024 09:57:06.700065344 | 0.003 |
| 04/19/2024 09:57:07.716839223 | -0.007 |
| 04/19/2024 09:57:08.733621193 | 0.003 |
| 04/19/2024 09:57:09.750399344 | 0.003 |
| 04/19/2024 09:57:10.767174132 | -0.007 |
| 04/19/2024 09:57:11.783957193 | 0.003 |
| 04/19/2024 09:57:12.800732041 | -0.007 |
| 04/19/2024 09:57:13.817505860 | 0.003 |
| 04/19/2024 09:57:14.834276405 | 0.003 |
| 04/19/2024 09:57:15.851052435 | 0.003 |
| 04/19/2024 09:57:16.867831587 | 0.003 |
| 04/19/2024 09:57:17.884608496 | 0.003 |
| 04/19/2024 09:57:18.901395405 | 0.003 |
| 04/19/2024 09:57:19.918178890 | 0.003 |
| 04/19/2024 09:57:20.934956405 | 0.003 |
| 04/19/2024 09:57:21.951736223 | 0.003 |
| 04/19/2024 09:57:22.968511314 | -0.007 |
| 04/19/2024 09:57:23.985290557 | 0.003 |
| 04/19/2024 09:57:25.002075799 | 0.003 |
| 04/19/2024 09:57:26.018854647 | 0.003 |
| 04/19/2024 09:57:27.035636769 | -0.007 |
| 04/19/2024 09:57:28.052410041 | 0.003 |
| 04/19/2024 09:57:29.069187799 | 0.003 |
| 04/19/2024 09:57:30.085972375 | -0.007 |
| 04/19/2024 09:57:31.102749466 | 0.003 |
| 04/19/2024 09:57:32.119539284 | -0.007 |
| 04/19/2024 09:57:33.136316254 | 0.003 |
| 04/19/2024 09:57:34.153099557 | 0.003 |
| 04/19/2024 09:57:35.169883663 | -0.007 |
| 04/19/2024 09:57:36.186659572 | 0.003 |
| 04/19/2024 09:57:37.203441542 | 0.003 |
| 04/19/2024 09:57:38.220225845 | 0.003 |
| 04/19/2024 09:57:39.237004421 | 0.003 |
| 04/19/2024 09:57:40.253791148 | -0.007 |
| 04/19/2024 09:57:41.270565087 | 0.003 |
| 04/19/2024 09:57:42.287340906 | 0.003 |
| 04/19/2024 09:57:43.304128845 | -0.007 |
| 04/19/2024 09:57:44.320905360 | 0.003 |
| 04/19/2024 09:57:45.337680390 | 0.003 |
| 04/19/2024 09:57:46.354452512 | -0.007 |
| 04/19/2024 09:57:47.371229239 | -0.007 |
| 04/19/2024 09:57:48.388006057 | 0.003 |
| 04/19/2024 09:57:49.404789421 | -0.007 |
| 04/19/2024 09:57:50.421570663 | 0.003 |
| 04/19/2024 09:57:51.438342633 | 0.003 |
| 04/19/2024 09:57:52.455126663 | 0.003 |
| 04/19/2024 09:57:53.471907087 | 0.003 |
| 04/19/2024 09:57:54.488686148 | -0.007 |
| 04/19/2024 09:57:55.505466815 | 0.003 |
| 04/19/2024 09:57:56.522246966 | 0.003 |
| 04/19/2024 09:57:57.539018572 | -0.007 |
| 04/19/2024 09:57:58.555796724 | 0.003 |
| 04/19/2024 09:57:59.572565906 | -0.007 |
| 04/19/2024 09:58:00.589344996 | 0.003 |
| 04/19/2024 09:58:01.606122875 | -0.007 |
| 04/19/2024 09:58:02.622902239 | 0.003 |
| 04/19/2024 09:58:03.639681966 | 0.003 |
| 04/19/2024 09:58:04.656456542 | -0.007 |
| 04/19/2024 09:58:05.673238920 | 0.003 |
| 04/19/2024 09:58:06.690025162 | -0.007 |
| 04/19/2024 09:58:07.706801132 | 0.003 |
| 04/19/2024 09:58:08.723582011 | 0.003 |
| 04/19/2024 09:58:09.740366768 | 0.003 |
| 04/19/2024 09:58:10.757143859 | 0.003 |
| 04/19/2024 09:58:11.773927344 | 0.003 |
| 04/19/2024 09:58:12.790700647 | -0.007 |
| 04/19/2024 09:58:13.807480556 | 0.003 |
| 04/19/2024 09:58:14.824265586 | 0.003 |
| 04/19/2024 09:58:15.841039132 | 0.003 |
| 04/19/2024 09:58:16.857822344 | 0.003 |
| 04/19/2024 09:58:17.874595556 | 0.003 |
| 04/19/2024 09:58:18.891368617 | -0.006 |
| 04/19/2024 09:58:19.908152102 | 0.003 |
| 04/19/2024 09:58:20.924933647 | 0.003 |
| 04/19/2024 09:58:21.941714011 | 0.003 |
| 04/19/2024 09:58:22.958484738 | -0.007 |
| 04/19/2024 09:58:23.975264859 | 0.003 |
| 04/19/2024 09:58:24.992048344 | -0.007 |
| 04/19/2024 09:58:26.008828041 | 0.003 |
| 04/19/2024 09:58:27.025608556 | 0.003 |
| 04/19/2024 09:58:28.042388011 | 0.003 |
| 04/19/2024 09:58:29.059170677 | 0.003 |
| 04/19/2024 09:58:30.075951102 | -0.007 |
| 04/19/2024 09:58:31.092728102 | 0.003 |
| 04/19/2024 09:58:32.109509344 | 0.003 |
| 04/19/2024 09:58:33.126287647 | -0.007 |
| 04/19/2024 09:58:34.143066465 | 0.003 |
| 04/19/2024 09:58:35.159857148 | -0.007 |
| 04/19/2024 09:58:36.176639633 | 0.003 |
| 04/19/2024 09:58:37.193423087 | 0.003 |
| 04/19/2024 09:58:38.210204602 | 0.003 |
| 04/19/2024 09:58:39.226991026 | 0.003 |
| 04/19/2024 09:58:40.243783117 | -0.007 |
| 04/19/2024 09:58:41.260557451 | 0.003 |
| 04/19/2024 09:58:42.277340239 | 0.003 |
| 04/19/2024 09:58:43.294125178 | 0.003 |
| 04/19/2024 09:58:44.310899633 | 0.003 |
| 04/19/2024 09:58:45.327682905 | -0.007 |
| 04/19/2024 09:58:46.344469329 | 0.003 |
| 04/19/2024 09:58:47.361245723 | -0.007 |
| 04/19/2024 09:58:48.378028208 | 0.003 |
| 04/19/2024 09:58:49.394808693 | 0.003 |
| 04/19/2024 09:58:50.411591723 | 0.003 |
| 04/19/2024 09:58:51.428379966 | -0.007 |
| 04/19/2024 09:58:52.445163723 | 0.003 |
| 04/19/2024 09:58:53.461948602 | 0.003 |
| 04/19/2024 09:58:54.478721723 | 0.003 |
| 04/19/2024 09:58:55.495505208 | 0.003 |
| 04/19/2024 09:58:56.512284814 | -0.007 |
| 04/19/2024 09:58:57.529066117 | 0.003 |
| 04/19/2024 09:58:58.545842420 | 0.003 |
| 04/19/2024 09:58:59.562616390 | 0.003 |
| 04/19/2024 09:59:00.579390875 | -0.007 |
| 04/19/2024 09:59:01.596174966 | 0.003 |
| 04/19/2024 09:59:02.612956178 | 0.003 |
| 04/19/2024 09:59:03.629737026 | 0.003 |
| 04/19/2024 09:59:04.646518754 | -0.007 |
| 04/19/2024 09:59:05.663300905 | 0.003 |
| 04/19/2024 09:59:06.680086571 | 0.003 |
| 04/19/2024 09:59:07.696872359 | 0.003 |
| 04/19/2024 09:59:08.713656874 | 0.003 |
| 04/19/2024 09:59:09.730443783 | 0.003 |
| 04/19/2024 09:59:10.747228783 | 0.003 |
| 04/19/2024 09:59:11.764010208 | -0.007 |
| 04/19/2024 09:59:12.780780935 | 0.003 |
| 04/19/2024 09:59:13.797564662 | -0.007 |
| 04/19/2024 09:59:14.814346299 | -0.007 |
| 04/19/2024 09:59:15.831123541 | 0.003 |
| 04/19/2024 09:59:16.847904996 | 0.003 |
| 04/19/2024 09:59:17.864677753 | 0.003 |
| 04/19/2024 09:59:18.881467177 | -0.007 |
| 04/19/2024 09:59:19.898252390 | 0.003 |
| 04/19/2024 09:59:20.915033844 | 0.003 |
| 04/19/2024 09:59:21.931819329 | 0.003 |
| 04/19/2024 09:59:22.948603511 | -0.007 |
| 04/19/2024 09:59:23.965382359 | 0.003 |
| 04/19/2024 09:59:24.982161086 | 0.003 |
| 04/19/2024 09:59:25.998943723 | 0.003 |
| 04/19/2024 09:59:27.015725329 | 0.003 |
| 04/19/2024 09:59:28.032508238 | 0.003 |
| 04/19/2024 09:59:29.049290541 | 0.003 |
| 04/19/2024 09:59:30.066073086 | -0.007 |
| 04/19/2024 09:59:31.082848268 | 0.003 |
| 04/19/2024 09:59:32.099633390 | 0.003 |
| 04/19/2024 09:59:33.116413723 | 0.003 |
| 04/19/2024 09:59:34.133194056 | -0.007 |
| 04/19/2024 09:59:35.149976193 | 0.003 |
| 04/19/2024 09:59:36.166759921 | 0.003 |
| 04/19/2024 09:59:37.183539315 | 0.003 |
| 04/19/2024 09:59:38.200326163 | -0.007 |
| 04/19/2024 09:59:39.217112830 | 0.003 |
| 04/19/2024 09:59:40.233899981 | 0.003 |
| 04/19/2024 09:59:41.250682830 | 0.003 |
| 04/19/2024 09:59:42.267469466 | 0.003 |
| 04/19/2024 09:59:43.284257739 | -0.007 |
| 04/19/2024 09:59:44.301038103 | 0.003 |
| 04/19/2024 09:59:45.317820072 | -0.007 |
| 04/19/2024 09:59:46.334603254 | 0.003 |
| 04/19/2024 09:59:47.351379951 | 0.003 |
| 04/19/2024 09:59:48.368162557 | 0.003 |
| 04/19/2024 09:59:49.384940527 | 0.003 |
| 04/19/2024 09:59:50.401718800 | 0.003 |
| 04/19/2024 09:59:51.418506709 | 0.003 |
| 04/19/2024 09:59:52.435290133 | 0.003 |
| 04/19/2024 09:59:53.452074800 | 0.003 |
| 04/19/2024 09:59:54.468849860 | 0.003 |
| 04/19/2024 09:59:55.485630951 | 0.003 |
| 04/19/2024 09:59:56.502413254 | 0.003 |
| 04/19/2024 09:59:57.519189981 | 0.003 |
| 04/19/2024 09:59:58.535973981 | 0.003 |
| 04/19/2024 09:59:59.552748678 | -0.007 |
| 04/19/2024 10:00:00.569526496 | 0.003 |
| 04/19/2024 10:00:01.586301406 | 0.003 |
| 04/19/2024 10:00:02.603078224 | -0.007 |
| 04/19/2024 10:00:03.619857648 | 0.003 |
| 04/19/2024 10:00:04.636637860 | 0.003 |
| 04/19/2024 10:00:05.653428132 | 0.003 |
| 04/19/2024 10:00:06.670214283 | 0.003 |
| 04/19/2024 10:00:07.686995768 | -0.007 |
| 04/19/2024 10:00:08.703778708 | 0.003 |
| 04/19/2024 10:00:09.720564283 | 0.003 |
| 04/19/2024 10:00:10.737342556 | 0.003 |
| 04/19/2024 10:00:11.754127405 | 0.003 |
| 04/19/2024 10:00:12.770900647 | -0.007 |
| 04/19/2024 10:00:13.787683011 | 0.003 |
| 04/19/2024 10:00:14.804466344 | 0.003 |
| 04/19/2024 10:00:15.821244435 | 0.003 |
| 04/19/2024 10:00:16.838029556 | 0.003 |
| 04/19/2024 10:00:17.854814071 | 0.003 |
| 04/19/2024 10:00:18.871593859 | 0.003 |
| 04/19/2024 10:00:19.888376768 | 0.003 |
| 04/19/2024 10:00:20.905158405 | -0.007 |
| 04/19/2024 10:00:21.921938738 | 0.003 |
| 04/19/2024 10:00:22.938721496 | 0.003 |
| 04/19/2024 10:00:23.955500647 | 0.003 |
| 04/19/2024 10:00:24.972285011 | -0.007 |
| 04/19/2024 10:00:25.989059647 | 0.003 |
| 04/19/2024 10:00:27.005840223 | -0.007 |
| 04/19/2024 10:00:28.022625889 | 0.003 |
| 04/19/2024 10:00:29.039408496 | 0.003 |
| 04/19/2024 10:00:30.056191193 | 0.003 |
| 04/19/2024 10:00:31.072964920 | -0.007 |
| 04/19/2024 10:00:32.089743859 | -0.007 |
| 04/19/2024 10:00:33.106525465 | -0.007 |
| 04/19/2024 10:00:34.123302496 | 0.003 |
| 04/19/2024 10:00:35.140082753 | 0.003 |
| 04/19/2024 10:00:36.156864511 | 0.003 |
| 04/19/2024 10:00:37.173649844 | 0.003 |
| 04/19/2024 10:00:38.190429480 | -0.007 |
| 04/19/2024 10:00:39.207214996 | 0.003 |
| 04/19/2024 10:00:40.223998238 | 0.003 |
| 04/19/2024 10:00:41.240778996 | 0.003 |
| 04/19/2024 10:00:42.257559238 | 0.003 |
| 04/19/2024 10:00:43.274341329 | 0.003 |
| 04/19/2024 10:00:44.291117783 | 0.003 |
| 04/19/2024 10:00:45.307902783 | 0.003 |
| 04/19/2024 10:00:46.324682753 | 0.003 |
| 04/19/2024 10:00:47.341461693 | 0.003 |
| 04/19/2024 10:00:48.358248844 | 0.003 |
| 04/19/2024 10:00:49.375019208 | 0.003 |
| 04/19/2024 10:00:50.391798874 | -0.007 |
| 04/19/2024 10:00:51.408584632 | 0.003 |
| 04/19/2024 10:00:52.425364511 | 0.003 |
| 04/19/2024 10:00:53.442150329 | 0.003 |
| 04/19/2024 10:00:54.458935208 | -0.007 |
| 04/19/2024 10:00:55.475717723 | 0.003 |
| 04/19/2024 10:00:56.492501602 | 0.003 |
| 04/19/2024 10:00:57.509283662 | -0.007 |
| 04/19/2024 10:00:58.526066723 | 0.003 |
| 04/19/2024 10:00:59.542847177 | 0.003 |
| 04/19/2024 10:01:00.559616299 | -0.007 |
| 04/19/2024 10:01:01.576388026 | 0.003 |
| 04/19/2024 10:01:02.593164086 | 0.003 |
| 04/19/2024 10:01:03.609952390 | 0.003 |
| 04/19/2024 10:01:04.626731147 | 0.003 |
| 04/19/2024 10:01:05.643511632 | 0.003 |
| 04/19/2024 10:01:06.660290481 | 0.003 |
| 04/19/2024 10:01:07.677066026 | -0.007 |
| 04/19/2024 10:01:08.693852965 | 0.003 |
| 04/19/2024 10:01:09.710638784 | -0.007 |
| 04/19/2024 10:01:10.727422208 | 0.003 |
| 04/19/2024 10:01:11.744209784 | 0.003 |
| 04/19/2024 10:01:12.760989662 | 0.003 |
| 04/19/2024 10:01:13.777775087 | 0.003 |
| 04/19/2024 10:01:14.794560238 | -0.007 |
| 04/19/2024 10:01:15.811338844 | 0.003 |
| 04/19/2024 10:01:16.828122602 | 0.003 |
| 04/19/2024 10:01:17.844909632 | -0.007 |
| 04/19/2024 10:01:18.861682814 | 0.003 |
| 04/19/2024 10:01:19.878466541 | 0.003 |
| 04/19/2024 10:01:20.895244541 | -0.007 |
| 04/19/2024 10:01:21.912022026 | 0.003 |
| 04/19/2024 10:01:22.928804147 | 0.003 |
| 04/19/2024 10:01:23.945589511 | 0.003 |
| 04/19/2024 10:01:24.962370905 | 0.003 |
| 04/19/2024 10:01:25.979147178 | 0.003 |
| 04/19/2024 10:01:26.995930965 | 0.003 |
| 04/19/2024 10:01:28.012714632 | 0.003 |
| 04/19/2024 10:01:29.029496299 | 0.003 |
| 04/19/2024 10:01:30.046279965 | 0.003 |
| 04/19/2024 10:01:31.063062784 | 0.003 |
| 04/19/2024 10:01:32.079843481 | 0.003 |
| 04/19/2024 10:01:33.096626359 | 0.003 |
| 04/19/2024 10:01:34.113405087 | 0.003 |
| 04/19/2024 10:01:35.130186966 | 0.003 |
| 04/19/2024 10:01:36.146976057 | 0.003 |
| 04/19/2024 10:01:37.163757814 | -0.007 |
| 04/19/2024 10:01:38.180538087 | -0.007 |
| 04/19/2024 10:01:39.197326330 | 0.003 |
| 04/19/2024 10:01:40.214113905 | 0.003 |
| 04/19/2024 10:01:41.230898511 | 0.003 |
| 04/19/2024 10:01:42.247686390 | 0.003 |
| 04/19/2024 10:01:43.264472481 | 0.003 |
| 04/19/2024 10:01:44.281244905 | 0.003 |
| 04/19/2024 10:01:45.298032845 | 0.003 |
| 04/19/2024 10:01:46.314814663 | 0.003 |
| 04/19/2024 10:01:47.331588784 | 0.003 |
| 04/19/2024 10:01:48.348371451 | 0.003 |
| 04/19/2024 10:01:49.365154602 | 0.003 |
| 04/19/2024 10:01:50.381930269 | 0.003 |
| 04/19/2024 10:01:51.398719542 | 0.003 |
| 04/19/2024 10:01:52.415500511 | 0.003 |
| 04/19/2024 10:01:53.432276754 | 0.003 |
| 04/19/2024 10:01:54.449064966 | 0.003 |
| 04/19/2024 10:01:55.465847451 | 0.003 |
| 04/19/2024 10:01:56.482626754 | 0.003 |
| 04/19/2024 10:01:57.499408087 | 0.003 |
| 04/19/2024 10:01:58.516189421 | 0.003 |
| 04/19/2024 10:01:59.532973208 | 0.003 |
| 04/19/2024 10:02:00.549744936 | -0.002 |
| 04/19/2024 10:02:01.566520936 | 0.003 |
| 04/19/2024 10:02:02.583295481 | -0.007 |
| 04/19/2024 10:02:03.600075966 | 0.003 |
| 04/19/2024 10:02:04.616856451 | 0.003 |
| 04/19/2024 10:02:05.633631436 | -0.007 |
| 04/19/2024 10:02:06.650410254 | 0.003 |
| 04/19/2024 10:02:07.667189103 | 0.003 |
| 04/19/2024 10:02:08.683967224 | 0.003 |
| 04/19/2024 10:02:09.700755921 | 0.003 |
| 04/19/2024 10:02:10.717540375 | -0.007 |
| 04/19/2024 10:02:11.734319799 | 0.003 |
| 04/19/2024 10:02:12.751102921 | 0.003 |
| 04/19/2024 10:02:13.767882254 | 0.003 |
| 04/19/2024 10:02:14.784662315 | 0.003 |
| 04/19/2024 10:02:15.801439618 | -0.007 |
| 04/19/2024 10:02:16.818222557 | -0.007 |
| 04/19/2024 10:02:17.835003981 | -0.007 |
| 04/19/2024 10:02:18.851780254 | 0.003 |
| 04/19/2024 10:02:19.868563830 | 0.003 |
| 04/19/2024 10:02:20.885348436 | 0.003 |
| 04/19/2024 10:02:21.902125618 | 0.003 |
| 04/19/2024 10:02:22.918909012 | 0.003 |
| 04/19/2024 10:02:23.935688527 | 0.003 |
| 04/19/2024 10:02:24.952468557 | -0.007 |
| 04/19/2024 10:02:25.969248951 | -0.007 |
| 04/19/2024 10:02:26.986025890 | 0.003 |
| 04/19/2024 10:02:28.002811587 | -0.007 |
| 04/19/2024 10:02:29.019588012 | 0.003 |
| 04/19/2024 10:02:30.036371496 | 0.003 |
| 04/19/2024 10:02:31.053160315 | 0.003 |
| 04/19/2024 10:02:32.069938133 | -0.007 |
| 04/19/2024 10:02:33.086716496 | 0.003 |
| 04/19/2024 10:02:34.103496163 | -0.005 |
| 04/19/2024 10:02:35.120276057 | 0.003 |
| 04/19/2024 10:02:36.137056057 | 0.003 |
| 04/19/2024 10:02:37.153836087 | 0.003 |
| 04/19/2024 10:02:38.170614996 | -0.007 |
| 04/19/2024 10:02:39.187398451 | 0.003 |
| 04/19/2024 10:02:40.204186815 | 0.003 |
| 04/19/2024 10:02:41.220969512 | 0.003 |
| 04/19/2024 10:02:42.237748390 | 0.003 |
| 04/19/2024 10:02:43.254532299 | 0.003 |
| 04/19/2024 10:02:44.271315512 | 0.003 |
| 04/19/2024 10:02:45.288093906 | -0.007 |
| 04/19/2024 10:02:46.304874118 | 0.003 |
| 04/19/2024 10:02:47.321648027 | 0.003 |
| 04/19/2024 10:02:48.338428421 | 0.003 |
| 04/19/2024 10:02:49.355209693 | 0.003 |
| 04/19/2024 10:02:50.371988148 | 0.003 |
| 04/19/2024 10:02:51.388768421 | 0.003 |
| 04/19/2024 10:02:52.405546512 | -0.007 |
| 04/19/2024 10:02:53.422326148 | 0.003 |
| 04/19/2024 10:02:54.439108996 | -0.007 |
| 04/19/2024 10:02:55.455890936 | 0.003 |
| 04/19/2024 10:02:56.472673027 | 0.003 |
| 04/19/2024 10:02:57.489456330 | 0.003 |
| 04/19/2024 10:02:58.506239481 | 0.003 |
| 04/19/2024 10:02:59.523020663 | 0.003 |
| 04/19/2024 10:03:00.539794269 | 0.003 |
| 04/19/2024 10:03:01.556584845 | 0.003 |
| 04/19/2024 10:03:02.573355966 | 0.003 |
| 04/19/2024 10:03:03.590132481 | 0.003 |
| 04/19/2024 10:03:04.606908815 | 0.003 |
| 04/19/2024 10:03:05.623686753 | -0.007 |
| 04/19/2024 10:03:06.640471238 | 0.003 |
| 04/19/2024 10:03:07.657253844 | 0.003 |
| 04/19/2024 10:03:08.674029390 | 0.003 |
| 04/19/2024 10:03:09.690806208 | 0.003 |
| 04/19/2024 10:03:10.707584784 | 0.003 |
| 04/19/2024 10:03:11.724365905 | 0.003 |
| 04/19/2024 10:03:12.741150541 | -0.007 |
| 04/19/2024 10:03:13.757932632 | 0.003 |
| 04/19/2024 10:03:14.774714026 | 0.003 |
| 04/19/2024 10:03:15.791498663 | 0.003 |
| 04/19/2024 10:03:16.808280966 | 0.003 |
| 04/19/2024 10:03:17.825061117 | 0.003 |
| 04/19/2024 10:03:18.841836450 | -0.007 |
| 04/19/2024 10:03:19.858617147 | 0.003 |
| 04/19/2024 10:03:20.875398663 | 0.003 |
| 04/19/2024 10:03:21.892176784 | 0.003 |
| 04/19/2024 10:03:22.908960390 | 0.003 |
| 04/19/2024 10:03:23.925735541 | 0.003 |
| 04/19/2024 10:03:24.942511632 | 0.003 |
| 04/19/2024 10:03:25.959297208 | 0.003 |
| 04/19/2024 10:03:26.976073935 | 0.003 |
| 04/19/2024 10:03:27.992856723 | 0.003 |
| 04/19/2024 10:03:29.009631087 | 0.003 |
| 04/19/2024 10:03:30.026410844 | 0.003 |
| 04/19/2024 10:03:31.043191360 | 0.003 |
| 04/19/2024 10:03:32.059971875 | -0.007 |
| 04/19/2024 10:03:33.076753026 | 0.003 |
| 04/19/2024 10:03:34.093537360 | 0.003 |
| 04/19/2024 10:03:35.110316224 | 0.003 |
| 04/19/2024 10:03:36.127098466 | 0.003 |
| 04/19/2024 10:03:37.143874133 | 0.003 |
| 04/19/2024 10:03:38.160650284 | 0.003 |
| 04/19/2024 10:03:39.177432618 | -0.007 |
| 04/19/2024 10:03:40.194211860 | 0.003 |
| 04/19/2024 10:03:41.210995496 | 0.003 |
| 04/19/2024 10:03:42.227777284 | 0.003 |
| 04/19/2024 10:03:43.244567193 | -0.007 |
| 04/19/2024 10:03:44.261349072 | -0.007 |
| 04/19/2024 10:03:45.278132375 | 0.003 |
| 04/19/2024 10:03:46.294918375 | 0.003 |
| 04/19/2024 10:03:47.311691496 | -0.007 |
| 04/19/2024 10:03:48.328471860 | -0.007 |
| 04/19/2024 10:03:49.345254193 | 0.003 |
| 04/19/2024 10:03:50.362030587 | 0.003 |
| 04/19/2024 10:03:51.378814527 | 0.003 |
| 04/19/2024 10:03:52.395604163 | -0.007 |
| 04/19/2024 10:03:53.412380527 | 0.003 |
| 04/19/2024 10:03:54.429165951 | 0.003 |
| 04/19/2024 10:03:55.445947133 | 0.003 |
| 04/19/2024 10:03:56.462731890 | 0.003 |
| 04/19/2024 10:03:57.479513739 | 0.003 |
| 04/19/2024 10:03:58.496299375 | 0.003 |
| 04/19/2024 10:03:59.513077557 | 0.003 |
| 04/19/2024 10:04:00.529848345 | 0.003 |
| 04/19/2024 10:04:01.546630436 | 0.003 |
| 04/19/2024 10:04:02.563402254 | 0.003 |
| 04/19/2024 10:04:03.580176739 | 0.003 |
| 04/19/2024 10:04:04.596958557 | -0.007 |
| 04/19/2024 10:04:05.613732572 | 0.003 |
| 04/19/2024 10:04:06.630517602 | 0.003 |
| 04/19/2024 10:04:07.647299299 | 0.003 |
| 04/19/2024 10:04:08.664078875 | 0.003 |
| 04/19/2024 10:04:09.680855784 | -0.007 |
| 04/19/2024 10:04:10.697635845 | 0.003 |
| 04/19/2024 10:04:11.714419451 | 0.003 |
| 04/19/2024 10:04:12.731197390 | -0.007 |
| 04/19/2024 10:04:13.747979966 | 0.003 |
| 04/19/2024 10:04:14.764764178 | 0.003 |
| 04/19/2024 10:04:15.781546572 | -0.007 |
| 04/19/2024 10:04:16.798329360 | 0.003 |
| 04/19/2024 10:04:17.815113996 | 0.003 |
| 04/19/2024 10:04:18.831890057 | 0.003 |
| 04/19/2024 10:04:19.848677299 | 0.003 |
| 04/19/2024 10:04:20.865458087 | -0.007 |
| 04/19/2024 10:04:21.882234875 | 0.003 |
| 04/19/2024 10:04:22.899015148 | 0.003 |
| 04/19/2024 10:04:23.915789451 | 0.003 |
| 04/19/2024 10:04:24.932562814 | 0.003 |
| 04/19/2024 10:04:25.949347845 | 0.003 |
| 04/19/2024 10:04:26.966129602 | -0.007 |
| 04/19/2024 10:04:27.982909784 | 0.003 |
| 04/19/2024 10:04:28.999699814 | 0.003 |
| 04/19/2024 10:04:30.016483905 | 0.003 |
| 04/19/2024 10:04:31.033267330 | 0.003 |
| 04/19/2024 10:04:32.050041693 | -0.007 |
| 04/19/2024 10:04:33.066825057 | 0.003 |
| 04/19/2024 10:04:34.083603087 | -0.007 |
| 04/19/2024 10:04:35.100384117 | 0.003 |
| 04/19/2024 10:04:36.117164814 | 0.003 |
| 04/19/2024 10:04:37.133945844 | 0.003 |
| 04/19/2024 10:04:38.150725723 | 0.003 |
| 04/19/2024 10:04:39.167508965 | 0.003 |
| 04/19/2024 10:04:40.184287026 | 0.003 |
| 04/19/2024 10:04:41.201065268 | 0.003 |
| 04/19/2024 10:04:42.217848329 | 0.003 |
| 04/19/2024 10:04:43.234630814 | 0.003 |
| 04/19/2024 10:04:44.251412965 | 0.003 |
| 04/19/2024 10:04:45.268195238 | 0.003 |
| 04/19/2024 10:04:46.284977935 | -0.007 |
| 04/19/2024 10:04:47.301760450 | 0.003 |
| 04/19/2024 10:04:48.318540692 | -0.007 |
| 04/19/2024 10:04:49.335320935 | 0.003 |
| 04/19/2024 10:04:50.352095996 | 0.003 |
| 04/19/2024 10:04:51.368880420 | 0.003 |
| 04/19/2024 10:04:52.385661753 | 0.003 |
| 04/19/2024 10:04:53.402442329 | 0.003 |
| 04/19/2024 10:04:54.419223389 | -0.007 |
| 04/19/2024 10:04:55.436001389 | 0.003 |
| 04/19/2024 10:04:56.452779723 | 0.003 |
| 04/19/2024 10:04:57.469564783 | 0.003 |
| 04/19/2024 10:04:58.486344996 | 0.003 |
| 04/19/2024 10:04:59.503127602 | 0.003 |
| 04/19/2024 10:05:00.519902026 | 0.003 |
| 04/19/2024 10:05:01.536677905 | 0.003 |
| 04/19/2024 10:05:02.553461177 | 0.003 |
| 04/19/2024 10:05:03.570231450 | -0.007 |
| 04/19/2024 10:05:04.587001268 | 0.003 |
| 04/19/2024 10:05:05.603778102 | 0.003 |
| 04/19/2024 10:05:06.620557618 | -0.007 |
| 04/19/2024 10:05:07.637332860 | 0.003 |
| 04/19/2024 10:05:08.654110375 | 0.003 |
| 04/19/2024 10:05:09.670889072 | -0.007 |
| 04/19/2024 10:05:10.687667951 | 0.003 |
| 04/19/2024 10:05:11.704447951 | 0.003 |
| 04/19/2024 10:05:12.721223678 | -0.007 |
| 04/19/2024 10:05:13.738002587 | 0.003 |
| 04/19/2024 10:05:14.754787042 | 0.003 |
| 04/19/2024 10:05:15.771571466 | 0.003 |
| 04/19/2024 10:05:16.788348618 | 0.003 |
| 04/19/2024 10:05:17.805132315 | 0.003 |
| 04/19/2024 10:05:18.821905739 | 0.003 |
| 04/19/2024 10:05:19.838689799 | -0.007 |
| 04/19/2024 10:05:20.855477133 | 0.003 |
| 04/19/2024 10:05:21.872250708 | 0.003 |
| 04/19/2024 10:05:22.889033618 | 0.003 |
| 04/19/2024 10:05:23.905816133 | 0.003 |
| 04/19/2024 10:05:24.922595163 | 0.003 |
| 04/19/2024 10:05:25.939378133 | 0.003 |
| 04/19/2024 10:05:26.956156042 | 0.003 |
| 04/19/2024 10:05:27.972933315 | 0.003 |
| 04/19/2024 10:05:28.989717133 | 0.003 |
| 04/19/2024 10:05:30.006499163 | -0.007 |
| 04/19/2024 10:05:31.023281072 | 0.003 |
| 04/19/2024 10:05:32.040058587 | -0.007 |
| 04/19/2024 10:05:33.056839951 | 0.003 |
| 04/19/2024 10:05:34.073616678 | 0.003 |
| 04/19/2024 10:05:35.090394163 | 0.003 |
| 04/19/2024 10:05:36.107174466 | 0.003 |
| 04/19/2024 10:05:37.123946193 | -0.007 |
| 04/19/2024 10:05:38.140721375 | 0.003 |
| 04/19/2024 10:05:39.157506011 | 0.003 |
| 04/19/2024 10:05:40.174280829 | 0.002 |
| 04/19/2024 10:05:41.191058466 | 0.003 |
| 04/19/2024 10:05:42.207842223 | 0.003 |
| 04/19/2024 10:05:43.224618769 | -0.007 |
| 04/19/2024 10:05:44.241404708 | 0.003 |
| 04/19/2024 10:05:45.258185829 | 0.003 |
| 04/19/2024 10:05:46.274970648 | 0.003 |
| 04/19/2024 10:05:47.291754314 | 0.003 |
| 04/19/2024 10:05:48.308536648 | 0.003 |
| 04/19/2024 10:05:49.325319890 | 0.003 |
| 04/19/2024 10:05:50.342097557 | 0.003 |
| 04/19/2024 10:05:51.358881496 | 0.003 |
| 04/19/2024 10:05:52.375662617 | 0.003 |
| 04/19/2024 10:05:53.392441405 | 0.003 |
| 04/19/2024 10:05:54.409227072 | 0.003 |
| 04/19/2024 10:05:55.426000345 | 0.003 |
| 04/19/2024 10:05:56.442780284 | 0.003 |
| 04/19/2024 10:05:57.459567739 | -0.007 |
| 04/19/2024 10:05:58.476343708 | 0.003 |
| 04/19/2024 10:05:59.493132587 | 0.003 |
| 04/19/2024 10:06:00.509918860 | 0.003 |
| 04/19/2024 10:06:01.526702920 | 0.003 |
| 04/19/2024 10:06:02.543486102 | -0.007 |
| 04/19/2024 10:06:03.560257708 | 0.003 |
| 04/19/2024 10:06:04.577032648 | 0.003 |
| 04/19/2024 10:06:05.593815632 | 0.003 |
| 04/19/2024 10:06:06.610593450 | 0.003 |
| 04/19/2024 10:06:07.627370905 | 0.003 |
| 04/19/2024 10:06:08.644154087 | 0.003 |
| 04/19/2024 10:06:09.660931178 | 0.003 |
| 04/19/2024 10:06:10.677709208 | 0.003 |
| 04/19/2024 10:06:11.694491905 | 0.003 |
| 04/19/2024 10:06:12.711270935 | -0.007 |
| 04/19/2024 10:06:13.728052420 | 0.003 |
| 04/19/2024 10:06:14.744837966 | 0.003 |
| 04/19/2024 10:06:15.761618905 | 0.003 |
| 04/19/2024 10:06:16.778399420 | 0.003 |
| 04/19/2024 10:06:17.795186329 | -0.007 |
| 04/19/2024 10:06:18.811964572 | 0.003 |
| 04/19/2024 10:06:19.828745966 | 0.003 |
| 04/19/2024 10:06:20.845534814 | -0.007 |
| 04/19/2024 10:06:21.862307359 | 0.003 |
| 04/19/2024 10:06:22.879088299 | -0.007 |
| 04/19/2024 10:06:23.895876632 | 0.003 |
| 04/19/2024 10:06:24.912655511 | 0.003 |
| 04/19/2024 10:06:25.929440602 | 0.003 |
| 04/19/2024 10:06:26.946217844 | -0.007 |
| 04/19/2024 10:06:27.962995299 | 0.003 |
| 04/19/2024 10:06:28.979782905 | -0.007 |
| 04/19/2024 10:06:29.996574208 | 0.003 |
| 04/19/2024 10:06:31.013352996 | 0.003 |
| 04/19/2024 10:06:32.030147905 | 0.003 |
| 04/19/2024 10:06:33.046936056 | 0.003 |
| 04/19/2024 10:06:34.063714511 | 0.003 |
| 04/19/2024 10:06:35.080488390 | 0.003 |
| 04/19/2024 10:06:36.097267784 | -0.007 |
| 04/19/2024 10:06:37.114045814 | 0.003 |
| 04/19/2024 10:06:38.130824511 | 0.003 |
| 04/19/2024 10:06:39.147604935 | 0.003 |
| 04/19/2024 10:06:40.164379905 | 0.003 |
| 04/19/2024 10:06:41.181155814 | 0.003 |
| 04/19/2024 10:06:42.197939238 | 0.003 |
| 04/19/2024 10:06:43.214715875 | 0.003 |
| 04/19/2024 10:06:44.231494996 | 0.003 |
| 04/19/2024 10:06:45.248276935 | 0.003 |
| 04/19/2024 10:06:46.265057875 | 0.003 |
| 04/19/2024 10:06:47.281845966 | 0.003 |
| 04/19/2024 10:06:48.298631996 | 0.003 |
| 04/19/2024 10:06:49.315412450 | 0.003 |
| 04/19/2024 10:06:50.332195208 | -0.007 |
| 04/19/2024 10:06:51.348979299 | 0.003 |
| 04/19/2024 10:06:52.365763329 | -0.007 |
| 04/19/2024 10:06:53.382540117 | 0.003 |
| 04/19/2024 10:06:54.399323602 | 0.003 |
| 04/19/2024 10:06:55.416108602 | 0.003 |
| 04/19/2024 10:06:56.432884693 | -0.007 |
| 04/19/2024 10:06:57.449669359 | 0.003 |
| 04/19/2024 10:06:58.466445269 | 0.003 |
| 04/19/2024 10:06:59.483226844 | -0.007 |
| 04/19/2024 10:07:00.500014390 | 0.003 |
| 04/19/2024 10:07:01.516795026 | 0.003 |
| 04/19/2024 10:07:02.533578450 | 0.003 |
| 04/19/2024 10:07:03.550358147 | 0.003 |
| 04/19/2024 10:07:04.567126996 | 0.003 |
| 04/19/2024 10:07:05.583899284 | -0.007 |
| 04/19/2024 10:07:06.600677375 | 0.003 |
| 04/19/2024 10:07:07.617452951 | 0.003 |
| 04/19/2024 10:07:08.634234133 | -0.007 |
| 04/19/2024 10:07:09.651014678 | 0.003 |
| 04/19/2024 10:07:10.667791284 | -0.007 |
| 04/19/2024 10:07:11.705472223 | -0.007 |
| 04/19/2024 10:07:12.776678223 | 0 |
| 04/19/2024 10:07:13.793480436 | 0 |
| 04/19/2024 10:07:14.810264254 | 0 |
| 04/19/2024 10:07:15.827052617 | 0 |
| 04/19/2024 10:07:16.843836284 | 0 |
| 04/19/2024 10:07:17.860616405 | 0 |
| 04/19/2024 10:07:18.877392254 | 0 |
| 04/19/2024 10:07:19.894177860 | 0 |
| 04/19/2024 10:07:20.910958133 | 0 |
| 04/19/2024 10:07:21.927735860 | 0 |
| 04/19/2024 10:07:22.944519314 | 0 |
| 04/19/2024 10:07:23.961294163 | 0 |
| 04/19/2024 10:07:24.978071951 | 0 |
| 04/19/2024 10:07:25.994853284 | 0 |
| 04/19/2024 10:07:27.011632405 | 0 |
| 04/19/2024 10:07:28.028414981 | 0 |
| 04/19/2024 10:07:29.045191163 | 0 |
| 04/19/2024 10:07:30.061973860 | 0 |
| 04/19/2024 10:07:31.078753375 | 0 |
| 04/19/2024 10:07:32.095533981 | 0 |
| 04/19/2024 10:07:33.112313890 | 0 |
| 04/19/2024 10:07:34.129097254 | 0 |
| 04/19/2024 10:07:35.145879420 | 0 |
| 04/19/2024 10:07:36.162658784 | 0 |
| 04/19/2024 10:07:37.179435027 | 0 |
| 04/19/2024 10:07:38.196216814 | 0 |
| 04/19/2024 10:07:39.213002360 | 0 |
| 04/19/2024 10:07:40.229780148 | 0 |
| 04/19/2024 10:07:41.246563027 | 0 |
| 04/19/2024 10:07:42.263342299 | 0 |
| 04/19/2024 10:07:43.280130087 | 0 |
| 04/19/2024 10:07:44.296917784 | 0 |
| 04/19/2024 10:07:45.313701814 | 0 |
| 04/19/2024 10:07:46.330486996 | 0 |
| 04/19/2024 10:07:47.347262572 | 0 |
| 04/19/2024 10:07:48.364047602 | 0 |
| 04/19/2024 10:07:49.380828542 | 0 |
| 04/19/2024 10:07:50.397608905 | 0 |
| 04/19/2024 10:07:51.414396966 | 0 |
| 04/19/2024 10:07:52.431181754 | 0 |
| 04/19/2024 10:07:53.447960814 | 0 |
| 04/19/2024 10:07:54.464743845 | 0 |
| 04/19/2024 10:07:55.481519390 | 0 |
| 04/19/2024 10:07:56.498303693 | 0 |
| 04/19/2024 10:07:57.515090481 | 0 |
| 04/19/2024 10:07:58.531871148 | 0 |
| 04/19/2024 10:07:59.548655117 | 0 |
| 04/19/2024 10:08:00.565425208 | 0 |
| 04/19/2024 10:08:01.582197360 | 0 |
| 04/19/2024 10:08:02.598978511 | 0 |
| 04/19/2024 10:08:03.615753784 | 0 |
| 04/19/2024 10:08:04.632528390 | 0 |
| 04/19/2024 10:08:05.649306071 | 0 |
| 04/19/2024 10:08:06.666085799 | 0 |
| 04/19/2024 10:08:07.682863647 | 0 |
| 04/19/2024 10:08:08.699642344 | 0 |
| 04/19/2024 10:08:09.716420677 | 0 |
| 04/19/2024 10:08:10.733199980 | 0 |
| 04/19/2024 10:08:11.749981405 | 0 |
| 04/19/2024 10:08:12.766767496 | 0 |
| 04/19/2024 10:08:13.783549920 | 0 |
| 04/19/2024 10:08:14.800330799 | 0 |
| 04/19/2024 10:08:15.817111071 | 0 |
| 04/19/2024 10:08:16.833891586 | 0 |
| 04/19/2024 10:08:17.850676556 | 0 |
| 04/19/2024 10:08:18.867448253 | 0 |
| 04/19/2024 10:08:19.884234829 | 0 |
| 04/19/2024 10:08:20.901014617 | 0 |
| 04/19/2024 10:08:21.917792738 | 0 |
| 04/19/2024 10:08:22.934575041 | 0 |
| 04/19/2024 10:08:23.951363283 | 0 |
| 04/19/2024 10:08:24.968136738 | 0 |
| 04/19/2024 10:08:25.984919011 | 0 |
| 04/19/2024 10:08:27.001698223 | 0 |
| 04/19/2024 10:08:28.018481435 | 0 |
| 04/19/2024 10:08:29.035262283 | 0 |
| 04/19/2024 10:08:30.052042708 | 0 |
| 04/19/2024 10:08:31.068824586 | 0 |
| 04/19/2024 10:08:32.085598950 | 0 |
| 04/19/2024 10:08:33.102383465 | 0 |
| 04/19/2024 10:08:34.119164586 | 0 |
| 04/19/2024 10:08:35.135940708 | 0 |
| 04/19/2024 10:08:36.152723314 | 0 |
| 04/19/2024 10:08:37.169498859 | 0 |
| 04/19/2024 10:08:38.186277466 | 0 |
| 04/19/2024 10:08:39.203064314 | 0 |
| 04/19/2024 10:08:40.219842708 | 0 |
| 04/19/2024 10:08:41.236617526 | 0 |
| 04/19/2024 10:08:42.253406526 | 0 |
| 04/19/2024 10:08:43.270194859 | 0 |
| 04/19/2024 10:08:44.286975526 | 0 |
| 04/19/2024 10:08:45.303758890 | 0 |
| 04/19/2024 10:08:46.320542435 | 0 |
| 04/19/2024 10:08:47.337327466 | 0 |
| 04/19/2024 10:08:48.354109587 | 0 |
| 04/19/2024 10:08:49.370890647 | 0 |
| 04/19/2024 10:08:50.387663617 | 0 |
| 04/19/2024 10:08:51.404448284 | 0 |
| 04/19/2024 10:08:52.421229799 | 0 |
| 04/19/2024 10:08:53.438006375 | 0 |
| 04/19/2024 10:08:54.454788132 | 0 |
| 04/19/2024 10:08:55.471561708 | 0 |
| 04/19/2024 10:08:56.488340223 | 0 |
| 04/19/2024 10:08:57.505119193 | 0 |
| 04/19/2024 10:08:58.521902678 | 0 |
| 04/19/2024 10:08:59.538683072 | 0 |
| 04/19/2024 10:09:00.555468708 | 0 |
| 04/19/2024 10:09:01.572241799 | 0 |
| 04/19/2024 10:09:02.589018314 | 0 |
| 04/19/2024 10:09:03.605795223 | 0 |
| 04/19/2024 10:09:04.622571466 | 0 |
| 04/19/2024 10:09:05.639348118 | 0 |
| 04/19/2024 10:09:06.656128451 | 0 |
| 04/19/2024 10:09:07.672903633 | 0 |
| 04/19/2024 10:09:08.689680875 | 0 |
| 04/19/2024 10:09:09.706461360 | 0 |
| 04/19/2024 10:09:10.723239966 | 0 |
| 04/19/2024 10:09:11.740013754 | 0 |
| 04/19/2024 10:09:12.756794481 | 0 |
| 04/19/2024 10:09:13.773574572 | 0 |
| 04/19/2024 10:09:14.790353299 | 0 |
| 04/19/2024 10:09:15.807137421 | 0 |
| 04/19/2024 10:09:16.823918845 | 0 |
| 04/19/2024 10:09:17.840695481 | 0 |
| 04/19/2024 10:09:18.857486724 | 0 |
| 04/19/2024 10:09:19.874271239 | 0 |
| 04/19/2024 10:09:20.891049875 | 0 |
| 04/19/2024 10:09:21.907831481 | 0 |
| 04/19/2024 10:09:22.924612966 | 0 |
| 04/19/2024 10:09:23.941390845 | 0 |
| 04/19/2024 10:09:24.958167724 | 0 |
| 04/19/2024 10:09:25.974949057 | 0 |
| 04/19/2024 10:09:26.991724390 | 0 |
| 04/19/2024 10:09:28.008503693 | 0 |
| 04/19/2024 10:09:29.025286269 | 0 |
| 04/19/2024 10:09:30.042064421 | 0 |
| 04/19/2024 10:09:31.058847421 | 0 |
| 04/19/2024 10:09:32.075623208 | 0 |
| 04/19/2024 10:09:33.092402360 | 0 |
| 04/19/2024 10:09:34.109184057 | 0 |
| 04/19/2024 10:09:35.125959572 | 0 |
| 04/19/2024 10:09:36.142738451 | 0 |
| 04/19/2024 10:09:37.159520966 | 0 |
| 04/19/2024 10:09:38.176298754 | 0 |
| 04/19/2024 10:09:39.193083663 | 0 |
| 04/19/2024 10:09:40.209863330 | 0 |
| 04/19/2024 10:09:41.226641723 | 0 |
| 04/19/2024 10:09:42.243426966 | 0 |
| 04/19/2024 10:09:43.260202148 | 0 |
| 04/19/2024 10:09:44.276988754 | 0 |
| 04/19/2024 10:09:45.293774239 | 0 |
| 04/19/2024 10:09:46.310557936 | 0 |
| 04/19/2024 10:09:47.327344966 | 0 |
| 04/19/2024 10:09:48.344127178 | 0 |
| 04/19/2024 10:09:49.360917663 | 0 |
| 04/19/2024 10:09:50.377692602 | 0 |
| 04/19/2024 10:09:51.394480451 | 0 |
| 04/19/2024 10:09:52.411260390 | 0 |
| 04/19/2024 10:09:53.428041360 | 0 |
| 04/19/2024 10:09:54.444826633 | 0 |
| 04/19/2024 10:09:55.461608299 | 0 |
| 04/19/2024 10:09:56.478388360 | 0 |
| 04/19/2024 10:09:57.495175026 | 0 |
| 04/19/2024 10:09:58.511953239 | 0 |
| 04/19/2024 10:09:59.528740905 | 0 |
| 04/19/2024 10:10:00.545526269 | 0 |
| 04/19/2024 10:10:01.562307784 | 0 |
| 04/19/2024 10:10:02.579080057 | 0 |
| 04/19/2024 10:10:03.595858087 | 0 |
| 04/19/2024 10:10:04.612634330 | 0 |
| 04/19/2024 10:10:05.629410996 | 0 |
| 04/19/2024 10:10:06.646192208 | 0 |
| 04/19/2024 10:10:07.662968693 | 0 |
| 04/19/2024 10:10:08.679746905 | 0 |
| 04/19/2024 10:10:09.696528875 | 0 |
| 04/19/2024 10:10:10.713308057 | 0 |
| 04/19/2024 10:10:11.730085330 | 0 |
| 04/19/2024 10:10:12.746865451 | 0 |
| 04/19/2024 10:10:13.763643299 | 0 |
| 04/19/2024 10:10:14.780426390 | 0 |
| 04/19/2024 10:10:15.797210360 | 0 |
| 04/19/2024 10:10:16.813989269 | 0 |
| 04/19/2024 10:10:17.830770693 | 0 |
| 04/19/2024 10:10:18.847553299 | 0 |
| 04/19/2024 10:10:19.864332724 | 0 |
| 04/19/2024 10:10:20.881110996 | 0 |
| 04/19/2024 10:10:21.897886360 | 0 |
| 04/19/2024 10:10:22.914669390 | 0 |
| 04/19/2024 10:10:23.931450542 | 0 |
| 04/19/2024 10:10:24.948229087 | 0 |
| 04/19/2024 10:10:25.965010754 | 0 |
| 04/19/2024 10:10:26.981786936 | 0 |
| 04/19/2024 10:10:27.998566693 | 0 |
| 04/19/2024 10:10:29.015351481 | 0 |
| 04/19/2024 10:10:30.032134421 | 0 |
| 04/19/2024 10:10:31.048917451 | 0 |
| 04/19/2024 10:10:32.065700027 | 0 |
| 04/19/2024 10:10:33.082483602 | 0 |
| 04/19/2024 10:10:34.099266178 | 0 |
| 04/19/2024 10:10:35.116041753 | 0 |
| 04/19/2024 10:10:36.132825147 | 0 |
| 04/19/2024 10:10:37.149605662 | 0 |
| 04/19/2024 10:10:38.166384329 | 0 |
| 04/19/2024 10:10:39.183168723 | 0 |
| 04/19/2024 10:10:40.199947087 | 0 |
| 04/19/2024 10:10:41.216724178 | 0 |
| 04/19/2024 10:10:42.233505784 | 0 |
| 04/19/2024 10:10:43.250283935 | 0 |
| 04/19/2024 10:10:44.267060268 | 0 |
| 04/19/2024 10:10:45.283838117 | 0 |
| 04/19/2024 10:10:46.300622178 | 0 |
| 04/19/2024 10:10:47.317407723 | 0 |
| 04/19/2024 10:10:48.334188329 | 0 |
| 04/19/2024 10:10:49.350970632 | 0 |
| 04/19/2024 10:10:50.367753056 | 0 |
| 04/19/2024 10:10:51.384535632 | 0 |
| 04/19/2024 10:10:52.401324450 | 0 |
| 04/19/2024 10:10:53.418099299 | 0 |
| 04/19/2024 10:10:54.434880965 | 0 |
| 04/19/2024 10:10:55.451669420 | 0 |
| 04/19/2024 10:10:56.468445814 | 0 |
| 04/19/2024 10:10:57.485232450 | 0 |
| 04/19/2024 10:10:58.502011056 | 0 |
| 04/19/2024 10:10:59.518787541 | 0 |
| 04/19/2024 10:11:00.535571238 | 0 |
| 04/19/2024 10:11:01.552349874 | 0 |
| 04/19/2024 10:11:02.569130814 | 0 |
| 04/19/2024 10:11:03.585903541 | 0 |
| 04/19/2024 10:11:04.602679329 | 0 |
| 04/19/2024 10:11:05.619455072 | 0 |
| 04/19/2024 10:11:06.636229223 | 0 |
| 04/19/2024 10:11:07.653006466 | 0 |
| 04/19/2024 10:11:08.669783375 | 0 |
| 04/19/2024 10:11:09.686563526 | 0 |
| 04/19/2024 10:11:10.703343011 | 0 |
| 04/19/2024 10:11:11.720124254 | 0 |
| 04/19/2024 10:11:12.736906738 | 0 |
| 04/19/2024 10:11:13.753686193 | 0 |
| 04/19/2024 10:11:14.770466163 | 0 |
| 04/19/2024 10:11:15.787247132 | 0 |
| 04/19/2024 10:11:16.804028829 | 0 |
| 04/19/2024 10:11:17.820810981 | 0 |
| 04/19/2024 10:11:18.837590799 | 0 |
| 04/19/2024 10:11:19.854373223 | 0 |
| 04/19/2024 10:11:20.871154102 | 0 |
| 04/19/2024 10:11:21.887928708 | 0 |
| 04/19/2024 10:11:22.904710466 | 0 |
| 04/19/2024 10:11:23.921493587 | 0 |
| 04/19/2024 10:11:24.938273435 | 0 |
| 04/19/2024 10:11:25.955058072 | 0 |
| 04/19/2024 10:11:26.971840041 | 0 |
| 04/19/2024 10:11:27.988619587 | 0 |
| 04/19/2024 10:11:29.005400496 | 0 |
| 04/19/2024 10:11:30.022175951 | 0 |
| 04/19/2024 10:11:31.038959344 | 0 |
| 04/19/2024 10:11:32.055741496 | 0 |
| 04/19/2024 10:11:33.072520860 | 0 |
| 04/19/2024 10:11:34.089302223 | 0 |
| 04/19/2024 10:11:35.106077663 | 0 |
| 04/19/2024 10:11:36.122852754 | 0 |
| 04/19/2024 10:11:37.139638542 | 0 |
| 04/19/2024 10:11:38.156420572 | 0 |
| 04/19/2024 10:11:39.173206118 | 0 |
| 04/19/2024 10:11:40.189980330 | 0 |
| 04/19/2024 10:11:41.206761602 | 0 |
| 04/19/2024 10:11:42.223541542 | 0 |
| 04/19/2024 10:11:43.240316572 | 0 |
| 04/19/2024 10:11:44.257099996 | 0 |
| 04/19/2024 10:11:45.273879299 | 0 |
| 04/19/2024 10:11:46.290662451 | 0 |
| 04/19/2024 10:11:47.307447875 | 0 |
| 04/19/2024 10:11:48.324228633 | 0 |
| 04/19/2024 10:11:49.341009724 | 0 |
| 04/19/2024 10:11:50.357792875 | 0 |
| 04/19/2024 10:11:51.374576330 | 0 |
| 04/19/2024 10:11:52.391360178 | 0 |
| 04/19/2024 10:11:53.408141724 | 0 |
| 04/19/2024 10:11:54.424923602 | 0 |
| 04/19/2024 10:11:55.441709299 | 0 |
| 04/19/2024 10:11:56.458491572 | 0 |
| 04/19/2024 10:11:57.475275754 | 0 |
| 04/19/2024 10:11:58.492047542 | 0 |
| 04/19/2024 10:11:59.508829421 | 0 |
| 04/19/2024 10:12:00.525612936 | 0 |
| 04/19/2024 10:12:01.542395724 | 0 |
| 04/19/2024 10:12:02.559177087 | 0 |
| 04/19/2024 10:12:03.575958178 | 0 |
| 04/19/2024 10:12:04.592736633 | 0 |
| 04/19/2024 10:12:05.609515254 | 0 |
| 04/19/2024 10:12:06.626292042 | 0 |
| 04/19/2024 10:12:07.643066012 | 0 |
| 04/19/2024 10:12:08.659843103 | 0 |
| 04/19/2024 10:12:09.676627830 | 0 |
| 04/19/2024 10:12:10.693408133 | 0 |
| 04/19/2024 10:12:11.710181375 | 0 |
| 04/19/2024 10:12:12.726962345 | 0 |
| 04/19/2024 10:12:13.743747193 | 0 |
| 04/19/2024 10:12:14.760521557 | 0 |
| 04/19/2024 10:12:15.777303254 | 0 |
| 04/19/2024 10:12:16.794078800 | 0 |
| 04/19/2024 10:12:17.810864133 | 0 |
| 04/19/2024 10:12:18.827651648 | 0 |
| 04/19/2024 10:12:19.844435769 | 0 |
| 04/19/2024 10:12:20.861218284 | 0 |
| 04/19/2024 10:12:21.878004012 | 0 |
| 04/19/2024 10:12:22.894801163 | 0 |
| 04/19/2024 10:12:23.911583163 | 0 |
| 04/19/2024 10:12:24.928356678 | 0 |
| 04/19/2024 10:12:25.945143103 | 0 |
| 04/19/2024 10:12:26.961924921 | 0 |
| 04/19/2024 10:12:27.978703709 | 0 |
| 04/19/2024 10:12:28.995491618 | 0 |
| 04/19/2024 10:12:30.012264103 | 0 |
| 04/19/2024 10:12:31.029044496 | 0 |
| 04/19/2024 10:12:32.045829072 | 0 |
| 04/19/2024 10:12:33.062611800 | 0 |
| 04/19/2024 10:12:34.079394163 | 0 |
| 04/19/2024 10:12:35.096170284 | 0 |
| 04/19/2024 10:12:36.112952406 | 0 |
| 04/19/2024 10:12:37.129735193 | 0 |
| 04/19/2024 10:12:38.146512375 | 0 |
| 04/19/2024 10:12:39.163291618 | 0 |
| 04/19/2024 10:12:40.180073103 | 0 |
| 04/19/2024 10:12:41.196851860 | 0 |
| 04/19/2024 10:12:42.213634830 | 0 |
| 04/19/2024 10:12:43.230408921 | 0 |
| 04/19/2024 10:12:44.247187830 | 0 |
| 04/19/2024 10:12:45.263978103 | 0 |
| 04/19/2024 10:12:46.280754436 | 0 |
| 04/19/2024 10:12:47.297532769 | 0 |
| 04/19/2024 10:12:48.314315345 | 0 |
| 04/19/2024 10:12:49.331095012 | 0 |
| 04/19/2024 10:12:50.347880254 | 0 |
| 04/19/2024 10:12:51.364662103 | 0 |
| 04/19/2024 10:12:52.381444830 | 0 |
| 04/19/2024 10:12:53.398233678 | 0 |
| 04/19/2024 10:12:54.415015921 | 0 |
| 04/19/2024 10:12:55.431803496 | 0 |
| 04/19/2024 10:12:56.448582466 | 0 |
| 04/19/2024 10:12:57.465363648 | 0 |
| 04/19/2024 10:12:58.482142618 | 0 |
| 04/19/2024 10:12:59.498928739 | 0 |
| 04/19/2024 10:13:00.515710103 | 0 |
| 04/19/2024 10:13:01.532481739 | 0 |
| 04/19/2024 10:13:02.549264072 | 0 |
| 04/19/2024 10:13:03.566050890 | 0 |
| 04/19/2024 10:13:04.582821406 | 0 |
| 04/19/2024 10:13:05.599600148 | 0 |
| 04/19/2024 10:13:06.616370935 | 0 |
| 04/19/2024 10:13:07.633147420 | 0 |
| 04/19/2024 10:13:08.649926632 | 0 |
| 04/19/2024 10:13:09.666696754 | 0 |
| 04/19/2024 10:13:10.683474905 | 0 |
| 04/19/2024 10:13:11.700253390 | 0 |
| 04/19/2024 10:13:12.717031057 | 0 |
| 04/19/2024 10:13:13.733805632 | 0 |
| 04/19/2024 10:13:14.750581723 | 0 |
| 04/19/2024 10:13:15.767359541 | 0 |
| 04/19/2024 10:13:16.784141178 | 0 |
| 04/19/2024 10:13:17.800923299 | 0 |
| 04/19/2024 10:13:18.817705966 | 0 |
| 04/19/2024 10:13:19.834485875 | 0 |
| 04/19/2024 10:13:20.851269875 | 0 |
| 04/19/2024 10:13:21.868055087 | 0 |
| 04/19/2024 10:13:22.884836632 | 0 |
| 04/19/2024 10:13:23.901617026 | 0 |
| 04/19/2024 10:13:24.918391238 | 0 |
| 04/19/2024 10:13:25.935173905 | 0 |
| 04/19/2024 10:13:26.951966966 | 0 |
| 04/19/2024 10:13:27.968741148 | 0 |
| 04/19/2024 10:13:28.985520117 | 0 |
| 04/19/2024 10:13:30.002305996 | 0 |
| 04/19/2024 10:13:31.019094208 | 0 |
| 04/19/2024 10:13:32.035877602 | 0 |
| 04/19/2024 10:13:33.052650844 | 0 |
| 04/19/2024 10:13:34.069436632 | 0 |
| 04/19/2024 10:13:35.086220845 | 0 |
| 04/19/2024 10:13:36.103002754 | 0 |
| 04/19/2024 10:13:37.119782724 | 0 |
| 04/19/2024 10:13:38.136557178 | 0 |
| 04/19/2024 10:13:39.153343512 | 0 |
| 04/19/2024 10:13:40.170132209 | 0 |
| 04/19/2024 10:13:41.186910451 | 0 |
| 04/19/2024 10:13:42.203695815 | 0 |
| 04/19/2024 10:13:43.220476087 | 0 |
| 04/19/2024 10:13:44.237256057 | 0 |
| 04/19/2024 10:13:45.254039451 | 0 |
| 04/19/2024 10:13:46.270812784 | 0 |
| 04/19/2024 10:13:47.287594209 | 0 |
| 04/19/2024 10:13:48.304377663 | 0 |
| 04/19/2024 10:13:49.321160633 | 0 |
| 04/19/2024 10:13:50.337942118 | 0 |
| 04/19/2024 10:13:51.354725815 | 0 |
| 04/19/2024 10:13:52.371505784 | 0 |
| 04/19/2024 10:13:53.388289966 | 0 |
| 04/19/2024 10:13:54.405073906 | 0 |
| 04/19/2024 10:13:55.421862057 | 0 |
| 04/19/2024 10:13:56.438637815 | 0 |
| 04/19/2024 10:13:57.455416209 | 0 |
| 04/19/2024 10:13:58.472194239 | 0 |
| 04/19/2024 10:13:59.488972360 | 0 |
| 04/19/2024 10:14:00.505751603 | 0 |
| 04/19/2024 10:14:01.522524936 | 0 |
| 04/19/2024 10:14:02.539302148 | 0 |
| 04/19/2024 10:14:03.556087269 | 0 |
| 04/19/2024 10:14:04.572866724 | 0 |
| 04/19/2024 10:14:05.589638512 | 0 |
| 04/19/2024 10:14:06.606415784 | 0 |
| 04/19/2024 10:14:07.623191603 | 0 |
| 04/19/2024 10:14:08.639968239 | 0 |
| 04/19/2024 10:14:09.656747663 | 0 |
| 04/19/2024 10:14:10.673520906 | 0 |
| 04/19/2024 10:14:11.690296936 | 0 |
| 04/19/2024 10:14:12.707082875 | 0 |
| 04/19/2024 10:14:13.723864815 | 0 |
| 04/19/2024 10:14:14.740637421 | 0 |
| 04/19/2024 10:14:15.757416845 | 0 |
| 04/19/2024 10:14:16.774193421 | 0 |
| 04/19/2024 10:14:17.790973421 | 0 |
| 04/19/2024 10:14:18.807753239 | 0 |
| 04/19/2024 10:14:19.824531603 | 0 |
| 04/19/2024 10:14:20.841311299 | 0 |
| 04/19/2024 10:14:21.858095209 | 0 |
| 04/19/2024 10:14:22.874877178 | 0 |
| 04/19/2024 10:14:23.891660663 | 0 |
| 04/19/2024 10:14:24.908446784 | 0 |
| 04/19/2024 10:14:25.925232572 | 0 |
| 04/19/2024 10:14:26.942012118 | 0 |
| 04/19/2024 10:14:27.958788299 | 0 |
| 04/19/2024 10:14:28.975566936 | 0 |
| 04/19/2024 10:14:29.992347148 | 0 |
| 04/19/2024 10:14:31.009125269 | 0 |
| 04/19/2024 10:14:32.025904875 | 0 |
| 04/19/2024 10:14:33.042676603 | 0 |
| 04/19/2024 10:14:34.059452421 | 0 |
| 04/19/2024 10:14:35.076235830 | 0 |
| 04/19/2024 10:14:36.093015860 | 0 |
| 04/19/2024 10:14:37.109797254 | 0 |
| 04/19/2024 10:14:38.126578981 | 0 |
| 04/19/2024 10:14:39.143361587 | 0 |
| 04/19/2024 10:14:40.160151133 | 0 |
| 04/19/2024 10:14:41.176924406 | 0 |
| 04/19/2024 10:14:42.193708799 | 0 |
| 04/19/2024 10:14:43.210496921 | 0 |
| 04/19/2024 10:14:44.227276163 | 0 |
| 04/19/2024 10:14:45.244058709 | 0 |
| 04/19/2024 10:14:46.260833496 | 0 |
| 04/19/2024 10:14:47.277611951 | 0 |
| 04/19/2024 10:14:48.294404799 | 0 |
| 04/19/2024 10:14:49.311182072 | 0 |
| 04/19/2024 10:14:50.327968254 | 0 |
| 04/19/2024 10:14:51.344753193 | 0 |
| 04/19/2024 10:14:52.361536284 | 0 |
| 04/19/2024 10:14:53.378317981 | 0 |
| 04/19/2024 10:14:54.395103315 | 0 |
| 04/19/2024 10:14:55.411888860 | 0 |
| 04/19/2024 10:14:56.428663678 | 0 |
| 04/19/2024 10:14:57.445446224 | 0 |
| 04/19/2024 10:14:58.462229315 | 0 |
| 04/19/2024 10:14:59.479005618 | 0 |
| 04/19/2024 10:15:00.495792739 | 0 |
| 04/19/2024 10:15:01.512575830 | 0 |
| 04/19/2024 10:15:02.529350466 | 0 |
| 04/19/2024 10:15:03.546136315 | 0 |
| 04/19/2024 10:15:04.562913193 | 0 |
| 04/19/2024 10:15:05.579697512 | 0 |
| 04/19/2024 10:15:06.596477451 | 0 |
| 04/19/2024 10:15:07.613251481 | 0 |
| 04/19/2024 10:15:08.630029148 | 0 |
| 04/19/2024 10:15:09.646805269 | 0 |
| 04/19/2024 10:15:10.663580421 | 0 |
| 04/19/2024 10:15:11.680357542 | 0 |
| 04/19/2024 10:15:12.697140481 | 0 |
| 04/19/2024 10:15:13.713915360 | 0 |
| 04/19/2024 10:15:14.730690906 | 0 |
| 04/19/2024 10:15:15.747472239 | 0 |
| 04/19/2024 10:15:16.764252784 | 0 |
| 04/19/2024 10:15:17.781031118 | 0 |
| 04/19/2024 10:15:18.797811996 | 0 |
| 04/19/2024 10:15:19.814590906 | 0 |
| 04/19/2024 10:15:20.831371572 | 0 |
| 04/19/2024 10:15:21.848153815 | 0 |
| 04/19/2024 10:15:22.864933421 | 0 |
| 04/19/2024 10:15:23.881717421 | 0 |
| 04/19/2024 10:15:24.898502906 | 0 |
| 04/19/2024 10:15:25.915282390 | 0 |
| 04/19/2024 10:15:26.932062178 | 0 |
| 04/19/2024 10:15:27.948843875 | 0 |
| 04/19/2024 10:15:28.965623936 | 0 |
| 04/19/2024 10:15:29.982409906 | 0 |
| 04/19/2024 10:15:30.999192784 | 0 |
| 04/19/2024 10:15:32.015974845 | 0 |
| 04/19/2024 10:15:33.032750299 | 0 |
| 04/19/2024 10:15:34.049532481 | 0 |
| 04/19/2024 10:15:35.066312936 | 0 |
| 04/19/2024 10:15:36.083090602 | 0 |
| 04/19/2024 10:15:37.099876269 | 0 |
| 04/19/2024 10:15:38.116657239 | 0 |
| 04/19/2024 10:15:39.133439360 | 0 |
| 04/19/2024 10:15:40.150221330 | 0 |
| 04/19/2024 10:15:41.166996542 | 0 |
| 04/19/2024 10:15:42.183775542 | 0 |
| 04/19/2024 10:15:43.200560845 | 0 |
| 04/19/2024 10:15:44.217342814 | 0 |
| 04/19/2024 10:15:45.234125966 | 0 |
| 04/19/2024 10:15:46.250901663 | 0 |
| 04/19/2024 10:15:47.267680148 | 0 |
| 04/19/2024 10:15:48.284462996 | 0 |
| 04/19/2024 10:15:49.301242269 | 0 |
| 04/19/2024 10:15:50.318021360 | 0 |
| 04/19/2024 10:15:51.334809390 | 0 |
| 04/19/2024 10:15:52.351588996 | 0 |
| 04/19/2024 10:15:53.368368784 | 0 |
| 04/19/2024 10:15:54.385148087 | 0 |
| 04/19/2024 10:15:55.401932420 | 0 |
| 04/19/2024 10:15:56.418715542 | 0 |
| 04/19/2024 10:15:57.435498602 | 0 |
| 04/19/2024 10:15:58.452281814 | 0 |
| 04/19/2024 10:15:59.469057966 | 0 |
| 04/19/2024 10:16:00.485836481 | 0 |
| 04/19/2024 10:16:01.502619875 | 0 |
| 04/19/2024 10:16:02.519395693 | 0 |
| 04/19/2024 10:16:03.536178390 | 0 |
| 04/19/2024 10:16:04.552956299 | 0 |
| 04/19/2024 10:16:05.569736981 | 0 |
| 04/19/2024 10:16:06.586519890 | 0 |
| 04/19/2024 10:16:07.603297981 | 0 |
| 04/19/2024 10:16:08.620073557 | 0 |
| 04/19/2024 10:16:09.636845800 | 0 |
| 04/19/2024 10:16:10.653622800 | 0 |
| 04/19/2024 10:16:11.670398284 | 0 |
| 04/19/2024 10:16:12.687176193 | 0 |
| 04/19/2024 10:16:13.703960951 | 0 |
| 04/19/2024 10:16:14.720740678 | 0 |
| 04/19/2024 10:16:15.737523436 | 0 |
| 04/19/2024 10:16:16.754304618 | 0 |
| 04/19/2024 10:16:17.771083224 | 0 |
| 04/19/2024 10:16:18.787860618 | 0 |
| 04/19/2024 10:16:19.804645254 | 0 |
| 04/19/2024 10:16:20.821422557 | 0 |
| 04/19/2024 10:16:21.838201618 | 0 |
| 04/19/2024 10:16:22.854982406 | 0 |
| 04/19/2024 10:16:23.871763375 | 0 |
| 04/19/2024 10:16:24.888544890 | 0 |
| 04/19/2024 10:16:25.905330981 | 0 |
| 04/19/2024 10:16:26.922110375 | 0 |
| 04/19/2024 10:16:27.938884072 | 0 |
| 04/19/2024 10:16:28.955668436 | 0 |
| 04/19/2024 10:16:29.972448921 | 0 |
| 04/19/2024 10:16:30.989229345 | 0 |
| 04/19/2024 10:16:32.006013981 | 0 |
| 04/19/2024 10:16:33.022795496 | 0 |
| 04/19/2024 10:16:34.039571133 | 0 |
| 04/19/2024 10:16:35.056357753 | 0 |
| 04/19/2024 10:16:36.073134511 | 0 |
| 04/19/2024 10:16:37.089913935 | 0 |
| 04/19/2024 10:16:38.106697299 | 0 |
| 04/19/2024 10:16:39.123475541 | 0 |
| 04/19/2024 10:16:40.140255420 | 0 |
| 04/19/2024 10:16:41.157032359 | 0 |
| 04/19/2024 10:16:42.173815723 | 0 |
| 04/19/2024 10:16:43.190595268 | 0 |
| 04/19/2024 10:16:44.207375814 | 0 |
| 04/19/2024 10:16:45.224157844 | 0 |
| 04/19/2024 10:16:46.240951329 | 0 |
| 04/19/2024 10:16:47.257733268 | 0 |
| 04/19/2024 10:16:48.274513753 | 0 |
| 04/19/2024 10:16:49.291288147 | 0 |
| 04/19/2024 10:16:50.308065420 | 0 |
| 04/19/2024 10:16:51.324847329 | 0 |
| 04/19/2024 10:16:52.341626208 | 0 |
| 04/19/2024 10:16:53.358409814 | 0 |
| 04/19/2024 10:16:54.375190814 | 0 |
| 04/19/2024 10:16:55.391973390 | 0 |
| 04/19/2024 10:16:56.408758814 | 0 |
| 04/19/2024 10:16:57.425541844 | 0 |
| 04/19/2024 10:16:58.442321935 | 0 |
| 04/19/2024 10:16:59.459096814 | 0 |
| 04/19/2024 10:17:00.475881177 | 0 |
| 04/19/2024 10:17:01.492664723 | 0 |
| 04/19/2024 10:17:02.509444480 | 0 |
| 04/19/2024 10:17:03.526227965 | 0 |
| 04/19/2024 10:17:04.543000783 | 0 |
| 04/19/2024 10:17:05.559781965 | 0 |
| 04/19/2024 10:17:06.576570359 | 0 |
| 04/19/2024 10:17:07.593348087 | 0 |
| 04/19/2024 10:17:08.610137571 | 0 |
| 04/19/2024 10:17:09.626915450 | 0 |
| 04/19/2024 10:17:10.643696177 | 0 |
| 04/19/2024 10:17:11.660480087 | 0 |
| 04/19/2024 10:17:12.677253602 | 0 |
| 04/19/2024 10:17:13.694037208 | 0 |
| 04/19/2024 10:17:14.710820056 | 0 |
| 04/19/2024 10:17:15.727596450 | 0 |
| 04/19/2024 10:17:16.744377602 | 0 |
| 04/19/2024 10:17:17.761153238 | 0 |
| 04/19/2024 10:17:18.777931511 | 0 |
| 04/19/2024 10:17:19.794715299 | 0 |
| 04/19/2024 10:17:20.811492147 | 0 |
| 04/19/2024 10:17:21.828280996 | 0 |
| 04/19/2024 10:17:22.845066208 | 0 |
| 04/19/2024 10:17:23.861852541 | 0 |
| 04/19/2024 10:17:24.878635117 | 0 |
| 04/19/2024 10:17:25.895420299 | 0 |
| 04/19/2024 10:17:26.912200632 | 0 |
| 04/19/2024 10:17:27.928981662 | 0 |
| 04/19/2024 10:17:28.945763147 | 0 |
| 04/19/2024 10:17:29.962546329 | 0 |
| 04/19/2024 10:17:30.979322117 | 0 |
| 04/19/2024 10:17:31.996108299 | 0 |
| 04/19/2024 10:17:33.012887814 | 0 |
| 04/19/2024 10:17:34.029667450 | 0 |
| 04/19/2024 10:17:35.046449238 | 0 |
| 04/19/2024 10:17:36.063220632 | 0 |
| 04/19/2024 10:17:37.080003571 | 0 |
| 04/19/2024 10:17:38.096784208 | 0 |
| 04/19/2024 10:17:39.113562753 | 0 |
| 04/19/2024 10:17:40.130341359 | 0 |
| 04/19/2024 10:17:41.147122602 | 0 |
| 04/19/2024 10:17:42.163904632 | 0 |
| 04/19/2024 10:17:43.180687147 | 0 |
| 04/19/2024 10:17:44.197467662 | 0 |
| 04/19/2024 10:17:45.214252147 | 0 |
| 04/19/2024 10:17:46.231036177 | 0 |
| 04/19/2024 10:17:47.247815268 | 0 |
| 04/19/2024 10:17:48.264598662 | 0 |
| 04/19/2024 10:17:49.281375329 | 0 |
| 04/19/2024 10:17:50.298156753 | 0 |
| 04/19/2024 10:17:51.314941450 | 0 |
| 04/19/2024 10:17:52.331719359 | 0 |
| 04/19/2024 10:17:53.348502268 | 0 |
| 04/19/2024 10:17:54.365284056 | 0 |
| 04/19/2024 10:17:55.382066935 | 0 |
| 04/19/2024 10:17:56.398854602 | 0 |
| 04/19/2024 10:17:57.415635723 | 0 |
| 04/19/2024 10:17:58.432418996 | 0 |
| 04/19/2024 10:17:59.449207723 | 0 |
| 04/19/2024 10:18:00.465993268 | 0 |
| 04/19/2024 10:18:01.482772390 | 0 |
| 04/19/2024 10:18:02.499555420 | 0 |
| 04/19/2024 10:18:03.516343602 | 0 |
| 04/19/2024 10:18:04.533123359 | 0 |
| 04/19/2024 10:18:05.549905208 | 0 |
| 04/19/2024 10:18:06.566686390 | 0 |
| 04/19/2024 10:18:07.583458844 | 0 |
| 04/19/2024 10:18:08.600232693 | 0 |
| 04/19/2024 10:18:09.617015208 | 0 |
| 04/19/2024 10:18:10.633791905 | 0 |
| 04/19/2024 10:18:11.650570784 | 0 |
| 04/19/2024 10:18:12.667345905 | 0 |
| 04/19/2024 10:18:13.684123662 | 0 |
| 04/19/2024 10:18:14.700909632 | 0 |
| 04/19/2024 10:18:15.717689359 | 0 |
| 04/19/2024 10:18:16.734468753 | 0 |
| 04/19/2024 10:18:17.751251329 | 0 |
| 04/19/2024 10:18:18.768032299 | 0 |
| 04/19/2024 10:18:19.784815117 | 0 |
| 04/19/2024 10:18:20.801594359 | 0 |
| 04/19/2024 10:18:21.818370450 | 0 |
| 04/19/2024 10:18:22.835154541 | 0 |
| 04/19/2024 10:18:23.851931420 | 0 |
| 04/19/2024 10:18:24.868715238 | 0 |
| 04/19/2024 10:18:25.885493693 | 0 |
| 04/19/2024 10:18:26.902275087 | 0 |
| 04/19/2024 10:18:27.919056450 | 0 |
| 04/19/2024 10:18:28.935839238 | 0 |
| 04/19/2024 10:18:29.952623238 | 0 |
| 04/19/2024 10:18:30.969394481 | 0 |
| 04/19/2024 10:18:31.986175572 | 0 |
| 04/19/2024 10:18:33.002954814 | 0 |
| 04/19/2024 10:18:34.019734541 | 0 |
| 04/19/2024 10:18:35.036520860 | 0 |
| 04/19/2024 10:18:36.053304163 | 0 |
| 04/19/2024 10:18:37.070088678 | 0 |
| 04/19/2024 10:18:38.086867708 | 0 |
| 04/19/2024 10:18:39.103644345 | 0 |
| 04/19/2024 10:18:40.120423345 | 0 |
| 04/19/2024 10:18:41.137203042 | 0 |
| 04/19/2024 10:18:42.153988314 | 0 |
| 04/19/2024 10:18:43.170767617 | 0 |
| 04/19/2024 10:18:44.187544375 | 0 |
| 04/19/2024 10:18:45.204328375 | 0 |
| 04/19/2024 10:18:46.221114739 | 0 |
| 04/19/2024 10:18:47.237887133 | 0 |
| 04/19/2024 10:18:48.254668163 | 0 |
| 04/19/2024 10:18:49.271442254 | 0 |
| 04/19/2024 10:18:50.288218254 | 0 |
| 04/19/2024 10:18:51.305001466 | 0 |
| 04/19/2024 10:18:52.321779436 | 0 |
| 04/19/2024 10:18:53.338555830 | 0 |
| 04/19/2024 10:18:54.355341678 | 0 |
| 04/19/2024 10:18:55.372126405 | 0 |
| 04/19/2024 10:18:56.388913466 | 0 |
| 04/19/2024 10:18:57.405697436 | 0 |
| 04/19/2024 10:18:58.422475678 | 0 |
| 04/19/2024 10:18:59.439261133 | 0 |
| 04/19/2024 10:19:00.456045617 | 0 |
| 04/19/2024 10:19:01.472828011 | 0 |
| 04/19/2024 10:19:02.489607678 | 0 |
| 04/19/2024 10:19:03.506392708 | 0 |
| 04/19/2024 10:19:04.523171405 | 0 |
| 04/19/2024 10:19:05.539951587 | 0 |
| 04/19/2024 10:19:06.556733678 | 0 |
| 04/19/2024 10:19:07.573505709 | 0 |
| 04/19/2024 10:19:08.590286133 | 0 |
| 04/19/2024 10:19:09.607061345 | 0 |
| 04/19/2024 10:19:10.623842436 | 0 |
| 04/19/2024 10:19:11.640616284 | 0 |
| 04/19/2024 10:19:12.657399921 | 0 |
| 04/19/2024 10:19:13.674183921 | 0 |
| 04/19/2024 10:19:14.690966557 | 0 |
| 04/19/2024 10:19:15.707746345 | 0 |
| 04/19/2024 10:19:16.724525345 | 0 |
| 04/19/2024 10:19:17.741309951 | 0 |
| 04/19/2024 10:19:18.758090012 | 0 |
| 04/19/2024 10:19:19.774872981 | 0 |
| 04/19/2024 10:19:20.791647799 | 0 |
| 04/19/2024 10:19:21.808427678 | 0 |
| 04/19/2024 10:19:22.825211163 | 0 |
| 04/19/2024 10:19:23.841988527 | 0 |
| 04/19/2024 10:19:24.858767860 | 0 |
| 04/19/2024 10:19:25.875544648 | 0 |
| 04/19/2024 10:19:26.892323951 | 0 |
| 04/19/2024 10:19:27.909108678 | 0 |
| 04/19/2024 10:19:28.925887709 | 0 |
| 04/19/2024 10:19:29.942668315 | 0 |
| 04/19/2024 10:19:30.959452830 | 0 |
| 04/19/2024 10:19:31.976233860 | 0 |
| 04/19/2024 10:19:32.993020678 | 0 |
| 04/19/2024 10:19:34.009799648 | 0 |
| 04/19/2024 10:19:35.026581618 | 0 |
| 04/19/2024 10:19:36.043363586 | 0 |
| 04/19/2024 10:19:37.060148950 | 0 |
| 04/19/2024 10:19:38.076931314 | 0 |
| 04/19/2024 10:19:39.093710435 | 0 |
| 04/19/2024 10:19:40.110497435 | 0 |
| 04/19/2024 10:19:41.127281405 | 0 |
| 04/19/2024 10:19:42.144062435 | 0 |
| 04/19/2024 10:19:43.160841586 | 0 |
| 04/19/2024 10:19:44.177614526 | 0 |
| 04/19/2024 10:19:45.194397223 | 0 |
| 04/19/2024 10:19:46.211182435 | 0 |
| 04/19/2024 10:19:47.227962405 | 0 |
| 04/19/2024 10:19:48.244746344 | 0 |
| 04/19/2024 10:19:49.261531374 | 0 |
| 04/19/2024 10:19:50.278305647 | 0 |
| 04/19/2024 10:19:51.295090647 | 0 |
| 04/19/2024 10:19:52.311863980 | 0 |
| 04/19/2024 10:19:53.328643071 | 0 |
| 04/19/2024 10:19:54.345428617 | 0 |
| 04/19/2024 10:19:55.362215011 | 0 |
| 04/19/2024 10:19:56.379001859 | 0 |
| 04/19/2024 10:19:57.395790071 | 0 |
| 04/19/2024 10:19:58.412571556 | 0 |
| 04/19/2024 10:19:59.429357768 | 0 |
| 04/19/2024 10:20:00.446140011 | 0 |
| 04/19/2024 10:20:01.462921011 | 0 |
| 04/19/2024 10:20:02.479694193 | 0 |
| 04/19/2024 10:20:03.496478374 | 0 |
| 04/19/2024 10:20:04.513255829 | 0 |
| 04/19/2024 10:20:05.530035951 | 0 |
| 04/19/2024 10:20:06.546818042 | 0 |
| 04/19/2024 10:20:07.563600526 | 0 |
| 04/19/2024 10:20:08.580378466 | 0 |
| 04/19/2024 10:20:09.597162163 | 0 |
| 04/19/2024 10:20:10.613936708 | 0 |
| 04/19/2024 10:20:11.630717011 | 0 |
| 04/19/2024 10:20:12.647499860 | 0 |
| 04/19/2024 10:20:13.664279496 | 0 |
| 04/19/2024 10:20:14.681060769 | 0 |
| 04/19/2024 10:20:15.697842648 | 0 |
| 04/19/2024 10:20:16.714622769 | 0 |
| 04/19/2024 10:20:17.731404829 | 0 |
| 04/19/2024 10:20:18.748184011 | 0 |
| 04/19/2024 10:20:19.764965799 | 0 |
| 04/19/2024 10:20:20.781742648 | 0 |
| 04/19/2024 10:20:21.798524405 | 0 |
| 04/19/2024 10:20:22.815306163 | 0 |
| 04/19/2024 10:20:23.832083405 | 0 |
| 04/19/2024 10:20:24.848861466 | 0 |
| 04/19/2024 10:20:25.865644708 | 0 |
| 04/19/2024 10:20:26.882425860 | 0 |
| 04/19/2024 10:20:27.899212951 | 0 |
| 04/19/2024 10:20:28.915995648 | 0 |
| 04/19/2024 10:20:29.932778799 | 0 |
| 04/19/2024 10:20:30.949563163 | 0 |
| 04/19/2024 10:20:31.966342254 | 0 |
| 04/19/2024 10:20:32.983123193 | 0 |
| 04/19/2024 10:20:33.999903163 | 0 |
| 04/19/2024 10:20:35.016685042 | 0 |
| 04/19/2024 10:20:36.033461647 | 0 |
| 04/19/2024 10:20:37.050246435 | 0 |
| 04/19/2024 10:20:38.067026284 | 0 |
| 04/19/2024 10:20:39.083797768 | 0 |
| 04/19/2024 10:20:40.100575526 | 0 |
| 04/19/2024 10:20:41.117363162 | 0 |
| 04/19/2024 10:20:42.134141223 | 0 |
| 04/19/2024 10:20:43.150922102 | 0 |
| 04/19/2024 10:20:44.167706556 | 0 |
| 04/19/2024 10:20:45.184487496 | 0 |
| 04/19/2024 10:20:46.201268738 | 0 |
| 04/19/2024 10:20:47.218042768 | 0 |
| 04/19/2024 10:20:48.234826617 | 0 |
| 04/19/2024 10:20:49.251615314 | 0 |
| 04/19/2024 10:20:50.268392071 | 0 |
| 04/19/2024 10:20:51.285173799 | 0 |
| 04/19/2024 10:20:52.301953556 | 0 |
| 04/19/2024 10:20:53.318735102 | 0 |
| 04/19/2024 10:20:54.335514890 | 0 |
| 04/19/2024 10:20:55.352291768 | 0 |
| 04/19/2024 10:20:56.369072405 | 0 |
| 04/19/2024 10:20:57.385846587 | 0 |
| 04/19/2024 10:20:58.402631920 | 0 |
| 04/19/2024 10:20:59.419416981 | 0 |
| 04/19/2024 10:21:00.436200738 | 0 |
| 04/19/2024 10:21:01.452982405 | 0 |
| 04/19/2024 10:21:02.469764678 | 0 |
| 04/19/2024 10:21:03.486547253 | 0 |
| 04/19/2024 10:21:04.503332556 | 0 |
| 04/19/2024 10:21:05.520118496 | 0 |
| 04/19/2024 10:21:06.536902072 | 0 |
| 04/19/2024 10:21:07.553685769 | 0 |
| 04/19/2024 10:21:08.570468314 | 0 |
| 04/19/2024 10:21:09.587249921 | 0 |
| 04/19/2024 10:21:10.604027405 | 0 |
| 04/19/2024 10:21:11.620799042 | 0 |
| 04/19/2024 10:21:12.637565102 | 0 |
| 04/19/2024 10:21:13.654344921 | 0 |
| 04/19/2024 10:21:14.671124557 | 0 |
| 04/19/2024 10:21:15.687894496 | 0 |
| 04/19/2024 10:21:16.704676102 | 0 |
| 04/19/2024 10:21:17.721452981 | 0 |
| 04/19/2024 10:21:18.738234708 | 0 |
| 04/19/2024 10:21:19.755017527 | 0 |
| 04/19/2024 10:21:20.771798254 | 0 |
| 04/19/2024 10:21:21.788576860 | 0 |
| 04/19/2024 10:21:22.805364860 | 0 |
| 04/19/2024 10:21:23.822143618 | 0 |
| 04/19/2024 10:21:24.838923527 | 0 |
| 04/19/2024 10:21:25.855705254 | 0 |
| 04/19/2024 10:21:26.872483072 | 0 |
| 04/19/2024 10:21:27.889261284 | 0 |
| 04/19/2024 10:21:28.906046648 | 0 |
| 04/19/2024 10:21:29.922826830 | 0 |
| 04/19/2024 10:21:30.939606739 | 0 |
| 04/19/2024 10:21:31.956386890 | 0 |
| 04/19/2024 10:21:32.973167921 | 0 |
| 04/19/2024 10:21:33.989941375 | 0 |
| 04/19/2024 10:21:35.006723739 | 0 |
| 04/19/2024 10:21:36.023509951 | 0 |
| 04/19/2024 10:21:37.040286618 | 0 |
| 04/19/2024 10:21:38.057071466 | 0 |
| 04/19/2024 10:21:39.073850163 | 0 |
| 04/19/2024 10:21:40.090628890 | 0 |
| 04/19/2024 10:21:41.107410769 | 0 |
| 04/19/2024 10:21:42.124184951 | 0 |
| 04/19/2024 10:21:43.140963406 | 0 |
| 04/19/2024 10:21:44.157746163 | 0 |
| 04/19/2024 10:21:45.174527436 | 0 |
| 04/19/2024 10:21:46.191310406 | 0 |
| 04/19/2024 10:21:47.208083648 | 0 |
| 04/19/2024 10:21:48.224863133 | 0 |
| 04/19/2024 10:21:49.241646466 | 0 |
| 04/19/2024 10:21:50.258425587 | 0 |
| 04/19/2024 10:21:51.275208133 | 0 |
| 04/19/2024 10:21:52.291992254 | 0 |
| 04/19/2024 10:21:53.308773921 | 0 |
| 04/19/2024 10:21:54.325554890 | 0 |
| 04/19/2024 10:21:55.342325769 | 0 |
| 04/19/2024 10:21:56.359108860 | 0 |
| 04/19/2024 10:21:57.375888860 | 0 |
| 04/19/2024 10:21:58.392667436 | 0 |
| 04/19/2024 10:21:59.409453769 | 0 |
| 04/19/2024 10:22:00.426232981 | 0 |
| 04/19/2024 10:22:01.443013527 | 0 |
| 04/19/2024 10:22:02.459799890 | 0 |
| 04/19/2024 10:22:03.476585860 | 0 |
| 04/19/2024 10:22:04.493373587 | 0 |
| 04/19/2024 10:22:05.510147557 | 0 |
| 04/19/2024 10:22:06.526928102 | 0 |
| 04/19/2024 10:22:07.543714981 | 0 |
| 04/19/2024 10:22:08.560492557 | 0 |
| 04/19/2024 10:22:09.577277557 | 0 |
| 04/19/2024 10:22:10.594061617 | 0 |
| 04/19/2024 10:22:11.610838132 | 0 |
| 04/19/2024 10:22:12.627610557 | 0 |
| 04/19/2024 10:22:13.644387526 | 0 |
| 04/19/2024 10:22:14.661169314 | 0 |
| 04/19/2024 10:22:15.677953254 | 0 |
| 04/19/2024 10:22:16.694738011 | 0 |
| 04/19/2024 10:22:17.711516617 | 0 |
| 04/19/2024 10:22:18.728288254 | 0 |
| 04/19/2024 10:22:19.745071375 | 0 |
| 04/19/2024 10:22:20.761855587 | 0 |
| 04/19/2024 10:22:21.778634557 | 0 |
| 04/19/2024 10:22:22.795422496 | 0 |
| 04/19/2024 10:22:23.812198254 | 0 |
| 04/19/2024 10:22:24.828981738 | 0 |
| 04/19/2024 10:22:25.845764042 | 0 |
| 04/19/2024 10:22:26.862538708 | 0 |
| 04/19/2024 10:22:27.879318617 | 0 |
| 04/19/2024 10:22:28.896104284 | 0 |
| 04/19/2024 10:22:29.912888951 | 0 |
| 04/19/2024 10:22:30.929668860 | 0 |
| 04/19/2024 10:22:31.946454193 | 0 |
| 04/19/2024 10:22:32.963232254 | 0 |
| 04/19/2024 10:22:33.980015860 | 0 |
| 04/19/2024 10:22:34.996797951 | 0 |
| 04/19/2024 10:22:36.013576769 | 0 |
| 04/19/2024 10:22:37.030352526 | 0 |
| 04/19/2024 10:22:38.047138072 | 0 |
| 04/19/2024 10:22:39.063918557 | 0 |
| 04/19/2024 10:22:40.080694133 | 0 |
| 04/19/2024 10:22:41.097480496 | 0 |
| 04/19/2024 10:22:42.114253830 | 0 |
| 04/19/2024 10:22:43.131028526 | 0 |
| 04/19/2024 10:22:44.147818587 | 0 |
| 04/19/2024 10:22:45.164601769 | 0 |
| 04/19/2024 10:22:46.181380193 | 0 |
| 04/19/2024 10:22:47.198167042 | 0 |
| 04/19/2024 10:22:48.214948526 | 0 |
| 04/19/2024 10:22:49.231733163 | 0 |
| 04/19/2024 10:22:50.248515466 | 0 |
| 04/19/2024 10:22:51.265295890 | 0 |
| 04/19/2024 10:22:52.282076102 | 0 |
| 04/19/2024 10:22:53.298855678 | 0 |
| 04/19/2024 10:22:54.315636163 | 0 |
| 04/19/2024 10:22:55.332408678 | 0 |
| 04/19/2024 10:22:56.349189920 | 0 |
| 04/19/2024 10:22:57.365975648 | 0 |
| 04/19/2024 10:22:58.382751011 | 0 |
| 04/19/2024 10:22:59.399535557 | 0 |
| 04/19/2024 10:23:00.416321254 | 0 |
| 04/19/2024 10:23:01.433104769 | 0 |
| 04/19/2024 10:23:02.449891284 | 0 |
| 04/19/2024 10:23:03.466675860 | 0 |
| 04/19/2024 10:23:04.483457345 | 0 |
| 04/19/2024 10:23:05.500246905 | 0 |
| 04/19/2024 10:23:06.517031330 | 0 |
| 04/19/2024 10:23:07.533814299 | 0 |
| 04/19/2024 10:23:08.550593875 | 0 |
| 04/19/2024 10:23:09.567374936 | 0 |
| 04/19/2024 10:23:10.584167330 | 0 |
| 04/19/2024 10:23:11.600945966 | 0 |
| 04/19/2024 10:23:12.617717420 | 0 |
| 04/19/2024 10:23:13.634489420 | 0 |
| 04/19/2024 10:23:14.651279299 | 0 |
| 04/19/2024 10:23:15.668061966 | 0 |
| 04/19/2024 10:23:16.684843754 | 0 |
| 04/19/2024 10:23:17.701624966 | 0 |
| 04/19/2024 10:23:18.718396451 | 0 |
| 04/19/2024 10:23:19.735176814 | 0 |
| 04/19/2024 10:23:20.751956663 | 0 |
| 04/19/2024 10:23:21.768729784 | 0 |
| 04/19/2024 10:23:22.785516239 | 0 |
| 04/19/2024 10:23:23.802303481 | 0 |
| 04/19/2024 10:23:24.819083572 | 0 |
| 04/19/2024 10:23:25.835865360 | 0 |
| 04/19/2024 10:23:26.852642330 | 0 |
| 04/19/2024 10:23:27.869424239 | 0 |
| 04/19/2024 10:23:28.886207814 | 0 |
| 04/19/2024 10:23:29.902992299 | 0 |
| 04/19/2024 10:23:30.919778330 | 0 |
| 04/19/2024 10:23:31.936557602 | 0 |
| 04/19/2024 10:23:32.953342905 | 0 |
| 04/19/2024 10:23:33.970132784 | 0 |
| 04/19/2024 10:23:34.986913360 | 0 |
| 04/19/2024 10:23:36.003696239 | 0 |
| 04/19/2024 10:23:37.020470148 | 0 |
| 04/19/2024 10:23:38.037253026 | 0 |
| 04/19/2024 10:23:39.054037329 | 0 |
| 04/19/2024 10:23:40.070811754 | 0 |
| 04/19/2024 10:23:41.087595602 | 0 |
| 04/19/2024 10:23:42.104381057 | 0 |
| 04/19/2024 10:23:43.121161087 | 0 |
| 04/19/2024 10:23:44.137942905 | 0 |
| 04/19/2024 10:23:45.154720026 | 0 |
| 04/19/2024 10:23:46.171498269 | 0 |
| 04/19/2024 10:23:47.188280875 | 0 |
| 04/19/2024 10:23:48.205062966 | 0 |
| 04/19/2024 10:23:49.221841693 | 0 |
| 04/19/2024 10:23:50.238613693 | 0 |
| 04/19/2024 10:23:51.255394239 | 0 |
| 04/19/2024 10:23:52.272177420 | 0 |
| 04/19/2024 10:23:53.288953087 | 0 |
| 04/19/2024 10:23:54.305734390 | 0 |
| 04/19/2024 10:23:55.322507117 | 0 |
| 04/19/2024 10:23:56.339297511 | 0 |
| 04/19/2024 10:23:57.356082966 | 0 |
| 04/19/2024 10:23:58.372855360 | 0 |
| 04/19/2024 10:23:59.389633451 | 0 |
| 04/19/2024 10:24:00.406415239 | 0 |
| 04/19/2024 10:24:01.423197360 | 0 |
| 04/19/2024 10:24:02.439978572 | 0 |
| 04/19/2024 10:24:03.456764693 | 0 |
| 04/19/2024 10:24:04.473543814 | 0 |
| 04/19/2024 10:24:05.490323572 | 0 |
| 04/19/2024 10:24:06.507106996 | 0 |
| 04/19/2024 10:24:07.523890663 | 0 |
| 04/19/2024 10:24:08.540663481 | 0 |
| 04/19/2024 10:24:09.557451178 | 0 |
| 04/19/2024 10:24:10.574233845 | 0 |
| 04/19/2024 10:24:11.591012511 | 0 |
| 04/19/2024 10:24:12.607796451 | 0 |
| 04/19/2024 10:24:13.624570269 | 0 |
| 04/19/2024 10:24:14.641343239 | 0 |
| 04/19/2024 10:24:15.658120451 | 0 |
| 04/19/2024 10:24:16.674898481 | 0 |
| 04/19/2024 10:24:17.691681087 | 0 |
| 04/19/2024 10:24:18.708465420 | 0 |
| 04/19/2024 10:24:19.725248148 | 0 |
| 04/19/2024 10:24:20.742028057 | 0 |
| 04/19/2024 10:24:21.758804693 | 0 |
| 04/19/2024 10:24:22.775588542 | 0 |
| 04/19/2024 10:24:23.792370693 | 0 |
| 04/19/2024 10:24:24.809152784 | 0 |
| 04/19/2024 10:24:25.825933936 | 0 |
| 04/19/2024 10:24:26.842705875 | 0 |
| 04/19/2024 10:24:27.859486269 | 0 |
| 04/19/2024 10:24:28.876265814 | 0 |
| 04/19/2024 10:24:29.893045754 | 0 |
| 04/19/2024 10:24:30.909828511 | 0 |
| 04/19/2024 10:24:31.926609299 | 0 |
| 04/19/2024 10:24:32.943395360 | 0 |
| 04/19/2024 10:24:33.960176117 | 0 |
| 04/19/2024 10:24:34.976953511 | 0 |
| 04/19/2024 10:24:35.993737086 | 0 |
| 04/19/2024 10:24:37.010519147 | 0 |
| 04/19/2024 10:24:38.027303965 | 0 |
| 04/19/2024 10:24:39.044086238 | 0 |
| 04/19/2024 10:24:40.060859632 | 0 |
| 04/19/2024 10:24:41.077643299 | 0 |
| 04/19/2024 10:24:42.094424571 | 0 |
| 04/19/2024 10:24:43.111201329 | 0 |
| 04/19/2024 10:24:44.127985541 | 0 |
| 04/19/2024 10:24:45.144758905 | 0 |
| 04/19/2024 10:24:46.161533026 | 0 |
| 04/19/2024 10:24:47.178314420 | 0 |
| 04/19/2024 10:24:48.195099783 | 0 |
| 04/19/2024 10:24:49.211880026 | 0 |
| 04/19/2024 10:24:50.228657783 | 0 |
| 04/19/2024 10:24:51.245440117 | 0 |
| 04/19/2024 10:24:52.262222996 | 0 |
| 04/19/2024 10:24:53.278999389 | 0 |
| 04/19/2024 10:24:54.295785571 | 0 |
| 04/19/2024 10:24:55.312567693 | 0 |
| 04/19/2024 10:24:56.329345662 | 0 |
| 04/19/2024 10:24:57.346131329 | 0 |
| 04/19/2024 10:24:58.362905783 | 0 |
| 04/19/2024 10:24:59.379684450 | 0 |
| 04/19/2024 10:25:00.396469389 | 0 |
| 04/19/2024 10:25:01.413243844 | 0 |
| 04/19/2024 10:25:02.430025541 | 0 |
| 04/19/2024 10:25:03.446813086 | 0 |
| 04/19/2024 10:25:04.463594662 | 0 |
| 04/19/2024 10:25:05.480378526 | 0 |
| 04/19/2024 10:25:06.497161648 | 0 |
| 04/19/2024 10:25:07.513942890 | 0 |
| 04/19/2024 10:25:08.530715314 | 0 |
| 04/19/2024 10:25:09.547496678 | 0 |
| 04/19/2024 10:25:10.564273769 | 0 |
| 04/19/2024 10:25:11.581048254 | 0 |
| 04/19/2024 10:25:12.597835011 | 0 |
| 04/19/2024 10:25:13.614621345 | 0 |
| 04/19/2024 10:25:14.631398648 | 0 |
| 04/19/2024 10:25:15.648172799 | 0 |
| 04/19/2024 10:25:16.664945981 | 0 |
| 04/19/2024 10:25:17.681720284 | 0 |
| 04/19/2024 10:25:18.698502436 | 0 |
| 04/19/2024 10:25:19.715282739 | 0 |
| 04/19/2024 10:25:20.732059496 | 0 |
| 04/19/2024 10:25:21.748836860 | 0 |
| 04/19/2024 10:25:22.765618102 | 0 |
| 04/19/2024 10:25:23.782401466 | 0 |
| 04/19/2024 10:25:24.799183163 | 0 |
| 04/19/2024 10:25:25.815965345 | 0 |
| 04/19/2024 10:25:26.832737951 | 0 |
| 04/19/2024 10:25:27.849521163 | 0 |
| 04/19/2024 10:25:28.866302708 | 0 |
| 04/19/2024 10:25:29.883078405 | 0 |
| 04/19/2024 10:25:30.899867557 | 0 |
| 04/19/2024 10:25:31.916652193 | 0 |
| 04/19/2024 10:25:32.933420951 | 0 |
| 04/19/2024 10:25:33.950202375 | 0 |
| 04/19/2024 10:25:34.966984314 | 0 |
| 04/19/2024 10:25:35.983760602 | 0 |
| 04/19/2024 10:25:37.000543268 | 0 |
| 04/19/2024 10:25:38.017325359 | 0 |
| 04/19/2024 10:25:39.034100844 | 0 |
| 04/19/2024 10:25:40.050875814 | 0 |
| 04/19/2024 10:25:41.067650814 | 0 |
| 04/19/2024 10:25:42.084426480 | 0 |
| 04/19/2024 10:25:43.101203723 | 0 |
| 04/19/2024 10:25:44.117978268 | 0 |
| 04/19/2024 10:25:45.134748177 | 0 |
| 04/19/2024 10:25:46.151529390 | 0 |
| 04/19/2024 10:25:47.168307329 | 0 |
| 04/19/2024 10:25:48.185078480 | 0 |
| 04/19/2024 10:25:49.201860238 | 0 |
| 04/19/2024 10:25:50.218639450 | 0 |
| 04/19/2024 10:25:51.235420147 | 0 |
| 04/19/2024 10:25:52.252203026 | 0 |
| 04/19/2024 10:25:53.268978299 | 0 |
| 04/19/2024 10:25:54.285754026 | 0 |
| 04/19/2024 10:25:55.302537844 | 0 |
| 04/19/2024 10:25:56.319329450 | 0 |
| 04/19/2024 10:25:57.336107329 | 0 |
| 04/19/2024 10:25:58.352882814 | 0 |
| 04/19/2024 10:25:59.369657753 | 0 |
| 04/19/2024 10:26:00.386432359 | 0 |
| 04/19/2024 10:26:01.403208935 | 0 |
| 04/19/2024 10:26:02.419986874 | 0 |
| 04/19/2024 10:26:03.436761268 | 0 |
| 04/19/2024 10:26:04.453546965 | 0 |
| 04/19/2024 10:26:05.470330238 | 0 |
| 04/19/2024 10:26:06.487110450 | 0 |
| 04/19/2024 10:26:07.503890299 | 0 |
| 04/19/2024 10:26:08.520674481 | 0 |
| 04/19/2024 10:26:09.537452147 | 0 |
| 04/19/2024 10:26:10.554234905 | 0 |
| 04/19/2024 10:26:11.571007056 | 0 |
| 04/19/2024 10:26:12.587784390 | 0 |
| 04/19/2024 10:26:13.604567238 | 0 |
| 04/19/2024 10:26:14.621338753 | 0 |
| 04/19/2024 10:26:15.638114693 | 0 |
| 04/19/2024 10:26:16.654888662 | 0 |
| 04/19/2024 10:26:17.671662481 | 0 |
| 04/19/2024 10:26:18.688436056 | 0 |
| 04/19/2024 10:26:19.705215117 | 0 |
| 04/19/2024 10:26:20.721993541 | 0 |
| 04/19/2024 10:26:21.738766875 | 0 |
| 04/19/2024 10:26:22.755546662 | 0 |
| 04/19/2024 10:26:23.772327723 | 0 |
| 04/19/2024 10:26:24.789103602 | 0 |
| 04/19/2024 10:26:25.805881753 | 0 |
| 04/19/2024 10:26:26.822660178 | 0 |
| 04/19/2024 10:26:27.839436390 | 0 |
| 04/19/2024 10:26:28.856214299 | 0 |
| 04/19/2024 10:26:29.872985390 | 0 |
| 04/19/2024 10:26:30.889762784 | 0 |
| 04/19/2024 10:26:31.906540753 | 0 |
| 04/19/2024 10:26:32.923316087 | 0 |
| 04/19/2024 10:26:33.940092753 | 0 |
| 04/19/2024 10:26:34.956877602 | 0 |
| 04/19/2024 10:26:35.973649148 | 0 |
| 04/19/2024 10:26:36.990436299 | 0 |
| 04/19/2024 10:26:38.007215996 | 0 |
| 04/19/2024 10:26:39.023989754 | 0 |
| 04/19/2024 10:26:40.040761329 | 0 |
| 04/19/2024 10:26:41.057542360 | 0 |
| 04/19/2024 10:26:42.074317451 | 0 |
| 04/19/2024 10:26:43.091106026 | 0 |
| 04/19/2024 10:26:44.107888905 | 0 |
| 04/19/2024 10:26:45.124665905 | 0 |
| 04/19/2024 10:26:46.141441905 | 0 |
| 04/19/2024 10:26:47.158214299 | 0 |
| 04/19/2024 10:26:48.174990542 | 0 |
| 04/19/2024 10:26:49.191765572 | 0 |
| 04/19/2024 10:26:50.208548451 | 0 |
| 04/19/2024 10:26:51.225330148 | 0 |
| 04/19/2024 10:26:52.242108360 | 0 |
| 04/19/2024 10:26:53.258885178 | 0 |
| 04/19/2024 10:26:54.275655663 | 0 |
| 04/19/2024 10:26:55.292436602 | 0 |
| 04/19/2024 10:26:56.309216299 | 0 |
| 04/19/2024 10:26:57.325992784 | 0 |
| 04/19/2024 10:26:58.342775329 | 0 |
| 04/19/2024 10:26:59.359556905 | 0 |
| 04/19/2024 10:27:00.376332208 | 0 |
| 04/19/2024 10:27:01.393110238 | 0 |
| 04/19/2024 10:27:02.409889390 | 0 |
| 04/19/2024 10:27:03.426670693 | 0 |
| 04/19/2024 10:27:04.443451935 | 0 |
| 04/19/2024 10:27:05.460241768 | 0 |
| 04/19/2024 10:27:06.477023677 | 0 |
| 04/19/2024 10:27:07.493803344 | 0 |
| 04/19/2024 10:27:08.510585859 | 0 |
| 04/19/2024 10:27:09.527367223 | 0 |
| 04/19/2024 10:27:10.544147859 | 0 |
| 04/19/2024 10:27:11.560922859 | 0 |
| 04/19/2024 10:27:12.577698193 | 0 |
| 04/19/2024 10:27:13.594481283 | 0 |
| 04/19/2024 10:27:14.611254071 | 0 |
| 04/19/2024 10:27:15.628027314 | 0 |
| 04/19/2024 10:27:16.644806071 | 0 |
| 04/19/2024 10:27:17.661579132 | 0 |
| 04/19/2024 10:27:18.678356011 | 0 |
| 04/19/2024 10:27:19.695134980 | 0 |
| 04/19/2024 10:27:20.711913768 | 0 |
| 04/19/2024 10:27:21.728694465 | 0 |
| 04/19/2024 10:27:22.745476920 | 0 |
| 04/19/2024 10:27:23.762256496 | 0 |
| 04/19/2024 10:27:24.779032980 | 0 |
| 04/19/2024 10:27:25.795811465 | 0 |
| 04/19/2024 10:27:26.812591283 | 0 |
| 04/19/2024 10:27:27.829372586 | 0 |
| 04/19/2024 10:27:28.846151435 | 0 |
| 04/19/2024 10:27:29.862926556 | 0 |
| 04/19/2024 10:27:30.879697526 | 0 |
| 04/19/2024 10:27:31.896477768 | 0 |
| 04/19/2024 10:27:32.913256465 | 0 |
| 04/19/2024 10:27:33.930035435 | 0 |
| 04/19/2024 10:27:34.946814071 | 0 |
| 04/19/2024 10:27:35.963596920 | 0 |
| 04/19/2024 10:27:36.980378951 | 0 |
| 04/19/2024 10:27:37.997164375 | 0 |
| 04/19/2024 10:27:39.013943920 | 0 |
| 04/19/2024 10:27:40.030723345 | 0 |
| 04/19/2024 10:27:41.047506708 | 0 |
| 04/19/2024 10:27:42.064284739 | 0 |
| 04/19/2024 10:27:43.081057072 | 0 |
| 04/19/2024 10:27:44.097834526 | 0 |
| 04/19/2024 10:27:45.114611254 | 0 |
| 04/19/2024 10:27:46.131389981 | 0 |
| 04/19/2024 10:27:47.148171496 | 0 |
| 04/19/2024 10:27:48.164947526 | 0 |
| 04/19/2024 10:27:49.181720526 | 0 |
| 04/19/2024 10:27:50.198501011 | 0 |
| 04/19/2024 10:27:51.215280648 | 0 |
| 04/19/2024 10:27:52.232061981 | 0 |
| 04/19/2024 10:27:53.248846405 | 0 |
| 04/19/2024 10:27:54.265630163 | 0 |
| 04/19/2024 10:27:55.282413163 | 0 |
| 04/19/2024 10:27:56.299192345 | 0 |
| 04/19/2024 10:27:57.315966193 | 0 |
| 04/19/2024 10:27:58.332745739 | 0 |
| 04/19/2024 10:27:59.349528102 | 0 |
| 04/19/2024 10:28:00.366305830 | 0 |
| 04/19/2024 10:28:01.383078163 | 0 |
| 04/19/2024 10:28:02.399858557 | 0 |
| 04/19/2024 10:28:03.416636163 | 0 |
| 04/19/2024 10:28:04.433409708 | 0 |
| 04/19/2024 10:28:05.450190056 | 0 |
| 04/19/2024 10:28:06.466969208 | 0 |
| 04/19/2024 10:28:07.483740177 | 0 |
| 04/19/2024 10:28:08.500519662 | 0 |
| 04/19/2024 10:28:09.517297844 | 0 |
| 04/19/2024 10:28:10.534074299 | 0 |
| 04/19/2024 10:28:11.550861783 | 0 |
| 04/19/2024 10:28:12.567644480 | 0 |
| 04/19/2024 10:28:13.584421511 | 0 |
| 04/19/2024 10:28:14.601201177 | 0 |
| 04/19/2024 10:28:15.617974905 | 0 |
| 04/19/2024 10:28:16.634750935 | 0 |
| 04/19/2024 10:28:17.651523844 | 0 |
| 04/19/2024 10:28:18.668297177 | 0 |
| 04/19/2024 10:28:19.685074026 | 0 |
| 04/19/2024 10:28:20.701851965 | 0 |
| 04/19/2024 10:28:21.718631693 | 0 |
| 04/19/2024 10:28:22.735413268 | 0 |
| 04/19/2024 10:28:23.752194238 | 0 |
| 04/19/2024 10:28:24.768965238 | 0 |
| 04/19/2024 10:28:25.785732117 | 0 |
| 04/19/2024 10:28:26.802516056 | 0 |
| 04/19/2024 10:28:27.819297147 | 0 |
| 04/19/2024 10:28:28.836070299 | 0 |
| 04/19/2024 10:28:29.852854541 | 0 |
| 04/19/2024 10:28:30.869634571 | 0 |
| 04/19/2024 10:28:31.886411177 | 0 |
| 04/19/2024 10:28:32.903187662 | 0 |
| 04/19/2024 10:28:33.919962874 | 0 |
| 04/19/2024 10:28:34.936739268 | 0 |
| 04/19/2024 10:28:35.953517193 | 0 |
| 04/19/2024 10:28:36.970294496 | 0 |
| 04/19/2024 10:28:37.987074375 | 0 |
| 04/19/2024 10:28:39.003849193 | 0 |
| 04/19/2024 10:28:40.020632011 | 0 |
| 04/19/2024 10:28:41.037415435 | 0 |
| 04/19/2024 10:28:42.054193556 | 0 |
| 04/19/2024 10:28:43.070964072 | 0 |
| 04/19/2024 10:28:44.087738981 | 0 |
| 04/19/2024 10:28:45.104518526 | 0 |
| 04/19/2024 10:28:46.121294466 | 0 |
| 04/19/2024 10:28:47.138073950 | 0 |
| 04/19/2024 10:28:48.154854526 | 0 |
| 04/19/2024 10:28:49.171630617 | 0 |
| 04/19/2024 10:28:50.188408435 | 0 |
| 04/19/2024 10:28:51.205188132 | 0 |
| 04/19/2024 10:28:52.221966526 | 0 |
| 04/19/2024 10:28:53.238749223 | 0 |
| 04/19/2024 10:28:54.255534920 | 0 |
| 04/19/2024 10:28:55.272314072 | 0 |
| 04/19/2024 10:28:56.289091769 | 0 |
| 04/19/2024 10:28:57.305872132 | 0 |
| 04/19/2024 10:28:58.322652253 | 0 |
| 04/19/2024 10:28:59.339428799 | 0 |
| 04/19/2024 10:29:00.356207647 | 0 |
| 04/19/2024 10:29:01.372979890 | 0 |
| 04/19/2024 10:29:02.389753466 | 0 |
| 04/19/2024 10:29:03.406534556 | 0 |
| 04/19/2024 10:29:04.423310284 | 0 |
| 04/19/2024 10:29:05.440093875 | 0 |
| 04/19/2024 10:29:06.456872178 | 0 |
| 04/19/2024 10:29:07.473652269 | 0 |
| 04/19/2024 10:29:08.490439087 | 0 |
| 04/19/2024 10:29:09.507220481 | 0 |
| 04/19/2024 10:29:10.523995572 | 0 |
| 04/19/2024 10:29:11.540779632 | 0 |
| 04/19/2024 10:29:12.557560723 | 0 |
| 04/19/2024 10:29:13.574336966 | 0 |
| 04/19/2024 10:29:14.591113541 | 0 |
| 04/19/2024 10:29:15.607889450 | 0 |
| 04/19/2024 10:29:16.624662602 | 0 |
| 04/19/2024 10:29:17.641434087 | 0 |
| 04/19/2024 10:29:18.658208693 | 0 |
| 04/19/2024 10:29:19.674980057 | 0 |
| 04/19/2024 10:29:20.691750420 | 0 |
| 04/19/2024 10:29:21.708523814 | 0 |
| 04/19/2024 10:29:22.725301269 | 0 |
| 04/19/2024 10:29:23.742083572 | 0 |
| 04/19/2024 10:29:24.758864329 | 0 |
| 04/19/2024 10:29:25.775643299 | 0 |
| 04/19/2024 10:29:26.792424299 | 0 |
| 04/19/2024 10:29:27.809200905 | 0 |
| 04/19/2024 10:29:28.825975875 | 0 |
| 04/19/2024 10:29:29.842756481 | 0 |
| 04/19/2024 10:29:30.859538753 | 0 |
| 04/19/2024 10:29:31.876314026 | 0 |
| 04/19/2024 10:29:32.893091057 | 0 |
| 04/19/2024 10:29:33.909862481 | 0 |
| 04/19/2024 10:29:34.926641026 | 0 |
| 04/19/2024 10:29:35.943417632 | 0 |
| 04/19/2024 10:29:36.960192874 | 0 |
| 04/19/2024 10:29:37.976967087 | 0 |
| 04/19/2024 10:29:38.993747723 | 0 |
| 04/19/2024 10:29:40.010526784 | 0 |
| 04/19/2024 10:29:41.027310541 | 0 |
| 04/19/2024 10:29:42.044086693 | 0 |
| 04/19/2024 10:29:43.060870420 | 0 |
| 04/19/2024 10:29:44.077652147 | 0 |
| 04/19/2024 10:29:45.094431905 | 0 |
| 04/19/2024 10:29:46.111206753 | 0 |
| 04/19/2024 10:29:47.127982996 | 0 |
| 04/19/2024 10:29:48.144757874 | 0 |
| 04/19/2024 10:29:49.161534056 | 0 |
| 04/19/2024 10:29:50.178310784 | 0 |
| 04/19/2024 10:29:51.195086177 | 0 |
| 04/19/2024 10:29:52.211864056 | 0 |
| 04/19/2024 10:29:53.228638329 | 0 |
| 04/19/2024 10:29:54.245423147 | 0 |
| 04/19/2024 10:29:55.262202268 | 0 |
| 04/19/2024 10:29:56.278974056 | 0 |
| 04/19/2024 10:29:57.295745359 | 0 |
| 04/19/2024 10:29:58.312529965 | 0 |
| 04/19/2024 10:29:59.329308238 | 0 |
| 04/19/2024 10:30:00.346083571 | 0 |
| 04/19/2024 10:30:01.362861208 | 0 |
| 04/19/2024 10:30:02.379641965 | 0 |
| 04/19/2024 10:30:03.396423996 | 0 |
| 04/19/2024 10:30:04.413199390 | 0 |
| 04/19/2024 10:30:05.429978450 | 0 |
| 04/19/2024 10:30:06.446757905 | 0 |
| 04/19/2024 10:30:07.463533541 | 0 |
| 04/19/2024 10:30:08.480310056 | 0 |
| 04/19/2024 10:30:09.497094026 | 0 |
| 04/19/2024 10:30:10.513865269 | 0 |
| 04/19/2024 10:30:11.530650329 | 0 |
| 04/19/2024 10:30:12.547431238 | 0 |
| 04/19/2024 10:30:13.564203966 | 0 |
| 04/19/2024 10:30:14.580976602 | 0 |
| 04/19/2024 10:30:15.597762359 | 0 |
| 04/19/2024 10:30:16.614539693 | 0 |
| 04/19/2024 10:30:17.631312117 | 0 |
| 04/19/2024 10:30:18.648090026 | 0 |
| 04/19/2024 10:30:19.664860753 | 0 |
| 04/19/2024 10:30:20.681652420 | 0 |
| 04/19/2024 10:30:21.698432996 | 0 |
| 04/19/2024 10:30:22.715209450 | 0 |
| 04/19/2024 10:30:23.731981814 | 0 |
| 04/19/2024 10:30:24.748768420 | 0 |
| 04/19/2024 10:30:25.765546935 | 0 |
| 04/19/2024 10:30:26.782324056 | 0 |
| 04/19/2024 10:30:27.799105147 | 0 |
| 04/19/2024 10:30:28.815874753 | 0 |
| 04/19/2024 10:30:29.832653329 | 0 |
| 04/19/2024 10:30:30.849435481 | 0 |
| 04/19/2024 10:30:31.866209814 | 0 |
| 04/19/2024 10:30:32.882982784 | 0 |
| 04/19/2024 10:30:33.899767966 | 0 |
| 04/19/2024 10:30:34.916547450 | 0 |
| 04/19/2024 10:30:35.933324041 | 0 |
| 04/19/2024 10:30:36.950106980 | 0 |
| 04/19/2024 10:30:37.966885374 | 0 |
| 04/19/2024 10:30:38.983665011 | 0 |
| 04/19/2024 10:30:40.000456677 | 0 |
| 04/19/2024 10:30:41.017236768 | 0 |
| 04/19/2024 10:30:42.034011617 | 0 |
| 04/19/2024 10:30:43.050794435 | 0 |
| 04/19/2024 10:30:44.067579738 | 0 |
| 04/19/2024 10:30:45.084351950 | 0 |
| 04/19/2024 10:30:46.101128829 | 0 |
| 04/19/2024 10:30:47.117903162 | 0 |
| 04/19/2024 10:30:48.134675617 | 0 |
| 04/19/2024 10:30:49.151451738 | 0 |
| 04/19/2024 10:30:50.168228314 | 0 |
| 04/19/2024 10:30:51.185002314 | 0 |
| 04/19/2024 10:30:52.201780102 | 0 |
| 04/19/2024 10:30:53.218560193 | 0 |
| 04/19/2024 10:30:54.235337465 | 0 |
| 04/19/2024 10:30:55.252120496 | 0 |
| 04/19/2024 10:30:56.268900011 | 0 |
| 04/19/2024 10:30:57.285680011 | 0 |
| 04/19/2024 10:30:58.302462890 | 0 |
| 04/19/2024 10:30:59.319241253 | 0 |
| 04/19/2024 10:31:00.336018132 | 0 |
| 04/19/2024 10:31:01.352799435 | 0 |
| 04/19/2024 10:31:02.369573708 | 0 |
| 04/19/2024 10:31:03.386350011 | 0 |
| 04/19/2024 10:31:04.403128799 | 0 |
| 04/19/2024 10:31:05.419903193 | 0 |
| 04/19/2024 10:31:06.436691921 | 0 |
| 04/19/2024 10:31:07.453468466 | 0 |
| 04/19/2024 10:31:08.470246406 | 0 |
| 04/19/2024 10:31:09.487018709 | 0 |
| 04/19/2024 10:31:10.503803800 | 0 |
| 04/19/2024 10:31:11.520586890 | 0 |
| 04/19/2024 10:31:12.537367678 | 0 |
| 04/19/2024 10:31:13.554144830 | 0 |
| 04/19/2024 10:31:14.570922951 | 0 |
| 04/19/2024 10:31:15.587705648 | 0 |
| 04/19/2024 10:31:16.604487375 | 0 |
| 04/19/2024 10:31:17.621261163 | 0 |
| 04/19/2024 10:31:18.638031345 | 0 |
| 04/19/2024 10:31:19.654805284 | 0 |
| 04/19/2024 10:31:20.671581375 | 0 |
| 04/19/2024 10:31:21.688356042 | 0 |
| 04/19/2024 10:31:22.705133103 | 0 |
| 04/19/2024 10:31:23.721903315 | 0 |
| 04/19/2024 10:31:24.738679224 | 0 |
| 04/19/2024 10:31:25.755462436 | 0 |
| 04/19/2024 10:31:26.772240769 | 0 |
| 04/19/2024 10:31:27.789011254 | 0 |
| 04/19/2024 10:31:28.805794587 | 0 |
| 04/19/2024 10:31:29.822575436 | 0 |
| 04/19/2024 10:31:30.839355496 | 0 |
| 04/19/2024 10:31:31.856130103 | 0 |
| 04/19/2024 10:31:32.872911830 | 0 |
| 04/19/2024 10:31:33.889691860 | 0 |
| 04/19/2024 10:31:34.906468648 | 0 |
| 04/19/2024 10:31:35.923249223 | 0 |
| 04/19/2024 10:31:36.940022436 | 0 |
| 04/19/2024 10:31:37.956799920 | 0 |
| 04/19/2024 10:31:38.973577345 | 0 |
| 04/19/2024 10:31:39.990353405 | 0 |
| 04/19/2024 10:31:41.007136011 | 0 |
| 04/19/2024 10:31:42.023908951 | 0 |
| 04/19/2024 10:31:43.040691163 | 0 |
| 04/19/2024 10:31:44.057473769 | 0 |
| 04/19/2024 10:31:45.074246527 | 0 |
| 04/19/2024 10:31:46.091020133 | 0 |
| 04/19/2024 10:31:47.107807799 | 0 |
| 04/19/2024 10:31:48.124581375 | 0 |
| 04/19/2024 10:31:49.141359678 | 0 |
| 04/19/2024 10:31:50.158135890 | 0 |
| 04/19/2024 10:31:51.174908314 | 0 |
| 04/19/2024 10:31:52.191688617 | 0 |
| 04/19/2024 10:31:53.208467133 | 0 |
| 04/19/2024 10:31:54.225245527 | 0 |
| 04/19/2024 10:31:55.242018223 | 0 |
| 04/19/2024 10:31:56.258796163 | 0 |
| 04/19/2024 10:31:57.275573951 | 0 |
| 04/19/2024 10:31:58.292356981 | 0 |
| 04/19/2024 10:31:59.309136011 | 0 |
| 04/19/2024 10:32:00.325907739 | 0 |
| 04/19/2024 10:32:01.342687739 | 0 |
| 04/19/2024 10:32:02.359465284 | 0 |
| 04/19/2024 10:32:03.376241284 | 0 |
| 04/19/2024 10:32:04.393021951 | 0 |
| 04/19/2024 10:32:05.409799860 | 0 |
| 04/19/2024 10:32:06.426582133 | 0 |
| 04/19/2024 10:32:07.443363284 | 0 |
| 04/19/2024 10:32:08.460139860 | 0 |
| 04/19/2024 10:32:09.476920042 | 0 |
| 04/19/2024 10:32:10.493701557 | 0 |
| 04/19/2024 10:32:11.510491466 | 0 |
| 04/19/2024 10:32:12.527272224 | 0 |
| 04/19/2024 10:32:13.544047557 | 0 |
| 04/19/2024 10:32:14.560827557 | 0 |
| 04/19/2024 10:32:15.577611860 | 0 |
| 04/19/2024 10:32:16.594391193 | 0 |
| 04/19/2024 10:32:17.611166921 | 0 |
| 04/19/2024 10:32:18.627939648 | 0 |
| 04/19/2024 10:32:19.644715163 | 0 |
| 04/19/2024 10:32:20.661491314 | 0 |
| 04/19/2024 10:32:21.678267587 | 0 |
| 04/19/2024 10:32:22.695044678 | 0 |
| 04/19/2024 10:32:23.711818769 | 0 |
| 04/19/2024 10:32:24.728597739 | 0 |
| 04/19/2024 10:32:25.745372314 | 0 |
| 04/19/2024 10:32:26.762156921 | 0 |
| 04/19/2024 10:32:27.778941648 | 0 |
| 04/19/2024 10:32:28.795721466 | 0 |
| 04/19/2024 10:32:29.812501224 | 0 |
| 04/19/2024 10:32:30.829281981 | 0 |
| 04/19/2024 10:32:31.846056345 | 0 |
| 04/19/2024 10:32:32.862833133 | 0 |
| 04/19/2024 10:32:33.879610496 | 0 |
| 04/19/2024 10:32:34.896391708 | 0 |
| 04/19/2024 10:32:35.913164238 | 0 |
| 04/19/2024 10:32:36.929937874 | 0 |
| 04/19/2024 10:32:37.946718571 | 0 |
| 04/19/2024 10:32:38.963496299 | 0 |
| 04/19/2024 10:32:39.980268753 | 0 |
| 04/19/2024 10:32:40.997046935 | 0 |
| 04/19/2024 10:32:42.013828329 | 0 |
| 04/19/2024 10:32:43.030610087 | 0 |
| 04/19/2024 10:32:44.047391238 | 0 |
| 04/19/2024 10:32:45.064162541 | 0 |
| 04/19/2024 10:32:46.080942844 | 0 |
| 04/19/2024 10:32:47.097727147 | 0 |
| 04/19/2024 10:32:48.114503359 | 0 |
| 04/19/2024 10:32:49.131273996 | 0 |
| 04/19/2024 10:32:50.148049147 | 0 |
| 04/19/2024 10:32:51.164823753 | 0 |
| 04/19/2024 10:32:52.181599087 | 0 |
| 04/19/2024 10:32:53.198379481 | 0 |
| 04/19/2024 10:32:54.215151420 | 0 |
| 04/19/2024 10:32:55.231923632 | 0 |
| 04/19/2024 10:32:56.248707723 | 0 |
| 04/19/2024 10:32:57.265481329 | 0 |
| 04/19/2024 10:32:58.282259541 | 0 |
| 04/19/2024 10:32:59.299037147 | 0 |
| 04/19/2024 10:33:00.315816268 | 0 |
| 04/19/2024 10:33:01.332596056 | 0 |
| 04/19/2024 10:33:02.349374268 | 0 |
| 04/19/2024 10:33:03.366149420 | 0 |
| 04/19/2024 10:33:04.382929693 | 0 |
| 04/19/2024 10:33:05.399711057 | 0 |
| 04/19/2024 10:33:06.416499966 | 0 |
| 04/19/2024 10:33:07.433274117 | 0 |
| 04/19/2024 10:33:08.450049208 | 0 |
| 04/19/2024 10:33:09.466829966 | 0 |
| 04/19/2024 10:33:10.483607147 | 0 |
| 04/19/2024 10:33:11.500387663 | 0 |
| 04/19/2024 10:33:12.517161450 | 0 |
| 04/19/2024 10:33:13.533930572 | 0 |
| 04/19/2024 10:33:14.550714450 | 0 |
| 04/19/2024 10:33:15.567494420 | 0 |
| 04/19/2024 10:33:16.584268329 | 0 |
| 04/19/2024 10:33:17.601043057 | 0 |
| 04/19/2024 10:33:18.617825147 | 0 |
| 04/19/2024 10:33:19.634602117 | 0 |
| 04/19/2024 10:33:20.651377663 | 0 |
| 04/19/2024 10:33:21.668149572 | 0 |
| 04/19/2024 10:33:22.684925299 | 0 |
| 04/19/2024 10:33:23.701703360 | 0 |
| 04/19/2024 10:33:24.718478693 | 0 |
| 04/19/2024 10:33:25.735252723 | 0 |
| 04/19/2024 10:33:26.752024784 | 0 |
| 04/19/2024 10:33:27.768798663 | 0 |
| 04/19/2024 10:33:28.785577420 | 0 |
| 04/19/2024 10:33:29.802359390 | 0 |
| 04/19/2024 10:33:30.819133935 | 0 |
| 04/19/2024 10:33:31.835910057 | 0 |
| 04/19/2024 10:33:32.852692087 | 0 |
| 04/19/2024 10:33:33.869471208 | 0 |
| 04/19/2024 10:33:34.886245784 | 0 |
| 04/19/2024 10:33:35.903019102 | 0 |
| 04/19/2024 10:33:36.919799557 | 0 |
| 04/19/2024 10:33:37.936574072 | 0 |
| 04/19/2024 10:33:38.953347435 | 0 |
| 04/19/2024 10:33:39.970124193 | 0 |
| 04/19/2024 10:33:40.986903072 | 0 |
| 04/19/2024 10:33:42.003679223 | 0 |
| 04/19/2024 10:33:43.020464587 | 0 |
| 04/19/2024 10:33:44.037249193 | 0 |
| 04/19/2024 10:33:45.054026072 | 0 |
| 04/19/2024 10:33:46.070807072 | 0 |
| 04/19/2024 10:33:47.087588011 | 0 |
| 04/19/2024 10:33:48.104364981 | 0 |
| 04/19/2024 10:33:49.121137920 | 0 |
| 04/19/2024 10:33:50.137908708 | 0 |
| 04/19/2024 10:33:51.154685284 | 0 |
| 04/19/2024 10:33:52.171459557 | 0 |
| 04/19/2024 10:33:53.188231557 | 0 |
| 04/19/2024 10:33:54.205007738 | 0 |
| 04/19/2024 10:33:55.221784738 | 0 |
| 04/19/2024 10:33:56.238560072 | 0 |
| 04/19/2024 10:33:57.255334526 | 0 |
| 04/19/2024 10:33:58.272106617 | 0 |
| 04/19/2024 10:33:59.288893648 | 0 |
| 04/19/2024 10:34:00.305674738 | 0 |
| 04/19/2024 10:34:01.322454769 | 0 |
| 04/19/2024 10:34:02.339233435 | 0 |
| 04/19/2024 10:34:03.356005344 | 0 |
| 04/19/2024 10:34:04.372789132 | 0 |
| 04/19/2024 10:34:05.389566102 | 0 |
| 04/19/2024 10:34:06.406347889 | 0 |
| 04/19/2024 10:34:07.423121859 | 0 |
| 04/19/2024 10:34:08.439895496 | 0 |
| 04/19/2024 10:34:09.456671647 | 0 |
| 04/19/2024 10:34:10.473445829 | 0 |
| 04/19/2024 10:34:11.490223920 | 0 |
| 04/19/2024 10:34:12.506998344 | 0 |
| 04/19/2024 10:34:13.523774708 | 0 |
| 04/19/2024 10:34:14.540560708 | 0 |
| 04/19/2024 10:34:15.557342980 | 0 |
| 04/19/2024 10:34:16.574113889 | 0 |
| 04/19/2024 10:34:17.590899314 | 0 |
| 04/19/2024 10:34:18.607676435 | 0 |
| 04/19/2024 10:34:19.624447677 | 0 |
| 04/19/2024 10:34:20.641220799 | 0 |
| 04/19/2024 10:34:21.657996586 | 0 |
| 04/19/2024 10:34:22.674768980 | 0 |
| 04/19/2024 10:34:23.691547526 | 0 |
| 04/19/2024 10:34:24.708324768 | 0 |
| 04/19/2024 10:34:25.725096435 | 0 |
| 04/19/2024 10:34:26.741871465 | 0 |
| 04/19/2024 10:34:27.758646374 | 0 |
| 04/19/2024 10:34:28.775418102 | 0 |
| 04/19/2024 10:34:29.792203526 | 0 |
| 04/19/2024 10:34:30.808983980 | 0 |
| 04/19/2024 10:34:31.825763647 | 0 |
| 04/19/2024 10:34:32.842542526 | 0 |
| 04/19/2024 10:34:33.859320677 | 0 |
| 04/19/2024 10:34:34.876093041 | 0 |
| 04/19/2024 10:34:35.892872875 | 0 |
| 04/19/2024 10:34:36.909653754 | 0 |
| 04/19/2024 10:34:37.926426936 | 0 |
| 04/19/2024 10:34:38.943201027 | 0 |
| 04/19/2024 10:34:39.959980027 | 0 |
| 04/19/2024 10:34:40.976757996 | 0 |
| 04/19/2024 10:34:41.993537996 | 0 |
| 04/19/2024 10:34:43.010317572 | 0 |
| 04/19/2024 10:34:44.027090269 | 0 |
| 04/19/2024 10:34:45.043870481 | 0 |
| 04/19/2024 10:34:46.060648330 | 0 |
| 04/19/2024 10:34:47.077432693 | 0 |
| 04/19/2024 10:34:48.094210996 | 0 |
| 04/19/2024 10:34:49.110994936 | 0 |
| 04/19/2024 10:34:50.127778754 | 0 |
| 04/19/2024 10:34:51.144554148 | 0 |
| 04/19/2024 10:34:52.161331057 | 0 |
| 04/19/2024 10:34:53.178104905 | 0 |
| 04/19/2024 10:34:54.194883239 | 0 |
| 04/19/2024 10:34:55.211658572 | 0 |
| 04/19/2024 10:34:56.228434330 | 0 |
| 04/19/2024 10:34:57.245209360 | 0 |
| 04/19/2024 10:34:58.261986118 | 0 |
| 04/19/2024 10:34:59.278762542 | 0 |
| 04/19/2024 10:35:00.295542451 | 0 |
| 04/19/2024 10:35:01.312323057 | 0 |
| 04/19/2024 10:35:02.329098724 | 0 |
| 04/19/2024 10:35:03.345870239 | 0 |
| 04/19/2024 10:35:04.362652330 | 0 |
| 04/19/2024 10:35:05.379433359 | 0 |
| 04/19/2024 10:35:06.396217056 | 0 |
| 04/19/2024 10:35:07.412999965 | 0 |
| 04/19/2024 10:35:08.429778814 | 0 |
| 04/19/2024 10:35:09.446557511 | 0 |
| 04/19/2024 10:35:10.463330602 | 0 |
| 04/19/2024 10:35:11.480112693 | 0 |
| 04/19/2024 10:35:12.496892511 | 0 |
| 04/19/2024 10:35:13.513672571 | 0 |
| 04/19/2024 10:35:14.530455632 | 0 |
| 04/19/2024 10:35:15.547236541 | 0 |
| 04/19/2024 10:35:16.564010177 | 0 |
| 04/19/2024 10:35:17.580789602 | 0 |
| 04/19/2024 10:35:18.597573177 | 0 |
| 04/19/2024 10:35:19.614349450 | 0 |
| 04/19/2024 10:35:20.631120844 | 0 |
| 04/19/2024 10:35:21.647890147 | 0 |
| 04/19/2024 10:35:22.664664541 | 0 |
| 04/19/2024 10:35:23.681437177 | 0 |
| 04/19/2024 10:35:24.698216844 | 0 |
| 04/19/2024 10:35:25.714997541 | 0 |
| 04/19/2024 10:35:26.731773238 | 0 |
| 04/19/2024 10:35:27.748547450 | 0 |
| 04/19/2024 10:35:28.765322753 | 0 |
| 04/19/2024 10:35:29.782094299 | 0 |
| 04/19/2024 10:35:30.798879632 | 0 |
| 04/19/2024 10:35:31.815659905 | 0 |
| 04/19/2024 10:35:32.832440026 | 0 |
| 04/19/2024 10:35:33.849221996 | 0 |
| 04/19/2024 10:35:34.865999177 | 0 |
| 04/19/2024 10:35:35.882775466 | 0 |
| 04/19/2024 10:35:36.899554557 | 0 |
| 04/19/2024 10:35:37.916327739 | 0 |
| 04/19/2024 10:35:38.933101102 | 0 |
| 04/19/2024 10:35:39.949880739 | 0 |
| 04/19/2024 10:35:40.966656405 | 0 |
| 04/19/2024 10:35:41.983434254 | 0 |
| 04/19/2024 10:35:43.000214951 | 0 |
| 04/19/2024 10:35:44.016995557 | 0 |
| 04/19/2024 10:35:45.033773708 | 0 |
| 04/19/2024 10:35:46.050556678 | 0 |
| 04/19/2024 10:35:47.067339648 | 0 |
| 04/19/2024 10:35:48.084115708 | 0 |
| 04/19/2024 10:35:49.100898830 | 0 |
| 04/19/2024 10:35:50.117677405 | 0 |
| 04/19/2024 10:35:51.134453527 | 0 |
| 04/19/2024 10:35:52.151226921 | 0 |
| 04/19/2024 10:35:53.167997072 | 0 |
| 04/19/2024 10:35:54.184773921 | 0 |
| 04/19/2024 10:35:55.201551921 | 0 |
| 04/19/2024 10:35:56.218326072 | 0 |
| 04/19/2024 10:35:57.235101102 | 0 |
| 04/19/2024 10:35:58.251880678 | 0 |
| 04/19/2024 10:35:59.268652315 | 0 |
| 04/19/2024 10:36:00.285424284 | 0 |
| 04/19/2024 10:36:01.302204193 | 0 |
| 04/19/2024 10:36:02.318980981 | 0 |
| 04/19/2024 10:36:03.335762436 | 0 |
| 04/19/2024 10:36:04.352544254 | 0 |
| 04/19/2024 10:36:05.369323647 | 0 |
| 04/19/2024 10:36:06.386100981 | 0 |
| 04/19/2024 10:36:07.402886253 | 0 |
| 04/19/2024 10:36:08.419668344 | 0 |
| 04/19/2024 10:36:09.436447193 | 0 |
| 04/19/2024 10:36:10.453222526 | 0 |
| 04/19/2024 10:36:11.469999072 | 0 |
| 04/19/2024 10:36:12.486777526 | 0 |
| 04/19/2024 10:36:13.503556102 | 0 |
| 04/19/2024 10:36:14.520334375 | 0 |
| 04/19/2024 10:36:15.537107526 | 0 |
| 04/19/2024 10:36:16.553891041 | 0 |
| 04/19/2024 10:36:17.570671163 | 0 |
| 04/19/2024 10:36:18.587450496 | 0 |
| 04/19/2024 10:36:19.604230829 | 0 |
| 04/19/2024 10:36:20.621014617 | 0 |
| 04/19/2024 10:36:21.637791738 | 0 |
| 04/19/2024 10:36:22.654562011 | 0 |
| 04/19/2024 10:36:23.671334981 | 0 |
| 04/19/2024 10:36:24.688104799 | 0 |
| 04/19/2024 10:36:25.704881829 | 0 |
| 04/19/2024 10:36:26.721657738 | 0 |
| 04/19/2024 10:36:27.738438466 | 0 |
| 04/19/2024 10:36:28.755213950 | 0 |
| 04/19/2024 10:36:29.771989708 | 0 |
| 04/19/2024 10:36:30.788767860 | 0 |
| 04/19/2024 10:36:31.805552466 | 0 |
| 04/19/2024 10:36:32.822331041 | 0 |
| 04/19/2024 10:36:33.839106344 | 0 |
| 04/19/2024 10:36:34.855886375 | 0 |
| 04/19/2024 10:36:35.872667481 | 0 |
| 04/19/2024 10:36:36.889447421 | 0 |
| 04/19/2024 10:36:37.906222239 | 0 |
| 04/19/2024 10:36:38.923005087 | 0 |
| 04/19/2024 10:36:39.939782633 | 0 |
| 04/19/2024 10:36:40.956556572 | 0 |
| 04/19/2024 10:36:41.973330208 | 0 |
| 04/19/2024 10:36:42.990111390 | 0 |
| 04/19/2024 10:36:44.006892269 | 0 |
| 04/19/2024 10:36:45.023671784 | 0 |
| 04/19/2024 10:36:46.040455330 | 0 |
| 04/19/2024 10:36:47.057241299 | 0 |
| 04/19/2024 10:36:48.074012875 | 0 |
| 04/19/2024 10:36:49.090801421 | 0 |
| 04/19/2024 10:36:50.107582875 | 0 |
| 04/19/2024 10:36:51.124360875 | 0 |
| 04/19/2024 10:36:52.141133936 | 0 |
| 04/19/2024 10:36:53.157915087 | 0 |
| 04/19/2024 10:36:54.174691178 | 0 |
| 04/19/2024 10:36:55.191467027 | 0 |
| 04/19/2024 10:36:56.208247178 | 0 |
| 04/19/2024 10:36:57.225019905 | 0 |
| 04/19/2024 10:36:58.241799663 | 0 |
| 04/19/2024 10:36:59.258575118 | 0 |
| 04/19/2024 10:37:00.275348905 | 0 |
| 04/19/2024 10:37:01.292124360 | 0 |